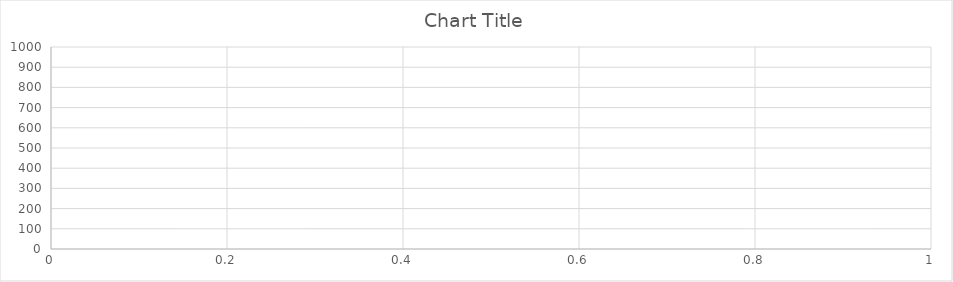
| Category | Series 0 |
|---|---|
| 0 | 0 |
| 1 | 0 |
| 2 | 0 |
| 3 | 0 |
| 4 | 0 |
| 5 | 0 |
| 6 | 0 |
| 7 | 0 |
| 8 | 0 |
| 9 | 0 |
| 10 | 0 |
| 11 | 0 |
| 12 | 0 |
| 13 | 0 |
| 14 | 0 |
| 15 | 0 |
| 16 | 0 |
| 17 | 0 |
| 18 | 0 |
| 19 | 0 |
| 20 | 0 |
| 21 | 0 |
| 22 | 0 |
| 23 | 0 |
| 24 | 0 |
| 25 | 0 |
| 26 | 0 |
| 27 | 0 |
| 28 | 0 |
| 29 | 0 |
| 30 | 0 |
| 31 | 0 |
| 32 | 0 |
| 33 | 0 |
| 34 | 0 |
| 35 | 0 |
| 36 | 0 |
| 37 | 0 |
| 38 | 0 |
| 39 | 0 |
| 40 | 0 |
| 41 | 0 |
| 42 | 0 |
| 43 | 0 |
| 44 | 0 |
| 45 | 0 |
| 46 | 0 |
| 47 | 0 |
| 48 | 0 |
| 49 | 0 |
| 50 | 0 |
| 51 | 0 |
| 52 | 0 |
| 53 | 0 |
| 54 | 0 |
| 55 | 0 |
| 56 | 0 |
| 57 | 0 |
| 58 | 0 |
| 59 | 0 |
| 60 | 0 |
| 61 | 0 |
| 62 | 0 |
| 63 | 0 |
| 64 | 0 |
| 65 | 0 |
| 66 | 0 |
| 67 | 0 |
| 68 | 0 |
| 69 | 0 |
| 70 | 0 |
| 71 | 0 |
| 72 | 0 |
| 73 | 0 |
| 74 | 0 |
| 75 | 0 |
| 76 | 0 |
| 77 | 0 |
| 78 | 0 |
| 79 | 0 |
| 80 | 0 |
| 81 | 0 |
| 82 | 0 |
| 83 | 0 |
| 84 | 0 |
| 85 | 0 |
| 86 | 0 |
| 87 | 0 |
| 88 | 0 |
| 89 | 0 |
| 90 | 0 |
| 91 | 0 |
| 92 | 0 |
| 93 | 0 |
| 94 | 0 |
| 95 | 0 |
| 96 | 0 |
| 97 | 0 |
| 98 | 0 |
| 99 | 0 |
| 100 | 0 |
| 101 | 913 |
| 102 | 913 |
| 103 | 912 |
| 104 | 0 |
| 105 | 0 |
| 106 | 0 |
| 107 | 0 |
| 108 | 0 |
| 109 | 0 |
| 110 | 0 |
| 111 | 0 |
| 112 | 0 |
| 113 | 0 |
| 114 | 0 |
| 115 | 0 |
| 116 | 0 |
| 117 | 0 |
| 118 | 0 |
| 119 | 0 |
| 120 | 0 |
| 121 | 0 |
| 122 | 0 |
| 123 | 0 |
| 124 | 0 |
| 125 | 0 |
| 126 | 0 |
| 127 | 0 |
| 128 | 0 |
| 129 | 0 |
| 130 | 0 |
| 131 | 0 |
| 132 | 0 |
| 133 | 0 |
| 134 | 0 |
| 135 | 0 |
| 136 | 0 |
| 137 | 0 |
| 138 | 0 |
| 139 | 0 |
| 140 | 0 |
| 141 | 0 |
| 142 | 0 |
| 143 | 0 |
| 144 | 0 |
| 145 | 0 |
| 146 | 0 |
| 147 | 0 |
| 148 | 0 |
| 149 | 0 |
| 150 | 0 |
| 151 | 0 |
| 152 | 0 |
| 153 | 0 |
| 154 | 0 |
| 155 | 0 |
| 156 | 0 |
| 157 | 0 |
| 158 | 0 |
| 159 | 0 |
| 160 | 0 |
| 161 | 0 |
| 162 | 0 |
| 163 | 0 |
| 164 | 0 |
| 165 | 0 |
| 166 | 0 |
| 167 | 0 |
| 168 | 0 |
| 169 | 0 |
| 170 | 0 |
| 171 | 0 |
| 172 | 0 |
| 173 | 0 |
| 174 | 0 |
| 175 | 0 |
| 176 | 0 |
| 177 | 0 |
| 178 | 0 |
| 179 | 0 |
| 180 | 0 |
| 181 | 0 |
| 182 | 0 |
| 183 | 0 |
| 184 | 0 |
| 185 | 0 |
| 186 | 0 |
| 187 | 0 |
| 188 | 0 |
| 189 | 0 |
| 190 | 0 |
| 191 | 0 |
| 192 | 0 |
| 193 | 0 |
| 194 | 0 |
| 195 | 0 |
| 196 | 0 |
| 197 | 0 |
| 198 | 0 |
| 199 | 0 |
| 200 | 0 |
| 201 | 0 |
| 202 | 0 |
| 203 | 0 |
| 204 | 0 |
| 205 | 0 |
| 206 | 0 |
| 207 | 0 |
| 208 | 0 |
| 209 | 0 |
| 210 | 0 |
| 211 | 0 |
| 212 | 0 |
| 213 | 0 |
| 214 | 0 |
| 215 | 0 |
| 216 | 0 |
| 217 | 0 |
| 218 | 0 |
| 219 | 0 |
| 220 | 0 |
| 221 | 0 |
| 222 | 0 |
| 223 | 0 |
| 224 | 0 |
| 225 | 0 |
| 226 | 0 |
| 227 | 0 |
| 228 | 0 |
| 229 | 0 |
| 230 | 0 |
| 231 | 0 |
| 232 | 0 |
| 233 | 0 |
| 234 | 0 |
| 235 | 0 |
| 236 | 0 |
| 237 | 0 |
| 238 | 0 |
| 239 | 0 |
| 240 | 0 |
| 241 | 0 |
| 242 | 0 |
| 243 | 0 |
| 244 | 0 |
| 245 | 0 |
| 246 | 0 |
| 247 | 0 |
| 248 | 0 |
| 249 | 0 |
| 250 | 0 |
| 251 | 0 |
| 252 | 0 |
| 253 | 0 |
| 254 | 0 |
| 255 | 0 |
| 256 | 0 |
| 257 | 0 |
| 258 | 0 |
| 259 | 0 |
| 260 | 0 |
| 261 | 0 |
| 262 | 0 |
| 263 | 0 |
| 264 | 0 |
| 265 | 0 |
| 266 | 0 |
| 267 | 0 |
| 268 | 0 |
| 269 | 0 |
| 270 | 0 |
| 271 | 0 |
| 272 | 0 |
| 273 | 0 |
| 274 | 0 |
| 275 | 0 |
| 276 | 0 |
| 277 | 0 |
| 278 | 0 |
| 279 | 0 |
| 280 | 0 |
| 281 | 0 |
| 282 | 0 |
| 283 | 0 |
| 284 | 0 |
| 285 | 0 |
| 286 | 0 |
| 287 | 0 |
| 288 | 0 |
| 289 | 0 |
| 290 | 0 |
| 291 | 0 |
| 292 | 0 |
| 293 | 0 |
| 294 | 0 |
| 295 | 0 |
| 296 | 0 |
| 297 | 0 |
| 298 | 0 |
| 299 | 0 |
| 300 | 0 |
| 301 | 0 |
| 302 | 0 |
| 303 | 0 |
| 304 | 0 |
| 305 | 0 |
| 306 | 0 |
| 307 | 0 |
| 308 | 0 |
| 309 | 0 |
| 310 | 0 |
| 311 | 0 |
| 312 | 0 |
| 313 | 0 |
| 314 | 0 |
| 315 | 0 |
| 316 | 0 |
| 317 | 0 |
| 318 | 0 |
| 319 | 0 |
| 320 | 0 |
| 321 | 0 |
| 322 | 0 |
| 323 | 0 |
| 324 | 0 |
| 325 | 0 |
| 326 | 0 |
| 327 | 0 |
| 328 | 0 |
| 329 | 0 |
| 330 | 0 |
| 331 | 0 |
| 332 | 0 |
| 333 | 0 |
| 334 | 0 |
| 335 | 0 |
| 336 | 0 |
| 337 | 912 |
| 338 | 911 |
| 339 | 911 |
| 340 | 0 |
| 341 | 0 |
| 342 | 0 |
| 343 | 0 |
| 344 | 0 |
| 345 | 0 |
| 346 | 0 |
| 347 | 0 |
| 348 | 0 |
| 349 | 0 |
| 350 | 0 |
| 351 | 0 |
| 352 | 0 |
| 353 | 0 |
| 354 | 0 |
| 355 | 0 |
| 356 | 0 |
| 357 | 0 |
| 358 | 0 |
| 359 | 0 |
| 360 | 0 |
| 361 | 0 |
| 362 | 0 |
| 363 | 0 |
| 364 | 0 |
| 365 | 0 |
| 366 | 0 |
| 367 | 0 |
| 368 | 0 |
| 369 | 0 |
| 370 | 0 |
| 371 | 0 |
| 372 | 0 |
| 373 | 0 |
| 374 | 0 |
| 375 | 0 |
| 376 | 0 |
| 377 | 0 |
| 378 | 0 |
| 379 | 0 |
| 380 | 0 |
| 381 | 0 |
| 382 | 0 |
| 383 | 0 |
| 384 | 0 |
| 385 | 0 |
| 386 | 0 |
| 387 | 0 |
| 388 | 0 |
| 389 | 0 |
| 390 | 0 |
| 391 | 0 |
| 392 | 0 |
| 393 | 0 |
| 394 | 0 |
| 395 | 0 |
| 396 | 0 |
| 397 | 0 |
| 398 | 0 |
| 399 | 0 |
| 400 | 0 |
| 401 | 0 |
| 402 | 0 |
| 403 | 0 |
| 404 | 0 |
| 405 | 0 |
| 406 | 0 |
| 407 | 0 |
| 408 | 0 |
| 409 | 0 |
| 410 | 0 |
| 411 | 0 |
| 412 | 0 |
| 413 | 0 |
| 414 | 0 |
| 415 | 0 |
| 416 | 0 |
| 417 | 0 |
| 418 | 0 |
| 419 | 0 |
| 420 | 0 |
| 421 | 0 |
| 422 | 0 |
| 423 | 0 |
| 424 | 0 |
| 425 | 0 |
| 426 | 0 |
| 427 | 0 |
| 428 | 0 |
| 429 | 0 |
| 430 | 0 |
| 431 | 0 |
| 432 | 0 |
| 433 | 0 |
| 434 | 0 |
| 435 | 0 |
| 436 | 0 |
| 437 | 0 |
| 438 | 0 |
| 439 | 0 |
| 440 | 0 |
| 441 | 0 |
| 442 | 0 |
| 443 | 0 |
| 444 | 0 |
| 445 | 0 |
| 446 | 0 |
| 447 | 0 |
| 448 | 0 |
| 449 | 0 |
| 450 | 0 |
| 451 | 0 |
| 452 | 0 |
| 453 | 0 |
| 454 | 0 |
| 455 | 0 |
| 456 | 0 |
| 457 | 0 |
| 458 | 0 |
| 459 | 0 |
| 460 | 0 |
| 461 | 0 |
| 462 | 0 |
| 463 | 0 |
| 464 | 0 |
| 465 | 0 |
| 466 | 0 |
| 467 | 0 |
| 468 | 0 |
| 469 | 0 |
| 470 | 0 |
| 471 | 0 |
| 472 | 0 |
| 473 | 0 |
| 474 | 0 |
| 475 | 0 |
| 476 | 0 |
| 477 | 0 |
| 478 | 0 |
| 479 | 0 |
| 480 | 0 |
| 481 | 0 |
| 482 | 0 |
| 483 | 0 |
| 484 | 0 |
| 485 | 0 |
| 486 | 0 |
| 487 | 0 |
| 488 | 0 |
| 489 | 0 |
| 490 | 0 |
| 491 | 0 |
| 492 | 0 |
| 493 | 0 |
| 494 | 0 |
| 495 | 0 |
| 496 | 0 |
| 497 | 0 |
| 498 | 0 |
| 499 | 0 |
| 500 | 0 |
| 501 | 0 |
| 502 | 0 |
| 503 | 0 |
| 504 | 0 |
| 505 | 0 |
| 506 | 0 |
| 507 | 0 |
| 508 | 0 |
| 509 | 0 |
| 510 | 0 |
| 511 | 0 |
| 512 | 0 |
| 513 | 0 |
| 514 | 0 |
| 515 | 0 |
| 516 | 0 |
| 517 | 0 |
| 518 | 0 |
| 519 | 0 |
| 520 | 0 |
| 521 | 0 |
| 522 | 0 |
| 523 | 0 |
| 524 | 0 |
| 525 | 0 |
| 526 | 0 |
| 527 | 0 |
| 528 | 0 |
| 529 | 0 |
| 530 | 0 |
| 531 | 0 |
| 532 | 0 |
| 533 | 0 |
| 534 | 0 |
| 535 | 0 |
| 536 | 0 |
| 537 | 0 |
| 538 | 0 |
| 539 | 0 |
| 540 | 0 |
| 541 | 0 |
| 542 | 0 |
| 543 | 0 |
| 544 | 0 |
| 545 | 0 |
| 546 | 0 |
| 547 | 0 |
| 548 | 0 |
| 549 | 0 |
| 550 | 0 |
| 551 | 0 |
| 552 | 0 |
| 553 | 0 |
| 554 | 0 |
| 555 | 0 |
| 556 | 0 |
| 557 | 0 |
| 558 | 0 |
| 559 | 0 |
| 560 | 0 |
| 561 | 0 |
| 562 | 0 |
| 563 | 0 |
| 564 | 0 |
| 565 | 0 |
| 566 | 0 |
| 567 | 0 |
| 568 | 0 |
| 569 | 0 |
| 570 | 0 |
| 571 | 0 |
| 572 | 0 |
| 573 | 912 |
| 574 | 911 |
| 575 | 910 |
| 576 | 0 |
| 577 | 0 |
| 578 | 0 |
| 579 | 0 |
| 580 | 0 |
| 581 | 0 |
| 582 | 0 |
| 583 | 0 |
| 584 | 0 |
| 585 | 0 |
| 586 | 0 |
| 587 | 0 |
| 588 | 0 |
| 589 | 0 |
| 590 | 0 |
| 591 | 0 |
| 592 | 0 |
| 593 | 0 |
| 594 | 0 |
| 595 | 0 |
| 596 | 0 |
| 597 | 0 |
| 598 | 0 |
| 599 | 0 |
| 600 | 0 |
| 601 | 0 |
| 602 | 0 |
| 603 | 0 |
| 604 | 0 |
| 605 | 0 |
| 606 | 0 |
| 607 | 0 |
| 608 | 0 |
| 609 | 0 |
| 610 | 0 |
| 611 | 0 |
| 612 | 0 |
| 613 | 0 |
| 614 | 0 |
| 615 | 0 |
| 616 | 0 |
| 617 | 0 |
| 618 | 0 |
| 619 | 0 |
| 620 | 0 |
| 621 | 0 |
| 622 | 0 |
| 623 | 0 |
| 624 | 0 |
| 625 | 0 |
| 626 | 0 |
| 627 | 0 |
| 628 | 0 |
| 629 | 0 |
| 630 | 0 |
| 631 | 0 |
| 632 | 0 |
| 633 | 0 |
| 634 | 0 |
| 635 | 0 |
| 636 | 0 |
| 637 | 0 |
| 638 | 0 |
| 639 | 0 |
| 640 | 0 |
| 641 | 0 |
| 642 | 0 |
| 643 | 0 |
| 644 | 0 |
| 645 | 0 |
| 646 | 0 |
| 647 | 0 |
| 648 | 0 |
| 649 | 0 |
| 650 | 0 |
| 651 | 0 |
| 652 | 0 |
| 653 | 0 |
| 654 | 0 |
| 655 | 0 |
| 656 | 0 |
| 657 | 0 |
| 658 | 0 |
| 659 | 0 |
| 660 | 0 |
| 661 | 0 |
| 662 | 0 |
| 663 | 0 |
| 664 | 0 |
| 665 | 0 |
| 666 | 0 |
| 667 | 0 |
| 668 | 0 |
| 669 | 0 |
| 670 | 0 |
| 671 | 0 |
| 672 | 0 |
| 673 | 0 |
| 674 | 0 |
| 675 | 0 |
| 676 | 0 |
| 677 | 0 |
| 678 | 0 |
| 679 | 0 |
| 680 | 0 |
| 681 | 0 |
| 682 | 0 |
| 683 | 0 |
| 684 | 0 |
| 685 | 0 |
| 686 | 0 |
| 687 | 0 |
| 688 | 0 |
| 689 | 0 |
| 690 | 0 |
| 691 | 0 |
| 692 | 0 |
| 693 | 0 |
| 694 | 0 |
| 695 | 0 |
| 696 | 0 |
| 697 | 0 |
| 698 | 0 |
| 699 | 0 |
| 700 | 0 |
| 701 | 0 |
| 702 | 0 |
| 703 | 0 |
| 704 | 0 |
| 705 | 0 |
| 706 | 0 |
| 707 | 0 |
| 708 | 0 |
| 709 | 0 |
| 710 | 0 |
| 711 | 0 |
| 712 | 0 |
| 713 | 0 |
| 714 | 0 |
| 715 | 0 |
| 716 | 0 |
| 717 | 0 |
| 718 | 0 |
| 719 | 0 |
| 720 | 0 |
| 721 | 0 |
| 722 | 0 |
| 723 | 0 |
| 724 | 0 |
| 725 | 0 |
| 726 | 0 |
| 727 | 0 |
| 728 | 0 |
| 729 | 0 |
| 730 | 0 |
| 731 | 0 |
| 732 | 0 |
| 733 | 0 |
| 734 | 0 |
| 735 | 0 |
| 736 | 0 |
| 737 | 0 |
| 738 | 0 |
| 739 | 0 |
| 740 | 0 |
| 741 | 0 |
| 742 | 0 |
| 743 | 0 |
| 744 | 0 |
| 745 | 0 |
| 746 | 0 |
| 747 | 0 |
| 748 | 0 |
| 749 | 0 |
| 750 | 0 |
| 751 | 0 |
| 752 | 0 |
| 753 | 0 |
| 754 | 0 |
| 755 | 0 |
| 756 | 0 |
| 757 | 0 |
| 758 | 0 |
| 759 | 0 |
| 760 | 0 |
| 761 | 0 |
| 762 | 0 |
| 763 | 0 |
| 764 | 0 |
| 765 | 0 |
| 766 | 0 |
| 767 | 0 |
| 768 | 0 |
| 769 | 0 |
| 770 | 0 |
| 771 | 0 |
| 772 | 0 |
| 773 | 0 |
| 774 | 0 |
| 775 | 0 |
| 776 | 0 |
| 777 | 0 |
| 778 | 0 |
| 779 | 0 |
| 780 | 0 |
| 781 | 0 |
| 782 | 0 |
| 783 | 0 |
| 784 | 0 |
| 785 | 0 |
| 786 | 0 |
| 787 | 0 |
| 788 | 0 |
| 789 | 0 |
| 790 | 0 |
| 791 | 0 |
| 792 | 0 |
| 793 | 0 |
| 794 | 0 |
| 795 | 0 |
| 796 | 0 |
| 797 | 0 |
| 798 | 0 |
| 799 | 0 |
| 800 | 0 |
| 801 | 0 |
| 802 | 0 |
| 803 | 0 |
| 804 | 0 |
| 805 | 0 |
| 806 | 0 |
| 807 | 0 |
| 808 | 914 |
| 809 | 914 |
| 810 | 912 |
| 811 | 912 |
| 812 | 0 |
| 813 | 0 |
| 814 | 0 |
| 815 | 0 |
| 816 | 0 |
| 817 | 0 |
| 818 | 0 |
| 819 | 0 |
| 820 | 0 |
| 821 | 0 |
| 822 | 0 |
| 823 | 0 |
| 824 | 0 |
| 825 | 0 |
| 826 | 0 |
| 827 | 0 |
| 828 | 0 |
| 829 | 0 |
| 830 | 0 |
| 831 | 0 |
| 832 | 0 |
| 833 | 0 |
| 834 | 0 |
| 835 | 0 |
| 836 | 0 |
| 837 | 0 |
| 838 | 0 |
| 839 | 0 |
| 840 | 0 |
| 841 | 0 |
| 842 | 0 |
| 843 | 0 |
| 844 | 0 |
| 845 | 0 |
| 846 | 0 |
| 847 | 0 |
| 848 | 0 |
| 849 | 0 |
| 850 | 0 |
| 851 | 0 |
| 852 | 0 |
| 853 | 0 |
| 854 | 0 |
| 855 | 0 |
| 856 | 0 |
| 857 | 0 |
| 858 | 0 |
| 859 | 0 |
| 860 | 0 |
| 861 | 0 |
| 862 | 0 |
| 863 | 0 |
| 864 | 0 |
| 865 | 0 |
| 866 | 0 |
| 867 | 0 |
| 868 | 0 |
| 869 | 0 |
| 870 | 0 |
| 871 | 0 |
| 872 | 0 |
| 873 | 0 |
| 874 | 0 |
| 875 | 0 |
| 876 | 0 |
| 877 | 0 |
| 878 | 0 |
| 879 | 0 |
| 880 | 0 |
| 881 | 0 |
| 882 | 0 |
| 883 | 0 |
| 884 | 0 |
| 885 | 0 |
| 886 | 0 |
| 887 | 0 |
| 888 | 0 |
| 889 | 0 |
| 890 | 0 |
| 891 | 0 |
| 892 | 0 |
| 893 | 0 |
| 894 | 0 |
| 895 | 0 |
| 896 | 0 |
| 897 | 0 |
| 898 | 0 |
| 899 | 0 |
| 900 | 0 |
| 901 | 0 |
| 902 | 0 |
| 903 | 0 |
| 904 | 0 |
| 905 | 0 |
| 906 | 0 |
| 907 | 0 |
| 908 | 0 |
| 909 | 0 |
| 910 | 0 |
| 911 | 0 |
| 912 | 0 |
| 913 | 0 |
| 914 | 0 |
| 915 | 0 |
| 916 | 0 |
| 917 | 0 |
| 918 | 0 |
| 919 | 0 |
| 920 | 0 |
| 921 | 0 |
| 922 | 0 |
| 923 | 0 |
| 924 | 0 |
| 925 | 0 |
| 926 | 0 |
| 927 | 0 |
| 928 | 0 |
| 929 | 0 |
| 930 | 0 |
| 931 | 0 |
| 932 | 0 |
| 933 | 0 |
| 934 | 0 |
| 935 | 0 |
| 936 | 0 |
| 937 | 0 |
| 938 | 0 |
| 939 | 0 |
| 940 | 0 |
| 941 | 0 |
| 942 | 0 |
| 943 | 0 |
| 944 | 0 |
| 945 | 0 |
| 946 | 0 |
| 947 | 0 |
| 948 | 0 |
| 949 | 0 |
| 950 | 0 |
| 951 | 0 |
| 952 | 0 |
| 953 | 0 |
| 954 | 0 |
| 955 | 0 |
| 956 | 0 |
| 957 | 0 |
| 958 | 0 |
| 959 | 0 |
| 960 | 0 |
| 961 | 0 |
| 962 | 0 |
| 963 | 0 |
| 964 | 0 |
| 965 | 0 |
| 966 | 0 |
| 967 | 0 |
| 968 | 0 |
| 969 | 0 |
| 970 | 0 |
| 971 | 0 |
| 972 | 0 |
| 973 | 0 |
| 974 | 0 |
| 975 | 0 |
| 976 | 0 |
| 977 | 0 |
| 978 | 0 |
| 979 | 0 |
| 980 | 0 |
| 981 | 0 |
| 982 | 0 |
| 983 | 0 |
| 984 | 0 |
| 985 | 0 |
| 986 | 0 |
| 987 | 0 |
| 988 | 0 |
| 989 | 0 |
| 990 | 0 |
| 991 | 0 |
| 992 | 0 |
| 993 | 0 |
| 994 | 0 |
| 995 | 0 |
| 996 | 0 |
| 997 | 0 |
| 998 | 0 |
| 999 | 0 |
| 1000 | 0 |
| 1001 | 0 |
| 1002 | 0 |
| 1003 | 0 |
| 1004 | 0 |
| 1005 | 0 |
| 1006 | 0 |
| 1007 | 0 |
| 1008 | 0 |
| 1009 | 0 |
| 1010 | 0 |
| 1011 | 0 |
| 1012 | 0 |
| 1013 | 0 |
| 1014 | 0 |
| 1015 | 0 |
| 1016 | 0 |
| 1017 | 0 |
| 1018 | 0 |
| 1019 | 0 |
| 1020 | 0 |
| 1021 | 0 |
| 1022 | 0 |
| 1023 | 0 |
| 1024 | 0 |
| 1025 | 0 |
| 1026 | 0 |
| 1027 | 0 |
| 1028 | 0 |
| 1029 | 0 |
| 1030 | 0 |
| 1031 | 0 |
| 1032 | 0 |
| 1033 | 0 |
| 1034 | 0 |
| 1035 | 0 |
| 1036 | 0 |
| 1037 | 0 |
| 1038 | 0 |
| 1039 | 0 |
| 1040 | 0 |
| 1041 | 0 |
| 1042 | 0 |
| 1043 | 913 |
| 1044 | 914 |
| 1045 | 912 |
| 1046 | 913 |
| 1047 | 0 |
| 1048 | 0 |
| 1049 | 0 |
| 1050 | 0 |
| 1051 | 0 |
| 1052 | 0 |
| 1053 | 0 |
| 1054 | 0 |
| 1055 | 0 |
| 1056 | 0 |
| 1057 | 0 |
| 1058 | 0 |
| 1059 | 0 |
| 1060 | 0 |
| 1061 | 0 |
| 1062 | 0 |
| 1063 | 0 |
| 1064 | 0 |
| 1065 | 0 |
| 1066 | 0 |
| 1067 | 0 |
| 1068 | 0 |
| 1069 | 0 |
| 1070 | 0 |
| 1071 | 0 |
| 1072 | 0 |
| 1073 | 0 |
| 1074 | 0 |
| 1075 | 0 |
| 1076 | 0 |
| 1077 | 0 |
| 1078 | 0 |
| 1079 | 0 |
| 1080 | 0 |
| 1081 | 0 |
| 1082 | 0 |
| 1083 | 0 |
| 1084 | 0 |
| 1085 | 0 |
| 1086 | 0 |
| 1087 | 0 |
| 1088 | 0 |
| 1089 | 0 |
| 1090 | 0 |
| 1091 | 0 |
| 1092 | 0 |
| 1093 | 0 |
| 1094 | 0 |
| 1095 | 0 |
| 1096 | 0 |
| 1097 | 0 |
| 1098 | 0 |
| 1099 | 0 |
| 1100 | 0 |
| 1101 | 0 |
| 1102 | 0 |
| 1103 | 0 |
| 1104 | 0 |
| 1105 | 0 |
| 1106 | 0 |
| 1107 | 0 |
| 1108 | 0 |
| 1109 | 0 |
| 1110 | 0 |
| 1111 | 0 |
| 1112 | 0 |
| 1113 | 0 |
| 1114 | 0 |
| 1115 | 0 |
| 1116 | 0 |
| 1117 | 0 |
| 1118 | 0 |
| 1119 | 0 |
| 1120 | 0 |
| 1121 | 0 |
| 1122 | 0 |
| 1123 | 0 |
| 1124 | 0 |
| 1125 | 0 |
| 1126 | 0 |
| 1127 | 0 |
| 1128 | 0 |
| 1129 | 0 |
| 1130 | 0 |
| 1131 | 0 |
| 1132 | 0 |
| 1133 | 0 |
| 1134 | 0 |
| 1135 | 0 |
| 1136 | 0 |
| 1137 | 0 |
| 1138 | 0 |
| 1139 | 0 |
| 1140 | 0 |
| 1141 | 0 |
| 1142 | 0 |
| 1143 | 0 |
| 1144 | 0 |
| 1145 | 0 |
| 1146 | 0 |
| 1147 | 0 |
| 1148 | 0 |
| 1149 | 0 |
| 1150 | 0 |
| 1151 | 0 |
| 1152 | 0 |
| 1153 | 0 |
| 1154 | 0 |
| 1155 | 0 |
| 1156 | 0 |
| 1157 | 0 |
| 1158 | 0 |
| 1159 | 0 |
| 1160 | 0 |
| 1161 | 0 |
| 1162 | 0 |
| 1163 | 0 |
| 1164 | 0 |
| 1165 | 0 |
| 1166 | 0 |
| 1167 | 0 |
| 1168 | 0 |
| 1169 | 0 |
| 1170 | 0 |
| 1171 | 0 |
| 1172 | 0 |
| 1173 | 0 |
| 1174 | 0 |
| 1175 | 0 |
| 1176 | 0 |
| 1177 | 0 |
| 1178 | 0 |
| 1179 | 0 |
| 1180 | 0 |
| 1181 | 0 |
| 1182 | 0 |
| 1183 | 0 |
| 1184 | 0 |
| 1185 | 0 |
| 1186 | 0 |
| 1187 | 0 |
| 1188 | 0 |
| 1189 | 0 |
| 1190 | 0 |
| 1191 | 0 |
| 1192 | 0 |
| 1193 | 0 |
| 1194 | 0 |
| 1195 | 0 |
| 1196 | 0 |
| 1197 | 0 |
| 1198 | 0 |
| 1199 | 0 |
| 1200 | 0 |
| 1201 | 0 |
| 1202 | 0 |
| 1203 | 0 |
| 1204 | 0 |
| 1205 | 0 |
| 1206 | 0 |
| 1207 | 0 |
| 1208 | 0 |
| 1209 | 0 |
| 1210 | 0 |
| 1211 | 0 |
| 1212 | 0 |
| 1213 | 0 |
| 1214 | 0 |
| 1215 | 0 |
| 1216 | 0 |
| 1217 | 0 |
| 1218 | 0 |
| 1219 | 0 |
| 1220 | 0 |
| 1221 | 0 |
| 1222 | 0 |
| 1223 | 0 |
| 1224 | 0 |
| 1225 | 0 |
| 1226 | 0 |
| 1227 | 0 |
| 1228 | 0 |
| 1229 | 0 |
| 1230 | 0 |
| 1231 | 0 |
| 1232 | 0 |
| 1233 | 0 |
| 1234 | 0 |
| 1235 | 0 |
| 1236 | 0 |
| 1237 | 0 |
| 1238 | 0 |
| 1239 | 0 |
| 1240 | 0 |
| 1241 | 0 |
| 1242 | 0 |
| 1243 | 0 |
| 1244 | 0 |
| 1245 | 0 |
| 1246 | 0 |
| 1247 | 0 |
| 1248 | 0 |
| 1249 | 0 |
| 1250 | 0 |
| 1251 | 0 |
| 1252 | 0 |
| 1253 | 0 |
| 1254 | 0 |
| 1255 | 0 |
| 1256 | 0 |
| 1257 | 0 |
| 1258 | 0 |
| 1259 | 0 |
| 1260 | 0 |
| 1261 | 0 |
| 1262 | 0 |
| 1263 | 0 |
| 1264 | 0 |
| 1265 | 0 |
| 1266 | 0 |
| 1267 | 0 |
| 1268 | 0 |
| 1269 | 0 |
| 1270 | 0 |
| 1271 | 0 |
| 1272 | 0 |
| 1273 | 0 |
| 1274 | 0 |
| 1275 | 0 |
| 1276 | 0 |
| 1277 | 0 |
| 1278 | 0 |
| 1279 | 913 |
| 1280 | 914 |
| 1281 | 912 |
| 1282 | 0 |
| 1283 | 0 |
| 1284 | 0 |
| 1285 | 0 |
| 1286 | 0 |
| 1287 | 0 |
| 1288 | 0 |
| 1289 | 0 |
| 1290 | 0 |
| 1291 | 0 |
| 1292 | 0 |
| 1293 | 0 |
| 1294 | 0 |
| 1295 | 0 |
| 1296 | 0 |
| 1297 | 0 |
| 1298 | 0 |
| 1299 | 0 |
| 1300 | 0 |
| 1301 | 0 |
| 1302 | 0 |
| 1303 | 0 |
| 1304 | 0 |
| 1305 | 0 |
| 1306 | 0 |
| 1307 | 0 |
| 1308 | 0 |
| 1309 | 0 |
| 1310 | 0 |
| 1311 | 0 |
| 1312 | 0 |
| 1313 | 0 |
| 1314 | 0 |
| 1315 | 0 |
| 1316 | 0 |
| 1317 | 0 |
| 1318 | 0 |
| 1319 | 0 |
| 1320 | 0 |
| 1321 | 0 |
| 1322 | 0 |
| 1323 | 0 |
| 1324 | 0 |
| 1325 | 0 |
| 1326 | 0 |
| 1327 | 0 |
| 1328 | 0 |
| 1329 | 0 |
| 1330 | 0 |
| 1331 | 0 |
| 1332 | 0 |
| 1333 | 0 |
| 1334 | 0 |
| 1335 | 0 |
| 1336 | 0 |
| 1337 | 0 |
| 1338 | 0 |
| 1339 | 0 |
| 1340 | 0 |
| 1341 | 0 |
| 1342 | 0 |
| 1343 | 0 |
| 1344 | 0 |
| 1345 | 0 |
| 1346 | 0 |
| 1347 | 0 |
| 1348 | 0 |
| 1349 | 0 |
| 1350 | 0 |
| 1351 | 0 |
| 1352 | 0 |
| 1353 | 0 |
| 1354 | 0 |
| 1355 | 0 |
| 1356 | 0 |
| 1357 | 0 |
| 1358 | 0 |
| 1359 | 0 |
| 1360 | 0 |
| 1361 | 0 |
| 1362 | 0 |
| 1363 | 0 |
| 1364 | 0 |
| 1365 | 0 |
| 1366 | 0 |
| 1367 | 0 |
| 1368 | 0 |
| 1369 | 0 |
| 1370 | 0 |
| 1371 | 0 |
| 1372 | 0 |
| 1373 | 0 |
| 1374 | 0 |
| 1375 | 0 |
| 1376 | 0 |
| 1377 | 0 |
| 1378 | 0 |
| 1379 | 0 |
| 1380 | 0 |
| 1381 | 0 |
| 1382 | 0 |
| 1383 | 0 |
| 1384 | 0 |
| 1385 | 0 |
| 1386 | 0 |
| 1387 | 0 |
| 1388 | 0 |
| 1389 | 0 |
| 1390 | 0 |
| 1391 | 0 |
| 1392 | 0 |
| 1393 | 0 |
| 1394 | 0 |
| 1395 | 0 |
| 1396 | 0 |
| 1397 | 0 |
| 1398 | 0 |
| 1399 | 0 |
| 1400 | 0 |
| 1401 | 0 |
| 1402 | 0 |
| 1403 | 0 |
| 1404 | 0 |
| 1405 | 0 |
| 1406 | 0 |
| 1407 | 0 |
| 1408 | 0 |
| 1409 | 0 |
| 1410 | 0 |
| 1411 | 0 |
| 1412 | 0 |
| 1413 | 0 |
| 1414 | 0 |
| 1415 | 0 |
| 1416 | 0 |
| 1417 | 0 |
| 1418 | 0 |
| 1419 | 0 |
| 1420 | 0 |
| 1421 | 0 |
| 1422 | 0 |
| 1423 | 0 |
| 1424 | 0 |
| 1425 | 0 |
| 1426 | 0 |
| 1427 | 0 |
| 1428 | 0 |
| 1429 | 0 |
| 1430 | 0 |
| 1431 | 0 |
| 1432 | 0 |
| 1433 | 0 |
| 1434 | 0 |
| 1435 | 0 |
| 1436 | 0 |
| 1437 | 0 |
| 1438 | 0 |
| 1439 | 0 |
| 1440 | 0 |
| 1441 | 0 |
| 1442 | 0 |
| 1443 | 0 |
| 1444 | 0 |
| 1445 | 0 |
| 1446 | 0 |
| 1447 | 0 |
| 1448 | 0 |
| 1449 | 0 |
| 1450 | 0 |
| 1451 | 0 |
| 1452 | 0 |
| 1453 | 0 |
| 1454 | 0 |
| 1455 | 0 |
| 1456 | 0 |
| 1457 | 0 |
| 1458 | 0 |
| 1459 | 0 |
| 1460 | 0 |
| 1461 | 0 |
| 1462 | 0 |
| 1463 | 0 |
| 1464 | 0 |
| 1465 | 0 |
| 1466 | 0 |
| 1467 | 0 |
| 1468 | 0 |
| 1469 | 0 |
| 1470 | 0 |
| 1471 | 0 |
| 1472 | 0 |
| 1473 | 0 |
| 1474 | 0 |
| 1475 | 0 |
| 1476 | 0 |
| 1477 | 0 |
| 1478 | 0 |
| 1479 | 0 |
| 1480 | 0 |
| 1481 | 0 |
| 1482 | 0 |
| 1483 | 0 |
| 1484 | 0 |
| 1485 | 0 |
| 1486 | 0 |
| 1487 | 0 |
| 1488 | 0 |
| 1489 | 0 |
| 1490 | 0 |
| 1491 | 0 |
| 1492 | 0 |
| 1493 | 0 |
| 1494 | 0 |
| 1495 | 0 |
| 1496 | 0 |
| 1497 | 0 |
| 1498 | 0 |
| 1499 | 0 |
| 1500 | 0 |
| 1501 | 0 |
| 1502 | 0 |
| 1503 | 0 |
| 1504 | 0 |
| 1505 | 0 |
| 1506 | 0 |
| 1507 | 0 |
| 1508 | 0 |
| 1509 | 0 |
| 1510 | 0 |
| 1511 | 0 |
| 1512 | 0 |
| 1513 | 0 |
| 1514 | 913 |
| 1515 | 912 |
| 1516 | 911 |
| 1517 | 909 |
| 1518 | 0 |
| 1519 | 0 |
| 1520 | 0 |
| 1521 | 0 |
| 1522 | 0 |
| 1523 | 0 |
| 1524 | 0 |
| 1525 | 0 |
| 1526 | 0 |
| 1527 | 0 |
| 1528 | 0 |
| 1529 | 0 |
| 1530 | 0 |
| 1531 | 0 |
| 1532 | 0 |
| 1533 | 0 |
| 1534 | 0 |
| 1535 | 0 |
| 1536 | 0 |
| 1537 | 0 |
| 1538 | 0 |
| 1539 | 0 |
| 1540 | 0 |
| 1541 | 0 |
| 1542 | 0 |
| 1543 | 0 |
| 1544 | 0 |
| 1545 | 0 |
| 1546 | 0 |
| 1547 | 0 |
| 1548 | 0 |
| 1549 | 0 |
| 1550 | 0 |
| 1551 | 0 |
| 1552 | 0 |
| 1553 | 0 |
| 1554 | 0 |
| 1555 | 0 |
| 1556 | 0 |
| 1557 | 0 |
| 1558 | 0 |
| 1559 | 0 |
| 1560 | 0 |
| 1561 | 0 |
| 1562 | 0 |
| 1563 | 0 |
| 1564 | 0 |
| 1565 | 0 |
| 1566 | 0 |
| 1567 | 0 |
| 1568 | 0 |
| 1569 | 0 |
| 1570 | 0 |
| 1571 | 0 |
| 1572 | 0 |
| 1573 | 0 |
| 1574 | 0 |
| 1575 | 0 |
| 1576 | 0 |
| 1577 | 0 |
| 1578 | 0 |
| 1579 | 0 |
| 1580 | 0 |
| 1581 | 0 |
| 1582 | 0 |
| 1583 | 0 |
| 1584 | 0 |
| 1585 | 0 |
| 1586 | 0 |
| 1587 | 0 |
| 1588 | 0 |
| 1589 | 0 |
| 1590 | 0 |
| 1591 | 0 |
| 1592 | 0 |
| 1593 | 0 |
| 1594 | 0 |
| 1595 | 0 |
| 1596 | 0 |
| 1597 | 0 |
| 1598 | 0 |
| 1599 | 0 |
| 1600 | 0 |
| 1601 | 0 |
| 1602 | 0 |
| 1603 | 0 |
| 1604 | 0 |
| 1605 | 0 |
| 1606 | 0 |
| 1607 | 0 |
| 1608 | 0 |
| 1609 | 0 |
| 1610 | 0 |
| 1611 | 0 |
| 1612 | 0 |
| 1613 | 0 |
| 1614 | 0 |
| 1615 | 0 |
| 1616 | 0 |
| 1617 | 0 |
| 1618 | 0 |
| 1619 | 0 |
| 1620 | 0 |
| 1621 | 0 |
| 1622 | 0 |
| 1623 | 0 |
| 1624 | 0 |
| 1625 | 0 |
| 1626 | 0 |
| 1627 | 0 |
| 1628 | 0 |
| 1629 | 0 |
| 1630 | 0 |
| 1631 | 0 |
| 1632 | 0 |
| 1633 | 0 |
| 1634 | 0 |
| 1635 | 0 |
| 1636 | 0 |
| 1637 | 0 |
| 1638 | 0 |
| 1639 | 0 |
| 1640 | 0 |
| 1641 | 0 |
| 1642 | 0 |
| 1643 | 0 |
| 1644 | 0 |
| 1645 | 0 |
| 1646 | 0 |
| 1647 | 0 |
| 1648 | 0 |
| 1649 | 0 |
| 1650 | 0 |
| 1651 | 0 |
| 1652 | 0 |
| 1653 | 0 |
| 1654 | 0 |
| 1655 | 0 |
| 1656 | 0 |
| 1657 | 0 |
| 1658 | 0 |
| 1659 | 0 |
| 1660 | 0 |
| 1661 | 0 |
| 1662 | 0 |
| 1663 | 0 |
| 1664 | 0 |
| 1665 | 0 |
| 1666 | 0 |
| 1667 | 0 |
| 1668 | 0 |
| 1669 | 0 |
| 1670 | 0 |
| 1671 | 0 |
| 1672 | 0 |
| 1673 | 0 |
| 1674 | 0 |
| 1675 | 0 |
| 1676 | 0 |
| 1677 | 0 |
| 1678 | 0 |
| 1679 | 0 |
| 1680 | 0 |
| 1681 | 0 |
| 1682 | 0 |
| 1683 | 0 |
| 1684 | 0 |
| 1685 | 0 |
| 1686 | 0 |
| 1687 | 0 |
| 1688 | 0 |
| 1689 | 0 |
| 1690 | 0 |
| 1691 | 0 |
| 1692 | 0 |
| 1693 | 0 |
| 1694 | 0 |
| 1695 | 0 |
| 1696 | 0 |
| 1697 | 0 |
| 1698 | 0 |
| 1699 | 0 |
| 1700 | 0 |
| 1701 | 0 |
| 1702 | 0 |
| 1703 | 0 |
| 1704 | 0 |
| 1705 | 0 |
| 1706 | 0 |
| 1707 | 0 |
| 1708 | 0 |
| 1709 | 0 |
| 1710 | 0 |
| 1711 | 0 |
| 1712 | 0 |
| 1713 | 0 |
| 1714 | 0 |
| 1715 | 0 |
| 1716 | 0 |
| 1717 | 0 |
| 1718 | 0 |
| 1719 | 0 |
| 1720 | 0 |
| 1721 | 0 |
| 1722 | 0 |
| 1723 | 0 |
| 1724 | 0 |
| 1725 | 0 |
| 1726 | 0 |
| 1727 | 0 |
| 1728 | 0 |
| 1729 | 0 |
| 1730 | 0 |
| 1731 | 0 |
| 1732 | 0 |
| 1733 | 0 |
| 1734 | 0 |
| 1735 | 0 |
| 1736 | 0 |
| 1737 | 0 |
| 1738 | 0 |
| 1739 | 0 |
| 1740 | 0 |
| 1741 | 0 |
| 1742 | 0 |
| 1743 | 0 |
| 1744 | 0 |
| 1745 | 0 |
| 1746 | 0 |
| 1747 | 0 |
| 1748 | 0 |
| 1749 | 0 |
| 1750 | 913 |
| 1751 | 911 |
| 1752 | 912 |
| 1753 | 0 |
| 1754 | 0 |
| 1755 | 0 |
| 1756 | 0 |
| 1757 | 0 |
| 1758 | 0 |
| 1759 | 0 |
| 1760 | 0 |
| 1761 | 0 |
| 1762 | 0 |
| 1763 | 0 |
| 1764 | 0 |
| 1765 | 0 |
| 1766 | 0 |
| 1767 | 0 |
| 1768 | 0 |
| 1769 | 0 |
| 1770 | 0 |
| 1771 | 0 |
| 1772 | 0 |
| 1773 | 0 |
| 1774 | 0 |
| 1775 | 0 |
| 1776 | 0 |
| 1777 | 0 |
| 1778 | 0 |
| 1779 | 0 |
| 1780 | 0 |
| 1781 | 0 |
| 1782 | 0 |
| 1783 | 0 |
| 1784 | 0 |
| 1785 | 0 |
| 1786 | 0 |
| 1787 | 0 |
| 1788 | 0 |
| 1789 | 0 |
| 1790 | 0 |
| 1791 | 0 |
| 1792 | 0 |
| 1793 | 0 |
| 1794 | 0 |
| 1795 | 0 |
| 1796 | 0 |
| 1797 | 0 |
| 1798 | 0 |
| 1799 | 0 |
| 1800 | 0 |
| 1801 | 0 |
| 1802 | 0 |
| 1803 | 0 |
| 1804 | 0 |
| 1805 | 0 |
| 1806 | 0 |
| 1807 | 0 |
| 1808 | 0 |
| 1809 | 0 |
| 1810 | 0 |
| 1811 | 0 |
| 1812 | 0 |
| 1813 | 0 |
| 1814 | 0 |
| 1815 | 0 |
| 1816 | 0 |
| 1817 | 0 |
| 1818 | 0 |
| 1819 | 0 |
| 1820 | 0 |
| 1821 | 0 |
| 1822 | 0 |
| 1823 | 0 |
| 1824 | 0 |
| 1825 | 0 |
| 1826 | 0 |
| 1827 | 0 |
| 1828 | 0 |
| 1829 | 0 |
| 1830 | 0 |
| 1831 | 0 |
| 1832 | 0 |
| 1833 | 0 |
| 1834 | 0 |
| 1835 | 0 |
| 1836 | 0 |
| 1837 | 0 |
| 1838 | 0 |
| 1839 | 0 |
| 1840 | 0 |
| 1841 | 0 |
| 1842 | 0 |
| 1843 | 0 |
| 1844 | 0 |
| 1845 | 0 |
| 1846 | 0 |
| 1847 | 0 |
| 1848 | 0 |
| 1849 | 0 |
| 1850 | 0 |
| 1851 | 0 |
| 1852 | 0 |
| 1853 | 0 |
| 1854 | 0 |
| 1855 | 0 |
| 1856 | 0 |
| 1857 | 0 |
| 1858 | 0 |
| 1859 | 0 |
| 1860 | 0 |
| 1861 | 0 |
| 1862 | 0 |
| 1863 | 0 |
| 1864 | 0 |
| 1865 | 0 |
| 1866 | 0 |
| 1867 | 0 |
| 1868 | 0 |
| 1869 | 0 |
| 1870 | 0 |
| 1871 | 0 |
| 1872 | 0 |
| 1873 | 0 |
| 1874 | 0 |
| 1875 | 0 |
| 1876 | 0 |
| 1877 | 0 |
| 1878 | 0 |
| 1879 | 0 |
| 1880 | 0 |
| 1881 | 0 |
| 1882 | 0 |
| 1883 | 0 |
| 1884 | 0 |
| 1885 | 0 |
| 1886 | 0 |
| 1887 | 0 |
| 1888 | 0 |
| 1889 | 0 |
| 1890 | 0 |
| 1891 | 0 |
| 1892 | 0 |
| 1893 | 0 |
| 1894 | 0 |
| 1895 | 0 |
| 1896 | 0 |
| 1897 | 0 |
| 1898 | 0 |
| 1899 | 0 |
| 1900 | 0 |
| 1901 | 0 |
| 1902 | 0 |
| 1903 | 0 |
| 1904 | 0 |
| 1905 | 0 |
| 1906 | 0 |
| 1907 | 0 |
| 1908 | 0 |
| 1909 | 0 |
| 1910 | 0 |
| 1911 | 0 |
| 1912 | 0 |
| 1913 | 0 |
| 1914 | 0 |
| 1915 | 0 |
| 1916 | 0 |
| 1917 | 0 |
| 1918 | 0 |
| 1919 | 0 |
| 1920 | 0 |
| 1921 | 0 |
| 1922 | 0 |
| 1923 | 0 |
| 1924 | 0 |
| 1925 | 0 |
| 1926 | 0 |
| 1927 | 0 |
| 1928 | 0 |
| 1929 | 0 |
| 1930 | 0 |
| 1931 | 0 |
| 1932 | 0 |
| 1933 | 0 |
| 1934 | 0 |
| 1935 | 0 |
| 1936 | 0 |
| 1937 | 0 |
| 1938 | 0 |
| 1939 | 0 |
| 1940 | 0 |
| 1941 | 0 |
| 1942 | 0 |
| 1943 | 0 |
| 1944 | 0 |
| 1945 | 0 |
| 1946 | 0 |
| 1947 | 0 |
| 1948 | 0 |
| 1949 | 0 |
| 1950 | 0 |
| 1951 | 0 |
| 1952 | 0 |
| 1953 | 0 |
| 1954 | 0 |
| 1955 | 0 |
| 1956 | 0 |
| 1957 | 0 |
| 1958 | 0 |
| 1959 | 0 |
| 1960 | 0 |
| 1961 | 0 |
| 1962 | 0 |
| 1963 | 0 |
| 1964 | 0 |
| 1965 | 0 |
| 1966 | 0 |
| 1967 | 0 |
| 1968 | 912 |
| 1969 | 911 |
| 1970 | 910 |
| 1971 | 0 |
| 1972 | 0 |
| 1973 | 0 |
| 1974 | 0 |
| 1975 | 0 |
| 1976 | 0 |
| 1977 | 0 |
| 1978 | 0 |
| 1979 | 0 |
| 1980 | 0 |
| 1981 | 0 |
| 1982 | 0 |
| 1983 | 0 |
| 1984 | 0 |
| 1985 | 0 |
| 1986 | 0 |
| 1987 | 0 |
| 1988 | 0 |
| 1989 | 0 |
| 1990 | 0 |
| 1991 | 0 |
| 1992 | 0 |
| 1993 | 0 |
| 1994 | 0 |
| 1995 | 0 |
| 1996 | 0 |
| 1997 | 0 |
| 1998 | 0 |
| 1999 | 0 |
| 2000 | 0 |
| 2001 | 0 |
| 2002 | 0 |
| 2003 | 0 |
| 2004 | 0 |
| 2005 | 0 |
| 2006 | 0 |
| 2007 | 0 |
| 2008 | 0 |
| 2009 | 0 |
| 2010 | 0 |
| 2011 | 0 |
| 2012 | 0 |
| 2013 | 0 |
| 2014 | 0 |
| 2015 | 0 |
| 2016 | 0 |
| 2017 | 0 |
| 2018 | 0 |
| 2019 | 0 |
| 2020 | 0 |
| 2021 | 0 |
| 2022 | 0 |
| 2023 | 0 |
| 2024 | 0 |
| 2025 | 0 |
| 2026 | 0 |
| 2027 | 0 |
| 2028 | 0 |
| 2029 | 0 |
| 2030 | 0 |
| 2031 | 0 |
| 2032 | 0 |
| 2033 | 0 |
| 2034 | 0 |
| 2035 | 0 |
| 2036 | 0 |
| 2037 | 0 |
| 2038 | 0 |
| 2039 | 0 |
| 2040 | 0 |
| 2041 | 0 |
| 2042 | 0 |
| 2043 | 0 |
| 2044 | 0 |
| 2045 | 0 |
| 2046 | 0 |
| 2047 | 0 |
| 2048 | 0 |
| 2049 | 0 |
| 2050 | 0 |
| 2051 | 0 |
| 2052 | 0 |
| 2053 | 0 |
| 2054 | 0 |
| 2055 | 0 |
| 2056 | 0 |
| 2057 | 0 |
| 2058 | 0 |
| 2059 | 0 |
| 2060 | 0 |
| 2061 | 0 |
| 2062 | 0 |
| 2063 | 0 |
| 2064 | 0 |
| 2065 | 0 |
| 2066 | 0 |
| 2067 | 0 |
| 2068 | 0 |
| 2069 | 0 |
| 2070 | 0 |
| 2071 | 0 |
| 2072 | 0 |
| 2073 | 0 |
| 2074 | 0 |
| 2075 | 0 |
| 2076 | 0 |
| 2077 | 0 |
| 2078 | 0 |
| 2079 | 0 |
| 2080 | 0 |
| 2081 | 0 |
| 2082 | 0 |
| 2083 | 0 |
| 2084 | 0 |
| 2085 | 0 |
| 2086 | 0 |
| 2087 | 0 |
| 2088 | 0 |
| 2089 | 0 |
| 2090 | 0 |
| 2091 | 0 |
| 2092 | 0 |
| 2093 | 0 |
| 2094 | 0 |
| 2095 | 0 |
| 2096 | 0 |
| 2097 | 0 |
| 2098 | 0 |
| 2099 | 0 |
| 2100 | 0 |
| 2101 | 0 |
| 2102 | 0 |
| 2103 | 0 |
| 2104 | 0 |
| 2105 | 0 |
| 2106 | 0 |
| 2107 | 0 |
| 2108 | 0 |
| 2109 | 0 |
| 2110 | 0 |
| 2111 | 0 |
| 2112 | 0 |
| 2113 | 0 |
| 2114 | 0 |
| 2115 | 0 |
| 2116 | 0 |
| 2117 | 0 |
| 2118 | 0 |
| 2119 | 0 |
| 2120 | 0 |
| 2121 | 0 |
| 2122 | 0 |
| 2123 | 0 |
| 2124 | 0 |
| 2125 | 0 |
| 2126 | 0 |
| 2127 | 0 |
| 2128 | 0 |
| 2129 | 0 |
| 2130 | 0 |
| 2131 | 0 |
| 2132 | 0 |
| 2133 | 0 |
| 2134 | 0 |
| 2135 | 0 |
| 2136 | 0 |
| 2137 | 0 |
| 2138 | 0 |
| 2139 | 0 |
| 2140 | 0 |
| 2141 | 0 |
| 2142 | 0 |
| 2143 | 0 |
| 2144 | 0 |
| 2145 | 0 |
| 2146 | 0 |
| 2147 | 0 |
| 2148 | 0 |
| 2149 | 0 |
| 2150 | 0 |
| 2151 | 0 |
| 2152 | 0 |
| 2153 | 0 |
| 2154 | 0 |
| 2155 | 0 |
| 2156 | 0 |
| 2157 | 0 |
| 2158 | 0 |
| 2159 | 0 |
| 2160 | 0 |
| 2161 | 914 |
| 2162 | 913 |
| 2163 | 911 |
| 2164 | 910 |
| 2165 | 0 |
| 2166 | 0 |
| 2167 | 0 |
| 2168 | 0 |
| 2169 | 0 |
| 2170 | 0 |
| 2171 | 0 |
| 2172 | 0 |
| 2173 | 0 |
| 2174 | 0 |
| 2175 | 0 |
| 2176 | 0 |
| 2177 | 0 |
| 2178 | 0 |
| 2179 | 0 |
| 2180 | 0 |
| 2181 | 0 |
| 2182 | 0 |
| 2183 | 0 |
| 2184 | 0 |
| 2185 | 0 |
| 2186 | 0 |
| 2187 | 0 |
| 2188 | 0 |
| 2189 | 0 |
| 2190 | 0 |
| 2191 | 0 |
| 2192 | 0 |
| 2193 | 0 |
| 2194 | 0 |
| 2195 | 0 |
| 2196 | 0 |
| 2197 | 0 |
| 2198 | 0 |
| 2199 | 0 |
| 2200 | 0 |
| 2201 | 0 |
| 2202 | 0 |
| 2203 | 0 |
| 2204 | 0 |
| 2205 | 0 |
| 2206 | 0 |
| 2207 | 0 |
| 2208 | 0 |
| 2209 | 0 |
| 2210 | 0 |
| 2211 | 0 |
| 2212 | 0 |
| 2213 | 0 |
| 2214 | 0 |
| 2215 | 0 |
| 2216 | 0 |
| 2217 | 0 |
| 2218 | 0 |
| 2219 | 0 |
| 2220 | 0 |
| 2221 | 0 |
| 2222 | 0 |
| 2223 | 0 |
| 2224 | 0 |
| 2225 | 0 |
| 2226 | 0 |
| 2227 | 0 |
| 2228 | 0 |
| 2229 | 0 |
| 2230 | 0 |
| 2231 | 0 |
| 2232 | 0 |
| 2233 | 0 |
| 2234 | 0 |
| 2235 | 0 |
| 2236 | 0 |
| 2237 | 0 |
| 2238 | 0 |
| 2239 | 0 |
| 2240 | 0 |
| 2241 | 0 |
| 2242 | 0 |
| 2243 | 0 |
| 2244 | 0 |
| 2245 | 0 |
| 2246 | 0 |
| 2247 | 0 |
| 2248 | 0 |
| 2249 | 0 |
| 2250 | 0 |
| 2251 | 0 |
| 2252 | 0 |
| 2253 | 0 |
| 2254 | 0 |
| 2255 | 0 |
| 2256 | 0 |
| 2257 | 0 |
| 2258 | 0 |
| 2259 | 0 |
| 2260 | 0 |
| 2261 | 0 |
| 2262 | 0 |
| 2263 | 0 |
| 2264 | 0 |
| 2265 | 0 |
| 2266 | 0 |
| 2267 | 0 |
| 2268 | 0 |
| 2269 | 0 |
| 2270 | 0 |
| 2271 | 0 |
| 2272 | 0 |
| 2273 | 0 |
| 2274 | 0 |
| 2275 | 0 |
| 2276 | 0 |
| 2277 | 0 |
| 2278 | 0 |
| 2279 | 0 |
| 2280 | 0 |
| 2281 | 0 |
| 2282 | 0 |
| 2283 | 0 |
| 2284 | 0 |
| 2285 | 0 |
| 2286 | 0 |
| 2287 | 0 |
| 2288 | 0 |
| 2289 | 0 |
| 2290 | 0 |
| 2291 | 0 |
| 2292 | 0 |
| 2293 | 0 |
| 2294 | 0 |
| 2295 | 0 |
| 2296 | 0 |
| 2297 | 0 |
| 2298 | 0 |
| 2299 | 0 |
| 2300 | 0 |
| 2301 | 0 |
| 2302 | 0 |
| 2303 | 0 |
| 2304 | 0 |
| 2305 | 0 |
| 2306 | 0 |
| 2307 | 0 |
| 2308 | 0 |
| 2309 | 0 |
| 2310 | 0 |
| 2311 | 0 |
| 2312 | 0 |
| 2313 | 0 |
| 2314 | 0 |
| 2315 | 0 |
| 2316 | 0 |
| 2317 | 0 |
| 2318 | 0 |
| 2319 | 0 |
| 2320 | 0 |
| 2321 | 0 |
| 2322 | 0 |
| 2323 | 0 |
| 2324 | 0 |
| 2325 | 0 |
| 2326 | 0 |
| 2327 | 0 |
| 2328 | 0 |
| 2329 | 0 |
| 2330 | 0 |
| 2331 | 0 |
| 2332 | 0 |
| 2333 | 0 |
| 2334 | 0 |
| 2335 | 0 |
| 2336 | 912 |
| 2337 | 912 |
| 2338 | 911 |
| 2339 | 912 |
| 2340 | 0 |
| 2341 | 0 |
| 2342 | 0 |
| 2343 | 0 |
| 2344 | 0 |
| 2345 | 0 |
| 2346 | 0 |
| 2347 | 0 |
| 2348 | 0 |
| 2349 | 0 |
| 2350 | 0 |
| 2351 | 0 |
| 2352 | 0 |
| 2353 | 0 |
| 2354 | 0 |
| 2355 | 0 |
| 2356 | 0 |
| 2357 | 0 |
| 2358 | 0 |
| 2359 | 0 |
| 2360 | 0 |
| 2361 | 0 |
| 2362 | 0 |
| 2363 | 0 |
| 2364 | 0 |
| 2365 | 0 |
| 2366 | 0 |
| 2367 | 0 |
| 2368 | 0 |
| 2369 | 0 |
| 2370 | 0 |
| 2371 | 0 |
| 2372 | 0 |
| 2373 | 0 |
| 2374 | 0 |
| 2375 | 0 |
| 2376 | 0 |
| 2377 | 0 |
| 2378 | 0 |
| 2379 | 0 |
| 2380 | 0 |
| 2381 | 0 |
| 2382 | 0 |
| 2383 | 0 |
| 2384 | 0 |
| 2385 | 0 |
| 2386 | 0 |
| 2387 | 0 |
| 2388 | 0 |
| 2389 | 0 |
| 2390 | 0 |
| 2391 | 0 |
| 2392 | 0 |
| 2393 | 0 |
| 2394 | 0 |
| 2395 | 0 |
| 2396 | 0 |
| 2397 | 0 |
| 2398 | 0 |
| 2399 | 0 |
| 2400 | 0 |
| 2401 | 0 |
| 2402 | 0 |
| 2403 | 0 |
| 2404 | 0 |
| 2405 | 0 |
| 2406 | 0 |
| 2407 | 0 |
| 2408 | 0 |
| 2409 | 0 |
| 2410 | 0 |
| 2411 | 0 |
| 2412 | 0 |
| 2413 | 0 |
| 2414 | 0 |
| 2415 | 0 |
| 2416 | 0 |
| 2417 | 0 |
| 2418 | 0 |
| 2419 | 0 |
| 2420 | 0 |
| 2421 | 0 |
| 2422 | 0 |
| 2423 | 0 |
| 2424 | 0 |
| 2425 | 0 |
| 2426 | 0 |
| 2427 | 0 |
| 2428 | 0 |
| 2429 | 0 |
| 2430 | 0 |
| 2431 | 0 |
| 2432 | 0 |
| 2433 | 0 |
| 2434 | 0 |
| 2435 | 0 |
| 2436 | 0 |
| 2437 | 0 |
| 2438 | 0 |
| 2439 | 0 |
| 2440 | 0 |
| 2441 | 0 |
| 2442 | 0 |
| 2443 | 0 |
| 2444 | 0 |
| 2445 | 0 |
| 2446 | 0 |
| 2447 | 0 |
| 2448 | 0 |
| 2449 | 0 |
| 2450 | 0 |
| 2451 | 0 |
| 2452 | 0 |
| 2453 | 0 |
| 2454 | 0 |
| 2455 | 0 |
| 2456 | 0 |
| 2457 | 0 |
| 2458 | 0 |
| 2459 | 0 |
| 2460 | 0 |
| 2461 | 0 |
| 2462 | 0 |
| 2463 | 0 |
| 2464 | 0 |
| 2465 | 0 |
| 2466 | 0 |
| 2467 | 0 |
| 2468 | 0 |
| 2469 | 0 |
| 2470 | 0 |
| 2471 | 0 |
| 2472 | 0 |
| 2473 | 0 |
| 2474 | 0 |
| 2475 | 0 |
| 2476 | 0 |
| 2477 | 0 |
| 2478 | 0 |
| 2479 | 0 |
| 2480 | 0 |
| 2481 | 0 |
| 2482 | 0 |
| 2483 | 0 |
| 2484 | 0 |
| 2485 | 0 |
| 2486 | 0 |
| 2487 | 0 |
| 2488 | 0 |
| 2489 | 0 |
| 2490 | 0 |
| 2491 | 0 |
| 2492 | 0 |
| 2493 | 0 |
| 2494 | 0 |
| 2495 | 913 |
| 2496 | 913 |
| 2497 | 913 |
| 2498 | 910 |
| 2499 | 0 |
| 2500 | 0 |
| 2501 | 0 |
| 2502 | 0 |
| 2503 | 0 |
| 2504 | 0 |
| 2505 | 0 |
| 2506 | 0 |
| 2507 | 0 |
| 2508 | 0 |
| 2509 | 0 |
| 2510 | 0 |
| 2511 | 0 |
| 2512 | 0 |
| 2513 | 0 |
| 2514 | 0 |
| 2515 | 0 |
| 2516 | 0 |
| 2517 | 0 |
| 2518 | 0 |
| 2519 | 0 |
| 2520 | 0 |
| 2521 | 0 |
| 2522 | 0 |
| 2523 | 0 |
| 2524 | 0 |
| 2525 | 0 |
| 2526 | 0 |
| 2527 | 0 |
| 2528 | 0 |
| 2529 | 0 |
| 2530 | 0 |
| 2531 | 0 |
| 2532 | 0 |
| 2533 | 0 |
| 2534 | 0 |
| 2535 | 0 |
| 2536 | 0 |
| 2537 | 0 |
| 2538 | 0 |
| 2539 | 0 |
| 2540 | 0 |
| 2541 | 0 |
| 2542 | 0 |
| 2543 | 0 |
| 2544 | 0 |
| 2545 | 0 |
| 2546 | 0 |
| 2547 | 0 |
| 2548 | 0 |
| 2549 | 0 |
| 2550 | 0 |
| 2551 | 0 |
| 2552 | 0 |
| 2553 | 0 |
| 2554 | 0 |
| 2555 | 0 |
| 2556 | 0 |
| 2557 | 0 |
| 2558 | 0 |
| 2559 | 0 |
| 2560 | 0 |
| 2561 | 0 |
| 2562 | 0 |
| 2563 | 0 |
| 2564 | 0 |
| 2565 | 0 |
| 2566 | 0 |
| 2567 | 0 |
| 2568 | 0 |
| 2569 | 0 |
| 2570 | 0 |
| 2571 | 0 |
| 2572 | 0 |
| 2573 | 0 |
| 2574 | 0 |
| 2575 | 0 |
| 2576 | 0 |
| 2577 | 0 |
| 2578 | 0 |
| 2579 | 0 |
| 2580 | 0 |
| 2581 | 0 |
| 2582 | 0 |
| 2583 | 0 |
| 2584 | 0 |
| 2585 | 0 |
| 2586 | 0 |
| 2587 | 0 |
| 2588 | 0 |
| 2589 | 0 |
| 2590 | 0 |
| 2591 | 0 |
| 2592 | 0 |
| 2593 | 0 |
| 2594 | 0 |
| 2595 | 0 |
| 2596 | 0 |
| 2597 | 0 |
| 2598 | 0 |
| 2599 | 0 |
| 2600 | 0 |
| 2601 | 0 |
| 2602 | 0 |
| 2603 | 0 |
| 2604 | 0 |
| 2605 | 0 |
| 2606 | 0 |
| 2607 | 0 |
| 2608 | 0 |
| 2609 | 0 |
| 2610 | 0 |
| 2611 | 0 |
| 2612 | 0 |
| 2613 | 0 |
| 2614 | 0 |
| 2615 | 0 |
| 2616 | 0 |
| 2617 | 0 |
| 2618 | 0 |
| 2619 | 0 |
| 2620 | 0 |
| 2621 | 0 |
| 2622 | 0 |
| 2623 | 0 |
| 2624 | 0 |
| 2625 | 0 |
| 2626 | 0 |
| 2627 | 0 |
| 2628 | 0 |
| 2629 | 0 |
| 2630 | 0 |
| 2631 | 0 |
| 2632 | 0 |
| 2633 | 0 |
| 2634 | 0 |
| 2635 | 0 |
| 2636 | 0 |
| 2637 | 0 |
| 2638 | 0 |
| 2639 | 0 |
| 2640 | 0 |
| 2641 | 914 |
| 2642 | 912 |
| 2643 | 912 |
| 2644 | 0 |
| 2645 | 0 |
| 2646 | 0 |
| 2647 | 0 |
| 2648 | 0 |
| 2649 | 0 |
| 2650 | 0 |
| 2651 | 0 |
| 2652 | 0 |
| 2653 | 0 |
| 2654 | 0 |
| 2655 | 0 |
| 2656 | 0 |
| 2657 | 0 |
| 2658 | 0 |
| 2659 | 0 |
| 2660 | 0 |
| 2661 | 0 |
| 2662 | 0 |
| 2663 | 0 |
| 2664 | 0 |
| 2665 | 0 |
| 2666 | 0 |
| 2667 | 0 |
| 2668 | 0 |
| 2669 | 0 |
| 2670 | 0 |
| 2671 | 0 |
| 2672 | 0 |
| 2673 | 0 |
| 2674 | 0 |
| 2675 | 0 |
| 2676 | 0 |
| 2677 | 0 |
| 2678 | 0 |
| 2679 | 0 |
| 2680 | 0 |
| 2681 | 0 |
| 2682 | 0 |
| 2683 | 0 |
| 2684 | 0 |
| 2685 | 0 |
| 2686 | 0 |
| 2687 | 0 |
| 2688 | 0 |
| 2689 | 0 |
| 2690 | 0 |
| 2691 | 0 |
| 2692 | 0 |
| 2693 | 0 |
| 2694 | 0 |
| 2695 | 0 |
| 2696 | 0 |
| 2697 | 0 |
| 2698 | 0 |
| 2699 | 0 |
| 2700 | 0 |
| 2701 | 0 |
| 2702 | 0 |
| 2703 | 0 |
| 2704 | 0 |
| 2705 | 0 |
| 2706 | 0 |
| 2707 | 0 |
| 2708 | 0 |
| 2709 | 0 |
| 2710 | 0 |
| 2711 | 0 |
| 2712 | 0 |
| 2713 | 0 |
| 2714 | 0 |
| 2715 | 0 |
| 2716 | 0 |
| 2717 | 0 |
| 2718 | 0 |
| 2719 | 0 |
| 2720 | 0 |
| 2721 | 0 |
| 2722 | 0 |
| 2723 | 0 |
| 2724 | 0 |
| 2725 | 0 |
| 2726 | 0 |
| 2727 | 0 |
| 2728 | 0 |
| 2729 | 0 |
| 2730 | 0 |
| 2731 | 0 |
| 2732 | 0 |
| 2733 | 0 |
| 2734 | 0 |
| 2735 | 0 |
| 2736 | 0 |
| 2737 | 0 |
| 2738 | 0 |
| 2739 | 0 |
| 2740 | 0 |
| 2741 | 0 |
| 2742 | 0 |
| 2743 | 0 |
| 2744 | 0 |
| 2745 | 0 |
| 2746 | 0 |
| 2747 | 0 |
| 2748 | 0 |
| 2749 | 0 |
| 2750 | 0 |
| 2751 | 0 |
| 2752 | 0 |
| 2753 | 0 |
| 2754 | 0 |
| 2755 | 0 |
| 2756 | 0 |
| 2757 | 0 |
| 2758 | 0 |
| 2759 | 0 |
| 2760 | 0 |
| 2761 | 0 |
| 2762 | 0 |
| 2763 | 0 |
| 2764 | 0 |
| 2765 | 0 |
| 2766 | 0 |
| 2767 | 0 |
| 2768 | 0 |
| 2769 | 0 |
| 2770 | 0 |
| 2771 | 0 |
| 2772 | 0 |
| 2773 | 0 |
| 2774 | 0 |
| 2775 | 0 |
| 2776 | 914 |
| 2777 | 913 |
| 2778 | 911 |
| 2779 | 0 |
| 2780 | 0 |
| 2781 | 0 |
| 2782 | 0 |
| 2783 | 0 |
| 2784 | 0 |
| 2785 | 0 |
| 2786 | 0 |
| 2787 | 0 |
| 2788 | 0 |
| 2789 | 0 |
| 2790 | 0 |
| 2791 | 0 |
| 2792 | 0 |
| 2793 | 0 |
| 2794 | 0 |
| 2795 | 0 |
| 2796 | 0 |
| 2797 | 0 |
| 2798 | 0 |
| 2799 | 0 |
| 2800 | 0 |
| 2801 | 0 |
| 2802 | 0 |
| 2803 | 0 |
| 2804 | 0 |
| 2805 | 0 |
| 2806 | 0 |
| 2807 | 0 |
| 2808 | 0 |
| 2809 | 0 |
| 2810 | 0 |
| 2811 | 0 |
| 2812 | 0 |
| 2813 | 0 |
| 2814 | 0 |
| 2815 | 0 |
| 2816 | 0 |
| 2817 | 0 |
| 2818 | 0 |
| 2819 | 0 |
| 2820 | 0 |
| 2821 | 0 |
| 2822 | 0 |
| 2823 | 0 |
| 2824 | 0 |
| 2825 | 0 |
| 2826 | 0 |
| 2827 | 0 |
| 2828 | 0 |
| 2829 | 0 |
| 2830 | 0 |
| 2831 | 0 |
| 2832 | 0 |
| 2833 | 0 |
| 2834 | 0 |
| 2835 | 0 |
| 2836 | 0 |
| 2837 | 0 |
| 2838 | 0 |
| 2839 | 0 |
| 2840 | 0 |
| 2841 | 0 |
| 2842 | 0 |
| 2843 | 0 |
| 2844 | 0 |
| 2845 | 0 |
| 2846 | 0 |
| 2847 | 0 |
| 2848 | 0 |
| 2849 | 0 |
| 2850 | 0 |
| 2851 | 0 |
| 2852 | 0 |
| 2853 | 0 |
| 2854 | 0 |
| 2855 | 0 |
| 2856 | 0 |
| 2857 | 0 |
| 2858 | 0 |
| 2859 | 0 |
| 2860 | 0 |
| 2861 | 0 |
| 2862 | 0 |
| 2863 | 0 |
| 2864 | 0 |
| 2865 | 0 |
| 2866 | 0 |
| 2867 | 0 |
| 2868 | 0 |
| 2869 | 0 |
| 2870 | 0 |
| 2871 | 0 |
| 2872 | 0 |
| 2873 | 0 |
| 2874 | 0 |
| 2875 | 0 |
| 2876 | 0 |
| 2877 | 0 |
| 2878 | 0 |
| 2879 | 0 |
| 2880 | 0 |
| 2881 | 0 |
| 2882 | 0 |
| 2883 | 0 |
| 2884 | 0 |
| 2885 | 0 |
| 2886 | 0 |
| 2887 | 0 |
| 2888 | 0 |
| 2889 | 0 |
| 2890 | 0 |
| 2891 | 0 |
| 2892 | 0 |
| 2893 | 0 |
| 2894 | 0 |
| 2895 | 0 |
| 2896 | 0 |
| 2897 | 0 |
| 2898 | 0 |
| 2899 | 0 |
| 2900 | 0 |
| 2901 | 0 |
| 2902 | 0 |
| 2903 | 0 |
| 2904 | 0 |
| 2905 | 912 |
| 2906 | 911 |
| 2907 | 910 |
| 2908 | 0 |
| 2909 | 0 |
| 2910 | 0 |
| 2911 | 0 |
| 2912 | 0 |
| 2913 | 0 |
| 2914 | 0 |
| 2915 | 0 |
| 2916 | 0 |
| 2917 | 0 |
| 2918 | 0 |
| 2919 | 0 |
| 2920 | 0 |
| 2921 | 0 |
| 2922 | 0 |
| 2923 | 0 |
| 2924 | 0 |
| 2925 | 0 |
| 2926 | 0 |
| 2927 | 0 |
| 2928 | 0 |
| 2929 | 0 |
| 2930 | 0 |
| 2931 | 0 |
| 2932 | 0 |
| 2933 | 0 |
| 2934 | 0 |
| 2935 | 0 |
| 2936 | 0 |
| 2937 | 0 |
| 2938 | 0 |
| 2939 | 0 |
| 2940 | 0 |
| 2941 | 0 |
| 2942 | 0 |
| 2943 | 0 |
| 2944 | 0 |
| 2945 | 0 |
| 2946 | 0 |
| 2947 | 0 |
| 2948 | 0 |
| 2949 | 0 |
| 2950 | 0 |
| 2951 | 0 |
| 2952 | 0 |
| 2953 | 0 |
| 2954 | 0 |
| 2955 | 0 |
| 2956 | 0 |
| 2957 | 0 |
| 2958 | 0 |
| 2959 | 0 |
| 2960 | 0 |
| 2961 | 0 |
| 2962 | 0 |
| 2963 | 0 |
| 2964 | 0 |
| 2965 | 0 |
| 2966 | 0 |
| 2967 | 0 |
| 2968 | 0 |
| 2969 | 0 |
| 2970 | 0 |
| 2971 | 0 |
| 2972 | 0 |
| 2973 | 0 |
| 2974 | 0 |
| 2975 | 0 |
| 2976 | 0 |
| 2977 | 0 |
| 2978 | 0 |
| 2979 | 0 |
| 2980 | 0 |
| 2981 | 0 |
| 2982 | 0 |
| 2983 | 0 |
| 2984 | 0 |
| 2985 | 0 |
| 2986 | 0 |
| 2987 | 0 |
| 2988 | 0 |
| 2989 | 0 |
| 2990 | 0 |
| 2991 | 0 |
| 2992 | 0 |
| 2993 | 0 |
| 2994 | 0 |
| 2995 | 0 |
| 2996 | 0 |
| 2997 | 0 |
| 2998 | 0 |
| 2999 | 0 |
| 3000 | 0 |
| 3001 | 0 |
| 3002 | 0 |
| 3003 | 0 |
| 3004 | 0 |
| 3005 | 0 |
| 3006 | 0 |
| 3007 | 0 |
| 3008 | 0 |
| 3009 | 0 |
| 3010 | 0 |
| 3011 | 0 |
| 3012 | 0 |
| 3013 | 0 |
| 3014 | 0 |
| 3015 | 0 |
| 3016 | 0 |
| 3017 | 0 |
| 3018 | 0 |
| 3019 | 0 |
| 3020 | 0 |
| 3021 | 0 |
| 3022 | 0 |
| 3023 | 0 |
| 3024 | 0 |
| 3025 | 0 |
| 3026 | 0 |
| 3027 | 0 |
| 3028 | 0 |
| 3029 | 911 |
| 3030 | 912 |
| 3031 | 910 |
| 3032 | 911 |
| 3033 | 0 |
| 3034 | 0 |
| 3035 | 0 |
| 3036 | 0 |
| 3037 | 0 |
| 3038 | 0 |
| 3039 | 0 |
| 3040 | 0 |
| 3041 | 0 |
| 3042 | 0 |
| 3043 | 0 |
| 3044 | 0 |
| 3045 | 0 |
| 3046 | 0 |
| 3047 | 0 |
| 3048 | 0 |
| 3049 | 0 |
| 3050 | 0 |
| 3051 | 0 |
| 3052 | 0 |
| 3053 | 0 |
| 3054 | 0 |
| 3055 | 0 |
| 3056 | 0 |
| 3057 | 0 |
| 3058 | 0 |
| 3059 | 0 |
| 3060 | 0 |
| 3061 | 0 |
| 3062 | 0 |
| 3063 | 0 |
| 3064 | 0 |
| 3065 | 0 |
| 3066 | 0 |
| 3067 | 0 |
| 3068 | 0 |
| 3069 | 0 |
| 3070 | 0 |
| 3071 | 0 |
| 3072 | 0 |
| 3073 | 0 |
| 3074 | 0 |
| 3075 | 0 |
| 3076 | 0 |
| 3077 | 0 |
| 3078 | 0 |
| 3079 | 0 |
| 3080 | 0 |
| 3081 | 0 |
| 3082 | 0 |
| 3083 | 0 |
| 3084 | 0 |
| 3085 | 0 |
| 3086 | 0 |
| 3087 | 0 |
| 3088 | 0 |
| 3089 | 0 |
| 3090 | 0 |
| 3091 | 0 |
| 3092 | 0 |
| 3093 | 0 |
| 3094 | 0 |
| 3095 | 0 |
| 3096 | 0 |
| 3097 | 0 |
| 3098 | 0 |
| 3099 | 0 |
| 3100 | 0 |
| 3101 | 0 |
| 3102 | 0 |
| 3103 | 0 |
| 3104 | 0 |
| 3105 | 0 |
| 3106 | 0 |
| 3107 | 0 |
| 3108 | 0 |
| 3109 | 0 |
| 3110 | 0 |
| 3111 | 0 |
| 3112 | 0 |
| 3113 | 0 |
| 3114 | 0 |
| 3115 | 0 |
| 3116 | 0 |
| 3117 | 0 |
| 3118 | 0 |
| 3119 | 0 |
| 3120 | 0 |
| 3121 | 0 |
| 3122 | 0 |
| 3123 | 0 |
| 3124 | 0 |
| 3125 | 0 |
| 3126 | 0 |
| 3127 | 0 |
| 3128 | 0 |
| 3129 | 0 |
| 3130 | 0 |
| 3131 | 0 |
| 3132 | 0 |
| 3133 | 0 |
| 3134 | 0 |
| 3135 | 0 |
| 3136 | 0 |
| 3137 | 0 |
| 3138 | 0 |
| 3139 | 0 |
| 3140 | 0 |
| 3141 | 0 |
| 3142 | 0 |
| 3143 | 0 |
| 3144 | 0 |
| 3145 | 0 |
| 3146 | 0 |
| 3147 | 0 |
| 3148 | 480 |
| 3149 | 912 |
| 3150 | 910 |
| 3151 | 911 |
| 3152 | 0 |
| 3153 | 0 |
| 3154 | 0 |
| 3155 | 0 |
| 3156 | 0 |
| 3157 | 0 |
| 3158 | 0 |
| 3159 | 0 |
| 3160 | 0 |
| 3161 | 0 |
| 3162 | 0 |
| 3163 | 0 |
| 3164 | 0 |
| 3165 | 0 |
| 3166 | 0 |
| 3167 | 0 |
| 3168 | 0 |
| 3169 | 0 |
| 3170 | 0 |
| 3171 | 0 |
| 3172 | 0 |
| 3173 | 0 |
| 3174 | 0 |
| 3175 | 0 |
| 3176 | 0 |
| 3177 | 0 |
| 3178 | 0 |
| 3179 | 0 |
| 3180 | 0 |
| 3181 | 0 |
| 3182 | 0 |
| 3183 | 0 |
| 3184 | 0 |
| 3185 | 0 |
| 3186 | 0 |
| 3187 | 0 |
| 3188 | 0 |
| 3189 | 0 |
| 3190 | 0 |
| 3191 | 0 |
| 3192 | 0 |
| 3193 | 0 |
| 3194 | 0 |
| 3195 | 0 |
| 3196 | 0 |
| 3197 | 0 |
| 3198 | 0 |
| 3199 | 0 |
| 3200 | 0 |
| 3201 | 0 |
| 3202 | 0 |
| 3203 | 0 |
| 3204 | 0 |
| 3205 | 0 |
| 3206 | 0 |
| 3207 | 0 |
| 3208 | 0 |
| 3209 | 0 |
| 3210 | 0 |
| 3211 | 0 |
| 3212 | 0 |
| 3213 | 0 |
| 3214 | 0 |
| 3215 | 0 |
| 3216 | 0 |
| 3217 | 0 |
| 3218 | 0 |
| 3219 | 0 |
| 3220 | 0 |
| 3221 | 0 |
| 3222 | 0 |
| 3223 | 0 |
| 3224 | 0 |
| 3225 | 0 |
| 3226 | 0 |
| 3227 | 0 |
| 3228 | 0 |
| 3229 | 0 |
| 3230 | 0 |
| 3231 | 0 |
| 3232 | 0 |
| 3233 | 0 |
| 3234 | 0 |
| 3235 | 0 |
| 3236 | 0 |
| 3237 | 0 |
| 3238 | 0 |
| 3239 | 0 |
| 3240 | 0 |
| 3241 | 0 |
| 3242 | 0 |
| 3243 | 0 |
| 3244 | 0 |
| 3245 | 0 |
| 3246 | 0 |
| 3247 | 0 |
| 3248 | 0 |
| 3249 | 0 |
| 3250 | 0 |
| 3251 | 0 |
| 3252 | 0 |
| 3253 | 0 |
| 3254 | 0 |
| 3255 | 0 |
| 3256 | 0 |
| 3257 | 0 |
| 3258 | 0 |
| 3259 | 0 |
| 3260 | 0 |
| 3261 | 0 |
| 3262 | 0 |
| 3263 | 0 |
| 3264 | 914 |
| 3265 | 913 |
| 3266 | 912 |
| 3267 | 0 |
| 3268 | 0 |
| 3269 | 0 |
| 3270 | 0 |
| 3271 | 0 |
| 3272 | 0 |
| 3273 | 0 |
| 3274 | 0 |
| 3275 | 0 |
| 3276 | 0 |
| 3277 | 0 |
| 3278 | 0 |
| 3279 | 0 |
| 3280 | 0 |
| 3281 | 0 |
| 3282 | 0 |
| 3283 | 0 |
| 3284 | 0 |
| 3285 | 0 |
| 3286 | 0 |
| 3287 | 0 |
| 3288 | 0 |
| 3289 | 0 |
| 3290 | 0 |
| 3291 | 0 |
| 3292 | 0 |
| 3293 | 0 |
| 3294 | 0 |
| 3295 | 0 |
| 3296 | 0 |
| 3297 | 0 |
| 3298 | 0 |
| 3299 | 0 |
| 3300 | 0 |
| 3301 | 0 |
| 3302 | 0 |
| 3303 | 0 |
| 3304 | 0 |
| 3305 | 0 |
| 3306 | 0 |
| 3307 | 0 |
| 3308 | 0 |
| 3309 | 0 |
| 3310 | 0 |
| 3311 | 0 |
| 3312 | 0 |
| 3313 | 0 |
| 3314 | 0 |
| 3315 | 0 |
| 3316 | 0 |
| 3317 | 0 |
| 3318 | 0 |
| 3319 | 0 |
| 3320 | 0 |
| 3321 | 0 |
| 3322 | 0 |
| 3323 | 0 |
| 3324 | 0 |
| 3325 | 0 |
| 3326 | 0 |
| 3327 | 0 |
| 3328 | 0 |
| 3329 | 0 |
| 3330 | 0 |
| 3331 | 0 |
| 3332 | 0 |
| 3333 | 0 |
| 3334 | 0 |
| 3335 | 0 |
| 3336 | 0 |
| 3337 | 0 |
| 3338 | 0 |
| 3339 | 0 |
| 3340 | 0 |
| 3341 | 0 |
| 3342 | 0 |
| 3343 | 0 |
| 3344 | 0 |
| 3345 | 0 |
| 3346 | 0 |
| 3347 | 0 |
| 3348 | 0 |
| 3349 | 0 |
| 3350 | 0 |
| 3351 | 0 |
| 3352 | 0 |
| 3353 | 0 |
| 3354 | 0 |
| 3355 | 0 |
| 3356 | 0 |
| 3357 | 0 |
| 3358 | 0 |
| 3359 | 0 |
| 3360 | 0 |
| 3361 | 0 |
| 3362 | 0 |
| 3363 | 0 |
| 3364 | 0 |
| 3365 | 0 |
| 3366 | 0 |
| 3367 | 0 |
| 3368 | 0 |
| 3369 | 0 |
| 3370 | 0 |
| 3371 | 0 |
| 3372 | 0 |
| 3373 | 0 |
| 3374 | 912 |
| 3375 | 913 |
| 3376 | 913 |
| 3377 | 913 |
| 3378 | 0 |
| 3379 | 0 |
| 3380 | 0 |
| 3381 | 0 |
| 3382 | 0 |
| 3383 | 0 |
| 3384 | 0 |
| 3385 | 0 |
| 3386 | 0 |
| 3387 | 0 |
| 3388 | 0 |
| 3389 | 0 |
| 3390 | 0 |
| 3391 | 0 |
| 3392 | 0 |
| 3393 | 0 |
| 3394 | 0 |
| 3395 | 0 |
| 3396 | 0 |
| 3397 | 0 |
| 3398 | 0 |
| 3399 | 0 |
| 3400 | 0 |
| 3401 | 0 |
| 3402 | 0 |
| 3403 | 0 |
| 3404 | 0 |
| 3405 | 0 |
| 3406 | 0 |
| 3407 | 0 |
| 3408 | 0 |
| 3409 | 0 |
| 3410 | 0 |
| 3411 | 0 |
| 3412 | 0 |
| 3413 | 0 |
| 3414 | 0 |
| 3415 | 0 |
| 3416 | 0 |
| 3417 | 0 |
| 3418 | 0 |
| 3419 | 0 |
| 3420 | 0 |
| 3421 | 0 |
| 3422 | 0 |
| 3423 | 0 |
| 3424 | 0 |
| 3425 | 0 |
| 3426 | 0 |
| 3427 | 0 |
| 3428 | 0 |
| 3429 | 0 |
| 3430 | 0 |
| 3431 | 0 |
| 3432 | 0 |
| 3433 | 0 |
| 3434 | 0 |
| 3435 | 0 |
| 3436 | 0 |
| 3437 | 0 |
| 3438 | 0 |
| 3439 | 0 |
| 3440 | 0 |
| 3441 | 0 |
| 3442 | 0 |
| 3443 | 0 |
| 3444 | 0 |
| 3445 | 0 |
| 3446 | 0 |
| 3447 | 0 |
| 3448 | 0 |
| 3449 | 0 |
| 3450 | 0 |
| 3451 | 0 |
| 3452 | 0 |
| 3453 | 0 |
| 3454 | 0 |
| 3455 | 0 |
| 3456 | 0 |
| 3457 | 0 |
| 3458 | 0 |
| 3459 | 0 |
| 3460 | 0 |
| 3461 | 0 |
| 3462 | 0 |
| 3463 | 0 |
| 3464 | 0 |
| 3465 | 0 |
| 3466 | 0 |
| 3467 | 0 |
| 3468 | 0 |
| 3469 | 0 |
| 3470 | 0 |
| 3471 | 0 |
| 3472 | 0 |
| 3473 | 0 |
| 3474 | 0 |
| 3475 | 0 |
| 3476 | 913 |
| 3477 | 913 |
| 3478 | 913 |
| 3479 | 912 |
| 3480 | 0 |
| 3481 | 0 |
| 3482 | 0 |
| 3483 | 0 |
| 3484 | 0 |
| 3485 | 0 |
| 3486 | 0 |
| 3487 | 0 |
| 3488 | 0 |
| 3489 | 0 |
| 3490 | 0 |
| 3491 | 0 |
| 3492 | 0 |
| 3493 | 0 |
| 3494 | 0 |
| 3495 | 0 |
| 3496 | 0 |
| 3497 | 0 |
| 3498 | 0 |
| 3499 | 0 |
| 3500 | 0 |
| 3501 | 0 |
| 3502 | 0 |
| 3503 | 0 |
| 3504 | 0 |
| 3505 | 0 |
| 3506 | 0 |
| 3507 | 0 |
| 3508 | 0 |
| 3509 | 0 |
| 3510 | 0 |
| 3511 | 0 |
| 3512 | 0 |
| 3513 | 0 |
| 3514 | 0 |
| 3515 | 0 |
| 3516 | 0 |
| 3517 | 0 |
| 3518 | 0 |
| 3519 | 0 |
| 3520 | 0 |
| 3521 | 0 |
| 3522 | 0 |
| 3523 | 0 |
| 3524 | 0 |
| 3525 | 0 |
| 3526 | 0 |
| 3527 | 0 |
| 3528 | 0 |
| 3529 | 0 |
| 3530 | 0 |
| 3531 | 0 |
| 3532 | 0 |
| 3533 | 0 |
| 3534 | 0 |
| 3535 | 0 |
| 3536 | 0 |
| 3537 | 0 |
| 3538 | 0 |
| 3539 | 0 |
| 3540 | 0 |
| 3541 | 0 |
| 3542 | 0 |
| 3543 | 0 |
| 3544 | 0 |
| 3545 | 0 |
| 3546 | 0 |
| 3547 | 0 |
| 3548 | 0 |
| 3549 | 0 |
| 3550 | 0 |
| 3551 | 0 |
| 3552 | 0 |
| 3553 | 0 |
| 3554 | 0 |
| 3555 | 0 |
| 3556 | 0 |
| 3557 | 0 |
| 3558 | 0 |
| 3559 | 0 |
| 3560 | 0 |
| 3561 | 0 |
| 3562 | 0 |
| 3563 | 0 |
| 3564 | 0 |
| 3565 | 0 |
| 3566 | 0 |
| 3567 | 0 |
| 3568 | 0 |
| 3569 | 0 |
| 3570 | 0 |
| 3571 | 632 |
| 3572 | 910 |
| 3573 | 909 |
| 3574 | 909 |
| 3575 | 0 |
| 3576 | 0 |
| 3577 | 0 |
| 3578 | 0 |
| 3579 | 0 |
| 3580 | 0 |
| 3581 | 0 |
| 3582 | 0 |
| 3583 | 0 |
| 3584 | 0 |
| 3585 | 0 |
| 3586 | 0 |
| 3587 | 0 |
| 3588 | 0 |
| 3589 | 0 |
| 3590 | 0 |
| 3591 | 0 |
| 3592 | 0 |
| 3593 | 0 |
| 3594 | 0 |
| 3595 | 0 |
| 3596 | 0 |
| 3597 | 0 |
| 3598 | 0 |
| 3599 | 0 |
| 3600 | 0 |
| 3601 | 0 |
| 3602 | 0 |
| 3603 | 0 |
| 3604 | 0 |
| 3605 | 0 |
| 3606 | 0 |
| 3607 | 0 |
| 3608 | 0 |
| 3609 | 0 |
| 3610 | 0 |
| 3611 | 0 |
| 3612 | 0 |
| 3613 | 0 |
| 3614 | 0 |
| 3615 | 0 |
| 3616 | 0 |
| 3617 | 0 |
| 3618 | 0 |
| 3619 | 0 |
| 3620 | 0 |
| 3621 | 0 |
| 3622 | 0 |
| 3623 | 0 |
| 3624 | 0 |
| 3625 | 0 |
| 3626 | 0 |
| 3627 | 0 |
| 3628 | 0 |
| 3629 | 0 |
| 3630 | 0 |
| 3631 | 0 |
| 3632 | 0 |
| 3633 | 0 |
| 3634 | 0 |
| 3635 | 0 |
| 3636 | 0 |
| 3637 | 0 |
| 3638 | 0 |
| 3639 | 0 |
| 3640 | 0 |
| 3641 | 0 |
| 3642 | 0 |
| 3643 | 0 |
| 3644 | 0 |
| 3645 | 0 |
| 3646 | 0 |
| 3647 | 0 |
| 3648 | 0 |
| 3649 | 0 |
| 3650 | 0 |
| 3651 | 0 |
| 3652 | 0 |
| 3653 | 0 |
| 3654 | 0 |
| 3655 | 0 |
| 3656 | 0 |
| 3657 | 0 |
| 3658 | 0 |
| 3659 | 0 |
| 3660 | 0 |
| 3661 | 911 |
| 3662 | 911 |
| 3663 | 909 |
| 3664 | 0 |
| 3665 | 0 |
| 3666 | 0 |
| 3667 | 0 |
| 3668 | 0 |
| 3669 | 0 |
| 3670 | 0 |
| 3671 | 0 |
| 3672 | 0 |
| 3673 | 0 |
| 3674 | 0 |
| 3675 | 0 |
| 3676 | 0 |
| 3677 | 0 |
| 3678 | 0 |
| 3679 | 0 |
| 3680 | 0 |
| 3681 | 0 |
| 3682 | 0 |
| 3683 | 0 |
| 3684 | 0 |
| 3685 | 0 |
| 3686 | 0 |
| 3687 | 0 |
| 3688 | 0 |
| 3689 | 0 |
| 3690 | 0 |
| 3691 | 0 |
| 3692 | 0 |
| 3693 | 0 |
| 3694 | 0 |
| 3695 | 0 |
| 3696 | 0 |
| 3697 | 0 |
| 3698 | 0 |
| 3699 | 0 |
| 3700 | 0 |
| 3701 | 0 |
| 3702 | 0 |
| 3703 | 0 |
| 3704 | 0 |
| 3705 | 0 |
| 3706 | 0 |
| 3707 | 0 |
| 3708 | 0 |
| 3709 | 0 |
| 3710 | 0 |
| 3711 | 0 |
| 3712 | 0 |
| 3713 | 0 |
| 3714 | 0 |
| 3715 | 0 |
| 3716 | 0 |
| 3717 | 0 |
| 3718 | 0 |
| 3719 | 0 |
| 3720 | 0 |
| 3721 | 0 |
| 3722 | 0 |
| 3723 | 0 |
| 3724 | 0 |
| 3725 | 0 |
| 3726 | 0 |
| 3727 | 0 |
| 3728 | 0 |
| 3729 | 0 |
| 3730 | 0 |
| 3731 | 0 |
| 3732 | 0 |
| 3733 | 0 |
| 3734 | 0 |
| 3735 | 0 |
| 3736 | 0 |
| 3737 | 0 |
| 3738 | 0 |
| 3739 | 0 |
| 3740 | 0 |
| 3741 | 0 |
| 3742 | 0 |
| 3743 | 0 |
| 3744 | 0 |
| 3745 | 0 |
| 3746 | 913 |
| 3747 | 914 |
| 3748 | 912 |
| 3749 | 0 |
| 3750 | 0 |
| 3751 | 0 |
| 3752 | 0 |
| 3753 | 0 |
| 3754 | 0 |
| 3755 | 0 |
| 3756 | 0 |
| 3757 | 0 |
| 3758 | 0 |
| 3759 | 0 |
| 3760 | 0 |
| 3761 | 0 |
| 3762 | 0 |
| 3763 | 0 |
| 3764 | 0 |
| 3765 | 0 |
| 3766 | 0 |
| 3767 | 0 |
| 3768 | 0 |
| 3769 | 0 |
| 3770 | 0 |
| 3771 | 0 |
| 3772 | 0 |
| 3773 | 0 |
| 3774 | 0 |
| 3775 | 0 |
| 3776 | 0 |
| 3777 | 0 |
| 3778 | 0 |
| 3779 | 0 |
| 3780 | 0 |
| 3781 | 0 |
| 3782 | 0 |
| 3783 | 0 |
| 3784 | 0 |
| 3785 | 0 |
| 3786 | 0 |
| 3787 | 0 |
| 3788 | 0 |
| 3789 | 0 |
| 3790 | 0 |
| 3791 | 0 |
| 3792 | 0 |
| 3793 | 0 |
| 3794 | 0 |
| 3795 | 0 |
| 3796 | 0 |
| 3797 | 0 |
| 3798 | 0 |
| 3799 | 0 |
| 3800 | 0 |
| 3801 | 0 |
| 3802 | 0 |
| 3803 | 0 |
| 3804 | 0 |
| 3805 | 0 |
| 3806 | 0 |
| 3807 | 0 |
| 3808 | 0 |
| 3809 | 0 |
| 3810 | 0 |
| 3811 | 0 |
| 3812 | 0 |
| 3813 | 0 |
| 3814 | 0 |
| 3815 | 0 |
| 3816 | 0 |
| 3817 | 0 |
| 3818 | 0 |
| 3819 | 0 |
| 3820 | 0 |
| 3821 | 0 |
| 3822 | 0 |
| 3823 | 0 |
| 3824 | 0 |
| 3825 | 913 |
| 3826 | 912 |
| 3827 | 914 |
| 3828 | 911 |
| 3829 | 0 |
| 3830 | 0 |
| 3831 | 0 |
| 3832 | 0 |
| 3833 | 0 |
| 3834 | 0 |
| 3835 | 0 |
| 3836 | 0 |
| 3837 | 0 |
| 3838 | 0 |
| 3839 | 0 |
| 3840 | 0 |
| 3841 | 0 |
| 3842 | 0 |
| 3843 | 0 |
| 3844 | 0 |
| 3845 | 0 |
| 3846 | 0 |
| 3847 | 0 |
| 3848 | 0 |
| 3849 | 0 |
| 3850 | 0 |
| 3851 | 0 |
| 3852 | 0 |
| 3853 | 0 |
| 3854 | 0 |
| 3855 | 0 |
| 3856 | 0 |
| 3857 | 0 |
| 3858 | 0 |
| 3859 | 0 |
| 3860 | 0 |
| 3861 | 0 |
| 3862 | 0 |
| 3863 | 0 |
| 3864 | 0 |
| 3865 | 0 |
| 3866 | 0 |
| 3867 | 0 |
| 3868 | 0 |
| 3869 | 0 |
| 3870 | 0 |
| 3871 | 0 |
| 3872 | 0 |
| 3873 | 0 |
| 3874 | 0 |
| 3875 | 0 |
| 3876 | 0 |
| 3877 | 0 |
| 3878 | 0 |
| 3879 | 0 |
| 3880 | 0 |
| 3881 | 0 |
| 3882 | 0 |
| 3883 | 0 |
| 3884 | 0 |
| 3885 | 0 |
| 3886 | 0 |
| 3887 | 0 |
| 3888 | 0 |
| 3889 | 0 |
| 3890 | 0 |
| 3891 | 0 |
| 3892 | 0 |
| 3893 | 0 |
| 3894 | 0 |
| 3895 | 0 |
| 3896 | 0 |
| 3897 | 0 |
| 3898 | 0 |
| 3899 | 0 |
| 3900 | 0 |
| 3901 | 910 |
| 3902 | 911 |
| 3903 | 911 |
| 3904 | 0 |
| 3905 | 0 |
| 3906 | 0 |
| 3907 | 0 |
| 3908 | 0 |
| 3909 | 0 |
| 3910 | 0 |
| 3911 | 0 |
| 3912 | 0 |
| 3913 | 0 |
| 3914 | 0 |
| 3915 | 0 |
| 3916 | 0 |
| 3917 | 0 |
| 3918 | 0 |
| 3919 | 0 |
| 3920 | 0 |
| 3921 | 0 |
| 3922 | 0 |
| 3923 | 0 |
| 3924 | 0 |
| 3925 | 0 |
| 3926 | 0 |
| 3927 | 0 |
| 3928 | 0 |
| 3929 | 0 |
| 3930 | 0 |
| 3931 | 0 |
| 3932 | 0 |
| 3933 | 0 |
| 3934 | 0 |
| 3935 | 0 |
| 3936 | 0 |
| 3937 | 0 |
| 3938 | 0 |
| 3939 | 0 |
| 3940 | 0 |
| 3941 | 0 |
| 3942 | 0 |
| 3943 | 0 |
| 3944 | 0 |
| 3945 | 0 |
| 3946 | 0 |
| 3947 | 0 |
| 3948 | 0 |
| 3949 | 0 |
| 3950 | 0 |
| 3951 | 0 |
| 3952 | 0 |
| 3953 | 0 |
| 3954 | 0 |
| 3955 | 0 |
| 3956 | 0 |
| 3957 | 0 |
| 3958 | 0 |
| 3959 | 0 |
| 3960 | 0 |
| 3961 | 0 |
| 3962 | 0 |
| 3963 | 0 |
| 3964 | 0 |
| 3965 | 0 |
| 3966 | 0 |
| 3967 | 0 |
| 3968 | 0 |
| 3969 | 0 |
| 3970 | 0 |
| 3971 | 0 |
| 3972 | 0 |
| 3973 | 0 |
| 3974 | 910 |
| 3975 | 910 |
| 3976 | 909 |
| 3977 | 0 |
| 3978 | 0 |
| 3979 | 0 |
| 3980 | 0 |
| 3981 | 0 |
| 3982 | 0 |
| 3983 | 0 |
| 3984 | 0 |
| 3985 | 0 |
| 3986 | 0 |
| 3987 | 0 |
| 3988 | 0 |
| 3989 | 0 |
| 3990 | 0 |
| 3991 | 0 |
| 3992 | 0 |
| 3993 | 0 |
| 3994 | 0 |
| 3995 | 0 |
| 3996 | 0 |
| 3997 | 0 |
| 3998 | 0 |
| 3999 | 0 |
| 4000 | 0 |
| 4001 | 0 |
| 4002 | 0 |
| 4003 | 0 |
| 4004 | 0 |
| 4005 | 0 |
| 4006 | 0 |
| 4007 | 0 |
| 4008 | 0 |
| 4009 | 0 |
| 4010 | 0 |
| 4011 | 0 |
| 4012 | 0 |
| 4013 | 0 |
| 4014 | 0 |
| 4015 | 0 |
| 4016 | 0 |
| 4017 | 0 |
| 4018 | 0 |
| 4019 | 0 |
| 4020 | 0 |
| 4021 | 0 |
| 4022 | 0 |
| 4023 | 0 |
| 4024 | 0 |
| 4025 | 0 |
| 4026 | 0 |
| 4027 | 0 |
| 4028 | 0 |
| 4029 | 0 |
| 4030 | 0 |
| 4031 | 0 |
| 4032 | 0 |
| 4033 | 0 |
| 4034 | 0 |
| 4035 | 0 |
| 4036 | 0 |
| 4037 | 0 |
| 4038 | 0 |
| 4039 | 0 |
| 4040 | 0 |
| 4041 | 0 |
| 4042 | 0 |
| 4043 | 0 |
| 4044 | 0 |
| 4045 | 909 |
| 4046 | 910 |
| 4047 | 911 |
| 4048 | 908 |
| 4049 | 0 |
| 4050 | 0 |
| 4051 | 0 |
| 4052 | 0 |
| 4053 | 0 |
| 4054 | 0 |
| 4055 | 0 |
| 4056 | 0 |
| 4057 | 0 |
| 4058 | 0 |
| 4059 | 0 |
| 4060 | 0 |
| 4061 | 0 |
| 4062 | 0 |
| 4063 | 0 |
| 4064 | 0 |
| 4065 | 0 |
| 4066 | 0 |
| 4067 | 0 |
| 4068 | 0 |
| 4069 | 0 |
| 4070 | 0 |
| 4071 | 0 |
| 4072 | 0 |
| 4073 | 0 |
| 4074 | 0 |
| 4075 | 0 |
| 4076 | 0 |
| 4077 | 0 |
| 4078 | 0 |
| 4079 | 0 |
| 4080 | 0 |
| 4081 | 0 |
| 4082 | 0 |
| 4083 | 0 |
| 4084 | 0 |
| 4085 | 0 |
| 4086 | 0 |
| 4087 | 0 |
| 4088 | 0 |
| 4089 | 0 |
| 4090 | 0 |
| 4091 | 0 |
| 4092 | 0 |
| 4093 | 0 |
| 4094 | 0 |
| 4095 | 0 |
| 4096 | 0 |
| 4097 | 0 |
| 4098 | 0 |
| 4099 | 0 |
| 4100 | 0 |
| 4101 | 0 |
| 4102 | 0 |
| 4103 | 0 |
| 4104 | 0 |
| 4105 | 0 |
| 4106 | 0 |
| 4107 | 0 |
| 4108 | 0 |
| 4109 | 0 |
| 4110 | 0 |
| 4111 | 0 |
| 4112 | 0 |
| 4113 | 0 |
| 4114 | 0 |
| 4115 | 911 |
| 4116 | 911 |
| 4117 | 911 |
| 4118 | 911 |
| 4119 | 0 |
| 4120 | 0 |
| 4121 | 0 |
| 4122 | 0 |
| 4123 | 0 |
| 4124 | 0 |
| 4125 | 0 |
| 4126 | 0 |
| 4127 | 0 |
| 4128 | 0 |
| 4129 | 0 |
| 4130 | 0 |
| 4131 | 0 |
| 4132 | 0 |
| 4133 | 0 |
| 4134 | 0 |
| 4135 | 0 |
| 4136 | 0 |
| 4137 | 0 |
| 4138 | 0 |
| 4139 | 0 |
| 4140 | 0 |
| 4141 | 0 |
| 4142 | 0 |
| 4143 | 0 |
| 4144 | 0 |
| 4145 | 0 |
| 4146 | 0 |
| 4147 | 0 |
| 4148 | 0 |
| 4149 | 0 |
| 4150 | 0 |
| 4151 | 0 |
| 4152 | 0 |
| 4153 | 0 |
| 4154 | 0 |
| 4155 | 0 |
| 4156 | 0 |
| 4157 | 0 |
| 4158 | 0 |
| 4159 | 0 |
| 4160 | 0 |
| 4161 | 0 |
| 4162 | 0 |
| 4163 | 0 |
| 4164 | 0 |
| 4165 | 0 |
| 4166 | 0 |
| 4167 | 0 |
| 4168 | 0 |
| 4169 | 0 |
| 4170 | 0 |
| 4171 | 0 |
| 4172 | 0 |
| 4173 | 0 |
| 4174 | 0 |
| 4175 | 0 |
| 4176 | 0 |
| 4177 | 0 |
| 4178 | 0 |
| 4179 | 0 |
| 4180 | 0 |
| 4181 | 0 |
| 4182 | 0 |
| 4183 | 0 |
| 4184 | 915 |
| 4185 | 913 |
| 4186 | 911 |
| 4187 | 910 |
| 4188 | 0 |
| 4189 | 0 |
| 4190 | 0 |
| 4191 | 0 |
| 4192 | 0 |
| 4193 | 0 |
| 4194 | 0 |
| 4195 | 0 |
| 4196 | 0 |
| 4197 | 0 |
| 4198 | 0 |
| 4199 | 0 |
| 4200 | 0 |
| 4201 | 0 |
| 4202 | 0 |
| 4203 | 0 |
| 4204 | 0 |
| 4205 | 0 |
| 4206 | 0 |
| 4207 | 0 |
| 4208 | 0 |
| 4209 | 0 |
| 4210 | 0 |
| 4211 | 0 |
| 4212 | 0 |
| 4213 | 0 |
| 4214 | 0 |
| 4215 | 0 |
| 4216 | 0 |
| 4217 | 0 |
| 4218 | 0 |
| 4219 | 0 |
| 4220 | 0 |
| 4221 | 0 |
| 4222 | 0 |
| 4223 | 0 |
| 4224 | 0 |
| 4225 | 0 |
| 4226 | 0 |
| 4227 | 0 |
| 4228 | 0 |
| 4229 | 0 |
| 4230 | 0 |
| 4231 | 0 |
| 4232 | 0 |
| 4233 | 0 |
| 4234 | 0 |
| 4235 | 0 |
| 4236 | 0 |
| 4237 | 0 |
| 4238 | 0 |
| 4239 | 0 |
| 4240 | 0 |
| 4241 | 0 |
| 4242 | 0 |
| 4243 | 0 |
| 4244 | 0 |
| 4245 | 0 |
| 4246 | 0 |
| 4247 | 0 |
| 4248 | 0 |
| 4249 | 0 |
| 4250 | 0 |
| 4251 | 912 |
| 4252 | 912 |
| 4253 | 912 |
| 4254 | 912 |
| 4255 | 0 |
| 4256 | 0 |
| 4257 | 0 |
| 4258 | 0 |
| 4259 | 0 |
| 4260 | 0 |
| 4261 | 0 |
| 4262 | 0 |
| 4263 | 0 |
| 4264 | 0 |
| 4265 | 0 |
| 4266 | 0 |
| 4267 | 0 |
| 4268 | 0 |
| 4269 | 0 |
| 4270 | 0 |
| 4271 | 0 |
| 4272 | 0 |
| 4273 | 0 |
| 4274 | 0 |
| 4275 | 0 |
| 4276 | 0 |
| 4277 | 0 |
| 4278 | 0 |
| 4279 | 0 |
| 4280 | 0 |
| 4281 | 0 |
| 4282 | 0 |
| 4283 | 0 |
| 4284 | 0 |
| 4285 | 0 |
| 4286 | 0 |
| 4287 | 0 |
| 4288 | 0 |
| 4289 | 0 |
| 4290 | 0 |
| 4291 | 0 |
| 4292 | 0 |
| 4293 | 0 |
| 4294 | 0 |
| 4295 | 0 |
| 4296 | 0 |
| 4297 | 0 |
| 4298 | 0 |
| 4299 | 0 |
| 4300 | 0 |
| 4301 | 0 |
| 4302 | 0 |
| 4303 | 0 |
| 4304 | 0 |
| 4305 | 0 |
| 4306 | 0 |
| 4307 | 0 |
| 4308 | 0 |
| 4309 | 0 |
| 4310 | 0 |
| 4311 | 0 |
| 4312 | 0 |
| 4313 | 0 |
| 4314 | 0 |
| 4315 | 0 |
| 4316 | 0 |
| 4317 | 914 |
| 4318 | 914 |
| 4319 | 912 |
| 4320 | 912 |
| 4321 | 0 |
| 4322 | 0 |
| 4323 | 0 |
| 4324 | 0 |
| 4325 | 0 |
| 4326 | 0 |
| 4327 | 0 |
| 4328 | 0 |
| 4329 | 0 |
| 4330 | 0 |
| 4331 | 0 |
| 4332 | 0 |
| 4333 | 0 |
| 4334 | 0 |
| 4335 | 0 |
| 4336 | 0 |
| 4337 | 0 |
| 4338 | 0 |
| 4339 | 0 |
| 4340 | 0 |
| 4341 | 0 |
| 4342 | 0 |
| 4343 | 0 |
| 4344 | 0 |
| 4345 | 0 |
| 4346 | 0 |
| 4347 | 0 |
| 4348 | 0 |
| 4349 | 0 |
| 4350 | 0 |
| 4351 | 0 |
| 4352 | 0 |
| 4353 | 0 |
| 4354 | 0 |
| 4355 | 0 |
| 4356 | 0 |
| 4357 | 0 |
| 4358 | 0 |
| 4359 | 0 |
| 4360 | 0 |
| 4361 | 0 |
| 4362 | 0 |
| 4363 | 0 |
| 4364 | 0 |
| 4365 | 0 |
| 4366 | 0 |
| 4367 | 0 |
| 4368 | 0 |
| 4369 | 0 |
| 4370 | 0 |
| 4371 | 0 |
| 4372 | 0 |
| 4373 | 0 |
| 4374 | 0 |
| 4375 | 0 |
| 4376 | 0 |
| 4377 | 0 |
| 4378 | 0 |
| 4379 | 0 |
| 4380 | 0 |
| 4381 | 0 |
| 4382 | 911 |
| 4383 | 911 |
| 4384 | 911 |
| 4385 | 913 |
| 4386 | 0 |
| 4387 | 0 |
| 4388 | 0 |
| 4389 | 0 |
| 4390 | 0 |
| 4391 | 0 |
| 4392 | 0 |
| 4393 | 0 |
| 4394 | 0 |
| 4395 | 0 |
| 4396 | 0 |
| 4397 | 0 |
| 4398 | 0 |
| 4399 | 0 |
| 4400 | 0 |
| 4401 | 0 |
| 4402 | 0 |
| 4403 | 0 |
| 4404 | 0 |
| 4405 | 0 |
| 4406 | 0 |
| 4407 | 0 |
| 4408 | 0 |
| 4409 | 0 |
| 4410 | 0 |
| 4411 | 0 |
| 4412 | 0 |
| 4413 | 0 |
| 4414 | 0 |
| 4415 | 0 |
| 4416 | 0 |
| 4417 | 0 |
| 4418 | 0 |
| 4419 | 0 |
| 4420 | 0 |
| 4421 | 0 |
| 4422 | 0 |
| 4423 | 0 |
| 4424 | 0 |
| 4425 | 0 |
| 4426 | 0 |
| 4427 | 0 |
| 4428 | 0 |
| 4429 | 0 |
| 4430 | 0 |
| 4431 | 0 |
| 4432 | 0 |
| 4433 | 0 |
| 4434 | 0 |
| 4435 | 0 |
| 4436 | 0 |
| 4437 | 0 |
| 4438 | 0 |
| 4439 | 0 |
| 4440 | 0 |
| 4441 | 0 |
| 4442 | 0 |
| 4443 | 0 |
| 4444 | 0 |
| 4445 | 0 |
| 4446 | 912 |
| 4447 | 914 |
| 4448 | 913 |
| 4449 | 0 |
| 4450 | 0 |
| 4451 | 0 |
| 4452 | 0 |
| 4453 | 0 |
| 4454 | 0 |
| 4455 | 0 |
| 4456 | 0 |
| 4457 | 0 |
| 4458 | 0 |
| 4459 | 0 |
| 4460 | 0 |
| 4461 | 0 |
| 4462 | 0 |
| 4463 | 0 |
| 4464 | 0 |
| 4465 | 0 |
| 4466 | 0 |
| 4467 | 0 |
| 4468 | 0 |
| 4469 | 0 |
| 4470 | 0 |
| 4471 | 0 |
| 4472 | 0 |
| 4473 | 0 |
| 4474 | 0 |
| 4475 | 0 |
| 4476 | 0 |
| 4477 | 0 |
| 4478 | 0 |
| 4479 | 0 |
| 4480 | 0 |
| 4481 | 0 |
| 4482 | 0 |
| 4483 | 0 |
| 4484 | 0 |
| 4485 | 0 |
| 4486 | 0 |
| 4487 | 0 |
| 4488 | 0 |
| 4489 | 0 |
| 4490 | 0 |
| 4491 | 0 |
| 4492 | 0 |
| 4493 | 0 |
| 4494 | 0 |
| 4495 | 0 |
| 4496 | 0 |
| 4497 | 0 |
| 4498 | 0 |
| 4499 | 0 |
| 4500 | 0 |
| 4501 | 0 |
| 4502 | 0 |
| 4503 | 0 |
| 4504 | 0 |
| 4505 | 0 |
| 4506 | 0 |
| 4507 | 0 |
| 4508 | 913 |
| 4509 | 912 |
| 4510 | 911 |
| 4511 | 910 |
| 4512 | 0 |
| 4513 | 0 |
| 4514 | 0 |
| 4515 | 0 |
| 4516 | 0 |
| 4517 | 0 |
| 4518 | 0 |
| 4519 | 0 |
| 4520 | 0 |
| 4521 | 0 |
| 4522 | 0 |
| 4523 | 0 |
| 4524 | 0 |
| 4525 | 0 |
| 4526 | 0 |
| 4527 | 0 |
| 4528 | 0 |
| 4529 | 0 |
| 4530 | 0 |
| 4531 | 0 |
| 4532 | 0 |
| 4533 | 0 |
| 4534 | 0 |
| 4535 | 0 |
| 4536 | 0 |
| 4537 | 0 |
| 4538 | 0 |
| 4539 | 0 |
| 4540 | 0 |
| 4541 | 0 |
| 4542 | 0 |
| 4543 | 0 |
| 4544 | 0 |
| 4545 | 0 |
| 4546 | 0 |
| 4547 | 0 |
| 4548 | 0 |
| 4549 | 0 |
| 4550 | 0 |
| 4551 | 0 |
| 4552 | 0 |
| 4553 | 0 |
| 4554 | 0 |
| 4555 | 0 |
| 4556 | 0 |
| 4557 | 0 |
| 4558 | 0 |
| 4559 | 0 |
| 4560 | 0 |
| 4561 | 0 |
| 4562 | 0 |
| 4563 | 0 |
| 4564 | 0 |
| 4565 | 0 |
| 4566 | 0 |
| 4567 | 0 |
| 4568 | 0 |
| 4569 | 0 |
| 4570 | 911 |
| 4571 | 911 |
| 4572 | 911 |
| 4573 | 0 |
| 4574 | 0 |
| 4575 | 0 |
| 4576 | 0 |
| 4577 | 0 |
| 4578 | 0 |
| 4579 | 0 |
| 4580 | 0 |
| 4581 | 0 |
| 4582 | 0 |
| 4583 | 0 |
| 4584 | 0 |
| 4585 | 0 |
| 4586 | 0 |
| 4587 | 0 |
| 4588 | 0 |
| 4589 | 0 |
| 4590 | 0 |
| 4591 | 0 |
| 4592 | 0 |
| 4593 | 0 |
| 4594 | 0 |
| 4595 | 0 |
| 4596 | 0 |
| 4597 | 0 |
| 4598 | 0 |
| 4599 | 0 |
| 4600 | 0 |
| 4601 | 0 |
| 4602 | 0 |
| 4603 | 0 |
| 4604 | 0 |
| 4605 | 0 |
| 4606 | 0 |
| 4607 | 0 |
| 4608 | 0 |
| 4609 | 0 |
| 4610 | 0 |
| 4611 | 0 |
| 4612 | 0 |
| 4613 | 0 |
| 4614 | 0 |
| 4615 | 0 |
| 4616 | 0 |
| 4617 | 0 |
| 4618 | 0 |
| 4619 | 0 |
| 4620 | 0 |
| 4621 | 0 |
| 4622 | 0 |
| 4623 | 0 |
| 4624 | 0 |
| 4625 | 0 |
| 4626 | 0 |
| 4627 | 0 |
| 4628 | 0 |
| 4629 | 914 |
| 4630 | 912 |
| 4631 | 911 |
| 4632 | 0 |
| 4633 | 0 |
| 4634 | 0 |
| 4635 | 0 |
| 4636 | 0 |
| 4637 | 0 |
| 4638 | 0 |
| 4639 | 0 |
| 4640 | 0 |
| 4641 | 0 |
| 4642 | 0 |
| 4643 | 0 |
| 4644 | 0 |
| 4645 | 0 |
| 4646 | 0 |
| 4647 | 0 |
| 4648 | 0 |
| 4649 | 0 |
| 4650 | 0 |
| 4651 | 0 |
| 4652 | 0 |
| 4653 | 0 |
| 4654 | 0 |
| 4655 | 0 |
| 4656 | 0 |
| 4657 | 0 |
| 4658 | 0 |
| 4659 | 0 |
| 4660 | 0 |
| 4661 | 0 |
| 4662 | 0 |
| 4663 | 0 |
| 4664 | 0 |
| 4665 | 0 |
| 4666 | 0 |
| 4667 | 0 |
| 4668 | 0 |
| 4669 | 0 |
| 4670 | 0 |
| 4671 | 0 |
| 4672 | 0 |
| 4673 | 0 |
| 4674 | 0 |
| 4675 | 0 |
| 4676 | 0 |
| 4677 | 0 |
| 4678 | 0 |
| 4679 | 0 |
| 4680 | 0 |
| 4681 | 0 |
| 4682 | 0 |
| 4683 | 0 |
| 4684 | 0 |
| 4685 | 0 |
| 4686 | 0 |
| 4687 | 912 |
| 4688 | 912 |
| 4689 | 911 |
| 4690 | 912 |
| 4691 | 0 |
| 4692 | 0 |
| 4693 | 0 |
| 4694 | 0 |
| 4695 | 0 |
| 4696 | 0 |
| 4697 | 0 |
| 4698 | 0 |
| 4699 | 0 |
| 4700 | 0 |
| 4701 | 0 |
| 4702 | 0 |
| 4703 | 0 |
| 4704 | 0 |
| 4705 | 0 |
| 4706 | 0 |
| 4707 | 0 |
| 4708 | 0 |
| 4709 | 0 |
| 4710 | 0 |
| 4711 | 0 |
| 4712 | 0 |
| 4713 | 0 |
| 4714 | 0 |
| 4715 | 0 |
| 4716 | 0 |
| 4717 | 0 |
| 4718 | 0 |
| 4719 | 0 |
| 4720 | 0 |
| 4721 | 0 |
| 4722 | 0 |
| 4723 | 0 |
| 4724 | 0 |
| 4725 | 0 |
| 4726 | 0 |
| 4727 | 0 |
| 4728 | 0 |
| 4729 | 0 |
| 4730 | 0 |
| 4731 | 0 |
| 4732 | 0 |
| 4733 | 0 |
| 4734 | 0 |
| 4735 | 0 |
| 4736 | 0 |
| 4737 | 0 |
| 4738 | 0 |
| 4739 | 0 |
| 4740 | 0 |
| 4741 | 0 |
| 4742 | 0 |
| 4743 | 0 |
| 4744 | 0 |
| 4745 | 913 |
| 4746 | 913 |
| 4747 | 911 |
| 4748 | 0 |
| 4749 | 0 |
| 4750 | 0 |
| 4751 | 0 |
| 4752 | 0 |
| 4753 | 0 |
| 4754 | 0 |
| 4755 | 0 |
| 4756 | 0 |
| 4757 | 0 |
| 4758 | 0 |
| 4759 | 0 |
| 4760 | 0 |
| 4761 | 0 |
| 4762 | 0 |
| 4763 | 0 |
| 4764 | 0 |
| 4765 | 0 |
| 4766 | 0 |
| 4767 | 0 |
| 4768 | 0 |
| 4769 | 0 |
| 4770 | 0 |
| 4771 | 0 |
| 4772 | 0 |
| 4773 | 0 |
| 4774 | 0 |
| 4775 | 0 |
| 4776 | 0 |
| 4777 | 0 |
| 4778 | 0 |
| 4779 | 0 |
| 4780 | 0 |
| 4781 | 0 |
| 4782 | 0 |
| 4783 | 0 |
| 4784 | 0 |
| 4785 | 0 |
| 4786 | 0 |
| 4787 | 0 |
| 4788 | 0 |
| 4789 | 0 |
| 4790 | 0 |
| 4791 | 0 |
| 4792 | 0 |
| 4793 | 0 |
| 4794 | 0 |
| 4795 | 0 |
| 4796 | 0 |
| 4797 | 0 |
| 4798 | 0 |
| 4799 | 0 |
| 4800 | 0 |
| 4801 | 910 |
| 4802 | 910 |
| 4803 | 910 |
| 4804 | 911 |
| 4805 | 0 |
| 4806 | 0 |
| 4807 | 0 |
| 4808 | 0 |
| 4809 | 0 |
| 4810 | 0 |
| 4811 | 0 |
| 4812 | 0 |
| 4813 | 0 |
| 4814 | 0 |
| 4815 | 0 |
| 4816 | 0 |
| 4817 | 0 |
| 4818 | 0 |
| 4819 | 0 |
| 4820 | 0 |
| 4821 | 0 |
| 4822 | 0 |
| 4823 | 0 |
| 4824 | 0 |
| 4825 | 0 |
| 4826 | 0 |
| 4827 | 0 |
| 4828 | 0 |
| 4829 | 0 |
| 4830 | 0 |
| 4831 | 0 |
| 4832 | 0 |
| 4833 | 0 |
| 4834 | 0 |
| 4835 | 0 |
| 4836 | 0 |
| 4837 | 0 |
| 4838 | 0 |
| 4839 | 0 |
| 4840 | 0 |
| 4841 | 0 |
| 4842 | 0 |
| 4843 | 0 |
| 4844 | 0 |
| 4845 | 0 |
| 4846 | 0 |
| 4847 | 0 |
| 4848 | 0 |
| 4849 | 0 |
| 4850 | 0 |
| 4851 | 0 |
| 4852 | 0 |
| 4853 | 0 |
| 4854 | 0 |
| 4855 | 911 |
| 4856 | 912 |
| 4857 | 913 |
| 4858 | 913 |
| 4859 | 0 |
| 4860 | 0 |
| 4861 | 0 |
| 4862 | 0 |
| 4863 | 0 |
| 4864 | 0 |
| 4865 | 0 |
| 4866 | 0 |
| 4867 | 0 |
| 4868 | 0 |
| 4869 | 0 |
| 4870 | 0 |
| 4871 | 0 |
| 4872 | 0 |
| 4873 | 0 |
| 4874 | 0 |
| 4875 | 0 |
| 4876 | 0 |
| 4877 | 0 |
| 4878 | 0 |
| 4879 | 0 |
| 4880 | 0 |
| 4881 | 0 |
| 4882 | 0 |
| 4883 | 0 |
| 4884 | 0 |
| 4885 | 0 |
| 4886 | 0 |
| 4887 | 0 |
| 4888 | 0 |
| 4889 | 0 |
| 4890 | 0 |
| 4891 | 0 |
| 4892 | 0 |
| 4893 | 0 |
| 4894 | 0 |
| 4895 | 0 |
| 4896 | 0 |
| 4897 | 0 |
| 4898 | 0 |
| 4899 | 0 |
| 4900 | 0 |
| 4901 | 0 |
| 4902 | 0 |
| 4903 | 0 |
| 4904 | 0 |
| 4905 | 0 |
| 4906 | 0 |
| 4907 | 0 |
| 4908 | 912 |
| 4909 | 911 |
| 4910 | 909 |
| 4911 | 0 |
| 4912 | 0 |
| 4913 | 0 |
| 4914 | 0 |
| 4915 | 0 |
| 4916 | 0 |
| 4917 | 0 |
| 4918 | 0 |
| 4919 | 0 |
| 4920 | 0 |
| 4921 | 0 |
| 4922 | 0 |
| 4923 | 0 |
| 4924 | 0 |
| 4925 | 0 |
| 4926 | 0 |
| 4927 | 0 |
| 4928 | 0 |
| 4929 | 0 |
| 4930 | 0 |
| 4931 | 0 |
| 4932 | 0 |
| 4933 | 0 |
| 4934 | 0 |
| 4935 | 0 |
| 4936 | 0 |
| 4937 | 0 |
| 4938 | 0 |
| 4939 | 0 |
| 4940 | 0 |
| 4941 | 0 |
| 4942 | 0 |
| 4943 | 0 |
| 4944 | 0 |
| 4945 | 0 |
| 4946 | 0 |
| 4947 | 0 |
| 4948 | 0 |
| 4949 | 0 |
| 4950 | 0 |
| 4951 | 0 |
| 4952 | 0 |
| 4953 | 0 |
| 4954 | 0 |
| 4955 | 0 |
| 4956 | 0 |
| 4957 | 0 |
| 4958 | 0 |
| 4959 | 0 |
| 4960 | 912 |
| 4961 | 911 |
| 4962 | 911 |
| 4963 | 911 |
| 4964 | 0 |
| 4965 | 0 |
| 4966 | 0 |
| 4967 | 0 |
| 4968 | 0 |
| 4969 | 0 |
| 4970 | 0 |
| 4971 | 0 |
| 4972 | 0 |
| 4973 | 0 |
| 4974 | 0 |
| 4975 | 0 |
| 4976 | 0 |
| 4977 | 0 |
| 4978 | 0 |
| 4979 | 0 |
| 4980 | 0 |
| 4981 | 0 |
| 4982 | 0 |
| 4983 | 0 |
| 4984 | 0 |
| 4985 | 0 |
| 4986 | 0 |
| 4987 | 0 |
| 4988 | 0 |
| 4989 | 0 |
| 4990 | 0 |
| 4991 | 0 |
| 4992 | 0 |
| 4993 | 0 |
| 4994 | 0 |
| 4995 | 0 |
| 4996 | 0 |
| 4997 | 0 |
| 4998 | 0 |
| 4999 | 0 |
| 5000 | 0 |
| 5001 | 0 |
| 5002 | 0 |
| 5003 | 0 |
| 5004 | 0 |
| 5005 | 0 |
| 5006 | 0 |
| 5007 | 0 |
| 5008 | 0 |
| 5009 | 0 |
| 5010 | 0 |
| 5011 | 0 |
| 5012 | 909 |
| 5013 | 910 |
| 5014 | 910 |
| 5015 | 0 |
| 5016 | 0 |
| 5017 | 0 |
| 5018 | 0 |
| 5019 | 0 |
| 5020 | 0 |
| 5021 | 0 |
| 5022 | 0 |
| 5023 | 0 |
| 5024 | 0 |
| 5025 | 0 |
| 5026 | 0 |
| 5027 | 0 |
| 5028 | 0 |
| 5029 | 0 |
| 5030 | 0 |
| 5031 | 0 |
| 5032 | 0 |
| 5033 | 0 |
| 5034 | 0 |
| 5035 | 0 |
| 5036 | 0 |
| 5037 | 0 |
| 5038 | 0 |
| 5039 | 0 |
| 5040 | 0 |
| 5041 | 0 |
| 5042 | 0 |
| 5043 | 0 |
| 5044 | 0 |
| 5045 | 0 |
| 5046 | 0 |
| 5047 | 0 |
| 5048 | 0 |
| 5049 | 0 |
| 5050 | 0 |
| 5051 | 0 |
| 5052 | 0 |
| 5053 | 0 |
| 5054 | 0 |
| 5055 | 0 |
| 5056 | 0 |
| 5057 | 0 |
| 5058 | 0 |
| 5059 | 0 |
| 5060 | 0 |
| 5061 | 0 |
| 5062 | 0 |
| 5063 | 914 |
| 5064 | 913 |
| 5065 | 911 |
| 5066 | 910 |
| 5067 | 0 |
| 5068 | 0 |
| 5069 | 0 |
| 5070 | 0 |
| 5071 | 0 |
| 5072 | 0 |
| 5073 | 0 |
| 5074 | 0 |
| 5075 | 0 |
| 5076 | 0 |
| 5077 | 0 |
| 5078 | 0 |
| 5079 | 0 |
| 5080 | 0 |
| 5081 | 0 |
| 5082 | 0 |
| 5083 | 0 |
| 5084 | 0 |
| 5085 | 0 |
| 5086 | 0 |
| 5087 | 0 |
| 5088 | 0 |
| 5089 | 0 |
| 5090 | 0 |
| 5091 | 0 |
| 5092 | 0 |
| 5093 | 0 |
| 5094 | 0 |
| 5095 | 0 |
| 5096 | 0 |
| 5097 | 0 |
| 5098 | 0 |
| 5099 | 0 |
| 5100 | 0 |
| 5101 | 0 |
| 5102 | 0 |
| 5103 | 0 |
| 5104 | 0 |
| 5105 | 0 |
| 5106 | 0 |
| 5107 | 0 |
| 5108 | 0 |
| 5109 | 0 |
| 5110 | 0 |
| 5111 | 0 |
| 5112 | 0 |
| 5113 | 0 |
| 5114 | 912 |
| 5115 | 912 |
| 5116 | 912 |
| 5117 | 912 |
| 5118 | 0 |
| 5119 | 0 |
| 5120 | 0 |
| 5121 | 0 |
| 5122 | 0 |
| 5123 | 0 |
| 5124 | 0 |
| 5125 | 0 |
| 5126 | 0 |
| 5127 | 0 |
| 5128 | 0 |
| 5129 | 0 |
| 5130 | 0 |
| 5131 | 0 |
| 5132 | 0 |
| 5133 | 0 |
| 5134 | 0 |
| 5135 | 0 |
| 5136 | 0 |
| 5137 | 0 |
| 5138 | 0 |
| 5139 | 0 |
| 5140 | 0 |
| 5141 | 0 |
| 5142 | 0 |
| 5143 | 0 |
| 5144 | 0 |
| 5145 | 0 |
| 5146 | 0 |
| 5147 | 0 |
| 5148 | 0 |
| 5149 | 0 |
| 5150 | 0 |
| 5151 | 0 |
| 5152 | 0 |
| 5153 | 0 |
| 5154 | 0 |
| 5155 | 0 |
| 5156 | 0 |
| 5157 | 0 |
| 5158 | 0 |
| 5159 | 0 |
| 5160 | 0 |
| 5161 | 0 |
| 5162 | 0 |
| 5163 | 0 |
| 5164 | 0 |
| 5165 | 912 |
| 5166 | 911 |
| 5167 | 910 |
| 5168 | 910 |
| 5169 | 0 |
| 5170 | 0 |
| 5171 | 0 |
| 5172 | 0 |
| 5173 | 0 |
| 5174 | 0 |
| 5175 | 0 |
| 5176 | 0 |
| 5177 | 0 |
| 5178 | 0 |
| 5179 | 0 |
| 5180 | 0 |
| 5181 | 0 |
| 5182 | 0 |
| 5183 | 0 |
| 5184 | 0 |
| 5185 | 0 |
| 5186 | 0 |
| 5187 | 0 |
| 5188 | 0 |
| 5189 | 0 |
| 5190 | 0 |
| 5191 | 0 |
| 5192 | 0 |
| 5193 | 0 |
| 5194 | 0 |
| 5195 | 0 |
| 5196 | 0 |
| 5197 | 0 |
| 5198 | 0 |
| 5199 | 0 |
| 5200 | 0 |
| 5201 | 0 |
| 5202 | 0 |
| 5203 | 0 |
| 5204 | 0 |
| 5205 | 0 |
| 5206 | 0 |
| 5207 | 0 |
| 5208 | 0 |
| 5209 | 0 |
| 5210 | 0 |
| 5211 | 0 |
| 5212 | 0 |
| 5213 | 0 |
| 5214 | 0 |
| 5215 | 0 |
| 5216 | 912 |
| 5217 | 911 |
| 5218 | 911 |
| 5219 | 912 |
| 5220 | 0 |
| 5221 | 0 |
| 5222 | 0 |
| 5223 | 0 |
| 5224 | 0 |
| 5225 | 0 |
| 5226 | 0 |
| 5227 | 0 |
| 5228 | 0 |
| 5229 | 0 |
| 5230 | 0 |
| 5231 | 0 |
| 5232 | 0 |
| 5233 | 0 |
| 5234 | 0 |
| 5235 | 0 |
| 5236 | 0 |
| 5237 | 0 |
| 5238 | 0 |
| 5239 | 0 |
| 5240 | 0 |
| 5241 | 0 |
| 5242 | 0 |
| 5243 | 0 |
| 5244 | 0 |
| 5245 | 0 |
| 5246 | 0 |
| 5247 | 0 |
| 5248 | 0 |
| 5249 | 0 |
| 5250 | 0 |
| 5251 | 0 |
| 5252 | 0 |
| 5253 | 0 |
| 5254 | 0 |
| 5255 | 0 |
| 5256 | 0 |
| 5257 | 0 |
| 5258 | 0 |
| 5259 | 0 |
| 5260 | 0 |
| 5261 | 0 |
| 5262 | 0 |
| 5263 | 0 |
| 5264 | 0 |
| 5265 | 0 |
| 5266 | 0 |
| 5267 | 913 |
| 5268 | 914 |
| 5269 | 913 |
| 5270 | 0 |
| 5271 | 0 |
| 5272 | 0 |
| 5273 | 0 |
| 5274 | 0 |
| 5275 | 0 |
| 5276 | 0 |
| 5277 | 0 |
| 5278 | 0 |
| 5279 | 0 |
| 5280 | 0 |
| 5281 | 0 |
| 5282 | 0 |
| 5283 | 0 |
| 5284 | 0 |
| 5285 | 0 |
| 5286 | 0 |
| 5287 | 0 |
| 5288 | 0 |
| 5289 | 0 |
| 5290 | 0 |
| 5291 | 0 |
| 5292 | 0 |
| 5293 | 0 |
| 5294 | 0 |
| 5295 | 0 |
| 5296 | 0 |
| 5297 | 0 |
| 5298 | 0 |
| 5299 | 0 |
| 5300 | 0 |
| 5301 | 0 |
| 5302 | 0 |
| 5303 | 0 |
| 5304 | 0 |
| 5305 | 0 |
| 5306 | 0 |
| 5307 | 0 |
| 5308 | 0 |
| 5309 | 0 |
| 5310 | 0 |
| 5311 | 0 |
| 5312 | 0 |
| 5313 | 0 |
| 5314 | 0 |
| 5315 | 0 |
| 5316 | 0 |
| 5317 | 0 |
| 5318 | 911 |
| 5319 | 911 |
| 5320 | 910 |
| 5321 | 910 |
| 5322 | 0 |
| 5323 | 0 |
| 5324 | 0 |
| 5325 | 0 |
| 5326 | 0 |
| 5327 | 0 |
| 5328 | 0 |
| 5329 | 0 |
| 5330 | 0 |
| 5331 | 0 |
| 5332 | 0 |
| 5333 | 0 |
| 5334 | 0 |
| 5335 | 0 |
| 5336 | 0 |
| 5337 | 0 |
| 5338 | 0 |
| 5339 | 0 |
| 5340 | 0 |
| 5341 | 0 |
| 5342 | 0 |
| 5343 | 0 |
| 5344 | 0 |
| 5345 | 0 |
| 5346 | 0 |
| 5347 | 0 |
| 5348 | 0 |
| 5349 | 0 |
| 5350 | 0 |
| 5351 | 0 |
| 5352 | 0 |
| 5353 | 0 |
| 5354 | 0 |
| 5355 | 0 |
| 5356 | 0 |
| 5357 | 0 |
| 5358 | 0 |
| 5359 | 0 |
| 5360 | 0 |
| 5361 | 0 |
| 5362 | 0 |
| 5363 | 0 |
| 5364 | 0 |
| 5365 | 0 |
| 5366 | 0 |
| 5367 | 0 |
| 5368 | 0 |
| 5369 | 912 |
| 5370 | 912 |
| 5371 | 911 |
| 5372 | 912 |
| 5373 | 0 |
| 5374 | 0 |
| 5375 | 0 |
| 5376 | 0 |
| 5377 | 0 |
| 5378 | 0 |
| 5379 | 0 |
| 5380 | 0 |
| 5381 | 0 |
| 5382 | 0 |
| 5383 | 0 |
| 5384 | 0 |
| 5385 | 0 |
| 5386 | 0 |
| 5387 | 0 |
| 5388 | 0 |
| 5389 | 0 |
| 5390 | 0 |
| 5391 | 0 |
| 5392 | 0 |
| 5393 | 0 |
| 5394 | 0 |
| 5395 | 0 |
| 5396 | 0 |
| 5397 | 0 |
| 5398 | 0 |
| 5399 | 0 |
| 5400 | 0 |
| 5401 | 0 |
| 5402 | 0 |
| 5403 | 0 |
| 5404 | 0 |
| 5405 | 0 |
| 5406 | 0 |
| 5407 | 0 |
| 5408 | 0 |
| 5409 | 0 |
| 5410 | 0 |
| 5411 | 0 |
| 5412 | 0 |
| 5413 | 0 |
| 5414 | 0 |
| 5415 | 0 |
| 5416 | 0 |
| 5417 | 0 |
| 5418 | 0 |
| 5419 | 910 |
| 5420 | 911 |
| 5421 | 910 |
| 5422 | 911 |
| 5423 | 0 |
| 5424 | 0 |
| 5425 | 0 |
| 5426 | 0 |
| 5427 | 0 |
| 5428 | 0 |
| 5429 | 0 |
| 5430 | 0 |
| 5431 | 0 |
| 5432 | 0 |
| 5433 | 0 |
| 5434 | 0 |
| 5435 | 0 |
| 5436 | 0 |
| 5437 | 0 |
| 5438 | 0 |
| 5439 | 0 |
| 5440 | 0 |
| 5441 | 0 |
| 5442 | 0 |
| 5443 | 0 |
| 5444 | 0 |
| 5445 | 0 |
| 5446 | 0 |
| 5447 | 0 |
| 5448 | 0 |
| 5449 | 0 |
| 5450 | 0 |
| 5451 | 0 |
| 5452 | 0 |
| 5453 | 0 |
| 5454 | 0 |
| 5455 | 0 |
| 5456 | 0 |
| 5457 | 0 |
| 5458 | 0 |
| 5459 | 0 |
| 5460 | 0 |
| 5461 | 0 |
| 5462 | 0 |
| 5463 | 0 |
| 5464 | 0 |
| 5465 | 0 |
| 5466 | 0 |
| 5467 | 0 |
| 5468 | 0 |
| 5469 | 0 |
| 5470 | 912 |
| 5471 | 912 |
| 5472 | 912 |
| 5473 | 0 |
| 5474 | 0 |
| 5475 | 0 |
| 5476 | 0 |
| 5477 | 0 |
| 5478 | 0 |
| 5479 | 0 |
| 5480 | 0 |
| 5481 | 0 |
| 5482 | 0 |
| 5483 | 0 |
| 5484 | 0 |
| 5485 | 0 |
| 5486 | 0 |
| 5487 | 0 |
| 5488 | 0 |
| 5489 | 0 |
| 5490 | 0 |
| 5491 | 0 |
| 5492 | 0 |
| 5493 | 0 |
| 5494 | 0 |
| 5495 | 0 |
| 5496 | 0 |
| 5497 | 0 |
| 5498 | 0 |
| 5499 | 0 |
| 5500 | 0 |
| 5501 | 0 |
| 5502 | 0 |
| 5503 | 0 |
| 5504 | 0 |
| 5505 | 0 |
| 5506 | 0 |
| 5507 | 0 |
| 5508 | 0 |
| 5509 | 0 |
| 5510 | 0 |
| 5511 | 0 |
| 5512 | 0 |
| 5513 | 0 |
| 5514 | 0 |
| 5515 | 0 |
| 5516 | 0 |
| 5517 | 0 |
| 5518 | 908 |
| 5519 | 910 |
| 5520 | 909 |
| 5521 | 911 |
| 5522 | 0 |
| 5523 | 0 |
| 5524 | 0 |
| 5525 | 0 |
| 5526 | 0 |
| 5527 | 0 |
| 5528 | 0 |
| 5529 | 0 |
| 5530 | 0 |
| 5531 | 0 |
| 5532 | 0 |
| 5533 | 0 |
| 5534 | 0 |
| 5535 | 0 |
| 5536 | 0 |
| 5537 | 0 |
| 5538 | 0 |
| 5539 | 0 |
| 5540 | 0 |
| 5541 | 0 |
| 5542 | 0 |
| 5543 | 0 |
| 5544 | 0 |
| 5545 | 0 |
| 5546 | 0 |
| 5547 | 0 |
| 5548 | 0 |
| 5549 | 0 |
| 5550 | 0 |
| 5551 | 0 |
| 5552 | 0 |
| 5553 | 0 |
| 5554 | 0 |
| 5555 | 0 |
| 5556 | 0 |
| 5557 | 0 |
| 5558 | 0 |
| 5559 | 0 |
| 5560 | 0 |
| 5561 | 0 |
| 5562 | 0 |
| 5563 | 0 |
| 5564 | 0 |
| 5565 | 0 |
| 5566 | 912 |
| 5567 | 912 |
| 5568 | 911 |
| 5569 | 0 |
| 5570 | 0 |
| 5571 | 0 |
| 5572 | 0 |
| 5573 | 0 |
| 5574 | 0 |
| 5575 | 0 |
| 5576 | 0 |
| 5577 | 0 |
| 5578 | 0 |
| 5579 | 0 |
| 5580 | 0 |
| 5581 | 0 |
| 5582 | 0 |
| 5583 | 0 |
| 5584 | 0 |
| 5585 | 0 |
| 5586 | 0 |
| 5587 | 0 |
| 5588 | 0 |
| 5589 | 0 |
| 5590 | 0 |
| 5591 | 0 |
| 5592 | 0 |
| 5593 | 0 |
| 5594 | 0 |
| 5595 | 0 |
| 5596 | 0 |
| 5597 | 0 |
| 5598 | 0 |
| 5599 | 0 |
| 5600 | 0 |
| 5601 | 0 |
| 5602 | 0 |
| 5603 | 0 |
| 5604 | 0 |
| 5605 | 0 |
| 5606 | 0 |
| 5607 | 0 |
| 5608 | 0 |
| 5609 | 0 |
| 5610 | 0 |
| 5611 | 0 |
| 5612 | 0 |
| 5613 | 0 |
| 5614 | 910 |
| 5615 | 911 |
| 5616 | 910 |
| 5617 | 910 |
| 5618 | 0 |
| 5619 | 0 |
| 5620 | 0 |
| 5621 | 0 |
| 5622 | 0 |
| 5623 | 0 |
| 5624 | 0 |
| 5625 | 0 |
| 5626 | 0 |
| 5627 | 0 |
| 5628 | 0 |
| 5629 | 0 |
| 5630 | 0 |
| 5631 | 0 |
| 5632 | 0 |
| 5633 | 0 |
| 5634 | 0 |
| 5635 | 0 |
| 5636 | 0 |
| 5637 | 0 |
| 5638 | 0 |
| 5639 | 0 |
| 5640 | 0 |
| 5641 | 0 |
| 5642 | 0 |
| 5643 | 0 |
| 5644 | 0 |
| 5645 | 0 |
| 5646 | 0 |
| 5647 | 0 |
| 5648 | 0 |
| 5649 | 0 |
| 5650 | 0 |
| 5651 | 0 |
| 5652 | 0 |
| 5653 | 0 |
| 5654 | 0 |
| 5655 | 0 |
| 5656 | 0 |
| 5657 | 0 |
| 5658 | 0 |
| 5659 | 0 |
| 5660 | 0 |
| 5661 | 0 |
| 5662 | 911 |
| 5663 | 913 |
| 5664 | 913 |
| 5665 | 913 |
| 5666 | 0 |
| 5667 | 0 |
| 5668 | 0 |
| 5669 | 0 |
| 5670 | 0 |
| 5671 | 0 |
| 5672 | 0 |
| 5673 | 0 |
| 5674 | 0 |
| 5675 | 0 |
| 5676 | 0 |
| 5677 | 0 |
| 5678 | 0 |
| 5679 | 0 |
| 5680 | 0 |
| 5681 | 0 |
| 5682 | 0 |
| 5683 | 0 |
| 5684 | 0 |
| 5685 | 0 |
| 5686 | 0 |
| 5687 | 0 |
| 5688 | 0 |
| 5689 | 0 |
| 5690 | 0 |
| 5691 | 0 |
| 5692 | 0 |
| 5693 | 0 |
| 5694 | 0 |
| 5695 | 0 |
| 5696 | 0 |
| 5697 | 0 |
| 5698 | 0 |
| 5699 | 0 |
| 5700 | 0 |
| 5701 | 0 |
| 5702 | 0 |
| 5703 | 0 |
| 5704 | 0 |
| 5705 | 0 |
| 5706 | 0 |
| 5707 | 0 |
| 5708 | 0 |
| 5709 | 0 |
| 5710 | 881 |
| 5711 | 910 |
| 5712 | 911 |
| 5713 | 911 |
| 5714 | 0 |
| 5715 | 0 |
| 5716 | 0 |
| 5717 | 0 |
| 5718 | 0 |
| 5719 | 0 |
| 5720 | 0 |
| 5721 | 0 |
| 5722 | 0 |
| 5723 | 0 |
| 5724 | 0 |
| 5725 | 0 |
| 5726 | 0 |
| 5727 | 0 |
| 5728 | 0 |
| 5729 | 0 |
| 5730 | 0 |
| 5731 | 0 |
| 5732 | 0 |
| 5733 | 0 |
| 5734 | 0 |
| 5735 | 0 |
| 5736 | 0 |
| 5737 | 0 |
| 5738 | 0 |
| 5739 | 0 |
| 5740 | 0 |
| 5741 | 0 |
| 5742 | 0 |
| 5743 | 0 |
| 5744 | 0 |
| 5745 | 0 |
| 5746 | 0 |
| 5747 | 0 |
| 5748 | 0 |
| 5749 | 0 |
| 5750 | 0 |
| 5751 | 0 |
| 5752 | 0 |
| 5753 | 0 |
| 5754 | 0 |
| 5755 | 0 |
| 5756 | 0 |
| 5757 | 0 |
| 5758 | 0 |
| 5759 | 912 |
| 5760 | 913 |
| 5761 | 911 |
| 5762 | 0 |
| 5763 | 0 |
| 5764 | 0 |
| 5765 | 0 |
| 5766 | 0 |
| 5767 | 0 |
| 5768 | 0 |
| 5769 | 0 |
| 5770 | 0 |
| 5771 | 0 |
| 5772 | 0 |
| 5773 | 0 |
| 5774 | 0 |
| 5775 | 0 |
| 5776 | 0 |
| 5777 | 0 |
| 5778 | 0 |
| 5779 | 0 |
| 5780 | 0 |
| 5781 | 0 |
| 5782 | 0 |
| 5783 | 0 |
| 5784 | 0 |
| 5785 | 0 |
| 5786 | 0 |
| 5787 | 0 |
| 5788 | 0 |
| 5789 | 0 |
| 5790 | 0 |
| 5791 | 0 |
| 5792 | 0 |
| 5793 | 0 |
| 5794 | 0 |
| 5795 | 0 |
| 5796 | 0 |
| 5797 | 0 |
| 5798 | 0 |
| 5799 | 0 |
| 5800 | 0 |
| 5801 | 0 |
| 5802 | 0 |
| 5803 | 0 |
| 5804 | 0 |
| 5805 | 0 |
| 5806 | 0 |
| 5807 | 915 |
| 5808 | 913 |
| 5809 | 912 |
| 5810 | 0 |
| 5811 | 0 |
| 5812 | 0 |
| 5813 | 0 |
| 5814 | 0 |
| 5815 | 0 |
| 5816 | 0 |
| 5817 | 0 |
| 5818 | 0 |
| 5819 | 0 |
| 5820 | 0 |
| 5821 | 0 |
| 5822 | 0 |
| 5823 | 0 |
| 5824 | 0 |
| 5825 | 0 |
| 5826 | 0 |
| 5827 | 0 |
| 5828 | 0 |
| 5829 | 0 |
| 5830 | 0 |
| 5831 | 0 |
| 5832 | 0 |
| 5833 | 0 |
| 5834 | 0 |
| 5835 | 0 |
| 5836 | 0 |
| 5837 | 0 |
| 5838 | 0 |
| 5839 | 0 |
| 5840 | 0 |
| 5841 | 0 |
| 5842 | 0 |
| 5843 | 0 |
| 5844 | 0 |
| 5845 | 0 |
| 5846 | 0 |
| 5847 | 0 |
| 5848 | 0 |
| 5849 | 0 |
| 5850 | 0 |
| 5851 | 0 |
| 5852 | 0 |
| 5853 | 0 |
| 5854 | 0 |
| 5855 | 912 |
| 5856 | 911 |
| 5857 | 910 |
| 5858 | 911 |
| 5859 | 0 |
| 5860 | 0 |
| 5861 | 0 |
| 5862 | 0 |
| 5863 | 0 |
| 5864 | 0 |
| 5865 | 0 |
| 5866 | 0 |
| 5867 | 0 |
| 5868 | 0 |
| 5869 | 0 |
| 5870 | 0 |
| 5871 | 0 |
| 5872 | 0 |
| 5873 | 0 |
| 5874 | 0 |
| 5875 | 0 |
| 5876 | 0 |
| 5877 | 0 |
| 5878 | 0 |
| 5879 | 0 |
| 5880 | 0 |
| 5881 | 0 |
| 5882 | 0 |
| 5883 | 0 |
| 5884 | 0 |
| 5885 | 0 |
| 5886 | 0 |
| 5887 | 0 |
| 5888 | 0 |
| 5889 | 0 |
| 5890 | 0 |
| 5891 | 0 |
| 5892 | 0 |
| 5893 | 0 |
| 5894 | 0 |
| 5895 | 0 |
| 5896 | 0 |
| 5897 | 0 |
| 5898 | 0 |
| 5899 | 0 |
| 5900 | 0 |
| 5901 | 0 |
| 5902 | 0 |
| 5903 | 910 |
| 5904 | 910 |
| 5905 | 909 |
| 5906 | 909 |
| 5907 | 0 |
| 5908 | 0 |
| 5909 | 0 |
| 5910 | 0 |
| 5911 | 0 |
| 5912 | 0 |
| 5913 | 0 |
| 5914 | 0 |
| 5915 | 0 |
| 5916 | 0 |
| 5917 | 0 |
| 5918 | 0 |
| 5919 | 0 |
| 5920 | 0 |
| 5921 | 0 |
| 5922 | 0 |
| 5923 | 0 |
| 5924 | 0 |
| 5925 | 0 |
| 5926 | 0 |
| 5927 | 0 |
| 5928 | 0 |
| 5929 | 0 |
| 5930 | 0 |
| 5931 | 0 |
| 5932 | 0 |
| 5933 | 0 |
| 5934 | 0 |
| 5935 | 0 |
| 5936 | 0 |
| 5937 | 0 |
| 5938 | 0 |
| 5939 | 0 |
| 5940 | 0 |
| 5941 | 0 |
| 5942 | 0 |
| 5943 | 0 |
| 5944 | 0 |
| 5945 | 0 |
| 5946 | 0 |
| 5947 | 0 |
| 5948 | 0 |
| 5949 | 0 |
| 5950 | 0 |
| 5951 | 0 |
| 5952 | 911 |
| 5953 | 911 |
| 5954 | 912 |
| 5955 | 0 |
| 5956 | 0 |
| 5957 | 0 |
| 5958 | 0 |
| 5959 | 0 |
| 5960 | 0 |
| 5961 | 0 |
| 5962 | 0 |
| 5963 | 0 |
| 5964 | 0 |
| 5965 | 0 |
| 5966 | 0 |
| 5967 | 0 |
| 5968 | 0 |
| 5969 | 0 |
| 5970 | 0 |
| 5971 | 0 |
| 5972 | 0 |
| 5973 | 0 |
| 5974 | 0 |
| 5975 | 0 |
| 5976 | 0 |
| 5977 | 0 |
| 5978 | 0 |
| 5979 | 0 |
| 5980 | 0 |
| 5981 | 0 |
| 5982 | 0 |
| 5983 | 0 |
| 5984 | 0 |
| 5985 | 0 |
| 5986 | 0 |
| 5987 | 0 |
| 5988 | 0 |
| 5989 | 0 |
| 5990 | 0 |
| 5991 | 0 |
| 5992 | 0 |
| 5993 | 0 |
| 5994 | 0 |
| 5995 | 0 |
| 5996 | 0 |
| 5997 | 0 |
| 5998 | 0 |
| 5999 | 0 |
| 6000 | 913 |
| 6001 | 913 |
| 6002 | 911 |
| 6003 | 0 |
| 6004 | 0 |
| 6005 | 0 |
| 6006 | 0 |
| 6007 | 0 |
| 6008 | 0 |
| 6009 | 0 |
| 6010 | 0 |
| 6011 | 0 |
| 6012 | 0 |
| 6013 | 0 |
| 6014 | 0 |
| 6015 | 0 |
| 6016 | 0 |
| 6017 | 0 |
| 6018 | 0 |
| 6019 | 0 |
| 6020 | 0 |
| 6021 | 0 |
| 6022 | 0 |
| 6023 | 0 |
| 6024 | 0 |
| 6025 | 0 |
| 6026 | 0 |
| 6027 | 0 |
| 6028 | 0 |
| 6029 | 0 |
| 6030 | 0 |
| 6031 | 0 |
| 6032 | 0 |
| 6033 | 0 |
| 6034 | 0 |
| 6035 | 0 |
| 6036 | 0 |
| 6037 | 0 |
| 6038 | 0 |
| 6039 | 0 |
| 6040 | 0 |
| 6041 | 0 |
| 6042 | 0 |
| 6043 | 0 |
| 6044 | 0 |
| 6045 | 0 |
| 6046 | 0 |
| 6047 | 0 |
| 6048 | 911 |
| 6049 | 911 |
| 6050 | 912 |
| 6051 | 0 |
| 6052 | 0 |
| 6053 | 0 |
| 6054 | 0 |
| 6055 | 0 |
| 6056 | 0 |
| 6057 | 0 |
| 6058 | 0 |
| 6059 | 0 |
| 6060 | 0 |
| 6061 | 0 |
| 6062 | 0 |
| 6063 | 0 |
| 6064 | 0 |
| 6065 | 0 |
| 6066 | 0 |
| 6067 | 0 |
| 6068 | 0 |
| 6069 | 0 |
| 6070 | 0 |
| 6071 | 0 |
| 6072 | 0 |
| 6073 | 0 |
| 6074 | 0 |
| 6075 | 0 |
| 6076 | 0 |
| 6077 | 0 |
| 6078 | 0 |
| 6079 | 0 |
| 6080 | 0 |
| 6081 | 0 |
| 6082 | 0 |
| 6083 | 0 |
| 6084 | 0 |
| 6085 | 0 |
| 6086 | 0 |
| 6087 | 0 |
| 6088 | 0 |
| 6089 | 0 |
| 6090 | 0 |
| 6091 | 0 |
| 6092 | 0 |
| 6093 | 0 |
| 6094 | 0 |
| 6095 | 0 |
| 6096 | 912 |
| 6097 | 913 |
| 6098 | 913 |
| 6099 | 914 |
| 6100 | 0 |
| 6101 | 0 |
| 6102 | 0 |
| 6103 | 0 |
| 6104 | 0 |
| 6105 | 0 |
| 6106 | 0 |
| 6107 | 0 |
| 6108 | 0 |
| 6109 | 0 |
| 6110 | 0 |
| 6111 | 0 |
| 6112 | 0 |
| 6113 | 0 |
| 6114 | 0 |
| 6115 | 0 |
| 6116 | 0 |
| 6117 | 0 |
| 6118 | 0 |
| 6119 | 0 |
| 6120 | 0 |
| 6121 | 0 |
| 6122 | 0 |
| 6123 | 0 |
| 6124 | 0 |
| 6125 | 0 |
| 6126 | 0 |
| 6127 | 0 |
| 6128 | 0 |
| 6129 | 0 |
| 6130 | 0 |
| 6131 | 0 |
| 6132 | 0 |
| 6133 | 0 |
| 6134 | 0 |
| 6135 | 0 |
| 6136 | 0 |
| 6137 | 0 |
| 6138 | 0 |
| 6139 | 0 |
| 6140 | 0 |
| 6141 | 0 |
| 6142 | 0 |
| 6143 | 0 |
| 6144 | 909 |
| 6145 | 910 |
| 6146 | 910 |
| 6147 | 910 |
| 6148 | 0 |
| 6149 | 0 |
| 6150 | 0 |
| 6151 | 0 |
| 6152 | 0 |
| 6153 | 0 |
| 6154 | 0 |
| 6155 | 0 |
| 6156 | 0 |
| 6157 | 0 |
| 6158 | 0 |
| 6159 | 0 |
| 6160 | 0 |
| 6161 | 0 |
| 6162 | 0 |
| 6163 | 0 |
| 6164 | 0 |
| 6165 | 0 |
| 6166 | 0 |
| 6167 | 0 |
| 6168 | 0 |
| 6169 | 0 |
| 6170 | 0 |
| 6171 | 0 |
| 6172 | 0 |
| 6173 | 0 |
| 6174 | 0 |
| 6175 | 0 |
| 6176 | 0 |
| 6177 | 0 |
| 6178 | 0 |
| 6179 | 0 |
| 6180 | 0 |
| 6181 | 0 |
| 6182 | 0 |
| 6183 | 0 |
| 6184 | 0 |
| 6185 | 0 |
| 6186 | 0 |
| 6187 | 0 |
| 6188 | 0 |
| 6189 | 0 |
| 6190 | 0 |
| 6191 | 0 |
| 6192 | 910 |
| 6193 | 914 |
| 6194 | 911 |
| 6195 | 910 |
| 6196 | 0 |
| 6197 | 0 |
| 6198 | 0 |
| 6199 | 0 |
| 6200 | 0 |
| 6201 | 0 |
| 6202 | 0 |
| 6203 | 0 |
| 6204 | 0 |
| 6205 | 0 |
| 6206 | 0 |
| 6207 | 0 |
| 6208 | 0 |
| 6209 | 0 |
| 6210 | 0 |
| 6211 | 0 |
| 6212 | 0 |
| 6213 | 0 |
| 6214 | 0 |
| 6215 | 0 |
| 6216 | 0 |
| 6217 | 0 |
| 6218 | 0 |
| 6219 | 0 |
| 6220 | 0 |
| 6221 | 0 |
| 6222 | 0 |
| 6223 | 0 |
| 6224 | 0 |
| 6225 | 0 |
| 6226 | 0 |
| 6227 | 0 |
| 6228 | 0 |
| 6229 | 0 |
| 6230 | 0 |
| 6231 | 0 |
| 6232 | 0 |
| 6233 | 0 |
| 6234 | 0 |
| 6235 | 0 |
| 6236 | 0 |
| 6237 | 0 |
| 6238 | 0 |
| 6239 | 0 |
| 6240 | 0 |
| 6241 | 910 |
| 6242 | 910 |
| 6243 | 909 |
| 6244 | 0 |
| 6245 | 0 |
| 6246 | 0 |
| 6247 | 0 |
| 6248 | 0 |
| 6249 | 0 |
| 6250 | 0 |
| 6251 | 0 |
| 6252 | 0 |
| 6253 | 0 |
| 6254 | 0 |
| 6255 | 0 |
| 6256 | 0 |
| 6257 | 0 |
| 6258 | 0 |
| 6259 | 0 |
| 6260 | 0 |
| 6261 | 0 |
| 6262 | 0 |
| 6263 | 0 |
| 6264 | 0 |
| 6265 | 0 |
| 6266 | 0 |
| 6267 | 0 |
| 6268 | 0 |
| 6269 | 0 |
| 6270 | 0 |
| 6271 | 0 |
| 6272 | 0 |
| 6273 | 0 |
| 6274 | 0 |
| 6275 | 0 |
| 6276 | 0 |
| 6277 | 0 |
| 6278 | 0 |
| 6279 | 0 |
| 6280 | 0 |
| 6281 | 0 |
| 6282 | 0 |
| 6283 | 0 |
| 6284 | 0 |
| 6285 | 0 |
| 6286 | 0 |
| 6287 | 0 |
| 6288 | 0 |
| 6289 | 911 |
| 6290 | 912 |
| 6291 | 910 |
| 6292 | 0 |
| 6293 | 0 |
| 6294 | 0 |
| 6295 | 0 |
| 6296 | 0 |
| 6297 | 0 |
| 6298 | 0 |
| 6299 | 0 |
| 6300 | 0 |
| 6301 | 0 |
| 6302 | 0 |
| 6303 | 0 |
| 6304 | 0 |
| 6305 | 0 |
| 6306 | 0 |
| 6307 | 0 |
| 6308 | 0 |
| 6309 | 0 |
| 6310 | 0 |
| 6311 | 0 |
| 6312 | 0 |
| 6313 | 0 |
| 6314 | 0 |
| 6315 | 0 |
| 6316 | 0 |
| 6317 | 0 |
| 6318 | 0 |
| 6319 | 0 |
| 6320 | 0 |
| 6321 | 0 |
| 6322 | 0 |
| 6323 | 0 |
| 6324 | 0 |
| 6325 | 0 |
| 6326 | 0 |
| 6327 | 0 |
| 6328 | 0 |
| 6329 | 0 |
| 6330 | 0 |
| 6331 | 0 |
| 6332 | 0 |
| 6333 | 0 |
| 6334 | 0 |
| 6335 | 0 |
| 6336 | 0 |
| 6337 | 913 |
| 6338 | 914 |
| 6339 | 912 |
| 6340 | 911 |
| 6341 | 0 |
| 6342 | 0 |
| 6343 | 0 |
| 6344 | 0 |
| 6345 | 0 |
| 6346 | 0 |
| 6347 | 0 |
| 6348 | 0 |
| 6349 | 0 |
| 6350 | 0 |
| 6351 | 0 |
| 6352 | 0 |
| 6353 | 0 |
| 6354 | 0 |
| 6355 | 0 |
| 6356 | 0 |
| 6357 | 0 |
| 6358 | 0 |
| 6359 | 0 |
| 6360 | 0 |
| 6361 | 0 |
| 6362 | 0 |
| 6363 | 0 |
| 6364 | 0 |
| 6365 | 0 |
| 6366 | 0 |
| 6367 | 0 |
| 6368 | 0 |
| 6369 | 0 |
| 6370 | 0 |
| 6371 | 0 |
| 6372 | 0 |
| 6373 | 0 |
| 6374 | 0 |
| 6375 | 0 |
| 6376 | 0 |
| 6377 | 0 |
| 6378 | 0 |
| 6379 | 0 |
| 6380 | 0 |
| 6381 | 0 |
| 6382 | 0 |
| 6383 | 0 |
| 6384 | 0 |
| 6385 | 910 |
| 6386 | 910 |
| 6387 | 909 |
| 6388 | 910 |
| 6389 | 0 |
| 6390 | 0 |
| 6391 | 0 |
| 6392 | 0 |
| 6393 | 0 |
| 6394 | 0 |
| 6395 | 0 |
| 6396 | 0 |
| 6397 | 0 |
| 6398 | 0 |
| 6399 | 0 |
| 6400 | 0 |
| 6401 | 0 |
| 6402 | 0 |
| 6403 | 0 |
| 6404 | 0 |
| 6405 | 0 |
| 6406 | 0 |
| 6407 | 0 |
| 6408 | 0 |
| 6409 | 0 |
| 6410 | 0 |
| 6411 | 0 |
| 6412 | 0 |
| 6413 | 0 |
| 6414 | 0 |
| 6415 | 0 |
| 6416 | 0 |
| 6417 | 0 |
| 6418 | 0 |
| 6419 | 0 |
| 6420 | 0 |
| 6421 | 0 |
| 6422 | 0 |
| 6423 | 0 |
| 6424 | 0 |
| 6425 | 0 |
| 6426 | 0 |
| 6427 | 0 |
| 6428 | 0 |
| 6429 | 0 |
| 6430 | 0 |
| 6431 | 0 |
| 6432 | 0 |
| 6433 | 914 |
| 6434 | 912 |
| 6435 | 910 |
| 6436 | 910 |
| 6437 | 0 |
| 6438 | 0 |
| 6439 | 0 |
| 6440 | 0 |
| 6441 | 0 |
| 6442 | 0 |
| 6443 | 0 |
| 6444 | 0 |
| 6445 | 0 |
| 6446 | 0 |
| 6447 | 0 |
| 6448 | 0 |
| 6449 | 0 |
| 6450 | 0 |
| 6451 | 0 |
| 6452 | 0 |
| 6453 | 0 |
| 6454 | 0 |
| 6455 | 0 |
| 6456 | 0 |
| 6457 | 0 |
| 6458 | 0 |
| 6459 | 0 |
| 6460 | 0 |
| 6461 | 0 |
| 6462 | 0 |
| 6463 | 0 |
| 6464 | 0 |
| 6465 | 0 |
| 6466 | 0 |
| 6467 | 0 |
| 6468 | 0 |
| 6469 | 0 |
| 6470 | 0 |
| 6471 | 0 |
| 6472 | 0 |
| 6473 | 0 |
| 6474 | 0 |
| 6475 | 0 |
| 6476 | 0 |
| 6477 | 0 |
| 6478 | 0 |
| 6479 | 0 |
| 6480 | 0 |
| 6481 | 912 |
| 6482 | 913 |
| 6483 | 912 |
| 6484 | 912 |
| 6485 | 0 |
| 6486 | 0 |
| 6487 | 0 |
| 6488 | 0 |
| 6489 | 0 |
| 6490 | 0 |
| 6491 | 0 |
| 6492 | 0 |
| 6493 | 0 |
| 6494 | 0 |
| 6495 | 0 |
| 6496 | 0 |
| 6497 | 0 |
| 6498 | 0 |
| 6499 | 0 |
| 6500 | 0 |
| 6501 | 0 |
| 6502 | 0 |
| 6503 | 0 |
| 6504 | 0 |
| 6505 | 0 |
| 6506 | 0 |
| 6507 | 0 |
| 6508 | 0 |
| 6509 | 0 |
| 6510 | 0 |
| 6511 | 0 |
| 6512 | 0 |
| 6513 | 0 |
| 6514 | 0 |
| 6515 | 0 |
| 6516 | 0 |
| 6517 | 0 |
| 6518 | 0 |
| 6519 | 0 |
| 6520 | 0 |
| 6521 | 0 |
| 6522 | 0 |
| 6523 | 0 |
| 6524 | 0 |
| 6525 | 0 |
| 6526 | 0 |
| 6527 | 0 |
| 6528 | 0 |
| 6529 | 912 |
| 6530 | 910 |
| 6531 | 910 |
| 6532 | 910 |
| 6533 | 0 |
| 6534 | 0 |
| 6535 | 0 |
| 6536 | 0 |
| 6537 | 0 |
| 6538 | 0 |
| 6539 | 0 |
| 6540 | 0 |
| 6541 | 0 |
| 6542 | 0 |
| 6543 | 0 |
| 6544 | 0 |
| 6545 | 0 |
| 6546 | 0 |
| 6547 | 0 |
| 6548 | 0 |
| 6549 | 0 |
| 6550 | 0 |
| 6551 | 0 |
| 6552 | 0 |
| 6553 | 0 |
| 6554 | 0 |
| 6555 | 0 |
| 6556 | 0 |
| 6557 | 0 |
| 6558 | 0 |
| 6559 | 0 |
| 6560 | 0 |
| 6561 | 0 |
| 6562 | 0 |
| 6563 | 0 |
| 6564 | 0 |
| 6565 | 0 |
| 6566 | 0 |
| 6567 | 0 |
| 6568 | 0 |
| 6569 | 0 |
| 6570 | 0 |
| 6571 | 0 |
| 6572 | 0 |
| 6573 | 0 |
| 6574 | 0 |
| 6575 | 0 |
| 6576 | 0 |
| 6577 | 0 |
| 6578 | 911 |
| 6579 | 911 |
| 6580 | 912 |
| 6581 | 0 |
| 6582 | 0 |
| 6583 | 0 |
| 6584 | 0 |
| 6585 | 0 |
| 6586 | 0 |
| 6587 | 0 |
| 6588 | 0 |
| 6589 | 0 |
| 6590 | 0 |
| 6591 | 0 |
| 6592 | 0 |
| 6593 | 0 |
| 6594 | 0 |
| 6595 | 0 |
| 6596 | 0 |
| 6597 | 0 |
| 6598 | 0 |
| 6599 | 0 |
| 6600 | 0 |
| 6601 | 0 |
| 6602 | 0 |
| 6603 | 0 |
| 6604 | 0 |
| 6605 | 0 |
| 6606 | 0 |
| 6607 | 0 |
| 6608 | 0 |
| 6609 | 0 |
| 6610 | 0 |
| 6611 | 0 |
| 6612 | 0 |
| 6613 | 0 |
| 6614 | 0 |
| 6615 | 0 |
| 6616 | 0 |
| 6617 | 0 |
| 6618 | 0 |
| 6619 | 0 |
| 6620 | 0 |
| 6621 | 0 |
| 6622 | 0 |
| 6623 | 0 |
| 6624 | 0 |
| 6625 | 0 |
| 6626 | 911 |
| 6627 | 912 |
| 6628 | 911 |
| 6629 | 0 |
| 6630 | 0 |
| 6631 | 0 |
| 6632 | 0 |
| 6633 | 0 |
| 6634 | 0 |
| 6635 | 0 |
| 6636 | 0 |
| 6637 | 0 |
| 6638 | 0 |
| 6639 | 0 |
| 6640 | 0 |
| 6641 | 0 |
| 6642 | 0 |
| 6643 | 0 |
| 6644 | 0 |
| 6645 | 0 |
| 6646 | 0 |
| 6647 | 0 |
| 6648 | 0 |
| 6649 | 0 |
| 6650 | 0 |
| 6651 | 0 |
| 6652 | 0 |
| 6653 | 0 |
| 6654 | 0 |
| 6655 | 0 |
| 6656 | 0 |
| 6657 | 0 |
| 6658 | 0 |
| 6659 | 0 |
| 6660 | 0 |
| 6661 | 0 |
| 6662 | 0 |
| 6663 | 0 |
| 6664 | 0 |
| 6665 | 0 |
| 6666 | 0 |
| 6667 | 0 |
| 6668 | 0 |
| 6669 | 0 |
| 6670 | 0 |
| 6671 | 0 |
| 6672 | 0 |
| 6673 | 0 |
| 6674 | 915 |
| 6675 | 913 |
| 6676 | 912 |
| 6677 | 913 |
| 6678 | 0 |
| 6679 | 0 |
| 6680 | 0 |
| 6681 | 0 |
| 6682 | 0 |
| 6683 | 0 |
| 6684 | 0 |
| 6685 | 0 |
| 6686 | 0 |
| 6687 | 0 |
| 6688 | 0 |
| 6689 | 0 |
| 6690 | 0 |
| 6691 | 0 |
| 6692 | 0 |
| 6693 | 0 |
| 6694 | 0 |
| 6695 | 0 |
| 6696 | 0 |
| 6697 | 0 |
| 6698 | 0 |
| 6699 | 0 |
| 6700 | 0 |
| 6701 | 0 |
| 6702 | 0 |
| 6703 | 0 |
| 6704 | 0 |
| 6705 | 0 |
| 6706 | 0 |
| 6707 | 0 |
| 6708 | 0 |
| 6709 | 0 |
| 6710 | 0 |
| 6711 | 0 |
| 6712 | 0 |
| 6713 | 0 |
| 6714 | 0 |
| 6715 | 0 |
| 6716 | 0 |
| 6717 | 0 |
| 6718 | 0 |
| 6719 | 0 |
| 6720 | 0 |
| 6721 | 0 |
| 6722 | 910 |
| 6723 | 910 |
| 6724 | 909 |
| 6725 | 909 |
| 6726 | 0 |
| 6727 | 0 |
| 6728 | 0 |
| 6729 | 0 |
| 6730 | 0 |
| 6731 | 0 |
| 6732 | 0 |
| 6733 | 0 |
| 6734 | 0 |
| 6735 | 0 |
| 6736 | 0 |
| 6737 | 0 |
| 6738 | 0 |
| 6739 | 0 |
| 6740 | 0 |
| 6741 | 0 |
| 6742 | 0 |
| 6743 | 0 |
| 6744 | 0 |
| 6745 | 0 |
| 6746 | 0 |
| 6747 | 0 |
| 6748 | 0 |
| 6749 | 0 |
| 6750 | 0 |
| 6751 | 0 |
| 6752 | 0 |
| 6753 | 0 |
| 6754 | 0 |
| 6755 | 0 |
| 6756 | 0 |
| 6757 | 0 |
| 6758 | 0 |
| 6759 | 0 |
| 6760 | 0 |
| 6761 | 0 |
| 6762 | 0 |
| 6763 | 0 |
| 6764 | 0 |
| 6765 | 0 |
| 6766 | 0 |
| 6767 | 0 |
| 6768 | 0 |
| 6769 | 0 |
| 6770 | 910 |
| 6771 | 913 |
| 6772 | 912 |
| 6773 | 913 |
| 6774 | 0 |
| 6775 | 0 |
| 6776 | 0 |
| 6777 | 0 |
| 6778 | 0 |
| 6779 | 0 |
| 6780 | 0 |
| 6781 | 0 |
| 6782 | 0 |
| 6783 | 0 |
| 6784 | 0 |
| 6785 | 0 |
| 6786 | 0 |
| 6787 | 0 |
| 6788 | 0 |
| 6789 | 0 |
| 6790 | 0 |
| 6791 | 0 |
| 6792 | 0 |
| 6793 | 0 |
| 6794 | 0 |
| 6795 | 0 |
| 6796 | 0 |
| 6797 | 0 |
| 6798 | 0 |
| 6799 | 0 |
| 6800 | 0 |
| 6801 | 0 |
| 6802 | 0 |
| 6803 | 0 |
| 6804 | 0 |
| 6805 | 0 |
| 6806 | 0 |
| 6807 | 0 |
| 6808 | 0 |
| 6809 | 0 |
| 6810 | 0 |
| 6811 | 0 |
| 6812 | 0 |
| 6813 | 0 |
| 6814 | 0 |
| 6815 | 0 |
| 6816 | 0 |
| 6817 | 0 |
| 6818 | 0 |
| 6819 | 914 |
| 6820 | 913 |
| 6821 | 913 |
| 6822 | 0 |
| 6823 | 0 |
| 6824 | 0 |
| 6825 | 0 |
| 6826 | 0 |
| 6827 | 0 |
| 6828 | 0 |
| 6829 | 0 |
| 6830 | 0 |
| 6831 | 0 |
| 6832 | 0 |
| 6833 | 0 |
| 6834 | 0 |
| 6835 | 0 |
| 6836 | 0 |
| 6837 | 0 |
| 6838 | 0 |
| 6839 | 0 |
| 6840 | 0 |
| 6841 | 0 |
| 6842 | 0 |
| 6843 | 0 |
| 6844 | 0 |
| 6845 | 0 |
| 6846 | 0 |
| 6847 | 0 |
| 6848 | 0 |
| 6849 | 0 |
| 6850 | 0 |
| 6851 | 0 |
| 6852 | 0 |
| 6853 | 0 |
| 6854 | 0 |
| 6855 | 0 |
| 6856 | 0 |
| 6857 | 0 |
| 6858 | 0 |
| 6859 | 0 |
| 6860 | 0 |
| 6861 | 0 |
| 6862 | 0 |
| 6863 | 0 |
| 6864 | 0 |
| 6865 | 0 |
| 6866 | 0 |
| 6867 | 913 |
| 6868 | 913 |
| 6869 | 912 |
| 6870 | 0 |
| 6871 | 0 |
| 6872 | 0 |
| 6873 | 0 |
| 6874 | 0 |
| 6875 | 0 |
| 6876 | 0 |
| 6877 | 0 |
| 6878 | 0 |
| 6879 | 0 |
| 6880 | 0 |
| 6881 | 0 |
| 6882 | 0 |
| 6883 | 0 |
| 6884 | 0 |
| 6885 | 0 |
| 6886 | 0 |
| 6887 | 0 |
| 6888 | 0 |
| 6889 | 0 |
| 6890 | 0 |
| 6891 | 0 |
| 6892 | 0 |
| 6893 | 0 |
| 6894 | 0 |
| 6895 | 0 |
| 6896 | 0 |
| 6897 | 0 |
| 6898 | 0 |
| 6899 | 0 |
| 6900 | 0 |
| 6901 | 0 |
| 6902 | 0 |
| 6903 | 0 |
| 6904 | 0 |
| 6905 | 0 |
| 6906 | 0 |
| 6907 | 0 |
| 6908 | 0 |
| 6909 | 0 |
| 6910 | 0 |
| 6911 | 0 |
| 6912 | 0 |
| 6913 | 0 |
| 6914 | 0 |
| 6915 | 912 |
| 6916 | 913 |
| 6917 | 912 |
| 6918 | 912 |
| 6919 | 0 |
| 6920 | 0 |
| 6921 | 0 |
| 6922 | 0 |
| 6923 | 0 |
| 6924 | 0 |
| 6925 | 0 |
| 6926 | 0 |
| 6927 | 0 |
| 6928 | 0 |
| 6929 | 0 |
| 6930 | 0 |
| 6931 | 0 |
| 6932 | 0 |
| 6933 | 0 |
| 6934 | 0 |
| 6935 | 0 |
| 6936 | 0 |
| 6937 | 0 |
| 6938 | 0 |
| 6939 | 0 |
| 6940 | 0 |
| 6941 | 0 |
| 6942 | 0 |
| 6943 | 0 |
| 6944 | 0 |
| 6945 | 0 |
| 6946 | 0 |
| 6947 | 0 |
| 6948 | 0 |
| 6949 | 0 |
| 6950 | 0 |
| 6951 | 0 |
| 6952 | 0 |
| 6953 | 0 |
| 6954 | 0 |
| 6955 | 0 |
| 6956 | 0 |
| 6957 | 0 |
| 6958 | 0 |
| 6959 | 0 |
| 6960 | 0 |
| 6961 | 0 |
| 6962 | 0 |
| 6963 | 911 |
| 6964 | 911 |
| 6965 | 910 |
| 6966 | 910 |
| 6967 | 0 |
| 6968 | 0 |
| 6969 | 0 |
| 6970 | 0 |
| 6971 | 0 |
| 6972 | 0 |
| 6973 | 0 |
| 6974 | 0 |
| 6975 | 0 |
| 6976 | 0 |
| 6977 | 0 |
| 6978 | 0 |
| 6979 | 0 |
| 6980 | 0 |
| 6981 | 0 |
| 6982 | 0 |
| 6983 | 0 |
| 6984 | 0 |
| 6985 | 0 |
| 6986 | 0 |
| 6987 | 0 |
| 6988 | 0 |
| 6989 | 0 |
| 6990 | 0 |
| 6991 | 0 |
| 6992 | 0 |
| 6993 | 0 |
| 6994 | 0 |
| 6995 | 0 |
| 6996 | 0 |
| 6997 | 0 |
| 6998 | 0 |
| 6999 | 0 |
| 7000 | 0 |
| 7001 | 0 |
| 7002 | 0 |
| 7003 | 0 |
| 7004 | 0 |
| 7005 | 0 |
| 7006 | 0 |
| 7007 | 0 |
| 7008 | 0 |
| 7009 | 0 |
| 7010 | 0 |
| 7011 | 684 |
| 7012 | 913 |
| 7013 | 912 |
| 7014 | 911 |
| 7015 | 0 |
| 7016 | 0 |
| 7017 | 0 |
| 7018 | 0 |
| 7019 | 0 |
| 7020 | 0 |
| 7021 | 0 |
| 7022 | 0 |
| 7023 | 0 |
| 7024 | 0 |
| 7025 | 0 |
| 7026 | 0 |
| 7027 | 0 |
| 7028 | 0 |
| 7029 | 0 |
| 7030 | 0 |
| 7031 | 0 |
| 7032 | 0 |
| 7033 | 0 |
| 7034 | 0 |
| 7035 | 0 |
| 7036 | 0 |
| 7037 | 0 |
| 7038 | 0 |
| 7039 | 0 |
| 7040 | 0 |
| 7041 | 0 |
| 7042 | 0 |
| 7043 | 0 |
| 7044 | 0 |
| 7045 | 0 |
| 7046 | 0 |
| 7047 | 0 |
| 7048 | 0 |
| 7049 | 0 |
| 7050 | 0 |
| 7051 | 0 |
| 7052 | 0 |
| 7053 | 0 |
| 7054 | 0 |
| 7055 | 0 |
| 7056 | 0 |
| 7057 | 0 |
| 7058 | 0 |
| 7059 | 846 |
| 7060 | 911 |
| 7061 | 910 |
| 7062 | 911 |
| 7063 | 0 |
| 7064 | 0 |
| 7065 | 0 |
| 7066 | 0 |
| 7067 | 0 |
| 7068 | 0 |
| 7069 | 0 |
| 7070 | 0 |
| 7071 | 0 |
| 7072 | 0 |
| 7073 | 0 |
| 7074 | 0 |
| 7075 | 0 |
| 7076 | 0 |
| 7077 | 0 |
| 7078 | 0 |
| 7079 | 0 |
| 7080 | 0 |
| 7081 | 0 |
| 7082 | 0 |
| 7083 | 0 |
| 7084 | 0 |
| 7085 | 0 |
| 7086 | 0 |
| 7087 | 0 |
| 7088 | 0 |
| 7089 | 0 |
| 7090 | 0 |
| 7091 | 0 |
| 7092 | 0 |
| 7093 | 0 |
| 7094 | 0 |
| 7095 | 0 |
| 7096 | 0 |
| 7097 | 0 |
| 7098 | 0 |
| 7099 | 0 |
| 7100 | 0 |
| 7101 | 0 |
| 7102 | 0 |
| 7103 | 0 |
| 7104 | 0 |
| 7105 | 0 |
| 7106 | 0 |
| 7107 | 0 |
| 7108 | 911 |
| 7109 | 912 |
| 7110 | 912 |
| 7111 | 0 |
| 7112 | 0 |
| 7113 | 0 |
| 7114 | 0 |
| 7115 | 0 |
| 7116 | 0 |
| 7117 | 0 |
| 7118 | 0 |
| 7119 | 0 |
| 7120 | 0 |
| 7121 | 0 |
| 7122 | 0 |
| 7123 | 0 |
| 7124 | 0 |
| 7125 | 0 |
| 7126 | 0 |
| 7127 | 0 |
| 7128 | 0 |
| 7129 | 0 |
| 7130 | 0 |
| 7131 | 0 |
| 7132 | 0 |
| 7133 | 0 |
| 7134 | 0 |
| 7135 | 0 |
| 7136 | 0 |
| 7137 | 0 |
| 7138 | 0 |
| 7139 | 0 |
| 7140 | 0 |
| 7141 | 0 |
| 7142 | 0 |
| 7143 | 0 |
| 7144 | 0 |
| 7145 | 0 |
| 7146 | 0 |
| 7147 | 0 |
| 7148 | 0 |
| 7149 | 0 |
| 7150 | 0 |
| 7151 | 0 |
| 7152 | 0 |
| 7153 | 0 |
| 7154 | 0 |
| 7155 | 0 |
| 7156 | 911 |
| 7157 | 912 |
| 7158 | 912 |
| 7159 | 0 |
| 7160 | 0 |
| 7161 | 0 |
| 7162 | 0 |
| 7163 | 0 |
| 7164 | 0 |
| 7165 | 0 |
| 7166 | 0 |
| 7167 | 0 |
| 7168 | 0 |
| 7169 | 0 |
| 7170 | 0 |
| 7171 | 0 |
| 7172 | 0 |
| 7173 | 0 |
| 7174 | 0 |
| 7175 | 0 |
| 7176 | 0 |
| 7177 | 0 |
| 7178 | 0 |
| 7179 | 0 |
| 7180 | 0 |
| 7181 | 0 |
| 7182 | 0 |
| 7183 | 0 |
| 7184 | 0 |
| 7185 | 0 |
| 7186 | 0 |
| 7187 | 0 |
| 7188 | 0 |
| 7189 | 0 |
| 7190 | 0 |
| 7191 | 0 |
| 7192 | 0 |
| 7193 | 0 |
| 7194 | 0 |
| 7195 | 0 |
| 7196 | 0 |
| 7197 | 0 |
| 7198 | 0 |
| 7199 | 0 |
| 7200 | 0 |
| 7201 | 0 |
| 7202 | 0 |
| 7203 | 0 |
| 7204 | 912 |
| 7205 | 913 |
| 7206 | 911 |
| 7207 | 912 |
| 7208 | 0 |
| 7209 | 0 |
| 7210 | 0 |
| 7211 | 0 |
| 7212 | 0 |
| 7213 | 0 |
| 7214 | 0 |
| 7215 | 0 |
| 7216 | 0 |
| 7217 | 0 |
| 7218 | 0 |
| 7219 | 0 |
| 7220 | 0 |
| 7221 | 0 |
| 7222 | 0 |
| 7223 | 0 |
| 7224 | 0 |
| 7225 | 0 |
| 7226 | 0 |
| 7227 | 0 |
| 7228 | 0 |
| 7229 | 0 |
| 7230 | 0 |
| 7231 | 0 |
| 7232 | 0 |
| 7233 | 0 |
| 7234 | 0 |
| 7235 | 0 |
| 7236 | 0 |
| 7237 | 0 |
| 7238 | 0 |
| 7239 | 0 |
| 7240 | 0 |
| 7241 | 0 |
| 7242 | 0 |
| 7243 | 0 |
| 7244 | 0 |
| 7245 | 0 |
| 7246 | 0 |
| 7247 | 0 |
| 7248 | 0 |
| 7249 | 0 |
| 7250 | 0 |
| 7251 | 0 |
| 7252 | 0 |
| 7253 | 913 |
| 7254 | 913 |
| 7255 | 913 |
| 7256 | 0 |
| 7257 | 0 |
| 7258 | 0 |
| 7259 | 0 |
| 7260 | 0 |
| 7261 | 0 |
| 7262 | 0 |
| 7263 | 0 |
| 7264 | 0 |
| 7265 | 0 |
| 7266 | 0 |
| 7267 | 0 |
| 7268 | 0 |
| 7269 | 0 |
| 7270 | 0 |
| 7271 | 0 |
| 7272 | 0 |
| 7273 | 0 |
| 7274 | 0 |
| 7275 | 0 |
| 7276 | 0 |
| 7277 | 0 |
| 7278 | 0 |
| 7279 | 0 |
| 7280 | 0 |
| 7281 | 0 |
| 7282 | 0 |
| 7283 | 0 |
| 7284 | 0 |
| 7285 | 0 |
| 7286 | 0 |
| 7287 | 0 |
| 7288 | 0 |
| 7289 | 0 |
| 7290 | 0 |
| 7291 | 0 |
| 7292 | 0 |
| 7293 | 0 |
| 7294 | 0 |
| 7295 | 0 |
| 7296 | 0 |
| 7297 | 0 |
| 7298 | 0 |
| 7299 | 0 |
| 7300 | 0 |
| 7301 | 912 |
| 7302 | 911 |
| 7303 | 911 |
| 7304 | 0 |
| 7305 | 0 |
| 7306 | 0 |
| 7307 | 0 |
| 7308 | 0 |
| 7309 | 0 |
| 7310 | 0 |
| 7311 | 0 |
| 7312 | 0 |
| 7313 | 0 |
| 7314 | 0 |
| 7315 | 0 |
| 7316 | 0 |
| 7317 | 0 |
| 7318 | 0 |
| 7319 | 0 |
| 7320 | 0 |
| 7321 | 0 |
| 7322 | 0 |
| 7323 | 0 |
| 7324 | 0 |
| 7325 | 0 |
| 7326 | 0 |
| 7327 | 0 |
| 7328 | 0 |
| 7329 | 0 |
| 7330 | 0 |
| 7331 | 0 |
| 7332 | 0 |
| 7333 | 0 |
| 7334 | 0 |
| 7335 | 0 |
| 7336 | 0 |
| 7337 | 0 |
| 7338 | 0 |
| 7339 | 0 |
| 7340 | 0 |
| 7341 | 0 |
| 7342 | 0 |
| 7343 | 0 |
| 7344 | 0 |
| 7345 | 0 |
| 7346 | 0 |
| 7347 | 0 |
| 7348 | 0 |
| 7349 | 910 |
| 7350 | 909 |
| 7351 | 908 |
| 7352 | 0 |
| 7353 | 0 |
| 7354 | 0 |
| 7355 | 0 |
| 7356 | 0 |
| 7357 | 0 |
| 7358 | 0 |
| 7359 | 0 |
| 7360 | 0 |
| 7361 | 0 |
| 7362 | 0 |
| 7363 | 0 |
| 7364 | 0 |
| 7365 | 0 |
| 7366 | 0 |
| 7367 | 0 |
| 7368 | 0 |
| 7369 | 0 |
| 7370 | 0 |
| 7371 | 0 |
| 7372 | 0 |
| 7373 | 0 |
| 7374 | 0 |
| 7375 | 0 |
| 7376 | 0 |
| 7377 | 0 |
| 7378 | 0 |
| 7379 | 0 |
| 7380 | 0 |
| 7381 | 0 |
| 7382 | 0 |
| 7383 | 0 |
| 7384 | 0 |
| 7385 | 0 |
| 7386 | 0 |
| 7387 | 0 |
| 7388 | 0 |
| 7389 | 0 |
| 7390 | 0 |
| 7391 | 0 |
| 7392 | 0 |
| 7393 | 0 |
| 7394 | 0 |
| 7395 | 0 |
| 7396 | 0 |
| 7397 | 910 |
| 7398 | 910 |
| 7399 | 909 |
| 7400 | 909 |
| 7401 | 0 |
| 7402 | 0 |
| 7403 | 0 |
| 7404 | 0 |
| 7405 | 0 |
| 7406 | 0 |
| 7407 | 0 |
| 7408 | 0 |
| 7409 | 0 |
| 7410 | 0 |
| 7411 | 0 |
| 7412 | 0 |
| 7413 | 0 |
| 7414 | 0 |
| 7415 | 0 |
| 7416 | 0 |
| 7417 | 0 |
| 7418 | 0 |
| 7419 | 0 |
| 7420 | 0 |
| 7421 | 0 |
| 7422 | 0 |
| 7423 | 0 |
| 7424 | 0 |
| 7425 | 0 |
| 7426 | 0 |
| 7427 | 0 |
| 7428 | 0 |
| 7429 | 0 |
| 7430 | 0 |
| 7431 | 0 |
| 7432 | 0 |
| 7433 | 0 |
| 7434 | 0 |
| 7435 | 0 |
| 7436 | 0 |
| 7437 | 0 |
| 7438 | 0 |
| 7439 | 0 |
| 7440 | 0 |
| 7441 | 0 |
| 7442 | 0 |
| 7443 | 0 |
| 7444 | 0 |
| 7445 | 913 |
| 7446 | 913 |
| 7447 | 910 |
| 7448 | 909 |
| 7449 | 0 |
| 7450 | 0 |
| 7451 | 0 |
| 7452 | 0 |
| 7453 | 0 |
| 7454 | 0 |
| 7455 | 0 |
| 7456 | 0 |
| 7457 | 0 |
| 7458 | 0 |
| 7459 | 0 |
| 7460 | 0 |
| 7461 | 0 |
| 7462 | 0 |
| 7463 | 0 |
| 7464 | 0 |
| 7465 | 0 |
| 7466 | 0 |
| 7467 | 0 |
| 7468 | 0 |
| 7469 | 0 |
| 7470 | 0 |
| 7471 | 0 |
| 7472 | 0 |
| 7473 | 0 |
| 7474 | 0 |
| 7475 | 0 |
| 7476 | 0 |
| 7477 | 0 |
| 7478 | 0 |
| 7479 | 0 |
| 7480 | 0 |
| 7481 | 0 |
| 7482 | 0 |
| 7483 | 0 |
| 7484 | 0 |
| 7485 | 0 |
| 7486 | 0 |
| 7487 | 0 |
| 7488 | 0 |
| 7489 | 0 |
| 7490 | 0 |
| 7491 | 0 |
| 7492 | 0 |
| 7493 | 912 |
| 7494 | 913 |
| 7495 | 912 |
| 7496 | 912 |
| 7497 | 0 |
| 7498 | 0 |
| 7499 | 0 |
| 7500 | 0 |
| 7501 | 0 |
| 7502 | 0 |
| 7503 | 0 |
| 7504 | 0 |
| 7505 | 0 |
| 7506 | 0 |
| 7507 | 0 |
| 7508 | 0 |
| 7509 | 0 |
| 7510 | 0 |
| 7511 | 0 |
| 7512 | 0 |
| 7513 | 0 |
| 7514 | 0 |
| 7515 | 0 |
| 7516 | 0 |
| 7517 | 0 |
| 7518 | 0 |
| 7519 | 0 |
| 7520 | 0 |
| 7521 | 0 |
| 7522 | 0 |
| 7523 | 0 |
| 7524 | 0 |
| 7525 | 0 |
| 7526 | 0 |
| 7527 | 0 |
| 7528 | 0 |
| 7529 | 0 |
| 7530 | 0 |
| 7531 | 0 |
| 7532 | 0 |
| 7533 | 0 |
| 7534 | 0 |
| 7535 | 0 |
| 7536 | 0 |
| 7537 | 0 |
| 7538 | 0 |
| 7539 | 0 |
| 7540 | 0 |
| 7541 | 0 |
| 7542 | 912 |
| 7543 | 913 |
| 7544 | 913 |
| 7545 | 0 |
| 7546 | 0 |
| 7547 | 0 |
| 7548 | 0 |
| 7549 | 0 |
| 7550 | 0 |
| 7551 | 0 |
| 7552 | 0 |
| 7553 | 0 |
| 7554 | 0 |
| 7555 | 0 |
| 7556 | 0 |
| 7557 | 0 |
| 7558 | 0 |
| 7559 | 0 |
| 7560 | 0 |
| 7561 | 0 |
| 7562 | 0 |
| 7563 | 0 |
| 7564 | 0 |
| 7565 | 0 |
| 7566 | 0 |
| 7567 | 0 |
| 7568 | 0 |
| 7569 | 0 |
| 7570 | 0 |
| 7571 | 0 |
| 7572 | 0 |
| 7573 | 0 |
| 7574 | 0 |
| 7575 | 0 |
| 7576 | 0 |
| 7577 | 0 |
| 7578 | 0 |
| 7579 | 0 |
| 7580 | 0 |
| 7581 | 0 |
| 7582 | 0 |
| 7583 | 0 |
| 7584 | 0 |
| 7585 | 0 |
| 7586 | 0 |
| 7587 | 0 |
| 7588 | 0 |
| 7589 | 0 |
| 7590 | 913 |
| 7591 | 914 |
| 7592 | 913 |
| 7593 | 0 |
| 7594 | 0 |
| 7595 | 0 |
| 7596 | 0 |
| 7597 | 0 |
| 7598 | 0 |
| 7599 | 0 |
| 7600 | 0 |
| 7601 | 0 |
| 7602 | 0 |
| 7603 | 0 |
| 7604 | 0 |
| 7605 | 0 |
| 7606 | 0 |
| 7607 | 0 |
| 7608 | 0 |
| 7609 | 0 |
| 7610 | 0 |
| 7611 | 0 |
| 7612 | 0 |
| 7613 | 0 |
| 7614 | 0 |
| 7615 | 0 |
| 7616 | 0 |
| 7617 | 0 |
| 7618 | 0 |
| 7619 | 0 |
| 7620 | 0 |
| 7621 | 0 |
| 7622 | 0 |
| 7623 | 0 |
| 7624 | 0 |
| 7625 | 0 |
| 7626 | 0 |
| 7627 | 0 |
| 7628 | 0 |
| 7629 | 0 |
| 7630 | 0 |
| 7631 | 0 |
| 7632 | 0 |
| 7633 | 0 |
| 7634 | 0 |
| 7635 | 0 |
| 7636 | 0 |
| 7637 | 0 |
| 7638 | 914 |
| 7639 | 913 |
| 7640 | 911 |
| 7641 | 910 |
| 7642 | 0 |
| 7643 | 0 |
| 7644 | 0 |
| 7645 | 0 |
| 7646 | 0 |
| 7647 | 0 |
| 7648 | 0 |
| 7649 | 0 |
| 7650 | 0 |
| 7651 | 0 |
| 7652 | 0 |
| 7653 | 0 |
| 7654 | 0 |
| 7655 | 0 |
| 7656 | 0 |
| 7657 | 0 |
| 7658 | 0 |
| 7659 | 0 |
| 7660 | 0 |
| 7661 | 0 |
| 7662 | 0 |
| 7663 | 0 |
| 7664 | 0 |
| 7665 | 0 |
| 7666 | 0 |
| 7667 | 0 |
| 7668 | 0 |
| 7669 | 0 |
| 7670 | 0 |
| 7671 | 0 |
| 7672 | 0 |
| 7673 | 0 |
| 7674 | 0 |
| 7675 | 0 |
| 7676 | 0 |
| 7677 | 0 |
| 7678 | 0 |
| 7679 | 0 |
| 7680 | 0 |
| 7681 | 0 |
| 7682 | 0 |
| 7683 | 0 |
| 7684 | 0 |
| 7685 | 0 |
| 7686 | 913 |
| 7687 | 914 |
| 7688 | 912 |
| 7689 | 912 |
| 7690 | 0 |
| 7691 | 0 |
| 7692 | 0 |
| 7693 | 0 |
| 7694 | 0 |
| 7695 | 0 |
| 7696 | 0 |
| 7697 | 0 |
| 7698 | 0 |
| 7699 | 0 |
| 7700 | 0 |
| 7701 | 0 |
| 7702 | 0 |
| 7703 | 0 |
| 7704 | 0 |
| 7705 | 0 |
| 7706 | 0 |
| 7707 | 0 |
| 7708 | 0 |
| 7709 | 0 |
| 7710 | 0 |
| 7711 | 0 |
| 7712 | 0 |
| 7713 | 0 |
| 7714 | 0 |
| 7715 | 0 |
| 7716 | 0 |
| 7717 | 0 |
| 7718 | 0 |
| 7719 | 0 |
| 7720 | 0 |
| 7721 | 0 |
| 7722 | 0 |
| 7723 | 0 |
| 7724 | 0 |
| 7725 | 0 |
| 7726 | 0 |
| 7727 | 0 |
| 7728 | 0 |
| 7729 | 0 |
| 7730 | 0 |
| 7731 | 0 |
| 7732 | 0 |
| 7733 | 0 |
| 7734 | 0 |
| 7735 | 911 |
| 7736 | 911 |
| 7737 | 910 |
| 7738 | 0 |
| 7739 | 0 |
| 7740 | 0 |
| 7741 | 0 |
| 7742 | 0 |
| 7743 | 0 |
| 7744 | 0 |
| 7745 | 0 |
| 7746 | 0 |
| 7747 | 0 |
| 7748 | 0 |
| 7749 | 0 |
| 7750 | 0 |
| 7751 | 0 |
| 7752 | 0 |
| 7753 | 0 |
| 7754 | 0 |
| 7755 | 0 |
| 7756 | 0 |
| 7757 | 0 |
| 7758 | 0 |
| 7759 | 0 |
| 7760 | 0 |
| 7761 | 0 |
| 7762 | 0 |
| 7763 | 0 |
| 7764 | 0 |
| 7765 | 0 |
| 7766 | 0 |
| 7767 | 0 |
| 7768 | 0 |
| 7769 | 0 |
| 7770 | 0 |
| 7771 | 0 |
| 7772 | 0 |
| 7773 | 0 |
| 7774 | 0 |
| 7775 | 0 |
| 7776 | 0 |
| 7777 | 0 |
| 7778 | 0 |
| 7779 | 0 |
| 7780 | 0 |
| 7781 | 0 |
| 7782 | 0 |
| 7783 | 912 |
| 7784 | 912 |
| 7785 | 913 |
| 7786 | 0 |
| 7787 | 0 |
| 7788 | 0 |
| 7789 | 0 |
| 7790 | 0 |
| 7791 | 0 |
| 7792 | 0 |
| 7793 | 0 |
| 7794 | 0 |
| 7795 | 0 |
| 7796 | 0 |
| 7797 | 0 |
| 7798 | 0 |
| 7799 | 0 |
| 7800 | 0 |
| 7801 | 0 |
| 7802 | 0 |
| 7803 | 0 |
| 7804 | 0 |
| 7805 | 0 |
| 7806 | 0 |
| 7807 | 0 |
| 7808 | 0 |
| 7809 | 0 |
| 7810 | 0 |
| 7811 | 0 |
| 7812 | 0 |
| 7813 | 0 |
| 7814 | 0 |
| 7815 | 0 |
| 7816 | 0 |
| 7817 | 0 |
| 7818 | 0 |
| 7819 | 0 |
| 7820 | 0 |
| 7821 | 0 |
| 7822 | 0 |
| 7823 | 0 |
| 7824 | 0 |
| 7825 | 0 |
| 7826 | 0 |
| 7827 | 0 |
| 7828 | 0 |
| 7829 | 0 |
| 7830 | 0 |
| 7831 | 911 |
| 7832 | 912 |
| 7833 | 910 |
| 7834 | 0 |
| 7835 | 0 |
| 7836 | 0 |
| 7837 | 0 |
| 7838 | 0 |
| 7839 | 0 |
| 7840 | 0 |
| 7841 | 0 |
| 7842 | 0 |
| 7843 | 0 |
| 7844 | 0 |
| 7845 | 0 |
| 7846 | 0 |
| 7847 | 0 |
| 7848 | 0 |
| 7849 | 0 |
| 7850 | 0 |
| 7851 | 0 |
| 7852 | 0 |
| 7853 | 0 |
| 7854 | 0 |
| 7855 | 0 |
| 7856 | 0 |
| 7857 | 0 |
| 7858 | 0 |
| 7859 | 0 |
| 7860 | 0 |
| 7861 | 0 |
| 7862 | 0 |
| 7863 | 0 |
| 7864 | 0 |
| 7865 | 0 |
| 7866 | 0 |
| 7867 | 0 |
| 7868 | 0 |
| 7869 | 0 |
| 7870 | 0 |
| 7871 | 0 |
| 7872 | 0 |
| 7873 | 0 |
| 7874 | 0 |
| 7875 | 0 |
| 7876 | 0 |
| 7877 | 0 |
| 7878 | 0 |
| 7879 | 911 |
| 7880 | 910 |
| 7881 | 909 |
| 7882 | 910 |
| 7883 | 0 |
| 7884 | 0 |
| 7885 | 0 |
| 7886 | 0 |
| 7887 | 0 |
| 7888 | 0 |
| 7889 | 0 |
| 7890 | 0 |
| 7891 | 0 |
| 7892 | 0 |
| 7893 | 0 |
| 7894 | 0 |
| 7895 | 0 |
| 7896 | 0 |
| 7897 | 0 |
| 7898 | 0 |
| 7899 | 0 |
| 7900 | 0 |
| 7901 | 0 |
| 7902 | 0 |
| 7903 | 0 |
| 7904 | 0 |
| 7905 | 0 |
| 7906 | 0 |
| 7907 | 0 |
| 7908 | 0 |
| 7909 | 0 |
| 7910 | 0 |
| 7911 | 0 |
| 7912 | 0 |
| 7913 | 0 |
| 7914 | 0 |
| 7915 | 0 |
| 7916 | 0 |
| 7917 | 0 |
| 7918 | 0 |
| 7919 | 0 |
| 7920 | 0 |
| 7921 | 0 |
| 7922 | 0 |
| 7923 | 0 |
| 7924 | 0 |
| 7925 | 0 |
| 7926 | 0 |
| 7927 | 911 |
| 7928 | 910 |
| 7929 | 910 |
| 7930 | 906 |
| 7931 | 0 |
| 7932 | 0 |
| 7933 | 0 |
| 7934 | 0 |
| 7935 | 0 |
| 7936 | 0 |
| 7937 | 0 |
| 7938 | 0 |
| 7939 | 0 |
| 7940 | 0 |
| 7941 | 0 |
| 7942 | 0 |
| 7943 | 0 |
| 7944 | 0 |
| 7945 | 0 |
| 7946 | 0 |
| 7947 | 0 |
| 7948 | 0 |
| 7949 | 0 |
| 7950 | 0 |
| 7951 | 0 |
| 7952 | 0 |
| 7953 | 0 |
| 7954 | 0 |
| 7955 | 0 |
| 7956 | 0 |
| 7957 | 0 |
| 7958 | 0 |
| 7959 | 0 |
| 7960 | 0 |
| 7961 | 0 |
| 7962 | 0 |
| 7963 | 0 |
| 7964 | 0 |
| 7965 | 0 |
| 7966 | 0 |
| 7967 | 0 |
| 7968 | 0 |
| 7969 | 0 |
| 7970 | 0 |
| 7971 | 0 |
| 7972 | 0 |
| 7973 | 0 |
| 7974 | 0 |
| 7975 | 911 |
| 7976 | 913 |
| 7977 | 912 |
| 7978 | 912 |
| 7979 | 0 |
| 7980 | 0 |
| 7981 | 0 |
| 7982 | 0 |
| 7983 | 0 |
| 7984 | 0 |
| 7985 | 0 |
| 7986 | 0 |
| 7987 | 0 |
| 7988 | 0 |
| 7989 | 0 |
| 7990 | 0 |
| 7991 | 0 |
| 7992 | 0 |
| 7993 | 0 |
| 7994 | 0 |
| 7995 | 0 |
| 7996 | 0 |
| 7997 | 0 |
| 7998 | 0 |
| 7999 | 0 |
| 8000 | 0 |
| 8001 | 0 |
| 8002 | 0 |
| 8003 | 0 |
| 8004 | 0 |
| 8005 | 0 |
| 8006 | 0 |
| 8007 | 0 |
| 8008 | 0 |
| 8009 | 0 |
| 8010 | 0 |
| 8011 | 0 |
| 8012 | 0 |
| 8013 | 0 |
| 8014 | 0 |
| 8015 | 0 |
| 8016 | 0 |
| 8017 | 0 |
| 8018 | 0 |
| 8019 | 0 |
| 8020 | 0 |
| 8021 | 0 |
| 8022 | 0 |
| 8023 | 913 |
| 8024 | 911 |
| 8025 | 909 |
| 8026 | 909 |
| 8027 | 0 |
| 8028 | 0 |
| 8029 | 0 |
| 8030 | 0 |
| 8031 | 0 |
| 8032 | 0 |
| 8033 | 0 |
| 8034 | 0 |
| 8035 | 0 |
| 8036 | 0 |
| 8037 | 0 |
| 8038 | 0 |
| 8039 | 0 |
| 8040 | 0 |
| 8041 | 0 |
| 8042 | 0 |
| 8043 | 0 |
| 8044 | 0 |
| 8045 | 0 |
| 8046 | 0 |
| 8047 | 0 |
| 8048 | 0 |
| 8049 | 0 |
| 8050 | 0 |
| 8051 | 0 |
| 8052 | 0 |
| 8053 | 0 |
| 8054 | 0 |
| 8055 | 0 |
| 8056 | 0 |
| 8057 | 0 |
| 8058 | 0 |
| 8059 | 0 |
| 8060 | 0 |
| 8061 | 0 |
| 8062 | 0 |
| 8063 | 0 |
| 8064 | 0 |
| 8065 | 0 |
| 8066 | 0 |
| 8067 | 0 |
| 8068 | 0 |
| 8069 | 0 |
| 8070 | 0 |
| 8071 | 795 |
| 8072 | 913 |
| 8073 | 912 |
| 8074 | 912 |
| 8075 | 0 |
| 8076 | 0 |
| 8077 | 0 |
| 8078 | 0 |
| 8079 | 0 |
| 8080 | 0 |
| 8081 | 0 |
| 8082 | 0 |
| 8083 | 0 |
| 8084 | 0 |
| 8085 | 0 |
| 8086 | 0 |
| 8087 | 0 |
| 8088 | 0 |
| 8089 | 0 |
| 8090 | 0 |
| 8091 | 0 |
| 8092 | 0 |
| 8093 | 0 |
| 8094 | 0 |
| 8095 | 0 |
| 8096 | 0 |
| 8097 | 0 |
| 8098 | 0 |
| 8099 | 0 |
| 8100 | 0 |
| 8101 | 0 |
| 8102 | 0 |
| 8103 | 0 |
| 8104 | 0 |
| 8105 | 0 |
| 8106 | 0 |
| 8107 | 0 |
| 8108 | 0 |
| 8109 | 0 |
| 8110 | 0 |
| 8111 | 0 |
| 8112 | 0 |
| 8113 | 0 |
| 8114 | 0 |
| 8115 | 0 |
| 8116 | 0 |
| 8117 | 0 |
| 8118 | 0 |
| 8119 | 0 |
| 8120 | 911 |
| 8121 | 912 |
| 8122 | 912 |
| 8123 | 0 |
| 8124 | 0 |
| 8125 | 0 |
| 8126 | 0 |
| 8127 | 0 |
| 8128 | 0 |
| 8129 | 0 |
| 8130 | 0 |
| 8131 | 0 |
| 8132 | 0 |
| 8133 | 0 |
| 8134 | 0 |
| 8135 | 0 |
| 8136 | 0 |
| 8137 | 0 |
| 8138 | 0 |
| 8139 | 0 |
| 8140 | 0 |
| 8141 | 0 |
| 8142 | 0 |
| 8143 | 0 |
| 8144 | 0 |
| 8145 | 0 |
| 8146 | 0 |
| 8147 | 0 |
| 8148 | 0 |
| 8149 | 0 |
| 8150 | 0 |
| 8151 | 0 |
| 8152 | 0 |
| 8153 | 0 |
| 8154 | 0 |
| 8155 | 0 |
| 8156 | 0 |
| 8157 | 0 |
| 8158 | 0 |
| 8159 | 0 |
| 8160 | 0 |
| 8161 | 0 |
| 8162 | 0 |
| 8163 | 0 |
| 8164 | 0 |
| 8165 | 0 |
| 8166 | 0 |
| 8167 | 0 |
| 8168 | 913 |
| 8169 | 913 |
| 8170 | 913 |
| 8171 | 0 |
| 8172 | 0 |
| 8173 | 0 |
| 8174 | 0 |
| 8175 | 0 |
| 8176 | 0 |
| 8177 | 0 |
| 8178 | 0 |
| 8179 | 0 |
| 8180 | 0 |
| 8181 | 0 |
| 8182 | 0 |
| 8183 | 0 |
| 8184 | 0 |
| 8185 | 0 |
| 8186 | 0 |
| 8187 | 0 |
| 8188 | 0 |
| 8189 | 0 |
| 8190 | 0 |
| 8191 | 0 |
| 8192 | 0 |
| 8193 | 0 |
| 8194 | 0 |
| 8195 | 0 |
| 8196 | 0 |
| 8197 | 0 |
| 8198 | 0 |
| 8199 | 0 |
| 8200 | 0 |
| 8201 | 0 |
| 8202 | 0 |
| 8203 | 0 |
| 8204 | 0 |
| 8205 | 0 |
| 8206 | 0 |
| 8207 | 0 |
| 8208 | 0 |
| 8209 | 0 |
| 8210 | 0 |
| 8211 | 0 |
| 8212 | 0 |
| 8213 | 0 |
| 8214 | 0 |
| 8215 | 0 |
| 8216 | 913 |
| 8217 | 913 |
| 8218 | 912 |
| 8219 | 911 |
| 8220 | 0 |
| 8221 | 0 |
| 8222 | 0 |
| 8223 | 0 |
| 8224 | 0 |
| 8225 | 0 |
| 8226 | 0 |
| 8227 | 0 |
| 8228 | 0 |
| 8229 | 0 |
| 8230 | 0 |
| 8231 | 0 |
| 8232 | 0 |
| 8233 | 0 |
| 8234 | 0 |
| 8235 | 0 |
| 8236 | 0 |
| 8237 | 0 |
| 8238 | 0 |
| 8239 | 0 |
| 8240 | 0 |
| 8241 | 0 |
| 8242 | 0 |
| 8243 | 0 |
| 8244 | 0 |
| 8245 | 0 |
| 8246 | 0 |
| 8247 | 0 |
| 8248 | 0 |
| 8249 | 0 |
| 8250 | 0 |
| 8251 | 0 |
| 8252 | 0 |
| 8253 | 0 |
| 8254 | 0 |
| 8255 | 0 |
| 8256 | 0 |
| 8257 | 0 |
| 8258 | 0 |
| 8259 | 0 |
| 8260 | 0 |
| 8261 | 0 |
| 8262 | 0 |
| 8263 | 0 |
| 8264 | 913 |
| 8265 | 913 |
| 8266 | 912 |
| 8267 | 912 |
| 8268 | 0 |
| 8269 | 0 |
| 8270 | 0 |
| 8271 | 0 |
| 8272 | 0 |
| 8273 | 0 |
| 8274 | 0 |
| 8275 | 0 |
| 8276 | 0 |
| 8277 | 0 |
| 8278 | 0 |
| 8279 | 0 |
| 8280 | 0 |
| 8281 | 0 |
| 8282 | 0 |
| 8283 | 0 |
| 8284 | 0 |
| 8285 | 0 |
| 8286 | 0 |
| 8287 | 0 |
| 8288 | 0 |
| 8289 | 0 |
| 8290 | 0 |
| 8291 | 0 |
| 8292 | 0 |
| 8293 | 0 |
| 8294 | 0 |
| 8295 | 0 |
| 8296 | 0 |
| 8297 | 0 |
| 8298 | 0 |
| 8299 | 0 |
| 8300 | 0 |
| 8301 | 0 |
| 8302 | 0 |
| 8303 | 0 |
| 8304 | 0 |
| 8305 | 0 |
| 8306 | 0 |
| 8307 | 0 |
| 8308 | 0 |
| 8309 | 0 |
| 8310 | 0 |
| 8311 | 0 |
| 8312 | 911 |
| 8313 | 912 |
| 8314 | 911 |
| 8315 | 912 |
| 8316 | 0 |
| 8317 | 0 |
| 8318 | 0 |
| 8319 | 0 |
| 8320 | 0 |
| 8321 | 0 |
| 8322 | 0 |
| 8323 | 0 |
| 8324 | 0 |
| 8325 | 0 |
| 8326 | 0 |
| 8327 | 0 |
| 8328 | 0 |
| 8329 | 0 |
| 8330 | 0 |
| 8331 | 0 |
| 8332 | 0 |
| 8333 | 0 |
| 8334 | 0 |
| 8335 | 0 |
| 8336 | 0 |
| 8337 | 0 |
| 8338 | 0 |
| 8339 | 0 |
| 8340 | 0 |
| 8341 | 0 |
| 8342 | 0 |
| 8343 | 0 |
| 8344 | 0 |
| 8345 | 0 |
| 8346 | 0 |
| 8347 | 0 |
| 8348 | 0 |
| 8349 | 0 |
| 8350 | 0 |
| 8351 | 0 |
| 8352 | 0 |
| 8353 | 0 |
| 8354 | 0 |
| 8355 | 0 |
| 8356 | 0 |
| 8357 | 0 |
| 8358 | 0 |
| 8359 | 0 |
| 8360 | 913 |
| 8361 | 913 |
| 8362 | 912 |
| 8363 | 912 |
| 8364 | 0 |
| 8365 | 0 |
| 8366 | 0 |
| 8367 | 0 |
| 8368 | 0 |
| 8369 | 0 |
| 8370 | 0 |
| 8371 | 0 |
| 8372 | 0 |
| 8373 | 0 |
| 8374 | 0 |
| 8375 | 0 |
| 8376 | 0 |
| 8377 | 0 |
| 8378 | 0 |
| 8379 | 0 |
| 8380 | 0 |
| 8381 | 0 |
| 8382 | 0 |
| 8383 | 0 |
| 8384 | 0 |
| 8385 | 0 |
| 8386 | 0 |
| 8387 | 0 |
| 8388 | 0 |
| 8389 | 0 |
| 8390 | 0 |
| 8391 | 0 |
| 8392 | 0 |
| 8393 | 0 |
| 8394 | 0 |
| 8395 | 0 |
| 8396 | 0 |
| 8397 | 0 |
| 8398 | 0 |
| 8399 | 0 |
| 8400 | 0 |
| 8401 | 0 |
| 8402 | 0 |
| 8403 | 0 |
| 8404 | 0 |
| 8405 | 0 |
| 8406 | 0 |
| 8407 | 0 |
| 8408 | 912 |
| 8409 | 913 |
| 8410 | 912 |
| 8411 | 912 |
| 8412 | 0 |
| 8413 | 0 |
| 8414 | 0 |
| 8415 | 0 |
| 8416 | 0 |
| 8417 | 0 |
| 8418 | 0 |
| 8419 | 0 |
| 8420 | 0 |
| 8421 | 0 |
| 8422 | 0 |
| 8423 | 0 |
| 8424 | 0 |
| 8425 | 0 |
| 8426 | 0 |
| 8427 | 0 |
| 8428 | 0 |
| 8429 | 0 |
| 8430 | 0 |
| 8431 | 0 |
| 8432 | 0 |
| 8433 | 0 |
| 8434 | 0 |
| 8435 | 0 |
| 8436 | 0 |
| 8437 | 0 |
| 8438 | 0 |
| 8439 | 0 |
| 8440 | 0 |
| 8441 | 0 |
| 8442 | 0 |
| 8443 | 0 |
| 8444 | 0 |
| 8445 | 0 |
| 8446 | 0 |
| 8447 | 0 |
| 8448 | 0 |
| 8449 | 0 |
| 8450 | 0 |
| 8451 | 0 |
| 8452 | 0 |
| 8453 | 0 |
| 8454 | 0 |
| 8455 | 0 |
| 8456 | 911 |
| 8457 | 913 |
| 8458 | 912 |
| 8459 | 912 |
| 8460 | 0 |
| 8461 | 0 |
| 8462 | 0 |
| 8463 | 0 |
| 8464 | 0 |
| 8465 | 0 |
| 8466 | 0 |
| 8467 | 0 |
| 8468 | 0 |
| 8469 | 0 |
| 8470 | 0 |
| 8471 | 0 |
| 8472 | 0 |
| 8473 | 0 |
| 8474 | 0 |
| 8475 | 0 |
| 8476 | 0 |
| 8477 | 0 |
| 8478 | 0 |
| 8479 | 0 |
| 8480 | 0 |
| 8481 | 0 |
| 8482 | 0 |
| 8483 | 0 |
| 8484 | 0 |
| 8485 | 0 |
| 8486 | 0 |
| 8487 | 0 |
| 8488 | 0 |
| 8489 | 0 |
| 8490 | 0 |
| 8491 | 0 |
| 8492 | 0 |
| 8493 | 0 |
| 8494 | 0 |
| 8495 | 0 |
| 8496 | 0 |
| 8497 | 0 |
| 8498 | 0 |
| 8499 | 0 |
| 8500 | 0 |
| 8501 | 0 |
| 8502 | 0 |
| 8503 | 0 |
| 8504 | 810 |
| 8505 | 912 |
| 8506 | 911 |
| 8507 | 912 |
| 8508 | 0 |
| 8509 | 0 |
| 8510 | 0 |
| 8511 | 0 |
| 8512 | 0 |
| 8513 | 0 |
| 8514 | 0 |
| 8515 | 0 |
| 8516 | 0 |
| 8517 | 0 |
| 8518 | 0 |
| 8519 | 0 |
| 8520 | 0 |
| 8521 | 0 |
| 8522 | 0 |
| 8523 | 0 |
| 8524 | 0 |
| 8525 | 0 |
| 8526 | 0 |
| 8527 | 0 |
| 8528 | 0 |
| 8529 | 0 |
| 8530 | 0 |
| 8531 | 0 |
| 8532 | 0 |
| 8533 | 0 |
| 8534 | 0 |
| 8535 | 0 |
| 8536 | 0 |
| 8537 | 0 |
| 8538 | 0 |
| 8539 | 0 |
| 8540 | 0 |
| 8541 | 0 |
| 8542 | 0 |
| 8543 | 0 |
| 8544 | 0 |
| 8545 | 0 |
| 8546 | 0 |
| 8547 | 0 |
| 8548 | 0 |
| 8549 | 0 |
| 8550 | 0 |
| 8551 | 0 |
| 8552 | 0 |
| 8553 | 912 |
| 8554 | 912 |
| 8555 | 911 |
| 8556 | 0 |
| 8557 | 0 |
| 8558 | 0 |
| 8559 | 0 |
| 8560 | 0 |
| 8561 | 0 |
| 8562 | 0 |
| 8563 | 0 |
| 8564 | 0 |
| 8565 | 0 |
| 8566 | 0 |
| 8567 | 0 |
| 8568 | 0 |
| 8569 | 0 |
| 8570 | 0 |
| 8571 | 0 |
| 8572 | 0 |
| 8573 | 0 |
| 8574 | 0 |
| 8575 | 0 |
| 8576 | 0 |
| 8577 | 0 |
| 8578 | 0 |
| 8579 | 0 |
| 8580 | 0 |
| 8581 | 0 |
| 8582 | 0 |
| 8583 | 0 |
| 8584 | 0 |
| 8585 | 0 |
| 8586 | 0 |
| 8587 | 0 |
| 8588 | 0 |
| 8589 | 0 |
| 8590 | 0 |
| 8591 | 0 |
| 8592 | 0 |
| 8593 | 0 |
| 8594 | 0 |
| 8595 | 0 |
| 8596 | 0 |
| 8597 | 0 |
| 8598 | 0 |
| 8599 | 0 |
| 8600 | 0 |
| 8601 | 912 |
| 8602 | 913 |
| 8603 | 913 |
| 8604 | 0 |
| 8605 | 0 |
| 8606 | 0 |
| 8607 | 0 |
| 8608 | 0 |
| 8609 | 0 |
| 8610 | 0 |
| 8611 | 0 |
| 8612 | 0 |
| 8613 | 0 |
| 8614 | 0 |
| 8615 | 0 |
| 8616 | 0 |
| 8617 | 0 |
| 8618 | 0 |
| 8619 | 0 |
| 8620 | 0 |
| 8621 | 0 |
| 8622 | 0 |
| 8623 | 0 |
| 8624 | 0 |
| 8625 | 0 |
| 8626 | 0 |
| 8627 | 0 |
| 8628 | 0 |
| 8629 | 0 |
| 8630 | 0 |
| 8631 | 0 |
| 8632 | 0 |
| 8633 | 0 |
| 8634 | 0 |
| 8635 | 0 |
| 8636 | 0 |
| 8637 | 0 |
| 8638 | 0 |
| 8639 | 0 |
| 8640 | 0 |
| 8641 | 0 |
| 8642 | 0 |
| 8643 | 0 |
| 8644 | 0 |
| 8645 | 0 |
| 8646 | 0 |
| 8647 | 0 |
| 8648 | 0 |
| 8649 | 910 |
| 8650 | 910 |
| 8651 | 908 |
| 8652 | 909 |
| 8653 | 0 |
| 8654 | 0 |
| 8655 | 0 |
| 8656 | 0 |
| 8657 | 0 |
| 8658 | 0 |
| 8659 | 0 |
| 8660 | 0 |
| 8661 | 0 |
| 8662 | 0 |
| 8663 | 0 |
| 8664 | 0 |
| 8665 | 0 |
| 8666 | 0 |
| 8667 | 0 |
| 8668 | 0 |
| 8669 | 0 |
| 8670 | 0 |
| 8671 | 0 |
| 8672 | 0 |
| 8673 | 0 |
| 8674 | 0 |
| 8675 | 0 |
| 8676 | 0 |
| 8677 | 0 |
| 8678 | 0 |
| 8679 | 0 |
| 8680 | 0 |
| 8681 | 0 |
| 8682 | 0 |
| 8683 | 0 |
| 8684 | 0 |
| 8685 | 0 |
| 8686 | 0 |
| 8687 | 0 |
| 8688 | 0 |
| 8689 | 0 |
| 8690 | 0 |
| 8691 | 0 |
| 8692 | 0 |
| 8693 | 0 |
| 8694 | 0 |
| 8695 | 0 |
| 8696 | 0 |
| 8697 | 911 |
| 8698 | 912 |
| 8699 | 909 |
| 8700 | 908 |
| 8701 | 0 |
| 8702 | 0 |
| 8703 | 0 |
| 8704 | 0 |
| 8705 | 0 |
| 8706 | 0 |
| 8707 | 0 |
| 8708 | 0 |
| 8709 | 0 |
| 8710 | 0 |
| 8711 | 0 |
| 8712 | 0 |
| 8713 | 0 |
| 8714 | 0 |
| 8715 | 0 |
| 8716 | 0 |
| 8717 | 0 |
| 8718 | 0 |
| 8719 | 0 |
| 8720 | 0 |
| 8721 | 0 |
| 8722 | 0 |
| 8723 | 0 |
| 8724 | 0 |
| 8725 | 0 |
| 8726 | 0 |
| 8727 | 0 |
| 8728 | 0 |
| 8729 | 0 |
| 8730 | 0 |
| 8731 | 0 |
| 8732 | 0 |
| 8733 | 0 |
| 8734 | 0 |
| 8735 | 0 |
| 8736 | 0 |
| 8737 | 0 |
| 8738 | 0 |
| 8739 | 0 |
| 8740 | 0 |
| 8741 | 0 |
| 8742 | 0 |
| 8743 | 0 |
| 8744 | 0 |
| 8745 | 0 |
| 8746 | 910 |
| 8747 | 910 |
| 8748 | 910 |
| 8749 | 0 |
| 8750 | 0 |
| 8751 | 0 |
| 8752 | 0 |
| 8753 | 0 |
| 8754 | 0 |
| 8755 | 0 |
| 8756 | 0 |
| 8757 | 0 |
| 8758 | 0 |
| 8759 | 0 |
| 8760 | 0 |
| 8761 | 0 |
| 8762 | 0 |
| 8763 | 0 |
| 8764 | 0 |
| 8765 | 0 |
| 8766 | 0 |
| 8767 | 0 |
| 8768 | 0 |
| 8769 | 0 |
| 8770 | 0 |
| 8771 | 0 |
| 8772 | 0 |
| 8773 | 0 |
| 8774 | 0 |
| 8775 | 0 |
| 8776 | 0 |
| 8777 | 0 |
| 8778 | 0 |
| 8779 | 0 |
| 8780 | 0 |
| 8781 | 0 |
| 8782 | 0 |
| 8783 | 0 |
| 8784 | 0 |
| 8785 | 0 |
| 8786 | 0 |
| 8787 | 0 |
| 8788 | 0 |
| 8789 | 0 |
| 8790 | 0 |
| 8791 | 0 |
| 8792 | 0 |
| 8793 | 0 |
| 8794 | 909 |
| 8795 | 910 |
| 8796 | 910 |
| 8797 | 0 |
| 8798 | 0 |
| 8799 | 0 |
| 8800 | 0 |
| 8801 | 0 |
| 8802 | 0 |
| 8803 | 0 |
| 8804 | 0 |
| 8805 | 0 |
| 8806 | 0 |
| 8807 | 0 |
| 8808 | 0 |
| 8809 | 0 |
| 8810 | 0 |
| 8811 | 0 |
| 8812 | 0 |
| 8813 | 0 |
| 8814 | 0 |
| 8815 | 0 |
| 8816 | 0 |
| 8817 | 0 |
| 8818 | 0 |
| 8819 | 0 |
| 8820 | 0 |
| 8821 | 0 |
| 8822 | 0 |
| 8823 | 0 |
| 8824 | 0 |
| 8825 | 0 |
| 8826 | 0 |
| 8827 | 0 |
| 8828 | 0 |
| 8829 | 0 |
| 8830 | 0 |
| 8831 | 0 |
| 8832 | 0 |
| 8833 | 0 |
| 8834 | 0 |
| 8835 | 0 |
| 8836 | 0 |
| 8837 | 0 |
| 8838 | 0 |
| 8839 | 0 |
| 8840 | 0 |
| 8841 | 0 |
| 8842 | 911 |
| 8843 | 910 |
| 8844 | 912 |
| 8845 | 909 |
| 8846 | 0 |
| 8847 | 0 |
| 8848 | 0 |
| 8849 | 0 |
| 8850 | 0 |
| 8851 | 0 |
| 8852 | 0 |
| 8853 | 0 |
| 8854 | 0 |
| 8855 | 0 |
| 8856 | 0 |
| 8857 | 0 |
| 8858 | 0 |
| 8859 | 0 |
| 8860 | 0 |
| 8861 | 0 |
| 8862 | 0 |
| 8863 | 0 |
| 8864 | 0 |
| 8865 | 0 |
| 8866 | 0 |
| 8867 | 0 |
| 8868 | 0 |
| 8869 | 0 |
| 8870 | 0 |
| 8871 | 0 |
| 8872 | 0 |
| 8873 | 0 |
| 8874 | 0 |
| 8875 | 0 |
| 8876 | 0 |
| 8877 | 0 |
| 8878 | 0 |
| 8879 | 0 |
| 8880 | 0 |
| 8881 | 0 |
| 8882 | 0 |
| 8883 | 0 |
| 8884 | 0 |
| 8885 | 0 |
| 8886 | 0 |
| 8887 | 0 |
| 8888 | 0 |
| 8889 | 0 |
| 8890 | 913 |
| 8891 | 913 |
| 8892 | 914 |
| 8893 | 912 |
| 8894 | 0 |
| 8895 | 0 |
| 8896 | 0 |
| 8897 | 0 |
| 8898 | 0 |
| 8899 | 0 |
| 8900 | 0 |
| 8901 | 0 |
| 8902 | 0 |
| 8903 | 0 |
| 8904 | 0 |
| 8905 | 0 |
| 8906 | 0 |
| 8907 | 0 |
| 8908 | 0 |
| 8909 | 0 |
| 8910 | 0 |
| 8911 | 0 |
| 8912 | 0 |
| 8913 | 0 |
| 8914 | 0 |
| 8915 | 0 |
| 8916 | 0 |
| 8917 | 0 |
| 8918 | 0 |
| 8919 | 0 |
| 8920 | 0 |
| 8921 | 0 |
| 8922 | 0 |
| 8923 | 0 |
| 8924 | 0 |
| 8925 | 0 |
| 8926 | 0 |
| 8927 | 0 |
| 8928 | 0 |
| 8929 | 0 |
| 8930 | 0 |
| 8931 | 0 |
| 8932 | 0 |
| 8933 | 0 |
| 8934 | 0 |
| 8935 | 0 |
| 8936 | 0 |
| 8937 | 0 |
| 8938 | 912 |
| 8939 | 912 |
| 8940 | 912 |
| 8941 | 911 |
| 8942 | 0 |
| 8943 | 0 |
| 8944 | 0 |
| 8945 | 0 |
| 8946 | 0 |
| 8947 | 0 |
| 8948 | 0 |
| 8949 | 0 |
| 8950 | 0 |
| 8951 | 0 |
| 8952 | 0 |
| 8953 | 0 |
| 8954 | 0 |
| 8955 | 0 |
| 8956 | 0 |
| 8957 | 0 |
| 8958 | 0 |
| 8959 | 0 |
| 8960 | 0 |
| 8961 | 0 |
| 8962 | 0 |
| 8963 | 0 |
| 8964 | 0 |
| 8965 | 0 |
| 8966 | 0 |
| 8967 | 0 |
| 8968 | 0 |
| 8969 | 0 |
| 8970 | 0 |
| 8971 | 0 |
| 8972 | 0 |
| 8973 | 0 |
| 8974 | 0 |
| 8975 | 0 |
| 8976 | 0 |
| 8977 | 0 |
| 8978 | 0 |
| 8979 | 0 |
| 8980 | 0 |
| 8981 | 0 |
| 8982 | 0 |
| 8983 | 0 |
| 8984 | 0 |
| 8985 | 0 |
| 8986 | 910 |
| 8987 | 912 |
| 8988 | 912 |
| 8989 | 910 |
| 8990 | 0 |
| 8991 | 0 |
| 8992 | 0 |
| 8993 | 0 |
| 8994 | 0 |
| 8995 | 0 |
| 8996 | 0 |
| 8997 | 0 |
| 8998 | 0 |
| 8999 | 0 |
| 9000 | 0 |
| 9001 | 0 |
| 9002 | 0 |
| 9003 | 0 |
| 9004 | 0 |
| 9005 | 0 |
| 9006 | 0 |
| 9007 | 0 |
| 9008 | 0 |
| 9009 | 0 |
| 9010 | 0 |
| 9011 | 0 |
| 9012 | 0 |
| 9013 | 0 |
| 9014 | 0 |
| 9015 | 0 |
| 9016 | 0 |
| 9017 | 0 |
| 9018 | 0 |
| 9019 | 0 |
| 9020 | 0 |
| 9021 | 0 |
| 9022 | 0 |
| 9023 | 0 |
| 9024 | 0 |
| 9025 | 0 |
| 9026 | 0 |
| 9027 | 0 |
| 9028 | 0 |
| 9029 | 0 |
| 9030 | 0 |
| 9031 | 0 |
| 9032 | 0 |
| 9033 | 0 |
| 9034 | 0 |
| 9035 | 912 |
| 9036 | 910 |
| 9037 | 909 |
| 9038 | 0 |
| 9039 | 0 |
| 9040 | 0 |
| 9041 | 0 |
| 9042 | 0 |
| 9043 | 0 |
| 9044 | 0 |
| 9045 | 0 |
| 9046 | 0 |
| 9047 | 0 |
| 9048 | 0 |
| 9049 | 0 |
| 9050 | 0 |
| 9051 | 0 |
| 9052 | 0 |
| 9053 | 0 |
| 9054 | 0 |
| 9055 | 0 |
| 9056 | 0 |
| 9057 | 0 |
| 9058 | 0 |
| 9059 | 0 |
| 9060 | 0 |
| 9061 | 0 |
| 9062 | 0 |
| 9063 | 0 |
| 9064 | 0 |
| 9065 | 0 |
| 9066 | 0 |
| 9067 | 0 |
| 9068 | 0 |
| 9069 | 0 |
| 9070 | 0 |
| 9071 | 0 |
| 9072 | 0 |
| 9073 | 0 |
| 9074 | 0 |
| 9075 | 0 |
| 9076 | 0 |
| 9077 | 0 |
| 9078 | 0 |
| 9079 | 0 |
| 9080 | 0 |
| 9081 | 0 |
| 9082 | 0 |
| 9083 | 915 |
| 9084 | 914 |
| 9085 | 911 |
| 9086 | 0 |
| 9087 | 0 |
| 9088 | 0 |
| 9089 | 0 |
| 9090 | 0 |
| 9091 | 0 |
| 9092 | 0 |
| 9093 | 0 |
| 9094 | 0 |
| 9095 | 0 |
| 9096 | 0 |
| 9097 | 0 |
| 9098 | 0 |
| 9099 | 0 |
| 9100 | 0 |
| 9101 | 0 |
| 9102 | 0 |
| 9103 | 0 |
| 9104 | 0 |
| 9105 | 0 |
| 9106 | 0 |
| 9107 | 0 |
| 9108 | 0 |
| 9109 | 0 |
| 9110 | 0 |
| 9111 | 0 |
| 9112 | 0 |
| 9113 | 0 |
| 9114 | 0 |
| 9115 | 0 |
| 9116 | 0 |
| 9117 | 0 |
| 9118 | 0 |
| 9119 | 0 |
| 9120 | 0 |
| 9121 | 0 |
| 9122 | 0 |
| 9123 | 0 |
| 9124 | 0 |
| 9125 | 0 |
| 9126 | 0 |
| 9127 | 0 |
| 9128 | 0 |
| 9129 | 0 |
| 9130 | 0 |
| 9131 | 909 |
| 9132 | 911 |
| 9133 | 911 |
| 9134 | 912 |
| 9135 | 0 |
| 9136 | 0 |
| 9137 | 0 |
| 9138 | 0 |
| 9139 | 0 |
| 9140 | 0 |
| 9141 | 0 |
| 9142 | 0 |
| 9143 | 0 |
| 9144 | 0 |
| 9145 | 0 |
| 9146 | 0 |
| 9147 | 0 |
| 9148 | 0 |
| 9149 | 0 |
| 9150 | 0 |
| 9151 | 0 |
| 9152 | 0 |
| 9153 | 0 |
| 9154 | 0 |
| 9155 | 0 |
| 9156 | 0 |
| 9157 | 0 |
| 9158 | 0 |
| 9159 | 0 |
| 9160 | 0 |
| 9161 | 0 |
| 9162 | 0 |
| 9163 | 0 |
| 9164 | 0 |
| 9165 | 0 |
| 9166 | 0 |
| 9167 | 0 |
| 9168 | 0 |
| 9169 | 0 |
| 9170 | 0 |
| 9171 | 0 |
| 9172 | 0 |
| 9173 | 0 |
| 9174 | 0 |
| 9175 | 0 |
| 9176 | 0 |
| 9177 | 0 |
| 9178 | 0 |
| 9179 | 0 |
| 9180 | 914 |
| 9181 | 913 |
| 9182 | 911 |
| 9183 | 0 |
| 9184 | 0 |
| 9185 | 0 |
| 9186 | 0 |
| 9187 | 0 |
| 9188 | 0 |
| 9189 | 0 |
| 9190 | 0 |
| 9191 | 0 |
| 9192 | 0 |
| 9193 | 0 |
| 9194 | 0 |
| 9195 | 0 |
| 9196 | 0 |
| 9197 | 0 |
| 9198 | 0 |
| 9199 | 0 |
| 9200 | 0 |
| 9201 | 0 |
| 9202 | 0 |
| 9203 | 0 |
| 9204 | 0 |
| 9205 | 0 |
| 9206 | 0 |
| 9207 | 0 |
| 9208 | 0 |
| 9209 | 0 |
| 9210 | 0 |
| 9211 | 0 |
| 9212 | 0 |
| 9213 | 0 |
| 9214 | 0 |
| 9215 | 0 |
| 9216 | 0 |
| 9217 | 0 |
| 9218 | 0 |
| 9219 | 0 |
| 9220 | 0 |
| 9221 | 0 |
| 9222 | 0 |
| 9223 | 0 |
| 9224 | 0 |
| 9225 | 0 |
| 9226 | 0 |
| 9227 | 0 |
| 9228 | 913 |
| 9229 | 914 |
| 9230 | 915 |
| 9231 | 0 |
| 9232 | 0 |
| 9233 | 0 |
| 9234 | 0 |
| 9235 | 0 |
| 9236 | 0 |
| 9237 | 0 |
| 9238 | 0 |
| 9239 | 0 |
| 9240 | 0 |
| 9241 | 0 |
| 9242 | 0 |
| 9243 | 0 |
| 9244 | 0 |
| 9245 | 0 |
| 9246 | 0 |
| 9247 | 0 |
| 9248 | 0 |
| 9249 | 0 |
| 9250 | 0 |
| 9251 | 0 |
| 9252 | 0 |
| 9253 | 0 |
| 9254 | 0 |
| 9255 | 0 |
| 9256 | 0 |
| 9257 | 0 |
| 9258 | 0 |
| 9259 | 0 |
| 9260 | 0 |
| 9261 | 0 |
| 9262 | 0 |
| 9263 | 0 |
| 9264 | 0 |
| 9265 | 0 |
| 9266 | 0 |
| 9267 | 0 |
| 9268 | 0 |
| 9269 | 0 |
| 9270 | 0 |
| 9271 | 0 |
| 9272 | 0 |
| 9273 | 0 |
| 9274 | 0 |
| 9275 | 0 |
| 9276 | 913 |
| 9277 | 912 |
| 9278 | 911 |
| 9279 | 909 |
| 9280 | 0 |
| 9281 | 0 |
| 9282 | 0 |
| 9283 | 0 |
| 9284 | 0 |
| 9285 | 0 |
| 9286 | 0 |
| 9287 | 0 |
| 9288 | 0 |
| 9289 | 0 |
| 9290 | 0 |
| 9291 | 0 |
| 9292 | 0 |
| 9293 | 0 |
| 9294 | 0 |
| 9295 | 0 |
| 9296 | 0 |
| 9297 | 0 |
| 9298 | 0 |
| 9299 | 0 |
| 9300 | 0 |
| 9301 | 0 |
| 9302 | 0 |
| 9303 | 0 |
| 9304 | 0 |
| 9305 | 0 |
| 9306 | 0 |
| 9307 | 0 |
| 9308 | 0 |
| 9309 | 0 |
| 9310 | 0 |
| 9311 | 0 |
| 9312 | 0 |
| 9313 | 0 |
| 9314 | 0 |
| 9315 | 0 |
| 9316 | 0 |
| 9317 | 0 |
| 9318 | 0 |
| 9319 | 0 |
| 9320 | 0 |
| 9321 | 0 |
| 9322 | 0 |
| 9323 | 0 |
| 9324 | 912 |
| 9325 | 912 |
| 9326 | 910 |
| 9327 | 909 |
| 9328 | 0 |
| 9329 | 0 |
| 9330 | 0 |
| 9331 | 0 |
| 9332 | 0 |
| 9333 | 0 |
| 9334 | 0 |
| 9335 | 0 |
| 9336 | 0 |
| 9337 | 0 |
| 9338 | 0 |
| 9339 | 0 |
| 9340 | 0 |
| 9341 | 0 |
| 9342 | 0 |
| 9343 | 0 |
| 9344 | 0 |
| 9345 | 0 |
| 9346 | 0 |
| 9347 | 0 |
| 9348 | 0 |
| 9349 | 0 |
| 9350 | 0 |
| 9351 | 0 |
| 9352 | 0 |
| 9353 | 0 |
| 9354 | 0 |
| 9355 | 0 |
| 9356 | 0 |
| 9357 | 0 |
| 9358 | 0 |
| 9359 | 0 |
| 9360 | 0 |
| 9361 | 0 |
| 9362 | 0 |
| 9363 | 0 |
| 9364 | 0 |
| 9365 | 0 |
| 9366 | 0 |
| 9367 | 0 |
| 9368 | 0 |
| 9369 | 0 |
| 9370 | 0 |
| 9371 | 0 |
| 9372 | 0 |
| 9373 | 913 |
| 9374 | 914 |
| 9375 | 912 |
| 9376 | 0 |
| 9377 | 0 |
| 9378 | 0 |
| 9379 | 0 |
| 9380 | 0 |
| 9381 | 0 |
| 9382 | 0 |
| 9383 | 0 |
| 9384 | 0 |
| 9385 | 0 |
| 9386 | 0 |
| 9387 | 0 |
| 9388 | 0 |
| 9389 | 0 |
| 9390 | 0 |
| 9391 | 0 |
| 9392 | 0 |
| 9393 | 0 |
| 9394 | 0 |
| 9395 | 0 |
| 9396 | 0 |
| 9397 | 0 |
| 9398 | 0 |
| 9399 | 0 |
| 9400 | 0 |
| 9401 | 0 |
| 9402 | 0 |
| 9403 | 0 |
| 9404 | 0 |
| 9405 | 0 |
| 9406 | 0 |
| 9407 | 0 |
| 9408 | 0 |
| 9409 | 0 |
| 9410 | 0 |
| 9411 | 0 |
| 9412 | 0 |
| 9413 | 0 |
| 9414 | 0 |
| 9415 | 0 |
| 9416 | 0 |
| 9417 | 0 |
| 9418 | 0 |
| 9419 | 0 |
| 9420 | 0 |
| 9421 | 909 |
| 9422 | 911 |
| 9423 | 911 |
| 9424 | 0 |
| 9425 | 0 |
| 9426 | 0 |
| 9427 | 0 |
| 9428 | 0 |
| 9429 | 0 |
| 9430 | 0 |
| 9431 | 0 |
| 9432 | 0 |
| 9433 | 0 |
| 9434 | 0 |
| 9435 | 0 |
| 9436 | 0 |
| 9437 | 0 |
| 9438 | 0 |
| 9439 | 0 |
| 9440 | 0 |
| 9441 | 0 |
| 9442 | 0 |
| 9443 | 0 |
| 9444 | 0 |
| 9445 | 0 |
| 9446 | 0 |
| 9447 | 0 |
| 9448 | 0 |
| 9449 | 0 |
| 9450 | 0 |
| 9451 | 0 |
| 9452 | 0 |
| 9453 | 0 |
| 9454 | 0 |
| 9455 | 0 |
| 9456 | 0 |
| 9457 | 0 |
| 9458 | 0 |
| 9459 | 0 |
| 9460 | 0 |
| 9461 | 0 |
| 9462 | 0 |
| 9463 | 0 |
| 9464 | 0 |
| 9465 | 0 |
| 9466 | 0 |
| 9467 | 0 |
| 9468 | 0 |
| 9469 | 913 |
| 9470 | 911 |
| 9471 | 910 |
| 9472 | 909 |
| 9473 | 0 |
| 9474 | 0 |
| 9475 | 0 |
| 9476 | 0 |
| 9477 | 0 |
| 9478 | 0 |
| 9479 | 0 |
| 9480 | 0 |
| 9481 | 0 |
| 9482 | 0 |
| 9483 | 0 |
| 9484 | 0 |
| 9485 | 0 |
| 9486 | 0 |
| 9487 | 0 |
| 9488 | 0 |
| 9489 | 0 |
| 9490 | 0 |
| 9491 | 0 |
| 9492 | 0 |
| 9493 | 0 |
| 9494 | 0 |
| 9495 | 0 |
| 9496 | 0 |
| 9497 | 0 |
| 9498 | 0 |
| 9499 | 0 |
| 9500 | 0 |
| 9501 | 0 |
| 9502 | 0 |
| 9503 | 0 |
| 9504 | 0 |
| 9505 | 0 |
| 9506 | 0 |
| 9507 | 0 |
| 9508 | 0 |
| 9509 | 0 |
| 9510 | 0 |
| 9511 | 0 |
| 9512 | 0 |
| 9513 | 0 |
| 9514 | 0 |
| 9515 | 0 |
| 9516 | 0 |
| 9517 | 910 |
| 9518 | 910 |
| 9519 | 910 |
| 9520 | 911 |
| 9521 | 0 |
| 9522 | 0 |
| 9523 | 0 |
| 9524 | 0 |
| 9525 | 0 |
| 9526 | 0 |
| 9527 | 0 |
| 9528 | 0 |
| 9529 | 0 |
| 9530 | 0 |
| 9531 | 0 |
| 9532 | 0 |
| 9533 | 0 |
| 9534 | 0 |
| 9535 | 0 |
| 9536 | 0 |
| 9537 | 0 |
| 9538 | 0 |
| 9539 | 0 |
| 9540 | 0 |
| 9541 | 0 |
| 9542 | 0 |
| 9543 | 0 |
| 9544 | 0 |
| 9545 | 0 |
| 9546 | 0 |
| 9547 | 0 |
| 9548 | 0 |
| 9549 | 0 |
| 9550 | 0 |
| 9551 | 0 |
| 9552 | 0 |
| 9553 | 0 |
| 9554 | 0 |
| 9555 | 0 |
| 9556 | 0 |
| 9557 | 0 |
| 9558 | 0 |
| 9559 | 0 |
| 9560 | 0 |
| 9561 | 0 |
| 9562 | 0 |
| 9563 | 0 |
| 9564 | 0 |
| 9565 | 0 |
| 9566 | 913 |
| 9567 | 913 |
| 9568 | 913 |
| 9569 | 0 |
| 9570 | 0 |
| 9571 | 0 |
| 9572 | 0 |
| 9573 | 0 |
| 9574 | 0 |
| 9575 | 0 |
| 9576 | 0 |
| 9577 | 0 |
| 9578 | 0 |
| 9579 | 0 |
| 9580 | 0 |
| 9581 | 0 |
| 9582 | 0 |
| 9583 | 0 |
| 9584 | 0 |
| 9585 | 0 |
| 9586 | 0 |
| 9587 | 0 |
| 9588 | 0 |
| 9589 | 0 |
| 9590 | 0 |
| 9591 | 0 |
| 9592 | 0 |
| 9593 | 0 |
| 9594 | 0 |
| 9595 | 0 |
| 9596 | 0 |
| 9597 | 0 |
| 9598 | 0 |
| 9599 | 0 |
| 9600 | 0 |
| 9601 | 0 |
| 9602 | 0 |
| 9603 | 0 |
| 9604 | 0 |
| 9605 | 0 |
| 9606 | 0 |
| 9607 | 0 |
| 9608 | 0 |
| 9609 | 0 |
| 9610 | 0 |
| 9611 | 0 |
| 9612 | 0 |
| 9613 | 0 |
| 9614 | 913 |
| 9615 | 911 |
| 9616 | 912 |
| 9617 | 0 |
| 9618 | 0 |
| 9619 | 0 |
| 9620 | 0 |
| 9621 | 0 |
| 9622 | 0 |
| 9623 | 0 |
| 9624 | 0 |
| 9625 | 0 |
| 9626 | 0 |
| 9627 | 0 |
| 9628 | 0 |
| 9629 | 0 |
| 9630 | 0 |
| 9631 | 0 |
| 9632 | 0 |
| 9633 | 0 |
| 9634 | 0 |
| 9635 | 0 |
| 9636 | 0 |
| 9637 | 0 |
| 9638 | 0 |
| 9639 | 0 |
| 9640 | 0 |
| 9641 | 0 |
| 9642 | 0 |
| 9643 | 0 |
| 9644 | 0 |
| 9645 | 0 |
| 9646 | 0 |
| 9647 | 0 |
| 9648 | 0 |
| 9649 | 0 |
| 9650 | 0 |
| 9651 | 0 |
| 9652 | 0 |
| 9653 | 0 |
| 9654 | 0 |
| 9655 | 0 |
| 9656 | 0 |
| 9657 | 0 |
| 9658 | 0 |
| 9659 | 0 |
| 9660 | 0 |
| 9661 | 0 |
| 9662 | 913 |
| 9663 | 912 |
| 9664 | 909 |
| 9665 | 909 |
| 9666 | 0 |
| 9667 | 0 |
| 9668 | 0 |
| 9669 | 0 |
| 9670 | 0 |
| 9671 | 0 |
| 9672 | 0 |
| 9673 | 0 |
| 9674 | 0 |
| 9675 | 0 |
| 9676 | 0 |
| 9677 | 0 |
| 9678 | 0 |
| 9679 | 0 |
| 9680 | 0 |
| 9681 | 0 |
| 9682 | 0 |
| 9683 | 0 |
| 9684 | 0 |
| 9685 | 0 |
| 9686 | 0 |
| 9687 | 0 |
| 9688 | 0 |
| 9689 | 0 |
| 9690 | 0 |
| 9691 | 0 |
| 9692 | 0 |
| 9693 | 0 |
| 9694 | 0 |
| 9695 | 0 |
| 9696 | 0 |
| 9697 | 0 |
| 9698 | 0 |
| 9699 | 0 |
| 9700 | 0 |
| 9701 | 0 |
| 9702 | 0 |
| 9703 | 0 |
| 9704 | 0 |
| 9705 | 0 |
| 9706 | 0 |
| 9707 | 0 |
| 9708 | 0 |
| 9709 | 0 |
| 9710 | 913 |
| 9711 | 913 |
| 9712 | 911 |
| 9713 | 910 |
| 9714 | 0 |
| 9715 | 0 |
| 9716 | 0 |
| 9717 | 0 |
| 9718 | 0 |
| 9719 | 0 |
| 9720 | 0 |
| 9721 | 0 |
| 9722 | 0 |
| 9723 | 0 |
| 9724 | 0 |
| 9725 | 0 |
| 9726 | 0 |
| 9727 | 0 |
| 9728 | 0 |
| 9729 | 0 |
| 9730 | 0 |
| 9731 | 0 |
| 9732 | 0 |
| 9733 | 0 |
| 9734 | 0 |
| 9735 | 0 |
| 9736 | 0 |
| 9737 | 0 |
| 9738 | 0 |
| 9739 | 0 |
| 9740 | 0 |
| 9741 | 0 |
| 9742 | 0 |
| 9743 | 0 |
| 9744 | 0 |
| 9745 | 0 |
| 9746 | 0 |
| 9747 | 0 |
| 9748 | 0 |
| 9749 | 0 |
| 9750 | 0 |
| 9751 | 0 |
| 9752 | 0 |
| 9753 | 0 |
| 9754 | 0 |
| 9755 | 0 |
| 9756 | 0 |
| 9757 | 0 |
| 9758 | 876 |
| 9759 | 913 |
| 9760 | 913 |
| 9761 | 912 |
| 9762 | 0 |
| 9763 | 0 |
| 9764 | 0 |
| 9765 | 0 |
| 9766 | 0 |
| 9767 | 0 |
| 9768 | 0 |
| 9769 | 0 |
| 9770 | 0 |
| 9771 | 0 |
| 9772 | 0 |
| 9773 | 0 |
| 9774 | 0 |
| 9775 | 0 |
| 9776 | 0 |
| 9777 | 0 |
| 9778 | 0 |
| 9779 | 0 |
| 9780 | 0 |
| 9781 | 0 |
| 9782 | 0 |
| 9783 | 0 |
| 9784 | 0 |
| 9785 | 0 |
| 9786 | 0 |
| 9787 | 0 |
| 9788 | 0 |
| 9789 | 0 |
| 9790 | 0 |
| 9791 | 0 |
| 9792 | 0 |
| 9793 | 0 |
| 9794 | 0 |
| 9795 | 0 |
| 9796 | 0 |
| 9797 | 0 |
| 9798 | 0 |
| 9799 | 0 |
| 9800 | 0 |
| 9801 | 0 |
| 9802 | 0 |
| 9803 | 0 |
| 9804 | 0 |
| 9805 | 0 |
| 9806 | 0 |
| 9807 | 914 |
| 9808 | 913 |
| 9809 | 912 |
| 9810 | 0 |
| 9811 | 0 |
| 9812 | 0 |
| 9813 | 0 |
| 9814 | 0 |
| 9815 | 0 |
| 9816 | 0 |
| 9817 | 0 |
| 9818 | 0 |
| 9819 | 0 |
| 9820 | 0 |
| 9821 | 0 |
| 9822 | 0 |
| 9823 | 0 |
| 9824 | 0 |
| 9825 | 0 |
| 9826 | 0 |
| 9827 | 0 |
| 9828 | 0 |
| 9829 | 0 |
| 9830 | 0 |
| 9831 | 0 |
| 9832 | 0 |
| 9833 | 0 |
| 9834 | 0 |
| 9835 | 0 |
| 9836 | 0 |
| 9837 | 0 |
| 9838 | 0 |
| 9839 | 0 |
| 9840 | 0 |
| 9841 | 0 |
| 9842 | 0 |
| 9843 | 0 |
| 9844 | 0 |
| 9845 | 0 |
| 9846 | 0 |
| 9847 | 0 |
| 9848 | 0 |
| 9849 | 0 |
| 9850 | 0 |
| 9851 | 0 |
| 9852 | 0 |
| 9853 | 0 |
| 9854 | 0 |
| 9855 | 911 |
| 9856 | 910 |
| 9857 | 908 |
| 9858 | 0 |
| 9859 | 0 |
| 9860 | 0 |
| 9861 | 0 |
| 9862 | 0 |
| 9863 | 0 |
| 9864 | 0 |
| 9865 | 0 |
| 9866 | 0 |
| 9867 | 0 |
| 9868 | 0 |
| 9869 | 0 |
| 9870 | 0 |
| 9871 | 0 |
| 9872 | 0 |
| 9873 | 0 |
| 9874 | 0 |
| 9875 | 0 |
| 9876 | 0 |
| 9877 | 0 |
| 9878 | 0 |
| 9879 | 0 |
| 9880 | 0 |
| 9881 | 0 |
| 9882 | 0 |
| 9883 | 0 |
| 9884 | 0 |
| 9885 | 0 |
| 9886 | 0 |
| 9887 | 0 |
| 9888 | 0 |
| 9889 | 0 |
| 9890 | 0 |
| 9891 | 0 |
| 9892 | 0 |
| 9893 | 0 |
| 9894 | 0 |
| 9895 | 0 |
| 9896 | 0 |
| 9897 | 0 |
| 9898 | 0 |
| 9899 | 0 |
| 9900 | 0 |
| 9901 | 0 |
| 9902 | 0 |
| 9903 | 913 |
| 9904 | 913 |
| 9905 | 912 |
| 9906 | 913 |
| 9907 | 0 |
| 9908 | 0 |
| 9909 | 0 |
| 9910 | 0 |
| 9911 | 0 |
| 9912 | 0 |
| 9913 | 0 |
| 9914 | 0 |
| 9915 | 0 |
| 9916 | 0 |
| 9917 | 0 |
| 9918 | 0 |
| 9919 | 0 |
| 9920 | 0 |
| 9921 | 0 |
| 9922 | 0 |
| 9923 | 0 |
| 9924 | 0 |
| 9925 | 0 |
| 9926 | 0 |
| 9927 | 0 |
| 9928 | 0 |
| 9929 | 0 |
| 9930 | 0 |
| 9931 | 0 |
| 9932 | 0 |
| 9933 | 0 |
| 9934 | 0 |
| 9935 | 0 |
| 9936 | 0 |
| 9937 | 0 |
| 9938 | 0 |
| 9939 | 0 |
| 9940 | 0 |
| 9941 | 0 |
| 9942 | 0 |
| 9943 | 0 |
| 9944 | 0 |
| 9945 | 0 |
| 9946 | 0 |
| 9947 | 0 |
| 9948 | 0 |
| 9949 | 0 |
| 9950 | 0 |
| 9951 | 912 |
| 9952 | 912 |
| 9953 | 911 |
| 9954 | 912 |
| 9955 | 0 |
| 9956 | 0 |
| 9957 | 0 |
| 9958 | 0 |
| 9959 | 0 |
| 9960 | 0 |
| 9961 | 0 |
| 9962 | 0 |
| 9963 | 0 |
| 9964 | 0 |
| 9965 | 0 |
| 9966 | 0 |
| 9967 | 0 |
| 9968 | 0 |
| 9969 | 0 |
| 9970 | 0 |
| 9971 | 0 |
| 9972 | 0 |
| 9973 | 0 |
| 9974 | 0 |
| 9975 | 0 |
| 9976 | 0 |
| 9977 | 0 |
| 9978 | 0 |
| 9979 | 0 |
| 9980 | 0 |
| 9981 | 0 |
| 9982 | 0 |
| 9983 | 0 |
| 9984 | 0 |
| 9985 | 0 |
| 9986 | 0 |
| 9987 | 0 |
| 9988 | 0 |
| 9989 | 0 |
| 9990 | 0 |
| 9991 | 0 |
| 9992 | 0 |
| 9993 | 0 |
| 9994 | 0 |
| 9995 | 0 |
| 9996 | 0 |
| 9997 | 0 |
| 9998 | 0 |
| 9999 | 912 |
| 10000 | 910 |
| 10001 | 909 |
| 10002 | 0 |
| 10003 | 0 |
| 10004 | 0 |
| 10005 | 0 |
| 10006 | 0 |
| 10007 | 0 |
| 10008 | 0 |
| 10009 | 0 |
| 10010 | 0 |
| 10011 | 0 |
| 10012 | 0 |
| 10013 | 0 |
| 10014 | 0 |
| 10015 | 0 |
| 10016 | 0 |
| 10017 | 0 |
| 10018 | 0 |
| 10019 | 0 |
| 10020 | 0 |
| 10021 | 0 |
| 10022 | 0 |
| 10023 | 0 |
| 10024 | 0 |
| 10025 | 0 |
| 10026 | 0 |
| 10027 | 0 |
| 10028 | 0 |
| 10029 | 0 |
| 10030 | 0 |
| 10031 | 0 |
| 10032 | 0 |
| 10033 | 0 |
| 10034 | 0 |
| 10035 | 0 |
| 10036 | 0 |
| 10037 | 0 |
| 10038 | 0 |
| 10039 | 0 |
| 10040 | 0 |
| 10041 | 0 |
| 10042 | 0 |
| 10043 | 0 |
| 10044 | 0 |
| 10045 | 0 |
| 10046 | 0 |
| 10047 | 910 |
| 10048 | 912 |
| 10049 | 912 |
| 10050 | 913 |
| 10051 | 0 |
| 10052 | 0 |
| 10053 | 0 |
| 10054 | 0 |
| 10055 | 0 |
| 10056 | 0 |
| 10057 | 0 |
| 10058 | 0 |
| 10059 | 0 |
| 10060 | 0 |
| 10061 | 0 |
| 10062 | 0 |
| 10063 | 0 |
| 10064 | 0 |
| 10065 | 0 |
| 10066 | 0 |
| 10067 | 0 |
| 10068 | 0 |
| 10069 | 0 |
| 10070 | 0 |
| 10071 | 0 |
| 10072 | 0 |
| 10073 | 0 |
| 10074 | 0 |
| 10075 | 0 |
| 10076 | 0 |
| 10077 | 0 |
| 10078 | 0 |
| 10079 | 0 |
| 10080 | 0 |
| 10081 | 0 |
| 10082 | 0 |
| 10083 | 0 |
| 10084 | 0 |
| 10085 | 0 |
| 10086 | 0 |
| 10087 | 0 |
| 10088 | 0 |
| 10089 | 0 |
| 10090 | 0 |
| 10091 | 0 |
| 10092 | 0 |
| 10093 | 0 |
| 10094 | 0 |
| 10095 | 847 |
| 10096 | 911 |
| 10097 | 911 |
| 10098 | 911 |
| 10099 | 0 |
| 10100 | 0 |
| 10101 | 0 |
| 10102 | 0 |
| 10103 | 0 |
| 10104 | 0 |
| 10105 | 0 |
| 10106 | 0 |
| 10107 | 0 |
| 10108 | 0 |
| 10109 | 0 |
| 10110 | 0 |
| 10111 | 0 |
| 10112 | 0 |
| 10113 | 0 |
| 10114 | 0 |
| 10115 | 0 |
| 10116 | 0 |
| 10117 | 0 |
| 10118 | 0 |
| 10119 | 0 |
| 10120 | 0 |
| 10121 | 0 |
| 10122 | 0 |
| 10123 | 0 |
| 10124 | 0 |
| 10125 | 0 |
| 10126 | 0 |
| 10127 | 0 |
| 10128 | 0 |
| 10129 | 0 |
| 10130 | 0 |
| 10131 | 0 |
| 10132 | 0 |
| 10133 | 0 |
| 10134 | 0 |
| 10135 | 0 |
| 10136 | 0 |
| 10137 | 0 |
| 10138 | 0 |
| 10139 | 0 |
| 10140 | 0 |
| 10141 | 0 |
| 10142 | 0 |
| 10143 | 0 |
| 10144 | 914 |
| 10145 | 912 |
| 10146 | 914 |
| 10147 | 0 |
| 10148 | 0 |
| 10149 | 0 |
| 10150 | 0 |
| 10151 | 0 |
| 10152 | 0 |
| 10153 | 0 |
| 10154 | 0 |
| 10155 | 0 |
| 10156 | 0 |
| 10157 | 0 |
| 10158 | 0 |
| 10159 | 0 |
| 10160 | 0 |
| 10161 | 0 |
| 10162 | 0 |
| 10163 | 0 |
| 10164 | 0 |
| 10165 | 0 |
| 10166 | 0 |
| 10167 | 0 |
| 10168 | 0 |
| 10169 | 0 |
| 10170 | 0 |
| 10171 | 0 |
| 10172 | 0 |
| 10173 | 0 |
| 10174 | 0 |
| 10175 | 0 |
| 10176 | 0 |
| 10177 | 0 |
| 10178 | 0 |
| 10179 | 0 |
| 10180 | 0 |
| 10181 | 0 |
| 10182 | 0 |
| 10183 | 0 |
| 10184 | 0 |
| 10185 | 0 |
| 10186 | 0 |
| 10187 | 0 |
| 10188 | 0 |
| 10189 | 0 |
| 10190 | 0 |
| 10191 | 0 |
| 10192 | 912 |
| 10193 | 911 |
| 10194 | 910 |
| 10195 | 0 |
| 10196 | 0 |
| 10197 | 0 |
| 10198 | 0 |
| 10199 | 0 |
| 10200 | 0 |
| 10201 | 0 |
| 10202 | 0 |
| 10203 | 0 |
| 10204 | 0 |
| 10205 | 0 |
| 10206 | 0 |
| 10207 | 0 |
| 10208 | 0 |
| 10209 | 0 |
| 10210 | 0 |
| 10211 | 0 |
| 10212 | 0 |
| 10213 | 0 |
| 10214 | 0 |
| 10215 | 0 |
| 10216 | 0 |
| 10217 | 0 |
| 10218 | 0 |
| 10219 | 0 |
| 10220 | 0 |
| 10221 | 0 |
| 10222 | 0 |
| 10223 | 0 |
| 10224 | 0 |
| 10225 | 0 |
| 10226 | 0 |
| 10227 | 0 |
| 10228 | 0 |
| 10229 | 0 |
| 10230 | 0 |
| 10231 | 0 |
| 10232 | 0 |
| 10233 | 0 |
| 10234 | 0 |
| 10235 | 0 |
| 10236 | 0 |
| 10237 | 0 |
| 10238 | 0 |
| 10239 | 0 |
| 10240 | 912 |
| 10241 | 916 |
| 10242 | 912 |
| 10243 | 912 |
| 10244 | 0 |
| 10245 | 0 |
| 10246 | 0 |
| 10247 | 0 |
| 10248 | 0 |
| 10249 | 0 |
| 10250 | 0 |
| 10251 | 0 |
| 10252 | 0 |
| 10253 | 0 |
| 10254 | 0 |
| 10255 | 0 |
| 10256 | 0 |
| 10257 | 0 |
| 10258 | 0 |
| 10259 | 0 |
| 10260 | 0 |
| 10261 | 0 |
| 10262 | 0 |
| 10263 | 0 |
| 10264 | 0 |
| 10265 | 0 |
| 10266 | 0 |
| 10267 | 0 |
| 10268 | 0 |
| 10269 | 0 |
| 10270 | 0 |
| 10271 | 0 |
| 10272 | 0 |
| 10273 | 0 |
| 10274 | 0 |
| 10275 | 0 |
| 10276 | 0 |
| 10277 | 0 |
| 10278 | 0 |
| 10279 | 0 |
| 10280 | 0 |
| 10281 | 0 |
| 10282 | 0 |
| 10283 | 0 |
| 10284 | 0 |
| 10285 | 0 |
| 10286 | 0 |
| 10287 | 0 |
| 10288 | 0 |
| 10289 | 912 |
| 10290 | 912 |
| 10291 | 912 |
| 10292 | 0 |
| 10293 | 0 |
| 10294 | 0 |
| 10295 | 0 |
| 10296 | 0 |
| 10297 | 0 |
| 10298 | 0 |
| 10299 | 0 |
| 10300 | 0 |
| 10301 | 0 |
| 10302 | 0 |
| 10303 | 0 |
| 10304 | 0 |
| 10305 | 0 |
| 10306 | 0 |
| 10307 | 0 |
| 10308 | 0 |
| 10309 | 0 |
| 10310 | 0 |
| 10311 | 0 |
| 10312 | 0 |
| 10313 | 0 |
| 10314 | 0 |
| 10315 | 0 |
| 10316 | 0 |
| 10317 | 0 |
| 10318 | 0 |
| 10319 | 0 |
| 10320 | 0 |
| 10321 | 0 |
| 10322 | 0 |
| 10323 | 0 |
| 10324 | 0 |
| 10325 | 0 |
| 10326 | 0 |
| 10327 | 0 |
| 10328 | 0 |
| 10329 | 0 |
| 10330 | 0 |
| 10331 | 0 |
| 10332 | 0 |
| 10333 | 0 |
| 10334 | 0 |
| 10335 | 0 |
| 10336 | 0 |
| 10337 | 914 |
| 10338 | 914 |
| 10339 | 912 |
| 10340 | 0 |
| 10341 | 0 |
| 10342 | 0 |
| 10343 | 0 |
| 10344 | 0 |
| 10345 | 0 |
| 10346 | 0 |
| 10347 | 0 |
| 10348 | 0 |
| 10349 | 0 |
| 10350 | 0 |
| 10351 | 0 |
| 10352 | 0 |
| 10353 | 0 |
| 10354 | 0 |
| 10355 | 0 |
| 10356 | 0 |
| 10357 | 0 |
| 10358 | 0 |
| 10359 | 0 |
| 10360 | 0 |
| 10361 | 0 |
| 10362 | 0 |
| 10363 | 0 |
| 10364 | 0 |
| 10365 | 0 |
| 10366 | 0 |
| 10367 | 0 |
| 10368 | 0 |
| 10369 | 0 |
| 10370 | 0 |
| 10371 | 0 |
| 10372 | 0 |
| 10373 | 0 |
| 10374 | 0 |
| 10375 | 0 |
| 10376 | 0 |
| 10377 | 0 |
| 10378 | 0 |
| 10379 | 0 |
| 10380 | 0 |
| 10381 | 0 |
| 10382 | 0 |
| 10383 | 0 |
| 10384 | 0 |
| 10385 | 915 |
| 10386 | 912 |
| 10387 | 910 |
| 10388 | 0 |
| 10389 | 0 |
| 10390 | 0 |
| 10391 | 0 |
| 10392 | 0 |
| 10393 | 0 |
| 10394 | 0 |
| 10395 | 0 |
| 10396 | 0 |
| 10397 | 0 |
| 10398 | 0 |
| 10399 | 0 |
| 10400 | 0 |
| 10401 | 0 |
| 10402 | 0 |
| 10403 | 0 |
| 10404 | 0 |
| 10405 | 0 |
| 10406 | 0 |
| 10407 | 0 |
| 10408 | 0 |
| 10409 | 0 |
| 10410 | 0 |
| 10411 | 0 |
| 10412 | 0 |
| 10413 | 0 |
| 10414 | 0 |
| 10415 | 0 |
| 10416 | 0 |
| 10417 | 0 |
| 10418 | 0 |
| 10419 | 0 |
| 10420 | 0 |
| 10421 | 0 |
| 10422 | 0 |
| 10423 | 0 |
| 10424 | 0 |
| 10425 | 0 |
| 10426 | 0 |
| 10427 | 0 |
| 10428 | 0 |
| 10429 | 0 |
| 10430 | 0 |
| 10431 | 0 |
| 10432 | 0 |
| 10433 | 910 |
| 10434 | 912 |
| 10435 | 911 |
| 10436 | 912 |
| 10437 | 0 |
| 10438 | 0 |
| 10439 | 0 |
| 10440 | 0 |
| 10441 | 0 |
| 10442 | 0 |
| 10443 | 0 |
| 10444 | 0 |
| 10445 | 0 |
| 10446 | 0 |
| 10447 | 0 |
| 10448 | 0 |
| 10449 | 0 |
| 10450 | 0 |
| 10451 | 0 |
| 10452 | 0 |
| 10453 | 0 |
| 10454 | 0 |
| 10455 | 0 |
| 10456 | 0 |
| 10457 | 0 |
| 10458 | 0 |
| 10459 | 0 |
| 10460 | 0 |
| 10461 | 0 |
| 10462 | 0 |
| 10463 | 0 |
| 10464 | 0 |
| 10465 | 0 |
| 10466 | 0 |
| 10467 | 0 |
| 10468 | 0 |
| 10469 | 0 |
| 10470 | 0 |
| 10471 | 0 |
| 10472 | 0 |
| 10473 | 0 |
| 10474 | 0 |
| 10475 | 0 |
| 10476 | 0 |
| 10477 | 0 |
| 10478 | 0 |
| 10479 | 0 |
| 10480 | 0 |
| 10481 | 912 |
| 10482 | 913 |
| 10483 | 912 |
| 10484 | 913 |
| 10485 | 0 |
| 10486 | 0 |
| 10487 | 0 |
| 10488 | 0 |
| 10489 | 0 |
| 10490 | 0 |
| 10491 | 0 |
| 10492 | 0 |
| 10493 | 0 |
| 10494 | 0 |
| 10495 | 0 |
| 10496 | 0 |
| 10497 | 0 |
| 10498 | 0 |
| 10499 | 0 |
| 10500 | 0 |
| 10501 | 0 |
| 10502 | 0 |
| 10503 | 0 |
| 10504 | 0 |
| 10505 | 0 |
| 10506 | 0 |
| 10507 | 0 |
| 10508 | 0 |
| 10509 | 0 |
| 10510 | 0 |
| 10511 | 0 |
| 10512 | 0 |
| 10513 | 0 |
| 10514 | 0 |
| 10515 | 0 |
| 10516 | 0 |
| 10517 | 0 |
| 10518 | 0 |
| 10519 | 0 |
| 10520 | 0 |
| 10521 | 0 |
| 10522 | 0 |
| 10523 | 0 |
| 10524 | 0 |
| 10525 | 0 |
| 10526 | 0 |
| 10527 | 0 |
| 10528 | 0 |
| 10529 | 913 |
| 10530 | 913 |
| 10531 | 912 |
| 10532 | 912 |
| 10533 | 0 |
| 10534 | 0 |
| 10535 | 0 |
| 10536 | 0 |
| 10537 | 0 |
| 10538 | 0 |
| 10539 | 0 |
| 10540 | 0 |
| 10541 | 0 |
| 10542 | 0 |
| 10543 | 0 |
| 10544 | 0 |
| 10545 | 0 |
| 10546 | 0 |
| 10547 | 0 |
| 10548 | 0 |
| 10549 | 0 |
| 10550 | 0 |
| 10551 | 0 |
| 10552 | 0 |
| 10553 | 0 |
| 10554 | 0 |
| 10555 | 0 |
| 10556 | 0 |
| 10557 | 0 |
| 10558 | 0 |
| 10559 | 0 |
| 10560 | 0 |
| 10561 | 0 |
| 10562 | 0 |
| 10563 | 0 |
| 10564 | 0 |
| 10565 | 0 |
| 10566 | 0 |
| 10567 | 0 |
| 10568 | 0 |
| 10569 | 0 |
| 10570 | 0 |
| 10571 | 0 |
| 10572 | 0 |
| 10573 | 0 |
| 10574 | 0 |
| 10575 | 0 |
| 10576 | 0 |
| 10577 | 913 |
| 10578 | 913 |
| 10579 | 912 |
| 10580 | 912 |
| 10581 | 0 |
| 10582 | 0 |
| 10583 | 0 |
| 10584 | 0 |
| 10585 | 0 |
| 10586 | 0 |
| 10587 | 0 |
| 10588 | 0 |
| 10589 | 0 |
| 10590 | 0 |
| 10591 | 0 |
| 10592 | 0 |
| 10593 | 0 |
| 10594 | 0 |
| 10595 | 0 |
| 10596 | 0 |
| 10597 | 0 |
| 10598 | 0 |
| 10599 | 0 |
| 10600 | 0 |
| 10601 | 0 |
| 10602 | 0 |
| 10603 | 0 |
| 10604 | 0 |
| 10605 | 0 |
| 10606 | 0 |
| 10607 | 0 |
| 10608 | 0 |
| 10609 | 0 |
| 10610 | 0 |
| 10611 | 0 |
| 10612 | 0 |
| 10613 | 0 |
| 10614 | 0 |
| 10615 | 0 |
| 10616 | 0 |
| 10617 | 0 |
| 10618 | 0 |
| 10619 | 0 |
| 10620 | 0 |
| 10621 | 0 |
| 10622 | 0 |
| 10623 | 0 |
| 10624 | 0 |
| 10625 | 0 |
| 10626 | 911 |
| 10627 | 909 |
| 10628 | 911 |
| 10629 | 0 |
| 10630 | 0 |
| 10631 | 0 |
| 10632 | 0 |
| 10633 | 0 |
| 10634 | 0 |
| 10635 | 0 |
| 10636 | 0 |
| 10637 | 0 |
| 10638 | 0 |
| 10639 | 0 |
| 10640 | 0 |
| 10641 | 0 |
| 10642 | 0 |
| 10643 | 0 |
| 10644 | 0 |
| 10645 | 0 |
| 10646 | 0 |
| 10647 | 0 |
| 10648 | 0 |
| 10649 | 0 |
| 10650 | 0 |
| 10651 | 0 |
| 10652 | 0 |
| 10653 | 0 |
| 10654 | 0 |
| 10655 | 0 |
| 10656 | 0 |
| 10657 | 0 |
| 10658 | 0 |
| 10659 | 0 |
| 10660 | 0 |
| 10661 | 0 |
| 10662 | 0 |
| 10663 | 0 |
| 10664 | 0 |
| 10665 | 0 |
| 10666 | 0 |
| 10667 | 0 |
| 10668 | 0 |
| 10669 | 0 |
| 10670 | 0 |
| 10671 | 0 |
| 10672 | 0 |
| 10673 | 0 |
| 10674 | 911 |
| 10675 | 911 |
| 10676 | 911 |
| 10677 | 911 |
| 10678 | 0 |
| 10679 | 0 |
| 10680 | 0 |
| 10681 | 0 |
| 10682 | 0 |
| 10683 | 0 |
| 10684 | 0 |
| 10685 | 0 |
| 10686 | 0 |
| 10687 | 0 |
| 10688 | 0 |
| 10689 | 0 |
| 10690 | 0 |
| 10691 | 0 |
| 10692 | 0 |
| 10693 | 0 |
| 10694 | 0 |
| 10695 | 0 |
| 10696 | 0 |
| 10697 | 0 |
| 10698 | 0 |
| 10699 | 0 |
| 10700 | 0 |
| 10701 | 0 |
| 10702 | 0 |
| 10703 | 0 |
| 10704 | 0 |
| 10705 | 0 |
| 10706 | 0 |
| 10707 | 0 |
| 10708 | 0 |
| 10709 | 0 |
| 10710 | 0 |
| 10711 | 0 |
| 10712 | 0 |
| 10713 | 0 |
| 10714 | 0 |
| 10715 | 0 |
| 10716 | 0 |
| 10717 | 0 |
| 10718 | 0 |
| 10719 | 0 |
| 10720 | 0 |
| 10721 | 0 |
| 10722 | 912 |
| 10723 | 913 |
| 10724 | 912 |
| 10725 | 912 |
| 10726 | 0 |
| 10727 | 0 |
| 10728 | 0 |
| 10729 | 0 |
| 10730 | 0 |
| 10731 | 0 |
| 10732 | 0 |
| 10733 | 0 |
| 10734 | 0 |
| 10735 | 0 |
| 10736 | 0 |
| 10737 | 0 |
| 10738 | 0 |
| 10739 | 0 |
| 10740 | 0 |
| 10741 | 0 |
| 10742 | 0 |
| 10743 | 0 |
| 10744 | 0 |
| 10745 | 0 |
| 10746 | 0 |
| 10747 | 0 |
| 10748 | 0 |
| 10749 | 0 |
| 10750 | 0 |
| 10751 | 0 |
| 10752 | 0 |
| 10753 | 0 |
| 10754 | 0 |
| 10755 | 0 |
| 10756 | 0 |
| 10757 | 0 |
| 10758 | 0 |
| 10759 | 0 |
| 10760 | 0 |
| 10761 | 0 |
| 10762 | 0 |
| 10763 | 0 |
| 10764 | 0 |
| 10765 | 0 |
| 10766 | 0 |
| 10767 | 0 |
| 10768 | 0 |
| 10769 | 0 |
| 10770 | 911 |
| 10771 | 914 |
| 10772 | 912 |
| 10773 | 912 |
| 10774 | 0 |
| 10775 | 0 |
| 10776 | 0 |
| 10777 | 0 |
| 10778 | 0 |
| 10779 | 0 |
| 10780 | 0 |
| 10781 | 0 |
| 10782 | 0 |
| 10783 | 0 |
| 10784 | 0 |
| 10785 | 0 |
| 10786 | 0 |
| 10787 | 0 |
| 10788 | 0 |
| 10789 | 0 |
| 10790 | 0 |
| 10791 | 0 |
| 10792 | 0 |
| 10793 | 0 |
| 10794 | 0 |
| 10795 | 0 |
| 10796 | 0 |
| 10797 | 0 |
| 10798 | 0 |
| 10799 | 0 |
| 10800 | 0 |
| 10801 | 0 |
| 10802 | 0 |
| 10803 | 0 |
| 10804 | 0 |
| 10805 | 0 |
| 10806 | 0 |
| 10807 | 0 |
| 10808 | 0 |
| 10809 | 0 |
| 10810 | 0 |
| 10811 | 0 |
| 10812 | 0 |
| 10813 | 0 |
| 10814 | 0 |
| 10815 | 0 |
| 10816 | 0 |
| 10817 | 0 |
| 10818 | 909 |
| 10819 | 910 |
| 10820 | 910 |
| 10821 | 910 |
| 10822 | 0 |
| 10823 | 0 |
| 10824 | 0 |
| 10825 | 0 |
| 10826 | 0 |
| 10827 | 0 |
| 10828 | 0 |
| 10829 | 0 |
| 10830 | 0 |
| 10831 | 0 |
| 10832 | 0 |
| 10833 | 0 |
| 10834 | 0 |
| 10835 | 0 |
| 10836 | 0 |
| 10837 | 0 |
| 10838 | 0 |
| 10839 | 0 |
| 10840 | 0 |
| 10841 | 0 |
| 10842 | 0 |
| 10843 | 0 |
| 10844 | 0 |
| 10845 | 0 |
| 10846 | 0 |
| 10847 | 0 |
| 10848 | 0 |
| 10849 | 0 |
| 10850 | 0 |
| 10851 | 0 |
| 10852 | 0 |
| 10853 | 0 |
| 10854 | 0 |
| 10855 | 0 |
| 10856 | 0 |
| 10857 | 0 |
| 10858 | 0 |
| 10859 | 0 |
| 10860 | 0 |
| 10861 | 0 |
| 10862 | 0 |
| 10863 | 0 |
| 10864 | 0 |
| 10865 | 0 |
| 10866 | 0 |
| 10867 | 912 |
| 10868 | 912 |
| 10869 | 912 |
| 10870 | 0 |
| 10871 | 0 |
| 10872 | 0 |
| 10873 | 0 |
| 10874 | 0 |
| 10875 | 0 |
| 10876 | 0 |
| 10877 | 0 |
| 10878 | 0 |
| 10879 | 0 |
| 10880 | 0 |
| 10881 | 0 |
| 10882 | 0 |
| 10883 | 0 |
| 10884 | 0 |
| 10885 | 0 |
| 10886 | 0 |
| 10887 | 0 |
| 10888 | 0 |
| 10889 | 0 |
| 10890 | 0 |
| 10891 | 0 |
| 10892 | 0 |
| 10893 | 0 |
| 10894 | 0 |
| 10895 | 0 |
| 10896 | 0 |
| 10897 | 0 |
| 10898 | 0 |
| 10899 | 0 |
| 10900 | 0 |
| 10901 | 0 |
| 10902 | 0 |
| 10903 | 0 |
| 10904 | 0 |
| 10905 | 0 |
| 10906 | 0 |
| 10907 | 0 |
| 10908 | 0 |
| 10909 | 0 |
| 10910 | 0 |
| 10911 | 0 |
| 10912 | 0 |
| 10913 | 0 |
| 10914 | 0 |
| 10915 | 913 |
| 10916 | 913 |
| 10917 | 913 |
| 10918 | 0 |
| 10919 | 0 |
| 10920 | 0 |
| 10921 | 0 |
| 10922 | 0 |
| 10923 | 0 |
| 10924 | 0 |
| 10925 | 0 |
| 10926 | 0 |
| 10927 | 0 |
| 10928 | 0 |
| 10929 | 0 |
| 10930 | 0 |
| 10931 | 0 |
| 10932 | 0 |
| 10933 | 0 |
| 10934 | 0 |
| 10935 | 0 |
| 10936 | 0 |
| 10937 | 0 |
| 10938 | 0 |
| 10939 | 0 |
| 10940 | 0 |
| 10941 | 0 |
| 10942 | 0 |
| 10943 | 0 |
| 10944 | 0 |
| 10945 | 0 |
| 10946 | 0 |
| 10947 | 0 |
| 10948 | 0 |
| 10949 | 0 |
| 10950 | 0 |
| 10951 | 0 |
| 10952 | 0 |
| 10953 | 0 |
| 10954 | 0 |
| 10955 | 0 |
| 10956 | 0 |
| 10957 | 0 |
| 10958 | 0 |
| 10959 | 0 |
| 10960 | 0 |
| 10961 | 0 |
| 10962 | 0 |
| 10963 | 910 |
| 10964 | 910 |
| 10965 | 908 |
| 10966 | 909 |
| 10967 | 0 |
| 10968 | 0 |
| 10969 | 0 |
| 10970 | 0 |
| 10971 | 0 |
| 10972 | 0 |
| 10973 | 0 |
| 10974 | 0 |
| 10975 | 0 |
| 10976 | 0 |
| 10977 | 0 |
| 10978 | 0 |
| 10979 | 0 |
| 10980 | 0 |
| 10981 | 0 |
| 10982 | 0 |
| 10983 | 0 |
| 10984 | 0 |
| 10985 | 0 |
| 10986 | 0 |
| 10987 | 0 |
| 10988 | 0 |
| 10989 | 0 |
| 10990 | 0 |
| 10991 | 0 |
| 10992 | 0 |
| 10993 | 0 |
| 10994 | 0 |
| 10995 | 0 |
| 10996 | 0 |
| 10997 | 0 |
| 10998 | 0 |
| 10999 | 0 |
| 11000 | 0 |
| 11001 | 0 |
| 11002 | 0 |
| 11003 | 0 |
| 11004 | 0 |
| 11005 | 0 |
| 11006 | 0 |
| 11007 | 0 |
| 11008 | 0 |
| 11009 | 0 |
| 11010 | 0 |
| 11011 | 0 |
| 11012 | 915 |
| 11013 | 914 |
| 11014 | 912 |
| 11015 | 0 |
| 11016 | 0 |
| 11017 | 0 |
| 11018 | 0 |
| 11019 | 0 |
| 11020 | 0 |
| 11021 | 0 |
| 11022 | 0 |
| 11023 | 0 |
| 11024 | 0 |
| 11025 | 0 |
| 11026 | 0 |
| 11027 | 0 |
| 11028 | 0 |
| 11029 | 0 |
| 11030 | 0 |
| 11031 | 0 |
| 11032 | 0 |
| 11033 | 0 |
| 11034 | 0 |
| 11035 | 0 |
| 11036 | 0 |
| 11037 | 0 |
| 11038 | 0 |
| 11039 | 0 |
| 11040 | 0 |
| 11041 | 0 |
| 11042 | 0 |
| 11043 | 0 |
| 11044 | 0 |
| 11045 | 0 |
| 11046 | 0 |
| 11047 | 0 |
| 11048 | 0 |
| 11049 | 0 |
| 11050 | 0 |
| 11051 | 0 |
| 11052 | 0 |
| 11053 | 0 |
| 11054 | 0 |
| 11055 | 0 |
| 11056 | 0 |
| 11057 | 0 |
| 11058 | 0 |
| 11059 | 0 |
| 11060 | 910 |
| 11061 | 911 |
| 11062 | 911 |
| 11063 | 0 |
| 11064 | 0 |
| 11065 | 0 |
| 11066 | 0 |
| 11067 | 0 |
| 11068 | 0 |
| 11069 | 0 |
| 11070 | 0 |
| 11071 | 0 |
| 11072 | 0 |
| 11073 | 0 |
| 11074 | 0 |
| 11075 | 0 |
| 11076 | 0 |
| 11077 | 0 |
| 11078 | 0 |
| 11079 | 0 |
| 11080 | 0 |
| 11081 | 0 |
| 11082 | 0 |
| 11083 | 0 |
| 11084 | 0 |
| 11085 | 0 |
| 11086 | 0 |
| 11087 | 0 |
| 11088 | 0 |
| 11089 | 0 |
| 11090 | 0 |
| 11091 | 0 |
| 11092 | 0 |
| 11093 | 0 |
| 11094 | 0 |
| 11095 | 0 |
| 11096 | 0 |
| 11097 | 0 |
| 11098 | 0 |
| 11099 | 0 |
| 11100 | 0 |
| 11101 | 0 |
| 11102 | 0 |
| 11103 | 0 |
| 11104 | 0 |
| 11105 | 0 |
| 11106 | 0 |
| 11107 | 0 |
| 11108 | 912 |
| 11109 | 912 |
| 11110 | 912 |
| 11111 | 908 |
| 11112 | 0 |
| 11113 | 0 |
| 11114 | 0 |
| 11115 | 0 |
| 11116 | 0 |
| 11117 | 0 |
| 11118 | 0 |
| 11119 | 0 |
| 11120 | 0 |
| 11121 | 0 |
| 11122 | 0 |
| 11123 | 0 |
| 11124 | 0 |
| 11125 | 0 |
| 11126 | 0 |
| 11127 | 0 |
| 11128 | 0 |
| 11129 | 0 |
| 11130 | 0 |
| 11131 | 0 |
| 11132 | 0 |
| 11133 | 0 |
| 11134 | 0 |
| 11135 | 0 |
| 11136 | 0 |
| 11137 | 0 |
| 11138 | 0 |
| 11139 | 0 |
| 11140 | 0 |
| 11141 | 0 |
| 11142 | 0 |
| 11143 | 0 |
| 11144 | 0 |
| 11145 | 0 |
| 11146 | 0 |
| 11147 | 0 |
| 11148 | 0 |
| 11149 | 0 |
| 11150 | 0 |
| 11151 | 0 |
| 11152 | 0 |
| 11153 | 0 |
| 11154 | 0 |
| 11155 | 0 |
| 11156 | 914 |
| 11157 | 913 |
| 11158 | 914 |
| 11159 | 911 |
| 11160 | 0 |
| 11161 | 0 |
| 11162 | 0 |
| 11163 | 0 |
| 11164 | 0 |
| 11165 | 0 |
| 11166 | 0 |
| 11167 | 0 |
| 11168 | 0 |
| 11169 | 0 |
| 11170 | 0 |
| 11171 | 0 |
| 11172 | 0 |
| 11173 | 0 |
| 11174 | 0 |
| 11175 | 0 |
| 11176 | 0 |
| 11177 | 0 |
| 11178 | 0 |
| 11179 | 0 |
| 11180 | 0 |
| 11181 | 0 |
| 11182 | 0 |
| 11183 | 0 |
| 11184 | 0 |
| 11185 | 0 |
| 11186 | 0 |
| 11187 | 0 |
| 11188 | 0 |
| 11189 | 0 |
| 11190 | 0 |
| 11191 | 0 |
| 11192 | 0 |
| 11193 | 0 |
| 11194 | 0 |
| 11195 | 0 |
| 11196 | 0 |
| 11197 | 0 |
| 11198 | 0 |
| 11199 | 0 |
| 11200 | 0 |
| 11201 | 0 |
| 11202 | 0 |
| 11203 | 0 |
| 11204 | 912 |
| 11205 | 913 |
| 11206 | 912 |
| 11207 | 911 |
| 11208 | 0 |
| 11209 | 0 |
| 11210 | 0 |
| 11211 | 0 |
| 11212 | 0 |
| 11213 | 0 |
| 11214 | 0 |
| 11215 | 0 |
| 11216 | 0 |
| 11217 | 0 |
| 11218 | 0 |
| 11219 | 0 |
| 11220 | 0 |
| 11221 | 0 |
| 11222 | 0 |
| 11223 | 0 |
| 11224 | 0 |
| 11225 | 0 |
| 11226 | 0 |
| 11227 | 0 |
| 11228 | 0 |
| 11229 | 0 |
| 11230 | 0 |
| 11231 | 0 |
| 11232 | 0 |
| 11233 | 0 |
| 11234 | 0 |
| 11235 | 0 |
| 11236 | 0 |
| 11237 | 0 |
| 11238 | 0 |
| 11239 | 0 |
| 11240 | 0 |
| 11241 | 0 |
| 11242 | 0 |
| 11243 | 0 |
| 11244 | 0 |
| 11245 | 0 |
| 11246 | 0 |
| 11247 | 0 |
| 11248 | 0 |
| 11249 | 0 |
| 11250 | 0 |
| 11251 | 0 |
| 11252 | 913 |
| 11253 | 913 |
| 11254 | 913 |
| 11255 | 911 |
| 11256 | 0 |
| 11257 | 0 |
| 11258 | 0 |
| 11259 | 0 |
| 11260 | 0 |
| 11261 | 0 |
| 11262 | 0 |
| 11263 | 0 |
| 11264 | 0 |
| 11265 | 0 |
| 11266 | 0 |
| 11267 | 0 |
| 11268 | 0 |
| 11269 | 0 |
| 11270 | 0 |
| 11271 | 0 |
| 11272 | 0 |
| 11273 | 0 |
| 11274 | 0 |
| 11275 | 0 |
| 11276 | 0 |
| 11277 | 0 |
| 11278 | 0 |
| 11279 | 0 |
| 11280 | 0 |
| 11281 | 0 |
| 11282 | 0 |
| 11283 | 0 |
| 11284 | 0 |
| 11285 | 0 |
| 11286 | 0 |
| 11287 | 0 |
| 11288 | 0 |
| 11289 | 0 |
| 11290 | 0 |
| 11291 | 0 |
| 11292 | 0 |
| 11293 | 0 |
| 11294 | 0 |
| 11295 | 0 |
| 11296 | 0 |
| 11297 | 0 |
| 11298 | 0 |
| 11299 | 0 |
| 11300 | 913 |
| 11301 | 913 |
| 11302 | 913 |
| 11303 | 911 |
| 11304 | 0 |
| 11305 | 0 |
| 11306 | 0 |
| 11307 | 0 |
| 11308 | 0 |
| 11309 | 0 |
| 11310 | 0 |
| 11311 | 0 |
| 11312 | 0 |
| 11313 | 0 |
| 11314 | 0 |
| 11315 | 0 |
| 11316 | 0 |
| 11317 | 0 |
| 11318 | 0 |
| 11319 | 0 |
| 11320 | 0 |
| 11321 | 0 |
| 11322 | 0 |
| 11323 | 0 |
| 11324 | 0 |
| 11325 | 0 |
| 11326 | 0 |
| 11327 | 0 |
| 11328 | 0 |
| 11329 | 0 |
| 11330 | 0 |
| 11331 | 0 |
| 11332 | 0 |
| 11333 | 0 |
| 11334 | 0 |
| 11335 | 0 |
| 11336 | 0 |
| 11337 | 0 |
| 11338 | 0 |
| 11339 | 0 |
| 11340 | 0 |
| 11341 | 0 |
| 11342 | 0 |
| 11343 | 0 |
| 11344 | 0 |
| 11345 | 0 |
| 11346 | 0 |
| 11347 | 0 |
| 11348 | 913 |
| 11349 | 913 |
| 11350 | 912 |
| 11351 | 911 |
| 11352 | 0 |
| 11353 | 0 |
| 11354 | 0 |
| 11355 | 0 |
| 11356 | 0 |
| 11357 | 0 |
| 11358 | 0 |
| 11359 | 0 |
| 11360 | 0 |
| 11361 | 0 |
| 11362 | 0 |
| 11363 | 0 |
| 11364 | 0 |
| 11365 | 0 |
| 11366 | 0 |
| 11367 | 0 |
| 11368 | 0 |
| 11369 | 0 |
| 11370 | 0 |
| 11371 | 0 |
| 11372 | 0 |
| 11373 | 0 |
| 11374 | 0 |
| 11375 | 0 |
| 11376 | 0 |
| 11377 | 0 |
| 11378 | 0 |
| 11379 | 0 |
| 11380 | 0 |
| 11381 | 0 |
| 11382 | 0 |
| 11383 | 0 |
| 11384 | 0 |
| 11385 | 0 |
| 11386 | 0 |
| 11387 | 0 |
| 11388 | 0 |
| 11389 | 0 |
| 11390 | 0 |
| 11391 | 0 |
| 11392 | 0 |
| 11393 | 0 |
| 11394 | 0 |
| 11395 | 0 |
| 11396 | 0 |
| 11397 | 912 |
| 11398 | 910 |
| 11399 | 910 |
| 11400 | 0 |
| 11401 | 0 |
| 11402 | 0 |
| 11403 | 0 |
| 11404 | 0 |
| 11405 | 0 |
| 11406 | 0 |
| 11407 | 0 |
| 11408 | 0 |
| 11409 | 0 |
| 11410 | 0 |
| 11411 | 0 |
| 11412 | 0 |
| 11413 | 0 |
| 11414 | 0 |
| 11415 | 0 |
| 11416 | 0 |
| 11417 | 0 |
| 11418 | 0 |
| 11419 | 0 |
| 11420 | 0 |
| 11421 | 0 |
| 11422 | 0 |
| 11423 | 0 |
| 11424 | 0 |
| 11425 | 0 |
| 11426 | 0 |
| 11427 | 0 |
| 11428 | 0 |
| 11429 | 0 |
| 11430 | 0 |
| 11431 | 0 |
| 11432 | 0 |
| 11433 | 0 |
| 11434 | 0 |
| 11435 | 0 |
| 11436 | 0 |
| 11437 | 0 |
| 11438 | 0 |
| 11439 | 0 |
| 11440 | 0 |
| 11441 | 0 |
| 11442 | 0 |
| 11443 | 0 |
| 11444 | 0 |
| 11445 | 910 |
| 11446 | 911 |
| 11447 | 911 |
| 11448 | 0 |
| 11449 | 0 |
| 11450 | 0 |
| 11451 | 0 |
| 11452 | 0 |
| 11453 | 0 |
| 11454 | 0 |
| 11455 | 0 |
| 11456 | 0 |
| 11457 | 0 |
| 11458 | 0 |
| 11459 | 0 |
| 11460 | 0 |
| 11461 | 0 |
| 11462 | 0 |
| 11463 | 0 |
| 11464 | 0 |
| 11465 | 0 |
| 11466 | 0 |
| 11467 | 0 |
| 11468 | 0 |
| 11469 | 0 |
| 11470 | 0 |
| 11471 | 0 |
| 11472 | 0 |
| 11473 | 0 |
| 11474 | 0 |
| 11475 | 0 |
| 11476 | 0 |
| 11477 | 0 |
| 11478 | 0 |
| 11479 | 0 |
| 11480 | 0 |
| 11481 | 0 |
| 11482 | 0 |
| 11483 | 0 |
| 11484 | 0 |
| 11485 | 0 |
| 11486 | 0 |
| 11487 | 0 |
| 11488 | 0 |
| 11489 | 0 |
| 11490 | 0 |
| 11491 | 0 |
| 11492 | 0 |
| 11493 | 911 |
| 11494 | 912 |
| 11495 | 912 |
| 11496 | 912 |
| 11497 | 0 |
| 11498 | 0 |
| 11499 | 0 |
| 11500 | 0 |
| 11501 | 0 |
| 11502 | 0 |
| 11503 | 0 |
| 11504 | 0 |
| 11505 | 0 |
| 11506 | 0 |
| 11507 | 0 |
| 11508 | 0 |
| 11509 | 0 |
| 11510 | 0 |
| 11511 | 0 |
| 11512 | 0 |
| 11513 | 0 |
| 11514 | 0 |
| 11515 | 0 |
| 11516 | 0 |
| 11517 | 0 |
| 11518 | 0 |
| 11519 | 0 |
| 11520 | 0 |
| 11521 | 0 |
| 11522 | 0 |
| 11523 | 0 |
| 11524 | 0 |
| 11525 | 0 |
| 11526 | 0 |
| 11527 | 0 |
| 11528 | 0 |
| 11529 | 0 |
| 11530 | 0 |
| 11531 | 0 |
| 11532 | 0 |
| 11533 | 0 |
| 11534 | 0 |
| 11535 | 0 |
| 11536 | 0 |
| 11537 | 0 |
| 11538 | 0 |
| 11539 | 0 |
| 11540 | 0 |
| 11541 | 913 |
| 11542 | 912 |
| 11543 | 911 |
| 11544 | 912 |
| 11545 | 0 |
| 11546 | 0 |
| 11547 | 0 |
| 11548 | 0 |
| 11549 | 0 |
| 11550 | 0 |
| 11551 | 0 |
| 11552 | 0 |
| 11553 | 0 |
| 11554 | 0 |
| 11555 | 0 |
| 11556 | 0 |
| 11557 | 0 |
| 11558 | 0 |
| 11559 | 0 |
| 11560 | 0 |
| 11561 | 0 |
| 11562 | 0 |
| 11563 | 0 |
| 11564 | 0 |
| 11565 | 0 |
| 11566 | 0 |
| 11567 | 0 |
| 11568 | 0 |
| 11569 | 0 |
| 11570 | 0 |
| 11571 | 0 |
| 11572 | 0 |
| 11573 | 0 |
| 11574 | 0 |
| 11575 | 0 |
| 11576 | 0 |
| 11577 | 0 |
| 11578 | 0 |
| 11579 | 0 |
| 11580 | 0 |
| 11581 | 0 |
| 11582 | 0 |
| 11583 | 0 |
| 11584 | 0 |
| 11585 | 0 |
| 11586 | 0 |
| 11587 | 0 |
| 11588 | 0 |
| 11589 | 910 |
| 11590 | 911 |
| 11591 | 911 |
| 11592 | 911 |
| 11593 | 0 |
| 11594 | 0 |
| 11595 | 0 |
| 11596 | 0 |
| 11597 | 0 |
| 11598 | 0 |
| 11599 | 0 |
| 11600 | 0 |
| 11601 | 0 |
| 11602 | 0 |
| 11603 | 0 |
| 11604 | 0 |
| 11605 | 0 |
| 11606 | 0 |
| 11607 | 0 |
| 11608 | 0 |
| 11609 | 0 |
| 11610 | 0 |
| 11611 | 0 |
| 11612 | 0 |
| 11613 | 0 |
| 11614 | 0 |
| 11615 | 0 |
| 11616 | 0 |
| 11617 | 0 |
| 11618 | 0 |
| 11619 | 0 |
| 11620 | 0 |
| 11621 | 0 |
| 11622 | 0 |
| 11623 | 0 |
| 11624 | 0 |
| 11625 | 0 |
| 11626 | 0 |
| 11627 | 0 |
| 11628 | 0 |
| 11629 | 0 |
| 11630 | 0 |
| 11631 | 0 |
| 11632 | 0 |
| 11633 | 0 |
| 11634 | 0 |
| 11635 | 0 |
| 11636 | 0 |
| 11637 | 0 |
| 11638 | 910 |
| 11639 | 910 |
| 11640 | 909 |
| 11641 | 0 |
| 11642 | 0 |
| 11643 | 0 |
| 11644 | 0 |
| 11645 | 0 |
| 11646 | 0 |
| 11647 | 0 |
| 11648 | 0 |
| 11649 | 0 |
| 11650 | 0 |
| 11651 | 0 |
| 11652 | 0 |
| 11653 | 0 |
| 11654 | 0 |
| 11655 | 0 |
| 11656 | 0 |
| 11657 | 0 |
| 11658 | 0 |
| 11659 | 0 |
| 11660 | 0 |
| 11661 | 0 |
| 11662 | 0 |
| 11663 | 0 |
| 11664 | 0 |
| 11665 | 0 |
| 11666 | 0 |
| 11667 | 0 |
| 11668 | 0 |
| 11669 | 0 |
| 11670 | 0 |
| 11671 | 0 |
| 11672 | 0 |
| 11673 | 0 |
| 11674 | 0 |
| 11675 | 0 |
| 11676 | 0 |
| 11677 | 0 |
| 11678 | 0 |
| 11679 | 0 |
| 11680 | 0 |
| 11681 | 0 |
| 11682 | 0 |
| 11683 | 0 |
| 11684 | 0 |
| 11685 | 0 |
| 11686 | 908 |
| 11687 | 910 |
| 11688 | 910 |
| 11689 | 911 |
| 11690 | 0 |
| 11691 | 0 |
| 11692 | 0 |
| 11693 | 0 |
| 11694 | 0 |
| 11695 | 0 |
| 11696 | 0 |
| 11697 | 0 |
| 11698 | 0 |
| 11699 | 0 |
| 11700 | 0 |
| 11701 | 0 |
| 11702 | 0 |
| 11703 | 0 |
| 11704 | 0 |
| 11705 | 0 |
| 11706 | 0 |
| 11707 | 0 |
| 11708 | 0 |
| 11709 | 0 |
| 11710 | 0 |
| 11711 | 0 |
| 11712 | 0 |
| 11713 | 0 |
| 11714 | 0 |
| 11715 | 0 |
| 11716 | 0 |
| 11717 | 0 |
| 11718 | 0 |
| 11719 | 0 |
| 11720 | 0 |
| 11721 | 0 |
| 11722 | 0 |
| 11723 | 0 |
| 11724 | 0 |
| 11725 | 0 |
| 11726 | 0 |
| 11727 | 0 |
| 11728 | 0 |
| 11729 | 0 |
| 11730 | 0 |
| 11731 | 0 |
| 11732 | 0 |
| 11733 | 0 |
| 11734 | 913 |
| 11735 | 913 |
| 11736 | 912 |
| 11737 | 912 |
| 11738 | 0 |
| 11739 | 0 |
| 11740 | 0 |
| 11741 | 0 |
| 11742 | 0 |
| 11743 | 0 |
| 11744 | 0 |
| 11745 | 0 |
| 11746 | 0 |
| 11747 | 0 |
| 11748 | 0 |
| 11749 | 0 |
| 11750 | 0 |
| 11751 | 0 |
| 11752 | 0 |
| 11753 | 0 |
| 11754 | 0 |
| 11755 | 0 |
| 11756 | 0 |
| 11757 | 0 |
| 11758 | 0 |
| 11759 | 0 |
| 11760 | 0 |
| 11761 | 0 |
| 11762 | 0 |
| 11763 | 0 |
| 11764 | 0 |
| 11765 | 0 |
| 11766 | 0 |
| 11767 | 0 |
| 11768 | 0 |
| 11769 | 0 |
| 11770 | 0 |
| 11771 | 0 |
| 11772 | 0 |
| 11773 | 0 |
| 11774 | 0 |
| 11775 | 0 |
| 11776 | 0 |
| 11777 | 0 |
| 11778 | 0 |
| 11779 | 0 |
| 11780 | 0 |
| 11781 | 0 |
| 11782 | 910 |
| 11783 | 911 |
| 11784 | 911 |
| 11785 | 911 |
| 11786 | 0 |
| 11787 | 0 |
| 11788 | 0 |
| 11789 | 0 |
| 11790 | 0 |
| 11791 | 0 |
| 11792 | 0 |
| 11793 | 0 |
| 11794 | 0 |
| 11795 | 0 |
| 11796 | 0 |
| 11797 | 0 |
| 11798 | 0 |
| 11799 | 0 |
| 11800 | 0 |
| 11801 | 0 |
| 11802 | 0 |
| 11803 | 0 |
| 11804 | 0 |
| 11805 | 0 |
| 11806 | 0 |
| 11807 | 0 |
| 11808 | 0 |
| 11809 | 0 |
| 11810 | 0 |
| 11811 | 0 |
| 11812 | 0 |
| 11813 | 0 |
| 11814 | 0 |
| 11815 | 0 |
| 11816 | 0 |
| 11817 | 0 |
| 11818 | 0 |
| 11819 | 0 |
| 11820 | 0 |
| 11821 | 0 |
| 11822 | 0 |
| 11823 | 0 |
| 11824 | 0 |
| 11825 | 0 |
| 11826 | 0 |
| 11827 | 0 |
| 11828 | 0 |
| 11829 | 0 |
| 11830 | 913 |
| 11831 | 913 |
| 11832 | 912 |
| 11833 | 912 |
| 11834 | 0 |
| 11835 | 0 |
| 11836 | 0 |
| 11837 | 0 |
| 11838 | 0 |
| 11839 | 0 |
| 11840 | 0 |
| 11841 | 0 |
| 11842 | 0 |
| 11843 | 0 |
| 11844 | 0 |
| 11845 | 0 |
| 11846 | 0 |
| 11847 | 0 |
| 11848 | 0 |
| 11849 | 0 |
| 11850 | 0 |
| 11851 | 0 |
| 11852 | 0 |
| 11853 | 0 |
| 11854 | 0 |
| 11855 | 0 |
| 11856 | 0 |
| 11857 | 0 |
| 11858 | 0 |
| 11859 | 0 |
| 11860 | 0 |
| 11861 | 0 |
| 11862 | 0 |
| 11863 | 0 |
| 11864 | 0 |
| 11865 | 0 |
| 11866 | 0 |
| 11867 | 0 |
| 11868 | 0 |
| 11869 | 0 |
| 11870 | 0 |
| 11871 | 0 |
| 11872 | 0 |
| 11873 | 0 |
| 11874 | 0 |
| 11875 | 0 |
| 11876 | 0 |
| 11877 | 0 |
| 11878 | 0 |
| 11879 | 913 |
| 11880 | 913 |
| 11881 | 911 |
| 11882 | 0 |
| 11883 | 0 |
| 11884 | 0 |
| 11885 | 0 |
| 11886 | 0 |
| 11887 | 0 |
| 11888 | 0 |
| 11889 | 0 |
| 11890 | 0 |
| 11891 | 0 |
| 11892 | 0 |
| 11893 | 0 |
| 11894 | 0 |
| 11895 | 0 |
| 11896 | 0 |
| 11897 | 0 |
| 11898 | 0 |
| 11899 | 0 |
| 11900 | 0 |
| 11901 | 0 |
| 11902 | 0 |
| 11903 | 0 |
| 11904 | 0 |
| 11905 | 0 |
| 11906 | 0 |
| 11907 | 0 |
| 11908 | 0 |
| 11909 | 0 |
| 11910 | 0 |
| 11911 | 0 |
| 11912 | 0 |
| 11913 | 0 |
| 11914 | 0 |
| 11915 | 0 |
| 11916 | 0 |
| 11917 | 0 |
| 11918 | 0 |
| 11919 | 0 |
| 11920 | 0 |
| 11921 | 0 |
| 11922 | 0 |
| 11923 | 0 |
| 11924 | 0 |
| 11925 | 0 |
| 11926 | 0 |
| 11927 | 912 |
| 11928 | 913 |
| 11929 | 912 |
| 11930 | 0 |
| 11931 | 0 |
| 11932 | 0 |
| 11933 | 0 |
| 11934 | 0 |
| 11935 | 0 |
| 11936 | 0 |
| 11937 | 0 |
| 11938 | 0 |
| 11939 | 0 |
| 11940 | 0 |
| 11941 | 0 |
| 11942 | 0 |
| 11943 | 0 |
| 11944 | 0 |
| 11945 | 0 |
| 11946 | 0 |
| 11947 | 0 |
| 11948 | 0 |
| 11949 | 0 |
| 11950 | 0 |
| 11951 | 0 |
| 11952 | 0 |
| 11953 | 0 |
| 11954 | 0 |
| 11955 | 0 |
| 11956 | 0 |
| 11957 | 0 |
| 11958 | 0 |
| 11959 | 0 |
| 11960 | 0 |
| 11961 | 0 |
| 11962 | 0 |
| 11963 | 0 |
| 11964 | 0 |
| 11965 | 0 |
| 11966 | 0 |
| 11967 | 0 |
| 11968 | 0 |
| 11969 | 0 |
| 11970 | 0 |
| 11971 | 0 |
| 11972 | 0 |
| 11973 | 0 |
| 11974 | 0 |
| 11975 | 911 |
| 11976 | 911 |
| 11977 | 911 |
| 11978 | 912 |
| 11979 | 0 |
| 11980 | 0 |
| 11981 | 0 |
| 11982 | 0 |
| 11983 | 0 |
| 11984 | 0 |
| 11985 | 0 |
| 11986 | 0 |
| 11987 | 0 |
| 11988 | 0 |
| 11989 | 0 |
| 11990 | 0 |
| 11991 | 0 |
| 11992 | 0 |
| 11993 | 0 |
| 11994 | 0 |
| 11995 | 0 |
| 11996 | 0 |
| 11997 | 0 |
| 11998 | 0 |
| 11999 | 0 |
| 12000 | 0 |
| 12001 | 0 |
| 12002 | 0 |
| 12003 | 0 |
| 12004 | 0 |
| 12005 | 0 |
| 12006 | 0 |
| 12007 | 0 |
| 12008 | 0 |
| 12009 | 0 |
| 12010 | 0 |
| 12011 | 0 |
| 12012 | 0 |
| 12013 | 0 |
| 12014 | 0 |
| 12015 | 0 |
| 12016 | 0 |
| 12017 | 0 |
| 12018 | 0 |
| 12019 | 0 |
| 12020 | 0 |
| 12021 | 0 |
| 12022 | 0 |
| 12023 | 911 |
| 12024 | 913 |
| 12025 | 913 |
| 12026 | 912 |
| 12027 | 0 |
| 12028 | 0 |
| 12029 | 0 |
| 12030 | 0 |
| 12031 | 0 |
| 12032 | 0 |
| 12033 | 0 |
| 12034 | 0 |
| 12035 | 0 |
| 12036 | 0 |
| 12037 | 0 |
| 12038 | 0 |
| 12039 | 0 |
| 12040 | 0 |
| 12041 | 0 |
| 12042 | 0 |
| 12043 | 0 |
| 12044 | 0 |
| 12045 | 0 |
| 12046 | 0 |
| 12047 | 0 |
| 12048 | 0 |
| 12049 | 0 |
| 12050 | 0 |
| 12051 | 0 |
| 12052 | 0 |
| 12053 | 0 |
| 12054 | 0 |
| 12055 | 0 |
| 12056 | 0 |
| 12057 | 0 |
| 12058 | 0 |
| 12059 | 0 |
| 12060 | 0 |
| 12061 | 0 |
| 12062 | 0 |
| 12063 | 0 |
| 12064 | 0 |
| 12065 | 0 |
| 12066 | 0 |
| 12067 | 0 |
| 12068 | 0 |
| 12069 | 0 |
| 12070 | 0 |
| 12071 | 909 |
| 12072 | 911 |
| 12073 | 909 |
| 12074 | 909 |
| 12075 | 0 |
| 12076 | 0 |
| 12077 | 0 |
| 12078 | 0 |
| 12079 | 0 |
| 12080 | 0 |
| 12081 | 0 |
| 12082 | 0 |
| 12083 | 0 |
| 12084 | 0 |
| 12085 | 0 |
| 12086 | 0 |
| 12087 | 0 |
| 12088 | 0 |
| 12089 | 0 |
| 12090 | 0 |
| 12091 | 0 |
| 12092 | 0 |
| 12093 | 0 |
| 12094 | 0 |
| 12095 | 0 |
| 12096 | 0 |
| 12097 | 0 |
| 12098 | 0 |
| 12099 | 0 |
| 12100 | 0 |
| 12101 | 0 |
| 12102 | 0 |
| 12103 | 0 |
| 12104 | 0 |
| 12105 | 0 |
| 12106 | 0 |
| 12107 | 0 |
| 12108 | 0 |
| 12109 | 0 |
| 12110 | 0 |
| 12111 | 0 |
| 12112 | 0 |
| 12113 | 0 |
| 12114 | 0 |
| 12115 | 0 |
| 12116 | 0 |
| 12117 | 0 |
| 12118 | 0 |
| 12119 | 913 |
| 12120 | 912 |
| 12121 | 912 |
| 12122 | 913 |
| 12123 | 0 |
| 12124 | 0 |
| 12125 | 0 |
| 12126 | 0 |
| 12127 | 0 |
| 12128 | 0 |
| 12129 | 0 |
| 12130 | 0 |
| 12131 | 0 |
| 12132 | 0 |
| 12133 | 0 |
| 12134 | 0 |
| 12135 | 0 |
| 12136 | 0 |
| 12137 | 0 |
| 12138 | 0 |
| 12139 | 0 |
| 12140 | 0 |
| 12141 | 0 |
| 12142 | 0 |
| 12143 | 0 |
| 12144 | 0 |
| 12145 | 0 |
| 12146 | 0 |
| 12147 | 0 |
| 12148 | 0 |
| 12149 | 0 |
| 12150 | 0 |
| 12151 | 0 |
| 12152 | 0 |
| 12153 | 0 |
| 12154 | 0 |
| 12155 | 0 |
| 12156 | 0 |
| 12157 | 0 |
| 12158 | 0 |
| 12159 | 0 |
| 12160 | 0 |
| 12161 | 0 |
| 12162 | 0 |
| 12163 | 0 |
| 12164 | 0 |
| 12165 | 0 |
| 12166 | 0 |
| 12167 | 452 |
| 12168 | 911 |
| 12169 | 909 |
| 12170 | 909 |
| 12171 | 0 |
| 12172 | 0 |
| 12173 | 0 |
| 12174 | 0 |
| 12175 | 0 |
| 12176 | 0 |
| 12177 | 0 |
| 12178 | 0 |
| 12179 | 0 |
| 12180 | 0 |
| 12181 | 0 |
| 12182 | 0 |
| 12183 | 0 |
| 12184 | 0 |
| 12185 | 0 |
| 12186 | 0 |
| 12187 | 0 |
| 12188 | 0 |
| 12189 | 0 |
| 12190 | 0 |
| 12191 | 0 |
| 12192 | 0 |
| 12193 | 0 |
| 12194 | 0 |
| 12195 | 0 |
| 12196 | 0 |
| 12197 | 0 |
| 12198 | 0 |
| 12199 | 0 |
| 12200 | 0 |
| 12201 | 0 |
| 12202 | 0 |
| 12203 | 0 |
| 12204 | 0 |
| 12205 | 0 |
| 12206 | 0 |
| 12207 | 0 |
| 12208 | 0 |
| 12209 | 0 |
| 12210 | 0 |
| 12211 | 0 |
| 12212 | 0 |
| 12213 | 0 |
| 12214 | 0 |
| 12215 | 0 |
| 12216 | 912 |
| 12217 | 910 |
| 12218 | 909 |
| 12219 | 0 |
| 12220 | 0 |
| 12221 | 0 |
| 12222 | 0 |
| 12223 | 0 |
| 12224 | 0 |
| 12225 | 0 |
| 12226 | 0 |
| 12227 | 0 |
| 12228 | 0 |
| 12229 | 0 |
| 12230 | 0 |
| 12231 | 0 |
| 12232 | 0 |
| 12233 | 0 |
| 12234 | 0 |
| 12235 | 0 |
| 12236 | 0 |
| 12237 | 0 |
| 12238 | 0 |
| 12239 | 0 |
| 12240 | 0 |
| 12241 | 0 |
| 12242 | 0 |
| 12243 | 0 |
| 12244 | 0 |
| 12245 | 0 |
| 12246 | 0 |
| 12247 | 0 |
| 12248 | 0 |
| 12249 | 0 |
| 12250 | 0 |
| 12251 | 0 |
| 12252 | 0 |
| 12253 | 0 |
| 12254 | 0 |
| 12255 | 0 |
| 12256 | 0 |
| 12257 | 0 |
| 12258 | 0 |
| 12259 | 0 |
| 12260 | 0 |
| 12261 | 0 |
| 12262 | 0 |
| 12263 | 0 |
| 12264 | 910 |
| 12265 | 910 |
| 12266 | 911 |
| 12267 | 0 |
| 12268 | 0 |
| 12269 | 0 |
| 12270 | 0 |
| 12271 | 0 |
| 12272 | 0 |
| 12273 | 0 |
| 12274 | 0 |
| 12275 | 0 |
| 12276 | 0 |
| 12277 | 0 |
| 12278 | 0 |
| 12279 | 0 |
| 12280 | 0 |
| 12281 | 0 |
| 12282 | 0 |
| 12283 | 0 |
| 12284 | 0 |
| 12285 | 0 |
| 12286 | 0 |
| 12287 | 0 |
| 12288 | 0 |
| 12289 | 0 |
| 12290 | 0 |
| 12291 | 0 |
| 12292 | 0 |
| 12293 | 0 |
| 12294 | 0 |
| 12295 | 0 |
| 12296 | 0 |
| 12297 | 0 |
| 12298 | 0 |
| 12299 | 0 |
| 12300 | 0 |
| 12301 | 0 |
| 12302 | 0 |
| 12303 | 0 |
| 12304 | 0 |
| 12305 | 0 |
| 12306 | 0 |
| 12307 | 0 |
| 12308 | 0 |
| 12309 | 0 |
| 12310 | 0 |
| 12311 | 0 |
| 12312 | 912 |
| 12313 | 911 |
| 12314 | 909 |
| 12315 | 909 |
| 12316 | 0 |
| 12317 | 0 |
| 12318 | 0 |
| 12319 | 0 |
| 12320 | 0 |
| 12321 | 0 |
| 12322 | 0 |
| 12323 | 0 |
| 12324 | 0 |
| 12325 | 0 |
| 12326 | 0 |
| 12327 | 0 |
| 12328 | 0 |
| 12329 | 0 |
| 12330 | 0 |
| 12331 | 0 |
| 12332 | 0 |
| 12333 | 0 |
| 12334 | 0 |
| 12335 | 0 |
| 12336 | 0 |
| 12337 | 0 |
| 12338 | 0 |
| 12339 | 0 |
| 12340 | 0 |
| 12341 | 0 |
| 12342 | 0 |
| 12343 | 0 |
| 12344 | 0 |
| 12345 | 0 |
| 12346 | 0 |
| 12347 | 0 |
| 12348 | 0 |
| 12349 | 0 |
| 12350 | 0 |
| 12351 | 0 |
| 12352 | 0 |
| 12353 | 0 |
| 12354 | 0 |
| 12355 | 0 |
| 12356 | 0 |
| 12357 | 0 |
| 12358 | 0 |
| 12359 | 0 |
| 12360 | 911 |
| 12361 | 912 |
| 12362 | 913 |
| 12363 | 912 |
| 12364 | 0 |
| 12365 | 0 |
| 12366 | 0 |
| 12367 | 0 |
| 12368 | 0 |
| 12369 | 0 |
| 12370 | 0 |
| 12371 | 0 |
| 12372 | 0 |
| 12373 | 0 |
| 12374 | 0 |
| 12375 | 0 |
| 12376 | 0 |
| 12377 | 0 |
| 12378 | 0 |
| 12379 | 0 |
| 12380 | 0 |
| 12381 | 0 |
| 12382 | 0 |
| 12383 | 0 |
| 12384 | 0 |
| 12385 | 0 |
| 12386 | 0 |
| 12387 | 0 |
| 12388 | 0 |
| 12389 | 0 |
| 12390 | 0 |
| 12391 | 0 |
| 12392 | 0 |
| 12393 | 0 |
| 12394 | 0 |
| 12395 | 0 |
| 12396 | 0 |
| 12397 | 0 |
| 12398 | 0 |
| 12399 | 0 |
| 12400 | 0 |
| 12401 | 0 |
| 12402 | 0 |
| 12403 | 0 |
| 12404 | 0 |
| 12405 | 0 |
| 12406 | 0 |
| 12407 | 0 |
| 12408 | 909 |
| 12409 | 910 |
| 12410 | 908 |
| 12411 | 909 |
| 12412 | 0 |
| 12413 | 0 |
| 12414 | 0 |
| 12415 | 0 |
| 12416 | 0 |
| 12417 | 0 |
| 12418 | 0 |
| 12419 | 0 |
| 12420 | 0 |
| 12421 | 0 |
| 12422 | 0 |
| 12423 | 0 |
| 12424 | 0 |
| 12425 | 0 |
| 12426 | 0 |
| 12427 | 0 |
| 12428 | 0 |
| 12429 | 0 |
| 12430 | 0 |
| 12431 | 0 |
| 12432 | 0 |
| 12433 | 0 |
| 12434 | 0 |
| 12435 | 0 |
| 12436 | 0 |
| 12437 | 0 |
| 12438 | 0 |
| 12439 | 0 |
| 12440 | 0 |
| 12441 | 0 |
| 12442 | 0 |
| 12443 | 0 |
| 12444 | 0 |
| 12445 | 0 |
| 12446 | 0 |
| 12447 | 0 |
| 12448 | 0 |
| 12449 | 0 |
| 12450 | 0 |
| 12451 | 0 |
| 12452 | 0 |
| 12453 | 0 |
| 12454 | 0 |
| 12455 | 0 |
| 12456 | 0 |
| 12457 | 911 |
| 12458 | 911 |
| 12459 | 911 |
| 12460 | 0 |
| 12461 | 0 |
| 12462 | 0 |
| 12463 | 0 |
| 12464 | 0 |
| 12465 | 0 |
| 12466 | 0 |
| 12467 | 0 |
| 12468 | 0 |
| 12469 | 0 |
| 12470 | 0 |
| 12471 | 0 |
| 12472 | 0 |
| 12473 | 0 |
| 12474 | 0 |
| 12475 | 0 |
| 12476 | 0 |
| 12477 | 0 |
| 12478 | 0 |
| 12479 | 0 |
| 12480 | 0 |
| 12481 | 0 |
| 12482 | 0 |
| 12483 | 0 |
| 12484 | 0 |
| 12485 | 0 |
| 12486 | 0 |
| 12487 | 0 |
| 12488 | 0 |
| 12489 | 0 |
| 12490 | 0 |
| 12491 | 0 |
| 12492 | 0 |
| 12493 | 0 |
| 12494 | 0 |
| 12495 | 0 |
| 12496 | 0 |
| 12497 | 0 |
| 12498 | 0 |
| 12499 | 0 |
| 12500 | 0 |
| 12501 | 0 |
| 12502 | 0 |
| 12503 | 0 |
| 12504 | 0 |
| 12505 | 913 |
| 12506 | 913 |
| 12507 | 912 |
| 12508 | 0 |
| 12509 | 0 |
| 12510 | 0 |
| 12511 | 0 |
| 12512 | 0 |
| 12513 | 0 |
| 12514 | 0 |
| 12515 | 0 |
| 12516 | 0 |
| 12517 | 0 |
| 12518 | 0 |
| 12519 | 0 |
| 12520 | 0 |
| 12521 | 0 |
| 12522 | 0 |
| 12523 | 0 |
| 12524 | 0 |
| 12525 | 0 |
| 12526 | 0 |
| 12527 | 0 |
| 12528 | 0 |
| 12529 | 0 |
| 12530 | 0 |
| 12531 | 0 |
| 12532 | 0 |
| 12533 | 0 |
| 12534 | 0 |
| 12535 | 0 |
| 12536 | 0 |
| 12537 | 0 |
| 12538 | 0 |
| 12539 | 0 |
| 12540 | 0 |
| 12541 | 0 |
| 12542 | 0 |
| 12543 | 0 |
| 12544 | 0 |
| 12545 | 0 |
| 12546 | 0 |
| 12547 | 0 |
| 12548 | 0 |
| 12549 | 0 |
| 12550 | 0 |
| 12551 | 0 |
| 12552 | 0 |
| 12553 | 914 |
| 12554 | 914 |
| 12555 | 912 |
| 12556 | 0 |
| 12557 | 0 |
| 12558 | 0 |
| 12559 | 0 |
| 12560 | 0 |
| 12561 | 0 |
| 12562 | 0 |
| 12563 | 0 |
| 12564 | 0 |
| 12565 | 0 |
| 12566 | 0 |
| 12567 | 0 |
| 12568 | 0 |
| 12569 | 0 |
| 12570 | 0 |
| 12571 | 0 |
| 12572 | 0 |
| 12573 | 0 |
| 12574 | 0 |
| 12575 | 0 |
| 12576 | 0 |
| 12577 | 0 |
| 12578 | 0 |
| 12579 | 0 |
| 12580 | 0 |
| 12581 | 0 |
| 12582 | 0 |
| 12583 | 0 |
| 12584 | 0 |
| 12585 | 0 |
| 12586 | 0 |
| 12587 | 0 |
| 12588 | 0 |
| 12589 | 0 |
| 12590 | 0 |
| 12591 | 0 |
| 12592 | 0 |
| 12593 | 0 |
| 12594 | 0 |
| 12595 | 0 |
| 12596 | 0 |
| 12597 | 0 |
| 12598 | 0 |
| 12599 | 0 |
| 12600 | 0 |
| 12601 | 914 |
| 12602 | 912 |
| 12603 | 911 |
| 12604 | 912 |
| 12605 | 0 |
| 12606 | 0 |
| 12607 | 0 |
| 12608 | 0 |
| 12609 | 0 |
| 12610 | 0 |
| 12611 | 0 |
| 12612 | 0 |
| 12613 | 0 |
| 12614 | 0 |
| 12615 | 0 |
| 12616 | 0 |
| 12617 | 0 |
| 12618 | 0 |
| 12619 | 0 |
| 12620 | 0 |
| 12621 | 0 |
| 12622 | 0 |
| 12623 | 0 |
| 12624 | 0 |
| 12625 | 0 |
| 12626 | 0 |
| 12627 | 0 |
| 12628 | 0 |
| 12629 | 0 |
| 12630 | 0 |
| 12631 | 0 |
| 12632 | 0 |
| 12633 | 0 |
| 12634 | 0 |
| 12635 | 0 |
| 12636 | 0 |
| 12637 | 0 |
| 12638 | 0 |
| 12639 | 0 |
| 12640 | 0 |
| 12641 | 0 |
| 12642 | 0 |
| 12643 | 0 |
| 12644 | 0 |
| 12645 | 0 |
| 12646 | 0 |
| 12647 | 0 |
| 12648 | 0 |
| 12649 | 912 |
| 12650 | 913 |
| 12651 | 912 |
| 12652 | 913 |
| 12653 | 0 |
| 12654 | 0 |
| 12655 | 0 |
| 12656 | 0 |
| 12657 | 0 |
| 12658 | 0 |
| 12659 | 0 |
| 12660 | 0 |
| 12661 | 0 |
| 12662 | 0 |
| 12663 | 0 |
| 12664 | 0 |
| 12665 | 0 |
| 12666 | 0 |
| 12667 | 0 |
| 12668 | 0 |
| 12669 | 0 |
| 12670 | 0 |
| 12671 | 0 |
| 12672 | 0 |
| 12673 | 0 |
| 12674 | 0 |
| 12675 | 0 |
| 12676 | 0 |
| 12677 | 0 |
| 12678 | 0 |
| 12679 | 0 |
| 12680 | 0 |
| 12681 | 0 |
| 12682 | 0 |
| 12683 | 0 |
| 12684 | 0 |
| 12685 | 0 |
| 12686 | 0 |
| 12687 | 0 |
| 12688 | 0 |
| 12689 | 0 |
| 12690 | 0 |
| 12691 | 0 |
| 12692 | 0 |
| 12693 | 0 |
| 12694 | 0 |
| 12695 | 0 |
| 12696 | 0 |
| 12697 | 915 |
| 12698 | 913 |
| 12699 | 912 |
| 12700 | 913 |
| 12701 | 0 |
| 12702 | 0 |
| 12703 | 0 |
| 12704 | 0 |
| 12705 | 0 |
| 12706 | 0 |
| 12707 | 0 |
| 12708 | 0 |
| 12709 | 0 |
| 12710 | 0 |
| 12711 | 0 |
| 12712 | 0 |
| 12713 | 0 |
| 12714 | 0 |
| 12715 | 0 |
| 12716 | 0 |
| 12717 | 0 |
| 12718 | 0 |
| 12719 | 0 |
| 12720 | 0 |
| 12721 | 0 |
| 12722 | 0 |
| 12723 | 0 |
| 12724 | 0 |
| 12725 | 0 |
| 12726 | 0 |
| 12727 | 0 |
| 12728 | 0 |
| 12729 | 0 |
| 12730 | 0 |
| 12731 | 0 |
| 12732 | 0 |
| 12733 | 0 |
| 12734 | 0 |
| 12735 | 0 |
| 12736 | 0 |
| 12737 | 0 |
| 12738 | 0 |
| 12739 | 0 |
| 12740 | 0 |
| 12741 | 0 |
| 12742 | 0 |
| 12743 | 0 |
| 12744 | 0 |
| 12745 | 910 |
| 12746 | 910 |
| 12747 | 909 |
| 12748 | 909 |
| 12749 | 0 |
| 12750 | 0 |
| 12751 | 0 |
| 12752 | 0 |
| 12753 | 0 |
| 12754 | 0 |
| 12755 | 0 |
| 12756 | 0 |
| 12757 | 0 |
| 12758 | 0 |
| 12759 | 0 |
| 12760 | 0 |
| 12761 | 0 |
| 12762 | 0 |
| 12763 | 0 |
| 12764 | 0 |
| 12765 | 0 |
| 12766 | 0 |
| 12767 | 0 |
| 12768 | 0 |
| 12769 | 0 |
| 12770 | 0 |
| 12771 | 0 |
| 12772 | 0 |
| 12773 | 0 |
| 12774 | 0 |
| 12775 | 0 |
| 12776 | 0 |
| 12777 | 0 |
| 12778 | 0 |
| 12779 | 0 |
| 12780 | 0 |
| 12781 | 0 |
| 12782 | 0 |
| 12783 | 0 |
| 12784 | 0 |
| 12785 | 0 |
| 12786 | 0 |
| 12787 | 0 |
| 12788 | 0 |
| 12789 | 0 |
| 12790 | 0 |
| 12791 | 0 |
| 12792 | 0 |
| 12793 | 878 |
| 12794 | 913 |
| 12795 | 912 |
| 12796 | 912 |
| 12797 | 0 |
| 12798 | 0 |
| 12799 | 0 |
| 12800 | 0 |
| 12801 | 0 |
| 12802 | 0 |
| 12803 | 0 |
| 12804 | 0 |
| 12805 | 0 |
| 12806 | 0 |
| 12807 | 0 |
| 12808 | 0 |
| 12809 | 0 |
| 12810 | 0 |
| 12811 | 0 |
| 12812 | 0 |
| 12813 | 0 |
| 12814 | 0 |
| 12815 | 0 |
| 12816 | 0 |
| 12817 | 0 |
| 12818 | 0 |
| 12819 | 0 |
| 12820 | 0 |
| 12821 | 0 |
| 12822 | 0 |
| 12823 | 0 |
| 12824 | 0 |
| 12825 | 0 |
| 12826 | 0 |
| 12827 | 0 |
| 12828 | 0 |
| 12829 | 0 |
| 12830 | 0 |
| 12831 | 0 |
| 12832 | 0 |
| 12833 | 0 |
| 12834 | 0 |
| 12835 | 0 |
| 12836 | 0 |
| 12837 | 0 |
| 12838 | 0 |
| 12839 | 0 |
| 12840 | 0 |
| 12841 | 0 |
| 12842 | 913 |
| 12843 | 911 |
| 12844 | 911 |
| 12845 | 0 |
| 12846 | 0 |
| 12847 | 0 |
| 12848 | 0 |
| 12849 | 0 |
| 12850 | 0 |
| 12851 | 0 |
| 12852 | 0 |
| 12853 | 0 |
| 12854 | 0 |
| 12855 | 0 |
| 12856 | 0 |
| 12857 | 0 |
| 12858 | 0 |
| 12859 | 0 |
| 12860 | 0 |
| 12861 | 0 |
| 12862 | 0 |
| 12863 | 0 |
| 12864 | 0 |
| 12865 | 0 |
| 12866 | 0 |
| 12867 | 0 |
| 12868 | 0 |
| 12869 | 0 |
| 12870 | 0 |
| 12871 | 0 |
| 12872 | 0 |
| 12873 | 0 |
| 12874 | 0 |
| 12875 | 0 |
| 12876 | 0 |
| 12877 | 0 |
| 12878 | 0 |
| 12879 | 0 |
| 12880 | 0 |
| 12881 | 0 |
| 12882 | 0 |
| 12883 | 0 |
| 12884 | 0 |
| 12885 | 0 |
| 12886 | 0 |
| 12887 | 0 |
| 12888 | 0 |
| 12889 | 0 |
| 12890 | 910 |
| 12891 | 911 |
| 12892 | 910 |
| 12893 | 0 |
| 12894 | 0 |
| 12895 | 0 |
| 12896 | 0 |
| 12897 | 0 |
| 12898 | 0 |
| 12899 | 0 |
| 12900 | 0 |
| 12901 | 0 |
| 12902 | 0 |
| 12903 | 0 |
| 12904 | 0 |
| 12905 | 0 |
| 12906 | 0 |
| 12907 | 0 |
| 12908 | 0 |
| 12909 | 0 |
| 12910 | 0 |
| 12911 | 0 |
| 12912 | 0 |
| 12913 | 0 |
| 12914 | 0 |
| 12915 | 0 |
| 12916 | 0 |
| 12917 | 0 |
| 12918 | 0 |
| 12919 | 0 |
| 12920 | 0 |
| 12921 | 0 |
| 12922 | 0 |
| 12923 | 0 |
| 12924 | 0 |
| 12925 | 0 |
| 12926 | 0 |
| 12927 | 0 |
| 12928 | 0 |
| 12929 | 0 |
| 12930 | 0 |
| 12931 | 0 |
| 12932 | 0 |
| 12933 | 0 |
| 12934 | 0 |
| 12935 | 0 |
| 12936 | 0 |
| 12937 | 0 |
| 12938 | 912 |
| 12939 | 912 |
| 12940 | 911 |
| 12941 | 912 |
| 12942 | 0 |
| 12943 | 0 |
| 12944 | 0 |
| 12945 | 0 |
| 12946 | 0 |
| 12947 | 0 |
| 12948 | 0 |
| 12949 | 0 |
| 12950 | 0 |
| 12951 | 0 |
| 12952 | 0 |
| 12953 | 0 |
| 12954 | 0 |
| 12955 | 0 |
| 12956 | 0 |
| 12957 | 0 |
| 12958 | 0 |
| 12959 | 0 |
| 12960 | 0 |
| 12961 | 0 |
| 12962 | 0 |
| 12963 | 0 |
| 12964 | 0 |
| 12965 | 0 |
| 12966 | 0 |
| 12967 | 0 |
| 12968 | 0 |
| 12969 | 0 |
| 12970 | 0 |
| 12971 | 0 |
| 12972 | 0 |
| 12973 | 0 |
| 12974 | 0 |
| 12975 | 0 |
| 12976 | 0 |
| 12977 | 0 |
| 12978 | 0 |
| 12979 | 0 |
| 12980 | 0 |
| 12981 | 0 |
| 12982 | 0 |
| 12983 | 0 |
| 12984 | 0 |
| 12985 | 0 |
| 12986 | 910 |
| 12987 | 911 |
| 12988 | 910 |
| 12989 | 911 |
| 12990 | 0 |
| 12991 | 0 |
| 12992 | 0 |
| 12993 | 0 |
| 12994 | 0 |
| 12995 | 0 |
| 12996 | 0 |
| 12997 | 0 |
| 12998 | 0 |
| 12999 | 0 |
| 13000 | 0 |
| 13001 | 0 |
| 13002 | 0 |
| 13003 | 0 |
| 13004 | 0 |
| 13005 | 0 |
| 13006 | 0 |
| 13007 | 0 |
| 13008 | 0 |
| 13009 | 0 |
| 13010 | 0 |
| 13011 | 0 |
| 13012 | 0 |
| 13013 | 0 |
| 13014 | 0 |
| 13015 | 0 |
| 13016 | 0 |
| 13017 | 0 |
| 13018 | 0 |
| 13019 | 0 |
| 13020 | 0 |
| 13021 | 0 |
| 13022 | 0 |
| 13023 | 0 |
| 13024 | 0 |
| 13025 | 0 |
| 13026 | 0 |
| 13027 | 0 |
| 13028 | 0 |
| 13029 | 0 |
| 13030 | 0 |
| 13031 | 0 |
| 13032 | 0 |
| 13033 | 0 |
| 13034 | 433 |
| 13035 | 912 |
| 13036 | 910 |
| 13037 | 909 |
| 13038 | 0 |
| 13039 | 0 |
| 13040 | 0 |
| 13041 | 0 |
| 13042 | 0 |
| 13043 | 0 |
| 13044 | 0 |
| 13045 | 0 |
| 13046 | 0 |
| 13047 | 0 |
| 13048 | 0 |
| 13049 | 0 |
| 13050 | 0 |
| 13051 | 0 |
| 13052 | 0 |
| 13053 | 0 |
| 13054 | 0 |
| 13055 | 0 |
| 13056 | 0 |
| 13057 | 0 |
| 13058 | 0 |
| 13059 | 0 |
| 13060 | 0 |
| 13061 | 0 |
| 13062 | 0 |
| 13063 | 0 |
| 13064 | 0 |
| 13065 | 0 |
| 13066 | 0 |
| 13067 | 0 |
| 13068 | 0 |
| 13069 | 0 |
| 13070 | 0 |
| 13071 | 0 |
| 13072 | 0 |
| 13073 | 0 |
| 13074 | 0 |
| 13075 | 0 |
| 13076 | 0 |
| 13077 | 0 |
| 13078 | 0 |
| 13079 | 0 |
| 13080 | 0 |
| 13081 | 0 |
| 13082 | 0 |
| 13083 | 914 |
| 13084 | 912 |
| 13085 | 910 |
| 13086 | 0 |
| 13087 | 0 |
| 13088 | 0 |
| 13089 | 0 |
| 13090 | 0 |
| 13091 | 0 |
| 13092 | 0 |
| 13093 | 0 |
| 13094 | 0 |
| 13095 | 0 |
| 13096 | 0 |
| 13097 | 0 |
| 13098 | 0 |
| 13099 | 0 |
| 13100 | 0 |
| 13101 | 0 |
| 13102 | 0 |
| 13103 | 0 |
| 13104 | 0 |
| 13105 | 0 |
| 13106 | 0 |
| 13107 | 0 |
| 13108 | 0 |
| 13109 | 0 |
| 13110 | 0 |
| 13111 | 0 |
| 13112 | 0 |
| 13113 | 0 |
| 13114 | 0 |
| 13115 | 0 |
| 13116 | 0 |
| 13117 | 0 |
| 13118 | 0 |
| 13119 | 0 |
| 13120 | 0 |
| 13121 | 0 |
| 13122 | 0 |
| 13123 | 0 |
| 13124 | 0 |
| 13125 | 0 |
| 13126 | 0 |
| 13127 | 0 |
| 13128 | 0 |
| 13129 | 0 |
| 13130 | 0 |
| 13131 | 913 |
| 13132 | 912 |
| 13133 | 910 |
| 13134 | 0 |
| 13135 | 0 |
| 13136 | 0 |
| 13137 | 0 |
| 13138 | 0 |
| 13139 | 0 |
| 13140 | 0 |
| 13141 | 0 |
| 13142 | 0 |
| 13143 | 0 |
| 13144 | 0 |
| 13145 | 0 |
| 13146 | 0 |
| 13147 | 0 |
| 13148 | 0 |
| 13149 | 0 |
| 13150 | 0 |
| 13151 | 0 |
| 13152 | 0 |
| 13153 | 0 |
| 13154 | 0 |
| 13155 | 0 |
| 13156 | 0 |
| 13157 | 0 |
| 13158 | 0 |
| 13159 | 0 |
| 13160 | 0 |
| 13161 | 0 |
| 13162 | 0 |
| 13163 | 0 |
| 13164 | 0 |
| 13165 | 0 |
| 13166 | 0 |
| 13167 | 0 |
| 13168 | 0 |
| 13169 | 0 |
| 13170 | 0 |
| 13171 | 0 |
| 13172 | 0 |
| 13173 | 0 |
| 13174 | 0 |
| 13175 | 0 |
| 13176 | 0 |
| 13177 | 0 |
| 13178 | 0 |
| 13179 | 910 |
| 13180 | 911 |
| 13181 | 909 |
| 13182 | 908 |
| 13183 | 0 |
| 13184 | 0 |
| 13185 | 0 |
| 13186 | 0 |
| 13187 | 0 |
| 13188 | 0 |
| 13189 | 0 |
| 13190 | 0 |
| 13191 | 0 |
| 13192 | 0 |
| 13193 | 0 |
| 13194 | 0 |
| 13195 | 0 |
| 13196 | 0 |
| 13197 | 0 |
| 13198 | 0 |
| 13199 | 0 |
| 13200 | 0 |
| 13201 | 0 |
| 13202 | 0 |
| 13203 | 0 |
| 13204 | 0 |
| 13205 | 0 |
| 13206 | 0 |
| 13207 | 0 |
| 13208 | 0 |
| 13209 | 0 |
| 13210 | 0 |
| 13211 | 0 |
| 13212 | 0 |
| 13213 | 0 |
| 13214 | 0 |
| 13215 | 0 |
| 13216 | 0 |
| 13217 | 0 |
| 13218 | 0 |
| 13219 | 0 |
| 13220 | 0 |
| 13221 | 0 |
| 13222 | 0 |
| 13223 | 0 |
| 13224 | 0 |
| 13225 | 0 |
| 13226 | 0 |
| 13227 | 912 |
| 13228 | 914 |
| 13229 | 912 |
| 13230 | 911 |
| 13231 | 0 |
| 13232 | 0 |
| 13233 | 0 |
| 13234 | 0 |
| 13235 | 0 |
| 13236 | 0 |
| 13237 | 0 |
| 13238 | 0 |
| 13239 | 0 |
| 13240 | 0 |
| 13241 | 0 |
| 13242 | 0 |
| 13243 | 0 |
| 13244 | 0 |
| 13245 | 0 |
| 13246 | 0 |
| 13247 | 0 |
| 13248 | 0 |
| 13249 | 0 |
| 13250 | 0 |
| 13251 | 0 |
| 13252 | 0 |
| 13253 | 0 |
| 13254 | 0 |
| 13255 | 0 |
| 13256 | 0 |
| 13257 | 0 |
| 13258 | 0 |
| 13259 | 0 |
| 13260 | 0 |
| 13261 | 0 |
| 13262 | 0 |
| 13263 | 0 |
| 13264 | 0 |
| 13265 | 0 |
| 13266 | 0 |
| 13267 | 0 |
| 13268 | 0 |
| 13269 | 0 |
| 13270 | 0 |
| 13271 | 0 |
| 13272 | 0 |
| 13273 | 0 |
| 13274 | 0 |
| 13275 | 0 |
| 13276 | 913 |
| 13277 | 912 |
| 13278 | 911 |
| 13279 | 0 |
| 13280 | 0 |
| 13281 | 0 |
| 13282 | 0 |
| 13283 | 0 |
| 13284 | 0 |
| 13285 | 0 |
| 13286 | 0 |
| 13287 | 0 |
| 13288 | 0 |
| 13289 | 0 |
| 13290 | 0 |
| 13291 | 0 |
| 13292 | 0 |
| 13293 | 0 |
| 13294 | 0 |
| 13295 | 0 |
| 13296 | 0 |
| 13297 | 0 |
| 13298 | 0 |
| 13299 | 0 |
| 13300 | 0 |
| 13301 | 0 |
| 13302 | 0 |
| 13303 | 0 |
| 13304 | 0 |
| 13305 | 0 |
| 13306 | 0 |
| 13307 | 0 |
| 13308 | 0 |
| 13309 | 0 |
| 13310 | 0 |
| 13311 | 0 |
| 13312 | 0 |
| 13313 | 0 |
| 13314 | 0 |
| 13315 | 0 |
| 13316 | 0 |
| 13317 | 0 |
| 13318 | 0 |
| 13319 | 0 |
| 13320 | 0 |
| 13321 | 0 |
| 13322 | 0 |
| 13323 | 0 |
| 13324 | 913 |
| 13325 | 913 |
| 13326 | 911 |
| 13327 | 910 |
| 13328 | 0 |
| 13329 | 0 |
| 13330 | 0 |
| 13331 | 0 |
| 13332 | 0 |
| 13333 | 0 |
| 13334 | 0 |
| 13335 | 0 |
| 13336 | 0 |
| 13337 | 0 |
| 13338 | 0 |
| 13339 | 0 |
| 13340 | 0 |
| 13341 | 0 |
| 13342 | 0 |
| 13343 | 0 |
| 13344 | 0 |
| 13345 | 0 |
| 13346 | 0 |
| 13347 | 0 |
| 13348 | 0 |
| 13349 | 0 |
| 13350 | 0 |
| 13351 | 0 |
| 13352 | 0 |
| 13353 | 0 |
| 13354 | 0 |
| 13355 | 0 |
| 13356 | 0 |
| 13357 | 0 |
| 13358 | 0 |
| 13359 | 0 |
| 13360 | 0 |
| 13361 | 0 |
| 13362 | 0 |
| 13363 | 0 |
| 13364 | 0 |
| 13365 | 0 |
| 13366 | 0 |
| 13367 | 0 |
| 13368 | 0 |
| 13369 | 0 |
| 13370 | 0 |
| 13371 | 0 |
| 13372 | 866 |
| 13373 | 914 |
| 13374 | 913 |
| 13375 | 913 |
| 13376 | 0 |
| 13377 | 0 |
| 13378 | 0 |
| 13379 | 0 |
| 13380 | 0 |
| 13381 | 0 |
| 13382 | 0 |
| 13383 | 0 |
| 13384 | 0 |
| 13385 | 0 |
| 13386 | 0 |
| 13387 | 0 |
| 13388 | 0 |
| 13389 | 0 |
| 13390 | 0 |
| 13391 | 0 |
| 13392 | 0 |
| 13393 | 0 |
| 13394 | 0 |
| 13395 | 0 |
| 13396 | 0 |
| 13397 | 0 |
| 13398 | 0 |
| 13399 | 0 |
| 13400 | 0 |
| 13401 | 0 |
| 13402 | 0 |
| 13403 | 0 |
| 13404 | 0 |
| 13405 | 0 |
| 13406 | 0 |
| 13407 | 0 |
| 13408 | 0 |
| 13409 | 0 |
| 13410 | 0 |
| 13411 | 0 |
| 13412 | 0 |
| 13413 | 0 |
| 13414 | 0 |
| 13415 | 0 |
| 13416 | 0 |
| 13417 | 0 |
| 13418 | 0 |
| 13419 | 0 |
| 13420 | 787 |
| 13421 | 912 |
| 13422 | 912 |
| 13423 | 912 |
| 13424 | 0 |
| 13425 | 0 |
| 13426 | 0 |
| 13427 | 0 |
| 13428 | 0 |
| 13429 | 0 |
| 13430 | 0 |
| 13431 | 0 |
| 13432 | 0 |
| 13433 | 0 |
| 13434 | 0 |
| 13435 | 0 |
| 13436 | 0 |
| 13437 | 0 |
| 13438 | 0 |
| 13439 | 0 |
| 13440 | 0 |
| 13441 | 0 |
| 13442 | 0 |
| 13443 | 0 |
| 13444 | 0 |
| 13445 | 0 |
| 13446 | 0 |
| 13447 | 0 |
| 13448 | 0 |
| 13449 | 0 |
| 13450 | 0 |
| 13451 | 0 |
| 13452 | 0 |
| 13453 | 0 |
| 13454 | 0 |
| 13455 | 0 |
| 13456 | 0 |
| 13457 | 0 |
| 13458 | 0 |
| 13459 | 0 |
| 13460 | 0 |
| 13461 | 0 |
| 13462 | 0 |
| 13463 | 0 |
| 13464 | 0 |
| 13465 | 0 |
| 13466 | 0 |
| 13467 | 0 |
| 13468 | 0 |
| 13469 | 912 |
| 13470 | 912 |
| 13471 | 911 |
| 13472 | 0 |
| 13473 | 0 |
| 13474 | 0 |
| 13475 | 0 |
| 13476 | 0 |
| 13477 | 0 |
| 13478 | 0 |
| 13479 | 0 |
| 13480 | 0 |
| 13481 | 0 |
| 13482 | 0 |
| 13483 | 0 |
| 13484 | 0 |
| 13485 | 0 |
| 13486 | 0 |
| 13487 | 0 |
| 13488 | 0 |
| 13489 | 0 |
| 13490 | 0 |
| 13491 | 0 |
| 13492 | 0 |
| 13493 | 0 |
| 13494 | 0 |
| 13495 | 0 |
| 13496 | 0 |
| 13497 | 0 |
| 13498 | 0 |
| 13499 | 0 |
| 13500 | 0 |
| 13501 | 0 |
| 13502 | 0 |
| 13503 | 0 |
| 13504 | 0 |
| 13505 | 0 |
| 13506 | 0 |
| 13507 | 0 |
| 13508 | 0 |
| 13509 | 0 |
| 13510 | 0 |
| 13511 | 0 |
| 13512 | 0 |
| 13513 | 0 |
| 13514 | 0 |
| 13515 | 0 |
| 13516 | 0 |
| 13517 | 911 |
| 13518 | 911 |
| 13519 | 909 |
| 13520 | 0 |
| 13521 | 0 |
| 13522 | 0 |
| 13523 | 0 |
| 13524 | 0 |
| 13525 | 0 |
| 13526 | 0 |
| 13527 | 0 |
| 13528 | 0 |
| 13529 | 0 |
| 13530 | 0 |
| 13531 | 0 |
| 13532 | 0 |
| 13533 | 0 |
| 13534 | 0 |
| 13535 | 0 |
| 13536 | 0 |
| 13537 | 0 |
| 13538 | 0 |
| 13539 | 0 |
| 13540 | 0 |
| 13541 | 0 |
| 13542 | 0 |
| 13543 | 0 |
| 13544 | 0 |
| 13545 | 0 |
| 13546 | 0 |
| 13547 | 0 |
| 13548 | 0 |
| 13549 | 0 |
| 13550 | 0 |
| 13551 | 0 |
| 13552 | 0 |
| 13553 | 0 |
| 13554 | 0 |
| 13555 | 0 |
| 13556 | 0 |
| 13557 | 0 |
| 13558 | 0 |
| 13559 | 0 |
| 13560 | 0 |
| 13561 | 0 |
| 13562 | 0 |
| 13563 | 0 |
| 13564 | 0 |
| 13565 | 909 |
| 13566 | 910 |
| 13567 | 912 |
| 13568 | 910 |
| 13569 | 0 |
| 13570 | 0 |
| 13571 | 0 |
| 13572 | 0 |
| 13573 | 0 |
| 13574 | 0 |
| 13575 | 0 |
| 13576 | 0 |
| 13577 | 0 |
| 13578 | 0 |
| 13579 | 0 |
| 13580 | 0 |
| 13581 | 0 |
| 13582 | 0 |
| 13583 | 0 |
| 13584 | 0 |
| 13585 | 0 |
| 13586 | 0 |
| 13587 | 0 |
| 13588 | 0 |
| 13589 | 0 |
| 13590 | 0 |
| 13591 | 0 |
| 13592 | 0 |
| 13593 | 0 |
| 13594 | 0 |
| 13595 | 0 |
| 13596 | 0 |
| 13597 | 0 |
| 13598 | 0 |
| 13599 | 0 |
| 13600 | 0 |
| 13601 | 0 |
| 13602 | 0 |
| 13603 | 0 |
| 13604 | 0 |
| 13605 | 0 |
| 13606 | 0 |
| 13607 | 0 |
| 13608 | 0 |
| 13609 | 0 |
| 13610 | 0 |
| 13611 | 0 |
| 13612 | 0 |
| 13613 | 910 |
| 13614 | 913 |
| 13615 | 912 |
| 13616 | 911 |
| 13617 | 0 |
| 13618 | 0 |
| 13619 | 0 |
| 13620 | 0 |
| 13621 | 0 |
| 13622 | 0 |
| 13623 | 0 |
| 13624 | 0 |
| 13625 | 0 |
| 13626 | 0 |
| 13627 | 0 |
| 13628 | 0 |
| 13629 | 0 |
| 13630 | 0 |
| 13631 | 0 |
| 13632 | 0 |
| 13633 | 0 |
| 13634 | 0 |
| 13635 | 0 |
| 13636 | 0 |
| 13637 | 0 |
| 13638 | 0 |
| 13639 | 0 |
| 13640 | 0 |
| 13641 | 0 |
| 13642 | 0 |
| 13643 | 0 |
| 13644 | 0 |
| 13645 | 0 |
| 13646 | 0 |
| 13647 | 0 |
| 13648 | 0 |
| 13649 | 0 |
| 13650 | 0 |
| 13651 | 0 |
| 13652 | 0 |
| 13653 | 0 |
| 13654 | 0 |
| 13655 | 0 |
| 13656 | 0 |
| 13657 | 0 |
| 13658 | 0 |
| 13659 | 0 |
| 13660 | 0 |
| 13661 | 0 |
| 13662 | 910 |
| 13663 | 911 |
| 13664 | 912 |
| 13665 | 0 |
| 13666 | 0 |
| 13667 | 0 |
| 13668 | 0 |
| 13669 | 0 |
| 13670 | 0 |
| 13671 | 0 |
| 13672 | 0 |
| 13673 | 0 |
| 13674 | 0 |
| 13675 | 0 |
| 13676 | 0 |
| 13677 | 0 |
| 13678 | 0 |
| 13679 | 0 |
| 13680 | 0 |
| 13681 | 0 |
| 13682 | 0 |
| 13683 | 0 |
| 13684 | 0 |
| 13685 | 0 |
| 13686 | 0 |
| 13687 | 0 |
| 13688 | 0 |
| 13689 | 0 |
| 13690 | 0 |
| 13691 | 0 |
| 13692 | 0 |
| 13693 | 0 |
| 13694 | 0 |
| 13695 | 0 |
| 13696 | 0 |
| 13697 | 0 |
| 13698 | 0 |
| 13699 | 0 |
| 13700 | 0 |
| 13701 | 0 |
| 13702 | 0 |
| 13703 | 0 |
| 13704 | 0 |
| 13705 | 0 |
| 13706 | 0 |
| 13707 | 0 |
| 13708 | 0 |
| 13709 | 0 |
| 13710 | 913 |
| 13711 | 914 |
| 13712 | 912 |
| 13713 | 0 |
| 13714 | 0 |
| 13715 | 0 |
| 13716 | 0 |
| 13717 | 0 |
| 13718 | 0 |
| 13719 | 0 |
| 13720 | 0 |
| 13721 | 0 |
| 13722 | 0 |
| 13723 | 0 |
| 13724 | 0 |
| 13725 | 0 |
| 13726 | 0 |
| 13727 | 0 |
| 13728 | 0 |
| 13729 | 0 |
| 13730 | 0 |
| 13731 | 0 |
| 13732 | 0 |
| 13733 | 0 |
| 13734 | 0 |
| 13735 | 0 |
| 13736 | 0 |
| 13737 | 0 |
| 13738 | 0 |
| 13739 | 0 |
| 13740 | 0 |
| 13741 | 0 |
| 13742 | 0 |
| 13743 | 0 |
| 13744 | 0 |
| 13745 | 0 |
| 13746 | 0 |
| 13747 | 0 |
| 13748 | 0 |
| 13749 | 0 |
| 13750 | 0 |
| 13751 | 0 |
| 13752 | 0 |
| 13753 | 0 |
| 13754 | 0 |
| 13755 | 0 |
| 13756 | 0 |
| 13757 | 0 |
| 13758 | 911 |
| 13759 | 910 |
| 13760 | 911 |
| 13761 | 0 |
| 13762 | 0 |
| 13763 | 0 |
| 13764 | 0 |
| 13765 | 0 |
| 13766 | 0 |
| 13767 | 0 |
| 13768 | 0 |
| 13769 | 0 |
| 13770 | 0 |
| 13771 | 0 |
| 13772 | 0 |
| 13773 | 0 |
| 13774 | 0 |
| 13775 | 0 |
| 13776 | 0 |
| 13777 | 0 |
| 13778 | 0 |
| 13779 | 0 |
| 13780 | 0 |
| 13781 | 0 |
| 13782 | 0 |
| 13783 | 0 |
| 13784 | 0 |
| 13785 | 0 |
| 13786 | 0 |
| 13787 | 0 |
| 13788 | 0 |
| 13789 | 0 |
| 13790 | 0 |
| 13791 | 0 |
| 13792 | 0 |
| 13793 | 0 |
| 13794 | 0 |
| 13795 | 0 |
| 13796 | 0 |
| 13797 | 0 |
| 13798 | 0 |
| 13799 | 0 |
| 13800 | 0 |
| 13801 | 0 |
| 13802 | 0 |
| 13803 | 0 |
| 13804 | 0 |
| 13805 | 0 |
| 13806 | 913 |
| 13807 | 913 |
| 13808 | 911 |
| 13809 | 910 |
| 13810 | 0 |
| 13811 | 0 |
| 13812 | 0 |
| 13813 | 0 |
| 13814 | 0 |
| 13815 | 0 |
| 13816 | 0 |
| 13817 | 0 |
| 13818 | 0 |
| 13819 | 0 |
| 13820 | 0 |
| 13821 | 0 |
| 13822 | 0 |
| 13823 | 0 |
| 13824 | 0 |
| 13825 | 0 |
| 13826 | 0 |
| 13827 | 0 |
| 13828 | 0 |
| 13829 | 0 |
| 13830 | 0 |
| 13831 | 0 |
| 13832 | 0 |
| 13833 | 0 |
| 13834 | 0 |
| 13835 | 0 |
| 13836 | 0 |
| 13837 | 0 |
| 13838 | 0 |
| 13839 | 0 |
| 13840 | 0 |
| 13841 | 0 |
| 13842 | 0 |
| 13843 | 0 |
| 13844 | 0 |
| 13845 | 0 |
| 13846 | 0 |
| 13847 | 0 |
| 13848 | 0 |
| 13849 | 0 |
| 13850 | 0 |
| 13851 | 0 |
| 13852 | 0 |
| 13853 | 0 |
| 13854 | 913 |
| 13855 | 911 |
| 13856 | 910 |
| 13857 | 909 |
| 13858 | 0 |
| 13859 | 0 |
| 13860 | 0 |
| 13861 | 0 |
| 13862 | 0 |
| 13863 | 0 |
| 13864 | 0 |
| 13865 | 0 |
| 13866 | 0 |
| 13867 | 0 |
| 13868 | 0 |
| 13869 | 0 |
| 13870 | 0 |
| 13871 | 0 |
| 13872 | 0 |
| 13873 | 0 |
| 13874 | 0 |
| 13875 | 0 |
| 13876 | 0 |
| 13877 | 0 |
| 13878 | 0 |
| 13879 | 0 |
| 13880 | 0 |
| 13881 | 0 |
| 13882 | 0 |
| 13883 | 0 |
| 13884 | 0 |
| 13885 | 0 |
| 13886 | 0 |
| 13887 | 0 |
| 13888 | 0 |
| 13889 | 0 |
| 13890 | 0 |
| 13891 | 0 |
| 13892 | 0 |
| 13893 | 0 |
| 13894 | 0 |
| 13895 | 0 |
| 13896 | 0 |
| 13897 | 0 |
| 13898 | 0 |
| 13899 | 0 |
| 13900 | 0 |
| 13901 | 0 |
| 13902 | 910 |
| 13903 | 910 |
| 13904 | 910 |
| 13905 | 910 |
| 13906 | 0 |
| 13907 | 0 |
| 13908 | 0 |
| 13909 | 0 |
| 13910 | 0 |
| 13911 | 0 |
| 13912 | 0 |
| 13913 | 0 |
| 13914 | 0 |
| 13915 | 0 |
| 13916 | 0 |
| 13917 | 0 |
| 13918 | 0 |
| 13919 | 0 |
| 13920 | 0 |
| 13921 | 0 |
| 13922 | 0 |
| 13923 | 0 |
| 13924 | 0 |
| 13925 | 0 |
| 13926 | 0 |
| 13927 | 0 |
| 13928 | 0 |
| 13929 | 0 |
| 13930 | 0 |
| 13931 | 0 |
| 13932 | 0 |
| 13933 | 0 |
| 13934 | 0 |
| 13935 | 0 |
| 13936 | 0 |
| 13937 | 0 |
| 13938 | 0 |
| 13939 | 0 |
| 13940 | 0 |
| 13941 | 0 |
| 13942 | 0 |
| 13943 | 0 |
| 13944 | 0 |
| 13945 | 0 |
| 13946 | 0 |
| 13947 | 0 |
| 13948 | 0 |
| 13949 | 0 |
| 13950 | 913 |
| 13951 | 912 |
| 13952 | 910 |
| 13953 | 910 |
| 13954 | 0 |
| 13955 | 0 |
| 13956 | 0 |
| 13957 | 0 |
| 13958 | 0 |
| 13959 | 0 |
| 13960 | 0 |
| 13961 | 0 |
| 13962 | 0 |
| 13963 | 0 |
| 13964 | 0 |
| 13965 | 0 |
| 13966 | 0 |
| 13967 | 0 |
| 13968 | 0 |
| 13969 | 0 |
| 13970 | 0 |
| 13971 | 0 |
| 13972 | 0 |
| 13973 | 0 |
| 13974 | 0 |
| 13975 | 0 |
| 13976 | 0 |
| 13977 | 0 |
| 13978 | 0 |
| 13979 | 0 |
| 13980 | 0 |
| 13981 | 0 |
| 13982 | 0 |
| 13983 | 0 |
| 13984 | 0 |
| 13985 | 0 |
| 13986 | 0 |
| 13987 | 0 |
| 13988 | 0 |
| 13989 | 0 |
| 13990 | 0 |
| 13991 | 0 |
| 13992 | 0 |
| 13993 | 0 |
| 13994 | 0 |
| 13995 | 0 |
| 13996 | 0 |
| 13997 | 0 |
| 13998 | 911 |
| 13999 | 912 |
| 14000 | 910 |
| 14001 | 910 |
| 14002 | 0 |
| 14003 | 0 |
| 14004 | 0 |
| 14005 | 0 |
| 14006 | 0 |
| 14007 | 0 |
| 14008 | 0 |
| 14009 | 0 |
| 14010 | 0 |
| 14011 | 0 |
| 14012 | 0 |
| 14013 | 0 |
| 14014 | 0 |
| 14015 | 0 |
| 14016 | 0 |
| 14017 | 0 |
| 14018 | 0 |
| 14019 | 0 |
| 14020 | 0 |
| 14021 | 0 |
| 14022 | 0 |
| 14023 | 0 |
| 14024 | 0 |
| 14025 | 0 |
| 14026 | 0 |
| 14027 | 0 |
| 14028 | 0 |
| 14029 | 0 |
| 14030 | 0 |
| 14031 | 0 |
| 14032 | 0 |
| 14033 | 0 |
| 14034 | 0 |
| 14035 | 0 |
| 14036 | 0 |
| 14037 | 0 |
| 14038 | 0 |
| 14039 | 0 |
| 14040 | 0 |
| 14041 | 0 |
| 14042 | 0 |
| 14043 | 0 |
| 14044 | 0 |
| 14045 | 0 |
| 14046 | 0 |
| 14047 | 911 |
| 14048 | 912 |
| 14049 | 910 |
| 14050 | 0 |
| 14051 | 0 |
| 14052 | 0 |
| 14053 | 0 |
| 14054 | 0 |
| 14055 | 0 |
| 14056 | 0 |
| 14057 | 0 |
| 14058 | 0 |
| 14059 | 0 |
| 14060 | 0 |
| 14061 | 0 |
| 14062 | 0 |
| 14063 | 0 |
| 14064 | 0 |
| 14065 | 0 |
| 14066 | 0 |
| 14067 | 0 |
| 14068 | 0 |
| 14069 | 0 |
| 14070 | 0 |
| 14071 | 0 |
| 14072 | 0 |
| 14073 | 0 |
| 14074 | 0 |
| 14075 | 0 |
| 14076 | 0 |
| 14077 | 0 |
| 14078 | 0 |
| 14079 | 0 |
| 14080 | 0 |
| 14081 | 0 |
| 14082 | 0 |
| 14083 | 0 |
| 14084 | 0 |
| 14085 | 0 |
| 14086 | 0 |
| 14087 | 0 |
| 14088 | 0 |
| 14089 | 0 |
| 14090 | 0 |
| 14091 | 0 |
| 14092 | 0 |
| 14093 | 0 |
| 14094 | 0 |
| 14095 | 913 |
| 14096 | 913 |
| 14097 | 912 |
| 14098 | 0 |
| 14099 | 0 |
| 14100 | 0 |
| 14101 | 0 |
| 14102 | 0 |
| 14103 | 0 |
| 14104 | 0 |
| 14105 | 0 |
| 14106 | 0 |
| 14107 | 0 |
| 14108 | 0 |
| 14109 | 0 |
| 14110 | 0 |
| 14111 | 0 |
| 14112 | 0 |
| 14113 | 0 |
| 14114 | 0 |
| 14115 | 0 |
| 14116 | 0 |
| 14117 | 0 |
| 14118 | 0 |
| 14119 | 0 |
| 14120 | 0 |
| 14121 | 0 |
| 14122 | 0 |
| 14123 | 0 |
| 14124 | 0 |
| 14125 | 0 |
| 14126 | 0 |
| 14127 | 0 |
| 14128 | 0 |
| 14129 | 0 |
| 14130 | 0 |
| 14131 | 0 |
| 14132 | 0 |
| 14133 | 0 |
| 14134 | 0 |
| 14135 | 0 |
| 14136 | 0 |
| 14137 | 0 |
| 14138 | 0 |
| 14139 | 0 |
| 14140 | 0 |
| 14141 | 0 |
| 14142 | 0 |
| 14143 | 913 |
| 14144 | 913 |
| 14145 | 913 |
| 14146 | 913 |
| 14147 | 0 |
| 14148 | 0 |
| 14149 | 0 |
| 14150 | 0 |
| 14151 | 0 |
| 14152 | 0 |
| 14153 | 0 |
| 14154 | 0 |
| 14155 | 0 |
| 14156 | 0 |
| 14157 | 0 |
| 14158 | 0 |
| 14159 | 0 |
| 14160 | 0 |
| 14161 | 0 |
| 14162 | 0 |
| 14163 | 0 |
| 14164 | 0 |
| 14165 | 0 |
| 14166 | 0 |
| 14167 | 0 |
| 14168 | 0 |
| 14169 | 0 |
| 14170 | 0 |
| 14171 | 0 |
| 14172 | 0 |
| 14173 | 0 |
| 14174 | 0 |
| 14175 | 0 |
| 14176 | 0 |
| 14177 | 0 |
| 14178 | 0 |
| 14179 | 0 |
| 14180 | 0 |
| 14181 | 0 |
| 14182 | 0 |
| 14183 | 0 |
| 14184 | 0 |
| 14185 | 0 |
| 14186 | 0 |
| 14187 | 0 |
| 14188 | 0 |
| 14189 | 0 |
| 14190 | 0 |
| 14191 | 0 |
| 14192 | 913 |
| 14193 | 913 |
| 14194 | 913 |
| 14195 | 0 |
| 14196 | 0 |
| 14197 | 0 |
| 14198 | 0 |
| 14199 | 0 |
| 14200 | 0 |
| 14201 | 0 |
| 14202 | 0 |
| 14203 | 0 |
| 14204 | 0 |
| 14205 | 0 |
| 14206 | 0 |
| 14207 | 0 |
| 14208 | 0 |
| 14209 | 0 |
| 14210 | 0 |
| 14211 | 0 |
| 14212 | 0 |
| 14213 | 0 |
| 14214 | 0 |
| 14215 | 0 |
| 14216 | 0 |
| 14217 | 0 |
| 14218 | 0 |
| 14219 | 0 |
| 14220 | 0 |
| 14221 | 0 |
| 14222 | 0 |
| 14223 | 0 |
| 14224 | 0 |
| 14225 | 0 |
| 14226 | 0 |
| 14227 | 0 |
| 14228 | 0 |
| 14229 | 0 |
| 14230 | 0 |
| 14231 | 0 |
| 14232 | 0 |
| 14233 | 0 |
| 14234 | 0 |
| 14235 | 0 |
| 14236 | 0 |
| 14237 | 0 |
| 14238 | 0 |
| 14239 | 0 |
| 14240 | 912 |
| 14241 | 913 |
| 14242 | 912 |
| 14243 | 0 |
| 14244 | 0 |
| 14245 | 0 |
| 14246 | 0 |
| 14247 | 0 |
| 14248 | 0 |
| 14249 | 0 |
| 14250 | 0 |
| 14251 | 0 |
| 14252 | 0 |
| 14253 | 0 |
| 14254 | 0 |
| 14255 | 0 |
| 14256 | 0 |
| 14257 | 0 |
| 14258 | 0 |
| 14259 | 0 |
| 14260 | 0 |
| 14261 | 0 |
| 14262 | 0 |
| 14263 | 0 |
| 14264 | 0 |
| 14265 | 0 |
| 14266 | 0 |
| 14267 | 0 |
| 14268 | 0 |
| 14269 | 0 |
| 14270 | 0 |
| 14271 | 0 |
| 14272 | 0 |
| 14273 | 0 |
| 14274 | 0 |
| 14275 | 0 |
| 14276 | 0 |
| 14277 | 0 |
| 14278 | 0 |
| 14279 | 0 |
| 14280 | 0 |
| 14281 | 0 |
| 14282 | 0 |
| 14283 | 0 |
| 14284 | 0 |
| 14285 | 0 |
| 14286 | 0 |
| 14287 | 0 |
| 14288 | 911 |
| 14289 | 912 |
| 14290 | 911 |
| 14291 | 912 |
| 14292 | 0 |
| 14293 | 0 |
| 14294 | 0 |
| 14295 | 0 |
| 14296 | 0 |
| 14297 | 0 |
| 14298 | 0 |
| 14299 | 0 |
| 14300 | 0 |
| 14301 | 0 |
| 14302 | 0 |
| 14303 | 0 |
| 14304 | 0 |
| 14305 | 0 |
| 14306 | 0 |
| 14307 | 0 |
| 14308 | 0 |
| 14309 | 0 |
| 14310 | 0 |
| 14311 | 0 |
| 14312 | 0 |
| 14313 | 0 |
| 14314 | 0 |
| 14315 | 0 |
| 14316 | 0 |
| 14317 | 0 |
| 14318 | 0 |
| 14319 | 0 |
| 14320 | 0 |
| 14321 | 0 |
| 14322 | 0 |
| 14323 | 0 |
| 14324 | 0 |
| 14325 | 0 |
| 14326 | 0 |
| 14327 | 0 |
| 14328 | 0 |
| 14329 | 0 |
| 14330 | 0 |
| 14331 | 0 |
| 14332 | 0 |
| 14333 | 0 |
| 14334 | 0 |
| 14335 | 0 |
| 14336 | 913 |
| 14337 | 913 |
| 14338 | 912 |
| 14339 | 913 |
| 14340 | 0 |
| 14341 | 0 |
| 14342 | 0 |
| 14343 | 0 |
| 14344 | 0 |
| 14345 | 0 |
| 14346 | 0 |
| 14347 | 0 |
| 14348 | 0 |
| 14349 | 0 |
| 14350 | 0 |
| 14351 | 0 |
| 14352 | 0 |
| 14353 | 0 |
| 14354 | 0 |
| 14355 | 0 |
| 14356 | 0 |
| 14357 | 0 |
| 14358 | 0 |
| 14359 | 0 |
| 14360 | 0 |
| 14361 | 0 |
| 14362 | 0 |
| 14363 | 0 |
| 14364 | 0 |
| 14365 | 0 |
| 14366 | 0 |
| 14367 | 0 |
| 14368 | 0 |
| 14369 | 0 |
| 14370 | 0 |
| 14371 | 0 |
| 14372 | 0 |
| 14373 | 0 |
| 14374 | 0 |
| 14375 | 0 |
| 14376 | 0 |
| 14377 | 0 |
| 14378 | 0 |
| 14379 | 0 |
| 14380 | 0 |
| 14381 | 0 |
| 14382 | 0 |
| 14383 | 0 |
| 14384 | 912 |
| 14385 | 912 |
| 14386 | 910 |
| 14387 | 910 |
| 14388 | 0 |
| 14389 | 0 |
| 14390 | 0 |
| 14391 | 0 |
| 14392 | 0 |
| 14393 | 0 |
| 14394 | 0 |
| 14395 | 0 |
| 14396 | 0 |
| 14397 | 0 |
| 14398 | 0 |
| 14399 | 0 |
| 14400 | 0 |
| 14401 | 0 |
| 14402 | 0 |
| 14403 | 0 |
| 14404 | 0 |
| 14405 | 0 |
| 14406 | 0 |
| 14407 | 0 |
| 14408 | 0 |
| 14409 | 0 |
| 14410 | 0 |
| 14411 | 0 |
| 14412 | 0 |
| 14413 | 0 |
| 14414 | 0 |
| 14415 | 0 |
| 14416 | 0 |
| 14417 | 0 |
| 14418 | 0 |
| 14419 | 0 |
| 14420 | 0 |
| 14421 | 0 |
| 14422 | 0 |
| 14423 | 0 |
| 14424 | 0 |
| 14425 | 0 |
| 14426 | 0 |
| 14427 | 0 |
| 14428 | 0 |
| 14429 | 0 |
| 14430 | 0 |
| 14431 | 0 |
| 14432 | 0 |
| 14433 | 913 |
| 14434 | 913 |
| 14435 | 913 |
| 14436 | 0 |
| 14437 | 0 |
| 14438 | 0 |
| 14439 | 0 |
| 14440 | 0 |
| 14441 | 0 |
| 14442 | 0 |
| 14443 | 0 |
| 14444 | 0 |
| 14445 | 0 |
| 14446 | 0 |
| 14447 | 0 |
| 14448 | 0 |
| 14449 | 0 |
| 14450 | 0 |
| 14451 | 0 |
| 14452 | 0 |
| 14453 | 0 |
| 14454 | 0 |
| 14455 | 0 |
| 14456 | 0 |
| 14457 | 0 |
| 14458 | 0 |
| 14459 | 0 |
| 14460 | 0 |
| 14461 | 0 |
| 14462 | 0 |
| 14463 | 0 |
| 14464 | 0 |
| 14465 | 0 |
| 14466 | 0 |
| 14467 | 0 |
| 14468 | 0 |
| 14469 | 0 |
| 14470 | 0 |
| 14471 | 0 |
| 14472 | 0 |
| 14473 | 0 |
| 14474 | 0 |
| 14475 | 0 |
| 14476 | 0 |
| 14477 | 0 |
| 14478 | 0 |
| 14479 | 0 |
| 14480 | 0 |
| 14481 | 911 |
| 14482 | 912 |
| 14483 | 910 |
| 14484 | 0 |
| 14485 | 0 |
| 14486 | 0 |
| 14487 | 0 |
| 14488 | 0 |
| 14489 | 0 |
| 14490 | 0 |
| 14491 | 0 |
| 14492 | 0 |
| 14493 | 0 |
| 14494 | 0 |
| 14495 | 0 |
| 14496 | 0 |
| 14497 | 0 |
| 14498 | 0 |
| 14499 | 0 |
| 14500 | 0 |
| 14501 | 0 |
| 14502 | 0 |
| 14503 | 0 |
| 14504 | 0 |
| 14505 | 0 |
| 14506 | 0 |
| 14507 | 0 |
| 14508 | 0 |
| 14509 | 0 |
| 14510 | 0 |
| 14511 | 0 |
| 14512 | 0 |
| 14513 | 0 |
| 14514 | 0 |
| 14515 | 0 |
| 14516 | 0 |
| 14517 | 0 |
| 14518 | 0 |
| 14519 | 0 |
| 14520 | 0 |
| 14521 | 0 |
| 14522 | 0 |
| 14523 | 0 |
| 14524 | 0 |
| 14525 | 0 |
| 14526 | 0 |
| 14527 | 0 |
| 14528 | 0 |
| 14529 | 910 |
| 14530 | 910 |
| 14531 | 909 |
| 14532 | 910 |
| 14533 | 0 |
| 14534 | 0 |
| 14535 | 0 |
| 14536 | 0 |
| 14537 | 0 |
| 14538 | 0 |
| 14539 | 0 |
| 14540 | 0 |
| 14541 | 0 |
| 14542 | 0 |
| 14543 | 0 |
| 14544 | 0 |
| 14545 | 0 |
| 14546 | 0 |
| 14547 | 0 |
| 14548 | 0 |
| 14549 | 0 |
| 14550 | 0 |
| 14551 | 0 |
| 14552 | 0 |
| 14553 | 0 |
| 14554 | 0 |
| 14555 | 0 |
| 14556 | 0 |
| 14557 | 0 |
| 14558 | 0 |
| 14559 | 0 |
| 14560 | 0 |
| 14561 | 0 |
| 14562 | 0 |
| 14563 | 0 |
| 14564 | 0 |
| 14565 | 0 |
| 14566 | 0 |
| 14567 | 0 |
| 14568 | 0 |
| 14569 | 0 |
| 14570 | 0 |
| 14571 | 0 |
| 14572 | 0 |
| 14573 | 0 |
| 14574 | 0 |
| 14575 | 0 |
| 14576 | 0 |
| 14577 | 0 |
| 14578 | 913 |
| 14579 | 912 |
| 14580 | 912 |
| 14581 | 0 |
| 14582 | 0 |
| 14583 | 0 |
| 14584 | 0 |
| 14585 | 0 |
| 14586 | 0 |
| 14587 | 0 |
| 14588 | 0 |
| 14589 | 0 |
| 14590 | 0 |
| 14591 | 0 |
| 14592 | 0 |
| 14593 | 0 |
| 14594 | 0 |
| 14595 | 0 |
| 14596 | 0 |
| 14597 | 0 |
| 14598 | 0 |
| 14599 | 0 |
| 14600 | 0 |
| 14601 | 0 |
| 14602 | 0 |
| 14603 | 0 |
| 14604 | 0 |
| 14605 | 0 |
| 14606 | 0 |
| 14607 | 0 |
| 14608 | 0 |
| 14609 | 0 |
| 14610 | 0 |
| 14611 | 0 |
| 14612 | 0 |
| 14613 | 0 |
| 14614 | 0 |
| 14615 | 0 |
| 14616 | 0 |
| 14617 | 0 |
| 14618 | 0 |
| 14619 | 0 |
| 14620 | 0 |
| 14621 | 0 |
| 14622 | 0 |
| 14623 | 0 |
| 14624 | 0 |
| 14625 | 0 |
| 14626 | 913 |
| 14627 | 913 |
| 14628 | 914 |
| 14629 | 0 |
| 14630 | 0 |
| 14631 | 0 |
| 14632 | 0 |
| 14633 | 0 |
| 14634 | 0 |
| 14635 | 0 |
| 14636 | 0 |
| 14637 | 0 |
| 14638 | 0 |
| 14639 | 0 |
| 14640 | 0 |
| 14641 | 0 |
| 14642 | 0 |
| 14643 | 0 |
| 14644 | 0 |
| 14645 | 0 |
| 14646 | 0 |
| 14647 | 0 |
| 14648 | 0 |
| 14649 | 0 |
| 14650 | 0 |
| 14651 | 0 |
| 14652 | 0 |
| 14653 | 0 |
| 14654 | 0 |
| 14655 | 0 |
| 14656 | 0 |
| 14657 | 0 |
| 14658 | 0 |
| 14659 | 0 |
| 14660 | 0 |
| 14661 | 0 |
| 14662 | 0 |
| 14663 | 0 |
| 14664 | 0 |
| 14665 | 0 |
| 14666 | 0 |
| 14667 | 0 |
| 14668 | 0 |
| 14669 | 0 |
| 14670 | 0 |
| 14671 | 0 |
| 14672 | 0 |
| 14673 | 0 |
| 14674 | 910 |
| 14675 | 910 |
| 14676 | 909 |
| 14677 | 0 |
| 14678 | 0 |
| 14679 | 0 |
| 14680 | 0 |
| 14681 | 0 |
| 14682 | 0 |
| 14683 | 0 |
| 14684 | 0 |
| 14685 | 0 |
| 14686 | 0 |
| 14687 | 0 |
| 14688 | 0 |
| 14689 | 0 |
| 14690 | 0 |
| 14691 | 0 |
| 14692 | 0 |
| 14693 | 0 |
| 14694 | 0 |
| 14695 | 0 |
| 14696 | 0 |
| 14697 | 0 |
| 14698 | 0 |
| 14699 | 0 |
| 14700 | 0 |
| 14701 | 0 |
| 14702 | 0 |
| 14703 | 0 |
| 14704 | 0 |
| 14705 | 0 |
| 14706 | 0 |
| 14707 | 0 |
| 14708 | 0 |
| 14709 | 0 |
| 14710 | 0 |
| 14711 | 0 |
| 14712 | 0 |
| 14713 | 0 |
| 14714 | 0 |
| 14715 | 0 |
| 14716 | 0 |
| 14717 | 0 |
| 14718 | 0 |
| 14719 | 0 |
| 14720 | 0 |
| 14721 | 0 |
| 14722 | 910 |
| 14723 | 910 |
| 14724 | 909 |
| 14725 | 910 |
| 14726 | 0 |
| 14727 | 0 |
| 14728 | 0 |
| 14729 | 0 |
| 14730 | 0 |
| 14731 | 0 |
| 14732 | 0 |
| 14733 | 0 |
| 14734 | 0 |
| 14735 | 0 |
| 14736 | 0 |
| 14737 | 0 |
| 14738 | 0 |
| 14739 | 0 |
| 14740 | 0 |
| 14741 | 0 |
| 14742 | 0 |
| 14743 | 0 |
| 14744 | 0 |
| 14745 | 0 |
| 14746 | 0 |
| 14747 | 0 |
| 14748 | 0 |
| 14749 | 0 |
| 14750 | 0 |
| 14751 | 0 |
| 14752 | 0 |
| 14753 | 0 |
| 14754 | 0 |
| 14755 | 0 |
| 14756 | 0 |
| 14757 | 0 |
| 14758 | 0 |
| 14759 | 0 |
| 14760 | 0 |
| 14761 | 0 |
| 14762 | 0 |
| 14763 | 0 |
| 14764 | 0 |
| 14765 | 0 |
| 14766 | 0 |
| 14767 | 0 |
| 14768 | 0 |
| 14769 | 0 |
| 14770 | 911 |
| 14771 | 912 |
| 14772 | 912 |
| 14773 | 912 |
| 14774 | 0 |
| 14775 | 0 |
| 14776 | 0 |
| 14777 | 0 |
| 14778 | 0 |
| 14779 | 0 |
| 14780 | 0 |
| 14781 | 0 |
| 14782 | 0 |
| 14783 | 0 |
| 14784 | 0 |
| 14785 | 0 |
| 14786 | 0 |
| 14787 | 0 |
| 14788 | 0 |
| 14789 | 0 |
| 14790 | 0 |
| 14791 | 0 |
| 14792 | 0 |
| 14793 | 0 |
| 14794 | 0 |
| 14795 | 0 |
| 14796 | 0 |
| 14797 | 0 |
| 14798 | 0 |
| 14799 | 0 |
| 14800 | 0 |
| 14801 | 0 |
| 14802 | 0 |
| 14803 | 0 |
| 14804 | 0 |
| 14805 | 0 |
| 14806 | 0 |
| 14807 | 0 |
| 14808 | 0 |
| 14809 | 0 |
| 14810 | 0 |
| 14811 | 0 |
| 14812 | 0 |
| 14813 | 0 |
| 14814 | 0 |
| 14815 | 0 |
| 14816 | 0 |
| 14817 | 0 |
| 14818 | 0 |
| 14819 | 911 |
| 14820 | 912 |
| 14821 | 912 |
| 14822 | 0 |
| 14823 | 0 |
| 14824 | 0 |
| 14825 | 0 |
| 14826 | 0 |
| 14827 | 0 |
| 14828 | 0 |
| 14829 | 0 |
| 14830 | 0 |
| 14831 | 0 |
| 14832 | 0 |
| 14833 | 0 |
| 14834 | 0 |
| 14835 | 0 |
| 14836 | 0 |
| 14837 | 0 |
| 14838 | 0 |
| 14839 | 0 |
| 14840 | 0 |
| 14841 | 0 |
| 14842 | 0 |
| 14843 | 0 |
| 14844 | 0 |
| 14845 | 0 |
| 14846 | 0 |
| 14847 | 0 |
| 14848 | 0 |
| 14849 | 0 |
| 14850 | 0 |
| 14851 | 0 |
| 14852 | 0 |
| 14853 | 0 |
| 14854 | 0 |
| 14855 | 0 |
| 14856 | 0 |
| 14857 | 0 |
| 14858 | 0 |
| 14859 | 0 |
| 14860 | 0 |
| 14861 | 0 |
| 14862 | 0 |
| 14863 | 0 |
| 14864 | 0 |
| 14865 | 0 |
| 14866 | 0 |
| 14867 | 910 |
| 14868 | 911 |
| 14869 | 909 |
| 14870 | 908 |
| 14871 | 0 |
| 14872 | 0 |
| 14873 | 0 |
| 14874 | 0 |
| 14875 | 0 |
| 14876 | 0 |
| 14877 | 0 |
| 14878 | 0 |
| 14879 | 0 |
| 14880 | 0 |
| 14881 | 0 |
| 14882 | 0 |
| 14883 | 0 |
| 14884 | 0 |
| 14885 | 0 |
| 14886 | 0 |
| 14887 | 0 |
| 14888 | 0 |
| 14889 | 0 |
| 14890 | 0 |
| 14891 | 0 |
| 14892 | 0 |
| 14893 | 0 |
| 14894 | 0 |
| 14895 | 0 |
| 14896 | 0 |
| 14897 | 0 |
| 14898 | 0 |
| 14899 | 0 |
| 14900 | 0 |
| 14901 | 0 |
| 14902 | 0 |
| 14903 | 0 |
| 14904 | 0 |
| 14905 | 0 |
| 14906 | 0 |
| 14907 | 0 |
| 14908 | 0 |
| 14909 | 0 |
| 14910 | 0 |
| 14911 | 0 |
| 14912 | 0 |
| 14913 | 0 |
| 14914 | 0 |
| 14915 | 911 |
| 14916 | 913 |
| 14917 | 911 |
| 14918 | 911 |
| 14919 | 0 |
| 14920 | 0 |
| 14921 | 0 |
| 14922 | 0 |
| 14923 | 0 |
| 14924 | 0 |
| 14925 | 0 |
| 14926 | 0 |
| 14927 | 0 |
| 14928 | 0 |
| 14929 | 0 |
| 14930 | 0 |
| 14931 | 0 |
| 14932 | 0 |
| 14933 | 0 |
| 14934 | 0 |
| 14935 | 0 |
| 14936 | 0 |
| 14937 | 0 |
| 14938 | 0 |
| 14939 | 0 |
| 14940 | 0 |
| 14941 | 0 |
| 14942 | 0 |
| 14943 | 0 |
| 14944 | 0 |
| 14945 | 0 |
| 14946 | 0 |
| 14947 | 0 |
| 14948 | 0 |
| 14949 | 0 |
| 14950 | 0 |
| 14951 | 0 |
| 14952 | 0 |
| 14953 | 0 |
| 14954 | 0 |
| 14955 | 0 |
| 14956 | 0 |
| 14957 | 0 |
| 14958 | 0 |
| 14959 | 0 |
| 14960 | 0 |
| 14961 | 0 |
| 14962 | 0 |
| 14963 | 913 |
| 14964 | 913 |
| 14965 | 911 |
| 14966 | 911 |
| 14967 | 0 |
| 14968 | 0 |
| 14969 | 0 |
| 14970 | 0 |
| 14971 | 0 |
| 14972 | 0 |
| 14973 | 0 |
| 14974 | 0 |
| 14975 | 0 |
| 14976 | 0 |
| 14977 | 0 |
| 14978 | 0 |
| 14979 | 0 |
| 14980 | 0 |
| 14981 | 0 |
| 14982 | 0 |
| 14983 | 0 |
| 14984 | 0 |
| 14985 | 0 |
| 14986 | 0 |
| 14987 | 0 |
| 14988 | 0 |
| 14989 | 0 |
| 14990 | 0 |
| 14991 | 0 |
| 14992 | 0 |
| 14993 | 0 |
| 14994 | 0 |
| 14995 | 0 |
| 14996 | 0 |
| 14997 | 0 |
| 14998 | 0 |
| 14999 | 0 |
| 15000 | 0 |
| 15001 | 0 |
| 15002 | 0 |
| 15003 | 0 |
| 15004 | 0 |
| 15005 | 0 |
| 15006 | 0 |
| 15007 | 0 |
| 15008 | 0 |
| 15009 | 0 |
| 15010 | 0 |
| 15011 | 0 |
| 15012 | 912 |
| 15013 | 913 |
| 15014 | 912 |
| 15015 | 0 |
| 15016 | 0 |
| 15017 | 0 |
| 15018 | 0 |
| 15019 | 0 |
| 15020 | 0 |
| 15021 | 0 |
| 15022 | 0 |
| 15023 | 0 |
| 15024 | 0 |
| 15025 | 0 |
| 15026 | 0 |
| 15027 | 0 |
| 15028 | 0 |
| 15029 | 0 |
| 15030 | 0 |
| 15031 | 0 |
| 15032 | 0 |
| 15033 | 0 |
| 15034 | 0 |
| 15035 | 0 |
| 15036 | 0 |
| 15037 | 0 |
| 15038 | 0 |
| 15039 | 0 |
| 15040 | 0 |
| 15041 | 0 |
| 15042 | 0 |
| 15043 | 0 |
| 15044 | 0 |
| 15045 | 0 |
| 15046 | 0 |
| 15047 | 0 |
| 15048 | 0 |
| 15049 | 0 |
| 15050 | 0 |
| 15051 | 0 |
| 15052 | 0 |
| 15053 | 0 |
| 15054 | 0 |
| 15055 | 0 |
| 15056 | 0 |
| 15057 | 0 |
| 15058 | 0 |
| 15059 | 0 |
| 15060 | 912 |
| 15061 | 912 |
| 15062 | 912 |
| 15063 | 0 |
| 15064 | 0 |
| 15065 | 0 |
| 15066 | 0 |
| 15067 | 0 |
| 15068 | 0 |
| 15069 | 0 |
| 15070 | 0 |
| 15071 | 0 |
| 15072 | 0 |
| 15073 | 0 |
| 15074 | 0 |
| 15075 | 0 |
| 15076 | 0 |
| 15077 | 0 |
| 15078 | 0 |
| 15079 | 0 |
| 15080 | 0 |
| 15081 | 0 |
| 15082 | 0 |
| 15083 | 0 |
| 15084 | 0 |
| 15085 | 0 |
| 15086 | 0 |
| 15087 | 0 |
| 15088 | 0 |
| 15089 | 0 |
| 15090 | 0 |
| 15091 | 0 |
| 15092 | 0 |
| 15093 | 0 |
| 15094 | 0 |
| 15095 | 0 |
| 15096 | 0 |
| 15097 | 0 |
| 15098 | 0 |
| 15099 | 0 |
| 15100 | 0 |
| 15101 | 0 |
| 15102 | 0 |
| 15103 | 0 |
| 15104 | 0 |
| 15105 | 0 |
| 15106 | 0 |
| 15107 | 0 |
| 15108 | 910 |
| 15109 | 910 |
| 15110 | 910 |
| 15111 | 908 |
| 15112 | 0 |
| 15113 | 0 |
| 15114 | 0 |
| 15115 | 0 |
| 15116 | 0 |
| 15117 | 0 |
| 15118 | 0 |
| 15119 | 0 |
| 15120 | 0 |
| 15121 | 0 |
| 15122 | 0 |
| 15123 | 0 |
| 15124 | 0 |
| 15125 | 0 |
| 15126 | 0 |
| 15127 | 0 |
| 15128 | 0 |
| 15129 | 0 |
| 15130 | 0 |
| 15131 | 0 |
| 15132 | 0 |
| 15133 | 0 |
| 15134 | 0 |
| 15135 | 0 |
| 15136 | 0 |
| 15137 | 0 |
| 15138 | 0 |
| 15139 | 0 |
| 15140 | 0 |
| 15141 | 0 |
| 15142 | 0 |
| 15143 | 0 |
| 15144 | 0 |
| 15145 | 0 |
| 15146 | 0 |
| 15147 | 0 |
| 15148 | 0 |
| 15149 | 0 |
| 15150 | 0 |
| 15151 | 0 |
| 15152 | 0 |
| 15153 | 0 |
| 15154 | 0 |
| 15155 | 0 |
| 15156 | 912 |
| 15157 | 913 |
| 15158 | 913 |
| 15159 | 911 |
| 15160 | 0 |
| 15161 | 0 |
| 15162 | 0 |
| 15163 | 0 |
| 15164 | 0 |
| 15165 | 0 |
| 15166 | 0 |
| 15167 | 0 |
| 15168 | 0 |
| 15169 | 0 |
| 15170 | 0 |
| 15171 | 0 |
| 15172 | 0 |
| 15173 | 0 |
| 15174 | 0 |
| 15175 | 0 |
| 15176 | 0 |
| 15177 | 0 |
| 15178 | 0 |
| 15179 | 0 |
| 15180 | 0 |
| 15181 | 0 |
| 15182 | 0 |
| 15183 | 0 |
| 15184 | 0 |
| 15185 | 0 |
| 15186 | 0 |
| 15187 | 0 |
| 15188 | 0 |
| 15189 | 0 |
| 15190 | 0 |
| 15191 | 0 |
| 15192 | 0 |
| 15193 | 0 |
| 15194 | 0 |
| 15195 | 0 |
| 15196 | 0 |
| 15197 | 0 |
| 15198 | 0 |
| 15199 | 0 |
| 15200 | 0 |
| 15201 | 0 |
| 15202 | 0 |
| 15203 | 0 |
| 15204 | 913 |
| 15205 | 913 |
| 15206 | 914 |
| 15207 | 911 |
| 15208 | 0 |
| 15209 | 0 |
| 15210 | 0 |
| 15211 | 0 |
| 15212 | 0 |
| 15213 | 0 |
| 15214 | 0 |
| 15215 | 0 |
| 15216 | 0 |
| 15217 | 0 |
| 15218 | 0 |
| 15219 | 0 |
| 15220 | 0 |
| 15221 | 0 |
| 15222 | 0 |
| 15223 | 0 |
| 15224 | 0 |
| 15225 | 0 |
| 15226 | 0 |
| 15227 | 0 |
| 15228 | 0 |
| 15229 | 0 |
| 15230 | 0 |
| 15231 | 0 |
| 15232 | 0 |
| 15233 | 0 |
| 15234 | 0 |
| 15235 | 0 |
| 15236 | 0 |
| 15237 | 0 |
| 15238 | 0 |
| 15239 | 0 |
| 15240 | 0 |
| 15241 | 0 |
| 15242 | 0 |
| 15243 | 0 |
| 15244 | 0 |
| 15245 | 0 |
| 15246 | 0 |
| 15247 | 0 |
| 15248 | 0 |
| 15249 | 0 |
| 15250 | 0 |
| 15251 | 0 |
| 15252 | 911 |
| 15253 | 910 |
| 15254 | 911 |
| 15255 | 908 |
| 15256 | 0 |
| 15257 | 0 |
| 15258 | 0 |
| 15259 | 0 |
| 15260 | 0 |
| 15261 | 0 |
| 15262 | 0 |
| 15263 | 0 |
| 15264 | 0 |
| 15265 | 0 |
| 15266 | 0 |
| 15267 | 0 |
| 15268 | 0 |
| 15269 | 0 |
| 15270 | 0 |
| 15271 | 0 |
| 15272 | 0 |
| 15273 | 0 |
| 15274 | 0 |
| 15275 | 0 |
| 15276 | 0 |
| 15277 | 0 |
| 15278 | 0 |
| 15279 | 0 |
| 15280 | 0 |
| 15281 | 0 |
| 15282 | 0 |
| 15283 | 0 |
| 15284 | 0 |
| 15285 | 0 |
| 15286 | 0 |
| 15287 | 0 |
| 15288 | 0 |
| 15289 | 0 |
| 15290 | 0 |
| 15291 | 0 |
| 15292 | 0 |
| 15293 | 0 |
| 15294 | 0 |
| 15295 | 0 |
| 15296 | 0 |
| 15297 | 0 |
| 15298 | 0 |
| 15299 | 0 |
| 15300 | 0 |
| 15301 | 913 |
| 15302 | 912 |
| 15303 | 911 |
| 15304 | 0 |
| 15305 | 0 |
| 15306 | 0 |
| 15307 | 0 |
| 15308 | 0 |
| 15309 | 0 |
| 15310 | 0 |
| 15311 | 0 |
| 15312 | 0 |
| 15313 | 0 |
| 15314 | 0 |
| 15315 | 0 |
| 15316 | 0 |
| 15317 | 0 |
| 15318 | 0 |
| 15319 | 0 |
| 15320 | 0 |
| 15321 | 0 |
| 15322 | 0 |
| 15323 | 0 |
| 15324 | 0 |
| 15325 | 0 |
| 15326 | 0 |
| 15327 | 0 |
| 15328 | 0 |
| 15329 | 0 |
| 15330 | 0 |
| 15331 | 0 |
| 15332 | 0 |
| 15333 | 0 |
| 15334 | 0 |
| 15335 | 0 |
| 15336 | 0 |
| 15337 | 0 |
| 15338 | 0 |
| 15339 | 0 |
| 15340 | 0 |
| 15341 | 0 |
| 15342 | 0 |
| 15343 | 0 |
| 15344 | 0 |
| 15345 | 0 |
| 15346 | 0 |
| 15347 | 0 |
| 15348 | 0 |
| 15349 | 914 |
| 15350 | 913 |
| 15351 | 913 |
| 15352 | 0 |
| 15353 | 0 |
| 15354 | 0 |
| 15355 | 0 |
| 15356 | 0 |
| 15357 | 0 |
| 15358 | 0 |
| 15359 | 0 |
| 15360 | 0 |
| 15361 | 0 |
| 15362 | 0 |
| 15363 | 0 |
| 15364 | 0 |
| 15365 | 0 |
| 15366 | 0 |
| 15367 | 0 |
| 15368 | 0 |
| 15369 | 0 |
| 15370 | 0 |
| 15371 | 0 |
| 15372 | 0 |
| 15373 | 0 |
| 15374 | 0 |
| 15375 | 0 |
| 15376 | 0 |
| 15377 | 0 |
| 15378 | 0 |
| 15379 | 0 |
| 15380 | 0 |
| 15381 | 0 |
| 15382 | 0 |
| 15383 | 0 |
| 15384 | 0 |
| 15385 | 0 |
| 15386 | 0 |
| 15387 | 0 |
| 15388 | 0 |
| 15389 | 0 |
| 15390 | 0 |
| 15391 | 0 |
| 15392 | 0 |
| 15393 | 0 |
| 15394 | 0 |
| 15395 | 0 |
| 15396 | 0 |
| 15397 | 914 |
| 15398 | 913 |
| 15399 | 913 |
| 15400 | 914 |
| 15401 | 0 |
| 15402 | 0 |
| 15403 | 0 |
| 15404 | 0 |
| 15405 | 0 |
| 15406 | 0 |
| 15407 | 0 |
| 15408 | 0 |
| 15409 | 0 |
| 15410 | 0 |
| 15411 | 0 |
| 15412 | 0 |
| 15413 | 0 |
| 15414 | 0 |
| 15415 | 0 |
| 15416 | 0 |
| 15417 | 0 |
| 15418 | 0 |
| 15419 | 0 |
| 15420 | 0 |
| 15421 | 0 |
| 15422 | 0 |
| 15423 | 0 |
| 15424 | 0 |
| 15425 | 0 |
| 15426 | 0 |
| 15427 | 0 |
| 15428 | 0 |
| 15429 | 0 |
| 15430 | 0 |
| 15431 | 0 |
| 15432 | 0 |
| 15433 | 0 |
| 15434 | 0 |
| 15435 | 0 |
| 15436 | 0 |
| 15437 | 0 |
| 15438 | 0 |
| 15439 | 0 |
| 15440 | 0 |
| 15441 | 0 |
| 15442 | 0 |
| 15443 | 0 |
| 15444 | 0 |
| 15445 | 910 |
| 15446 | 910 |
| 15447 | 910 |
| 15448 | 910 |
| 15449 | 0 |
| 15450 | 0 |
| 15451 | 0 |
| 15452 | 0 |
| 15453 | 0 |
| 15454 | 0 |
| 15455 | 0 |
| 15456 | 0 |
| 15457 | 0 |
| 15458 | 0 |
| 15459 | 0 |
| 15460 | 0 |
| 15461 | 0 |
| 15462 | 0 |
| 15463 | 0 |
| 15464 | 0 |
| 15465 | 0 |
| 15466 | 0 |
| 15467 | 0 |
| 15468 | 0 |
| 15469 | 0 |
| 15470 | 0 |
| 15471 | 0 |
| 15472 | 0 |
| 15473 | 0 |
| 15474 | 0 |
| 15475 | 0 |
| 15476 | 0 |
| 15477 | 0 |
| 15478 | 0 |
| 15479 | 0 |
| 15480 | 0 |
| 15481 | 0 |
| 15482 | 0 |
| 15483 | 0 |
| 15484 | 0 |
| 15485 | 0 |
| 15486 | 0 |
| 15487 | 0 |
| 15488 | 0 |
| 15489 | 0 |
| 15490 | 0 |
| 15491 | 0 |
| 15492 | 0 |
| 15493 | 910 |
| 15494 | 910 |
| 15495 | 910 |
| 15496 | 910 |
| 15497 | 0 |
| 15498 | 0 |
| 15499 | 0 |
| 15500 | 0 |
| 15501 | 0 |
| 15502 | 0 |
| 15503 | 0 |
| 15504 | 0 |
| 15505 | 0 |
| 15506 | 0 |
| 15507 | 0 |
| 15508 | 0 |
| 15509 | 0 |
| 15510 | 0 |
| 15511 | 0 |
| 15512 | 0 |
| 15513 | 0 |
| 15514 | 0 |
| 15515 | 0 |
| 15516 | 0 |
| 15517 | 0 |
| 15518 | 0 |
| 15519 | 0 |
| 15520 | 0 |
| 15521 | 0 |
| 15522 | 0 |
| 15523 | 0 |
| 15524 | 0 |
| 15525 | 0 |
| 15526 | 0 |
| 15527 | 0 |
| 15528 | 0 |
| 15529 | 0 |
| 15530 | 0 |
| 15531 | 0 |
| 15532 | 0 |
| 15533 | 0 |
| 15534 | 0 |
| 15535 | 0 |
| 15536 | 0 |
| 15537 | 0 |
| 15538 | 0 |
| 15539 | 0 |
| 15540 | 0 |
| 15541 | 911 |
| 15542 | 911 |
| 15543 | 911 |
| 15544 | 911 |
| 15545 | 0 |
| 15546 | 0 |
| 15547 | 0 |
| 15548 | 0 |
| 15549 | 0 |
| 15550 | 0 |
| 15551 | 0 |
| 15552 | 0 |
| 15553 | 0 |
| 15554 | 0 |
| 15555 | 0 |
| 15556 | 0 |
| 15557 | 0 |
| 15558 | 0 |
| 15559 | 0 |
| 15560 | 0 |
| 15561 | 0 |
| 15562 | 0 |
| 15563 | 0 |
| 15564 | 0 |
| 15565 | 0 |
| 15566 | 0 |
| 15567 | 0 |
| 15568 | 0 |
| 15569 | 0 |
| 15570 | 0 |
| 15571 | 0 |
| 15572 | 0 |
| 15573 | 0 |
| 15574 | 0 |
| 15575 | 0 |
| 15576 | 0 |
| 15577 | 0 |
| 15578 | 0 |
| 15579 | 0 |
| 15580 | 0 |
| 15581 | 0 |
| 15582 | 0 |
| 15583 | 0 |
| 15584 | 0 |
| 15585 | 0 |
| 15586 | 0 |
| 15587 | 0 |
| 15588 | 0 |
| 15589 | 0 |
| 15590 | 910 |
| 15591 | 910 |
| 15592 | 909 |
| 15593 | 0 |
| 15594 | 0 |
| 15595 | 0 |
| 15596 | 0 |
| 15597 | 0 |
| 15598 | 0 |
| 15599 | 0 |
| 15600 | 0 |
| 15601 | 0 |
| 15602 | 0 |
| 15603 | 0 |
| 15604 | 0 |
| 15605 | 0 |
| 15606 | 0 |
| 15607 | 0 |
| 15608 | 0 |
| 15609 | 0 |
| 15610 | 0 |
| 15611 | 0 |
| 15612 | 0 |
| 15613 | 0 |
| 15614 | 0 |
| 15615 | 0 |
| 15616 | 0 |
| 15617 | 0 |
| 15618 | 0 |
| 15619 | 0 |
| 15620 | 0 |
| 15621 | 0 |
| 15622 | 0 |
| 15623 | 0 |
| 15624 | 0 |
| 15625 | 0 |
| 15626 | 0 |
| 15627 | 0 |
| 15628 | 0 |
| 15629 | 0 |
| 15630 | 0 |
| 15631 | 0 |
| 15632 | 0 |
| 15633 | 0 |
| 15634 | 0 |
| 15635 | 0 |
| 15636 | 0 |
| 15637 | 0 |
| 15638 | 911 |
| 15639 | 911 |
| 15640 | 909 |
| 15641 | 0 |
| 15642 | 0 |
| 15643 | 0 |
| 15644 | 0 |
| 15645 | 0 |
| 15646 | 0 |
| 15647 | 0 |
| 15648 | 0 |
| 15649 | 0 |
| 15650 | 0 |
| 15651 | 0 |
| 15652 | 0 |
| 15653 | 0 |
| 15654 | 0 |
| 15655 | 0 |
| 15656 | 0 |
| 15657 | 0 |
| 15658 | 0 |
| 15659 | 0 |
| 15660 | 0 |
| 15661 | 0 |
| 15662 | 0 |
| 15663 | 0 |
| 15664 | 0 |
| 15665 | 0 |
| 15666 | 0 |
| 15667 | 0 |
| 15668 | 0 |
| 15669 | 0 |
| 15670 | 0 |
| 15671 | 0 |
| 15672 | 0 |
| 15673 | 0 |
| 15674 | 0 |
| 15675 | 0 |
| 15676 | 0 |
| 15677 | 0 |
| 15678 | 0 |
| 15679 | 0 |
| 15680 | 0 |
| 15681 | 0 |
| 15682 | 0 |
| 15683 | 0 |
| 15684 | 0 |
| 15685 | 0 |
| 15686 | 868 |
| 15687 | 910 |
| 15688 | 909 |
| 15689 | 910 |
| 15690 | 0 |
| 15691 | 0 |
| 15692 | 0 |
| 15693 | 0 |
| 15694 | 0 |
| 15695 | 0 |
| 15696 | 0 |
| 15697 | 0 |
| 15698 | 0 |
| 15699 | 0 |
| 15700 | 0 |
| 15701 | 0 |
| 15702 | 0 |
| 15703 | 0 |
| 15704 | 0 |
| 15705 | 0 |
| 15706 | 0 |
| 15707 | 0 |
| 15708 | 0 |
| 15709 | 0 |
| 15710 | 0 |
| 15711 | 0 |
| 15712 | 0 |
| 15713 | 0 |
| 15714 | 0 |
| 15715 | 0 |
| 15716 | 0 |
| 15717 | 0 |
| 15718 | 0 |
| 15719 | 0 |
| 15720 | 0 |
| 15721 | 0 |
| 15722 | 0 |
| 15723 | 0 |
| 15724 | 0 |
| 15725 | 0 |
| 15726 | 0 |
| 15727 | 0 |
| 15728 | 0 |
| 15729 | 0 |
| 15730 | 0 |
| 15731 | 0 |
| 15732 | 0 |
| 15733 | 0 |
| 15734 | 0 |
| 15735 | 911 |
| 15736 | 910 |
| 15737 | 909 |
| 15738 | 0 |
| 15739 | 0 |
| 15740 | 0 |
| 15741 | 0 |
| 15742 | 0 |
| 15743 | 0 |
| 15744 | 0 |
| 15745 | 0 |
| 15746 | 0 |
| 15747 | 0 |
| 15748 | 0 |
| 15749 | 0 |
| 15750 | 0 |
| 15751 | 0 |
| 15752 | 0 |
| 15753 | 0 |
| 15754 | 0 |
| 15755 | 0 |
| 15756 | 0 |
| 15757 | 0 |
| 15758 | 0 |
| 15759 | 0 |
| 15760 | 0 |
| 15761 | 0 |
| 15762 | 0 |
| 15763 | 0 |
| 15764 | 0 |
| 15765 | 0 |
| 15766 | 0 |
| 15767 | 0 |
| 15768 | 0 |
| 15769 | 0 |
| 15770 | 0 |
| 15771 | 0 |
| 15772 | 0 |
| 15773 | 0 |
| 15774 | 0 |
| 15775 | 0 |
| 15776 | 0 |
| 15777 | 0 |
| 15778 | 0 |
| 15779 | 0 |
| 15780 | 0 |
| 15781 | 0 |
| 15782 | 0 |
| 15783 | 912 |
| 15784 | 912 |
| 15785 | 911 |
| 15786 | 0 |
| 15787 | 0 |
| 15788 | 0 |
| 15789 | 0 |
| 15790 | 0 |
| 15791 | 0 |
| 15792 | 0 |
| 15793 | 0 |
| 15794 | 0 |
| 15795 | 0 |
| 15796 | 0 |
| 15797 | 0 |
| 15798 | 0 |
| 15799 | 0 |
| 15800 | 0 |
| 15801 | 0 |
| 15802 | 0 |
| 15803 | 0 |
| 15804 | 0 |
| 15805 | 0 |
| 15806 | 0 |
| 15807 | 0 |
| 15808 | 0 |
| 15809 | 0 |
| 15810 | 0 |
| 15811 | 0 |
| 15812 | 0 |
| 15813 | 0 |
| 15814 | 0 |
| 15815 | 0 |
| 15816 | 0 |
| 15817 | 0 |
| 15818 | 0 |
| 15819 | 0 |
| 15820 | 0 |
| 15821 | 0 |
| 15822 | 0 |
| 15823 | 0 |
| 15824 | 0 |
| 15825 | 0 |
| 15826 | 0 |
| 15827 | 0 |
| 15828 | 0 |
| 15829 | 0 |
| 15830 | 0 |
| 15831 | 912 |
| 15832 | 913 |
| 15833 | 913 |
| 15834 | 913 |
| 15835 | 0 |
| 15836 | 0 |
| 15837 | 0 |
| 15838 | 0 |
| 15839 | 0 |
| 15840 | 0 |
| 15841 | 0 |
| 15842 | 0 |
| 15843 | 0 |
| 15844 | 0 |
| 15845 | 0 |
| 15846 | 0 |
| 15847 | 0 |
| 15848 | 0 |
| 15849 | 0 |
| 15850 | 0 |
| 15851 | 0 |
| 15852 | 0 |
| 15853 | 0 |
| 15854 | 0 |
| 15855 | 0 |
| 15856 | 0 |
| 15857 | 0 |
| 15858 | 0 |
| 15859 | 0 |
| 15860 | 0 |
| 15861 | 0 |
| 15862 | 0 |
| 15863 | 0 |
| 15864 | 0 |
| 15865 | 0 |
| 15866 | 0 |
| 15867 | 0 |
| 15868 | 0 |
| 15869 | 0 |
| 15870 | 0 |
| 15871 | 0 |
| 15872 | 0 |
| 15873 | 0 |
| 15874 | 0 |
| 15875 | 0 |
| 15876 | 0 |
| 15877 | 0 |
| 15878 | 0 |
| 15879 | 911 |
| 15880 | 910 |
| 15881 | 910 |
| 15882 | 911 |
| 15883 | 0 |
| 15884 | 0 |
| 15885 | 0 |
| 15886 | 0 |
| 15887 | 0 |
| 15888 | 0 |
| 15889 | 0 |
| 15890 | 0 |
| 15891 | 0 |
| 15892 | 0 |
| 15893 | 0 |
| 15894 | 0 |
| 15895 | 0 |
| 15896 | 0 |
| 15897 | 0 |
| 15898 | 0 |
| 15899 | 0 |
| 15900 | 0 |
| 15901 | 0 |
| 15902 | 0 |
| 15903 | 0 |
| 15904 | 0 |
| 15905 | 0 |
| 15906 | 0 |
| 15907 | 0 |
| 15908 | 0 |
| 15909 | 0 |
| 15910 | 0 |
| 15911 | 0 |
| 15912 | 0 |
| 15913 | 0 |
| 15914 | 0 |
| 15915 | 0 |
| 15916 | 0 |
| 15917 | 0 |
| 15918 | 0 |
| 15919 | 0 |
| 15920 | 0 |
| 15921 | 0 |
| 15922 | 0 |
| 15923 | 0 |
| 15924 | 0 |
| 15925 | 0 |
| 15926 | 0 |
| 15927 | 0 |
| 15928 | 914 |
| 15929 | 913 |
| 15930 | 913 |
| 15931 | 0 |
| 15932 | 0 |
| 15933 | 0 |
| 15934 | 0 |
| 15935 | 0 |
| 15936 | 0 |
| 15937 | 0 |
| 15938 | 0 |
| 15939 | 0 |
| 15940 | 0 |
| 15941 | 0 |
| 15942 | 0 |
| 15943 | 0 |
| 15944 | 0 |
| 15945 | 0 |
| 15946 | 0 |
| 15947 | 0 |
| 15948 | 0 |
| 15949 | 0 |
| 15950 | 0 |
| 15951 | 0 |
| 15952 | 0 |
| 15953 | 0 |
| 15954 | 0 |
| 15955 | 0 |
| 15956 | 0 |
| 15957 | 0 |
| 15958 | 0 |
| 15959 | 0 |
| 15960 | 0 |
| 15961 | 0 |
| 15962 | 0 |
| 15963 | 0 |
| 15964 | 0 |
| 15965 | 0 |
| 15966 | 0 |
| 15967 | 0 |
| 15968 | 0 |
| 15969 | 0 |
| 15970 | 0 |
| 15971 | 0 |
| 15972 | 0 |
| 15973 | 0 |
| 15974 | 0 |
| 15975 | 0 |
| 15976 | 914 |
| 15977 | 913 |
| 15978 | 912 |
| 15979 | 0 |
| 15980 | 0 |
| 15981 | 0 |
| 15982 | 0 |
| 15983 | 0 |
| 15984 | 0 |
| 15985 | 0 |
| 15986 | 0 |
| 15987 | 0 |
| 15988 | 0 |
| 15989 | 0 |
| 15990 | 0 |
| 15991 | 0 |
| 15992 | 0 |
| 15993 | 0 |
| 15994 | 0 |
| 15995 | 0 |
| 15996 | 0 |
| 15997 | 0 |
| 15998 | 0 |
| 15999 | 0 |
| 16000 | 0 |
| 16001 | 0 |
| 16002 | 0 |
| 16003 | 0 |
| 16004 | 0 |
| 16005 | 0 |
| 16006 | 0 |
| 16007 | 0 |
| 16008 | 0 |
| 16009 | 0 |
| 16010 | 0 |
| 16011 | 0 |
| 16012 | 0 |
| 16013 | 0 |
| 16014 | 0 |
| 16015 | 0 |
| 16016 | 0 |
| 16017 | 0 |
| 16018 | 0 |
| 16019 | 0 |
| 16020 | 0 |
| 16021 | 0 |
| 16022 | 0 |
| 16023 | 0 |
| 16024 | 913 |
| 16025 | 911 |
| 16026 | 909 |
| 16027 | 911 |
| 16028 | 0 |
| 16029 | 0 |
| 16030 | 0 |
| 16031 | 0 |
| 16032 | 0 |
| 16033 | 0 |
| 16034 | 0 |
| 16035 | 0 |
| 16036 | 0 |
| 16037 | 0 |
| 16038 | 0 |
| 16039 | 0 |
| 16040 | 0 |
| 16041 | 0 |
| 16042 | 0 |
| 16043 | 0 |
| 16044 | 0 |
| 16045 | 0 |
| 16046 | 0 |
| 16047 | 0 |
| 16048 | 0 |
| 16049 | 0 |
| 16050 | 0 |
| 16051 | 0 |
| 16052 | 0 |
| 16053 | 0 |
| 16054 | 0 |
| 16055 | 0 |
| 16056 | 0 |
| 16057 | 0 |
| 16058 | 0 |
| 16059 | 0 |
| 16060 | 0 |
| 16061 | 0 |
| 16062 | 0 |
| 16063 | 0 |
| 16064 | 0 |
| 16065 | 0 |
| 16066 | 0 |
| 16067 | 0 |
| 16068 | 0 |
| 16069 | 0 |
| 16070 | 0 |
| 16071 | 0 |
| 16072 | 914 |
| 16073 | 912 |
| 16074 | 910 |
| 16075 | 909 |
| 16076 | 0 |
| 16077 | 0 |
| 16078 | 0 |
| 16079 | 0 |
| 16080 | 0 |
| 16081 | 0 |
| 16082 | 0 |
| 16083 | 0 |
| 16084 | 0 |
| 16085 | 0 |
| 16086 | 0 |
| 16087 | 0 |
| 16088 | 0 |
| 16089 | 0 |
| 16090 | 0 |
| 16091 | 0 |
| 16092 | 0 |
| 16093 | 0 |
| 16094 | 0 |
| 16095 | 0 |
| 16096 | 0 |
| 16097 | 0 |
| 16098 | 0 |
| 16099 | 0 |
| 16100 | 0 |
| 16101 | 0 |
| 16102 | 0 |
| 16103 | 0 |
| 16104 | 0 |
| 16105 | 0 |
| 16106 | 0 |
| 16107 | 0 |
| 16108 | 0 |
| 16109 | 0 |
| 16110 | 0 |
| 16111 | 0 |
| 16112 | 0 |
| 16113 | 0 |
| 16114 | 0 |
| 16115 | 0 |
| 16116 | 0 |
| 16117 | 0 |
| 16118 | 0 |
| 16119 | 0 |
| 16120 | 837 |
| 16121 | 910 |
| 16122 | 909 |
| 16123 | 910 |
| 16124 | 0 |
| 16125 | 0 |
| 16126 | 0 |
| 16127 | 0 |
| 16128 | 0 |
| 16129 | 0 |
| 16130 | 0 |
| 16131 | 0 |
| 16132 | 0 |
| 16133 | 0 |
| 16134 | 0 |
| 16135 | 0 |
| 16136 | 0 |
| 16137 | 0 |
| 16138 | 0 |
| 16139 | 0 |
| 16140 | 0 |
| 16141 | 0 |
| 16142 | 0 |
| 16143 | 0 |
| 16144 | 0 |
| 16145 | 0 |
| 16146 | 0 |
| 16147 | 0 |
| 16148 | 0 |
| 16149 | 0 |
| 16150 | 0 |
| 16151 | 0 |
| 16152 | 0 |
| 16153 | 0 |
| 16154 | 0 |
| 16155 | 0 |
| 16156 | 0 |
| 16157 | 0 |
| 16158 | 0 |
| 16159 | 0 |
| 16160 | 0 |
| 16161 | 0 |
| 16162 | 0 |
| 16163 | 0 |
| 16164 | 0 |
| 16165 | 0 |
| 16166 | 0 |
| 16167 | 0 |
| 16168 | 0 |
| 16169 | 913 |
| 16170 | 913 |
| 16171 | 913 |
| 16172 | 0 |
| 16173 | 0 |
| 16174 | 0 |
| 16175 | 0 |
| 16176 | 0 |
| 16177 | 0 |
| 16178 | 0 |
| 16179 | 0 |
| 16180 | 0 |
| 16181 | 0 |
| 16182 | 0 |
| 16183 | 0 |
| 16184 | 0 |
| 16185 | 0 |
| 16186 | 0 |
| 16187 | 0 |
| 16188 | 0 |
| 16189 | 0 |
| 16190 | 0 |
| 16191 | 0 |
| 16192 | 0 |
| 16193 | 0 |
| 16194 | 0 |
| 16195 | 0 |
| 16196 | 0 |
| 16197 | 0 |
| 16198 | 0 |
| 16199 | 0 |
| 16200 | 0 |
| 16201 | 0 |
| 16202 | 0 |
| 16203 | 0 |
| 16204 | 0 |
| 16205 | 0 |
| 16206 | 0 |
| 16207 | 0 |
| 16208 | 0 |
| 16209 | 0 |
| 16210 | 0 |
| 16211 | 0 |
| 16212 | 0 |
| 16213 | 0 |
| 16214 | 0 |
| 16215 | 0 |
| 16216 | 0 |
| 16217 | 910 |
| 16218 | 911 |
| 16219 | 908 |
| 16220 | 0 |
| 16221 | 0 |
| 16222 | 0 |
| 16223 | 0 |
| 16224 | 0 |
| 16225 | 0 |
| 16226 | 0 |
| 16227 | 0 |
| 16228 | 0 |
| 16229 | 0 |
| 16230 | 0 |
| 16231 | 0 |
| 16232 | 0 |
| 16233 | 0 |
| 16234 | 0 |
| 16235 | 0 |
| 16236 | 0 |
| 16237 | 0 |
| 16238 | 0 |
| 16239 | 0 |
| 16240 | 0 |
| 16241 | 0 |
| 16242 | 0 |
| 16243 | 0 |
| 16244 | 0 |
| 16245 | 0 |
| 16246 | 0 |
| 16247 | 0 |
| 16248 | 0 |
| 16249 | 0 |
| 16250 | 0 |
| 16251 | 0 |
| 16252 | 0 |
| 16253 | 0 |
| 16254 | 0 |
| 16255 | 0 |
| 16256 | 0 |
| 16257 | 0 |
| 16258 | 0 |
| 16259 | 0 |
| 16260 | 0 |
| 16261 | 0 |
| 16262 | 0 |
| 16263 | 0 |
| 16264 | 0 |
| 16265 | 913 |
| 16266 | 913 |
| 16267 | 912 |
| 16268 | 912 |
| 16269 | 0 |
| 16270 | 0 |
| 16271 | 0 |
| 16272 | 0 |
| 16273 | 0 |
| 16274 | 0 |
| 16275 | 0 |
| 16276 | 0 |
| 16277 | 0 |
| 16278 | 0 |
| 16279 | 0 |
| 16280 | 0 |
| 16281 | 0 |
| 16282 | 0 |
| 16283 | 0 |
| 16284 | 0 |
| 16285 | 0 |
| 16286 | 0 |
| 16287 | 0 |
| 16288 | 0 |
| 16289 | 0 |
| 16290 | 0 |
| 16291 | 0 |
| 16292 | 0 |
| 16293 | 0 |
| 16294 | 0 |
| 16295 | 0 |
| 16296 | 0 |
| 16297 | 0 |
| 16298 | 0 |
| 16299 | 0 |
| 16300 | 0 |
| 16301 | 0 |
| 16302 | 0 |
| 16303 | 0 |
| 16304 | 0 |
| 16305 | 0 |
| 16306 | 0 |
| 16307 | 0 |
| 16308 | 0 |
| 16309 | 0 |
| 16310 | 0 |
| 16311 | 0 |
| 16312 | 0 |
| 16313 | 0 |
| 16314 | 910 |
| 16315 | 911 |
| 16316 | 911 |
| 16317 | 0 |
| 16318 | 0 |
| 16319 | 0 |
| 16320 | 0 |
| 16321 | 0 |
| 16322 | 0 |
| 16323 | 0 |
| 16324 | 0 |
| 16325 | 0 |
| 16326 | 0 |
| 16327 | 0 |
| 16328 | 0 |
| 16329 | 0 |
| 16330 | 0 |
| 16331 | 0 |
| 16332 | 0 |
| 16333 | 0 |
| 16334 | 0 |
| 16335 | 0 |
| 16336 | 0 |
| 16337 | 0 |
| 16338 | 0 |
| 16339 | 0 |
| 16340 | 0 |
| 16341 | 0 |
| 16342 | 0 |
| 16343 | 0 |
| 16344 | 0 |
| 16345 | 0 |
| 16346 | 0 |
| 16347 | 0 |
| 16348 | 0 |
| 16349 | 0 |
| 16350 | 0 |
| 16351 | 0 |
| 16352 | 0 |
| 16353 | 0 |
| 16354 | 0 |
| 16355 | 0 |
| 16356 | 0 |
| 16357 | 0 |
| 16358 | 0 |
| 16359 | 0 |
| 16360 | 0 |
| 16361 | 0 |
| 16362 | 913 |
| 16363 | 914 |
| 16364 | 914 |
| 16365 | 0 |
| 16366 | 0 |
| 16367 | 0 |
| 16368 | 0 |
| 16369 | 0 |
| 16370 | 0 |
| 16371 | 0 |
| 16372 | 0 |
| 16373 | 0 |
| 16374 | 0 |
| 16375 | 0 |
| 16376 | 0 |
| 16377 | 0 |
| 16378 | 0 |
| 16379 | 0 |
| 16380 | 0 |
| 16381 | 0 |
| 16382 | 0 |
| 16383 | 0 |
| 16384 | 0 |
| 16385 | 0 |
| 16386 | 0 |
| 16387 | 0 |
| 16388 | 0 |
| 16389 | 0 |
| 16390 | 0 |
| 16391 | 0 |
| 16392 | 0 |
| 16393 | 0 |
| 16394 | 0 |
| 16395 | 0 |
| 16396 | 0 |
| 16397 | 0 |
| 16398 | 0 |
| 16399 | 0 |
| 16400 | 0 |
| 16401 | 0 |
| 16402 | 0 |
| 16403 | 0 |
| 16404 | 0 |
| 16405 | 0 |
| 16406 | 0 |
| 16407 | 0 |
| 16408 | 0 |
| 16409 | 0 |
| 16410 | 912 |
| 16411 | 911 |
| 16412 | 909 |
| 16413 | 909 |
| 16414 | 0 |
| 16415 | 0 |
| 16416 | 0 |
| 16417 | 0 |
| 16418 | 0 |
| 16419 | 0 |
| 16420 | 0 |
| 16421 | 0 |
| 16422 | 0 |
| 16423 | 0 |
| 16424 | 0 |
| 16425 | 0 |
| 16426 | 0 |
| 16427 | 0 |
| 16428 | 0 |
| 16429 | 0 |
| 16430 | 0 |
| 16431 | 0 |
| 16432 | 0 |
| 16433 | 0 |
| 16434 | 0 |
| 16435 | 0 |
| 16436 | 0 |
| 16437 | 0 |
| 16438 | 0 |
| 16439 | 0 |
| 16440 | 0 |
| 16441 | 0 |
| 16442 | 0 |
| 16443 | 0 |
| 16444 | 0 |
| 16445 | 0 |
| 16446 | 0 |
| 16447 | 0 |
| 16448 | 0 |
| 16449 | 0 |
| 16450 | 0 |
| 16451 | 0 |
| 16452 | 0 |
| 16453 | 0 |
| 16454 | 0 |
| 16455 | 0 |
| 16456 | 0 |
| 16457 | 0 |
| 16458 | 911 |
| 16459 | 911 |
| 16460 | 909 |
| 16461 | 909 |
| 16462 | 0 |
| 16463 | 0 |
| 16464 | 0 |
| 16465 | 0 |
| 16466 | 0 |
| 16467 | 0 |
| 16468 | 0 |
| 16469 | 0 |
| 16470 | 0 |
| 16471 | 0 |
| 16472 | 0 |
| 16473 | 0 |
| 16474 | 0 |
| 16475 | 0 |
| 16476 | 0 |
| 16477 | 0 |
| 16478 | 0 |
| 16479 | 0 |
| 16480 | 0 |
| 16481 | 0 |
| 16482 | 0 |
| 16483 | 0 |
| 16484 | 0 |
| 16485 | 0 |
| 16486 | 0 |
| 16487 | 0 |
| 16488 | 0 |
| 16489 | 0 |
| 16490 | 0 |
| 16491 | 0 |
| 16492 | 0 |
| 16493 | 0 |
| 16494 | 0 |
| 16495 | 0 |
| 16496 | 0 |
| 16497 | 0 |
| 16498 | 0 |
| 16499 | 0 |
| 16500 | 0 |
| 16501 | 0 |
| 16502 | 0 |
| 16503 | 0 |
| 16504 | 0 |
| 16505 | 0 |
| 16506 | 912 |
| 16507 | 912 |
| 16508 | 910 |
| 16509 | 909 |
| 16510 | 0 |
| 16511 | 0 |
| 16512 | 0 |
| 16513 | 0 |
| 16514 | 0 |
| 16515 | 0 |
| 16516 | 0 |
| 16517 | 0 |
| 16518 | 0 |
| 16519 | 0 |
| 16520 | 0 |
| 16521 | 0 |
| 16522 | 0 |
| 16523 | 0 |
| 16524 | 0 |
| 16525 | 0 |
| 16526 | 0 |
| 16527 | 0 |
| 16528 | 0 |
| 16529 | 0 |
| 16530 | 0 |
| 16531 | 0 |
| 16532 | 0 |
| 16533 | 0 |
| 16534 | 0 |
| 16535 | 0 |
| 16536 | 0 |
| 16537 | 0 |
| 16538 | 0 |
| 16539 | 0 |
| 16540 | 0 |
| 16541 | 0 |
| 16542 | 0 |
| 16543 | 0 |
| 16544 | 0 |
| 16545 | 0 |
| 16546 | 0 |
| 16547 | 0 |
| 16548 | 0 |
| 16549 | 0 |
| 16550 | 0 |
| 16551 | 0 |
| 16552 | 0 |
| 16553 | 0 |
| 16554 | 0 |
| 16555 | 911 |
| 16556 | 912 |
| 16557 | 912 |
| 16558 | 0 |
| 16559 | 0 |
| 16560 | 0 |
| 16561 | 0 |
| 16562 | 0 |
| 16563 | 0 |
| 16564 | 0 |
| 16565 | 0 |
| 16566 | 0 |
| 16567 | 0 |
| 16568 | 0 |
| 16569 | 0 |
| 16570 | 0 |
| 16571 | 0 |
| 16572 | 0 |
| 16573 | 0 |
| 16574 | 0 |
| 16575 | 0 |
| 16576 | 0 |
| 16577 | 0 |
| 16578 | 0 |
| 16579 | 0 |
| 16580 | 0 |
| 16581 | 0 |
| 16582 | 0 |
| 16583 | 0 |
| 16584 | 0 |
| 16585 | 0 |
| 16586 | 0 |
| 16587 | 0 |
| 16588 | 0 |
| 16589 | 0 |
| 16590 | 0 |
| 16591 | 0 |
| 16592 | 0 |
| 16593 | 0 |
| 16594 | 0 |
| 16595 | 0 |
| 16596 | 0 |
| 16597 | 0 |
| 16598 | 0 |
| 16599 | 0 |
| 16600 | 0 |
| 16601 | 0 |
| 16602 | 0 |
| 16603 | 915 |
| 16604 | 913 |
| 16605 | 912 |
| 16606 | 0 |
| 16607 | 0 |
| 16608 | 0 |
| 16609 | 0 |
| 16610 | 0 |
| 16611 | 0 |
| 16612 | 0 |
| 16613 | 0 |
| 16614 | 0 |
| 16615 | 0 |
| 16616 | 0 |
| 16617 | 0 |
| 16618 | 0 |
| 16619 | 0 |
| 16620 | 0 |
| 16621 | 0 |
| 16622 | 0 |
| 16623 | 0 |
| 16624 | 0 |
| 16625 | 0 |
| 16626 | 0 |
| 16627 | 0 |
| 16628 | 0 |
| 16629 | 0 |
| 16630 | 0 |
| 16631 | 0 |
| 16632 | 0 |
| 16633 | 0 |
| 16634 | 0 |
| 16635 | 0 |
| 16636 | 0 |
| 16637 | 0 |
| 16638 | 0 |
| 16639 | 0 |
| 16640 | 0 |
| 16641 | 0 |
| 16642 | 0 |
| 16643 | 0 |
| 16644 | 0 |
| 16645 | 0 |
| 16646 | 0 |
| 16647 | 0 |
| 16648 | 0 |
| 16649 | 0 |
| 16650 | 0 |
| 16651 | 900 |
| 16652 | 910 |
| 16653 | 909 |
| 16654 | 910 |
| 16655 | 0 |
| 16656 | 0 |
| 16657 | 0 |
| 16658 | 0 |
| 16659 | 0 |
| 16660 | 0 |
| 16661 | 0 |
| 16662 | 0 |
| 16663 | 0 |
| 16664 | 0 |
| 16665 | 0 |
| 16666 | 0 |
| 16667 | 0 |
| 16668 | 0 |
| 16669 | 0 |
| 16670 | 0 |
| 16671 | 0 |
| 16672 | 0 |
| 16673 | 0 |
| 16674 | 0 |
| 16675 | 0 |
| 16676 | 0 |
| 16677 | 0 |
| 16678 | 0 |
| 16679 | 0 |
| 16680 | 0 |
| 16681 | 0 |
| 16682 | 0 |
| 16683 | 0 |
| 16684 | 0 |
| 16685 | 0 |
| 16686 | 0 |
| 16687 | 0 |
| 16688 | 0 |
| 16689 | 0 |
| 16690 | 0 |
| 16691 | 0 |
| 16692 | 0 |
| 16693 | 0 |
| 16694 | 0 |
| 16695 | 0 |
| 16696 | 0 |
| 16697 | 0 |
| 16698 | 0 |
| 16699 | 911 |
| 16700 | 911 |
| 16701 | 910 |
| 16702 | 910 |
| 16703 | 0 |
| 16704 | 0 |
| 16705 | 0 |
| 16706 | 0 |
| 16707 | 0 |
| 16708 | 0 |
| 16709 | 0 |
| 16710 | 0 |
| 16711 | 0 |
| 16712 | 0 |
| 16713 | 0 |
| 16714 | 0 |
| 16715 | 0 |
| 16716 | 0 |
| 16717 | 0 |
| 16718 | 0 |
| 16719 | 0 |
| 16720 | 0 |
| 16721 | 0 |
| 16722 | 0 |
| 16723 | 0 |
| 16724 | 0 |
| 16725 | 0 |
| 16726 | 0 |
| 16727 | 0 |
| 16728 | 0 |
| 16729 | 0 |
| 16730 | 0 |
| 16731 | 0 |
| 16732 | 0 |
| 16733 | 0 |
| 16734 | 0 |
| 16735 | 0 |
| 16736 | 0 |
| 16737 | 0 |
| 16738 | 0 |
| 16739 | 0 |
| 16740 | 0 |
| 16741 | 0 |
| 16742 | 0 |
| 16743 | 0 |
| 16744 | 0 |
| 16745 | 0 |
| 16746 | 0 |
| 16747 | 913 |
| 16748 | 913 |
| 16749 | 912 |
| 16750 | 912 |
| 16751 | 0 |
| 16752 | 0 |
| 16753 | 0 |
| 16754 | 0 |
| 16755 | 0 |
| 16756 | 0 |
| 16757 | 0 |
| 16758 | 0 |
| 16759 | 0 |
| 16760 | 0 |
| 16761 | 0 |
| 16762 | 0 |
| 16763 | 0 |
| 16764 | 0 |
| 16765 | 0 |
| 16766 | 0 |
| 16767 | 0 |
| 16768 | 0 |
| 16769 | 0 |
| 16770 | 0 |
| 16771 | 0 |
| 16772 | 0 |
| 16773 | 0 |
| 16774 | 0 |
| 16775 | 0 |
| 16776 | 0 |
| 16777 | 0 |
| 16778 | 0 |
| 16779 | 0 |
| 16780 | 0 |
| 16781 | 0 |
| 16782 | 0 |
| 16783 | 0 |
| 16784 | 0 |
| 16785 | 0 |
| 16786 | 0 |
| 16787 | 0 |
| 16788 | 0 |
| 16789 | 0 |
| 16790 | 0 |
| 16791 | 0 |
| 16792 | 0 |
| 16793 | 0 |
| 16794 | 0 |
| 16795 | 641 |
| 16796 | 914 |
| 16797 | 912 |
| 16798 | 912 |
| 16799 | 0 |
| 16800 | 0 |
| 16801 | 0 |
| 16802 | 0 |
| 16803 | 0 |
| 16804 | 0 |
| 16805 | 0 |
| 16806 | 0 |
| 16807 | 0 |
| 16808 | 0 |
| 16809 | 0 |
| 16810 | 0 |
| 16811 | 0 |
| 16812 | 0 |
| 16813 | 0 |
| 16814 | 0 |
| 16815 | 0 |
| 16816 | 0 |
| 16817 | 0 |
| 16818 | 0 |
| 16819 | 0 |
| 16820 | 0 |
| 16821 | 0 |
| 16822 | 0 |
| 16823 | 0 |
| 16824 | 0 |
| 16825 | 0 |
| 16826 | 0 |
| 16827 | 0 |
| 16828 | 0 |
| 16829 | 0 |
| 16830 | 0 |
| 16831 | 0 |
| 16832 | 0 |
| 16833 | 0 |
| 16834 | 0 |
| 16835 | 0 |
| 16836 | 0 |
| 16837 | 0 |
| 16838 | 0 |
| 16839 | 0 |
| 16840 | 0 |
| 16841 | 0 |
| 16842 | 0 |
| 16843 | 913 |
| 16844 | 913 |
| 16845 | 912 |
| 16846 | 912 |
| 16847 | 0 |
| 16848 | 0 |
| 16849 | 0 |
| 16850 | 0 |
| 16851 | 0 |
| 16852 | 0 |
| 16853 | 0 |
| 16854 | 0 |
| 16855 | 0 |
| 16856 | 0 |
| 16857 | 0 |
| 16858 | 0 |
| 16859 | 0 |
| 16860 | 0 |
| 16861 | 0 |
| 16862 | 0 |
| 16863 | 0 |
| 16864 | 0 |
| 16865 | 0 |
| 16866 | 0 |
| 16867 | 0 |
| 16868 | 0 |
| 16869 | 0 |
| 16870 | 0 |
| 16871 | 0 |
| 16872 | 0 |
| 16873 | 0 |
| 16874 | 0 |
| 16875 | 0 |
| 16876 | 0 |
| 16877 | 0 |
| 16878 | 0 |
| 16879 | 0 |
| 16880 | 0 |
| 16881 | 0 |
| 16882 | 0 |
| 16883 | 0 |
| 16884 | 0 |
| 16885 | 0 |
| 16886 | 0 |
| 16887 | 0 |
| 16888 | 0 |
| 16889 | 0 |
| 16890 | 0 |
| 16891 | 911 |
| 16892 | 912 |
| 16893 | 910 |
| 16894 | 911 |
| 16895 | 0 |
| 16896 | 0 |
| 16897 | 0 |
| 16898 | 0 |
| 16899 | 0 |
| 16900 | 0 |
| 16901 | 0 |
| 16902 | 0 |
| 16903 | 0 |
| 16904 | 0 |
| 16905 | 0 |
| 16906 | 0 |
| 16907 | 0 |
| 16908 | 0 |
| 16909 | 0 |
| 16910 | 0 |
| 16911 | 0 |
| 16912 | 0 |
| 16913 | 0 |
| 16914 | 0 |
| 16915 | 0 |
| 16916 | 0 |
| 16917 | 0 |
| 16918 | 0 |
| 16919 | 0 |
| 16920 | 0 |
| 16921 | 0 |
| 16922 | 0 |
| 16923 | 0 |
| 16924 | 0 |
| 16925 | 0 |
| 16926 | 0 |
| 16927 | 0 |
| 16928 | 0 |
| 16929 | 0 |
| 16930 | 0 |
| 16931 | 0 |
| 16932 | 0 |
| 16933 | 0 |
| 16934 | 0 |
| 16935 | 0 |
| 16936 | 0 |
| 16937 | 0 |
| 16938 | 0 |
| 16939 | 674 |
| 16940 | 912 |
| 16941 | 910 |
| 16942 | 911 |
| 16943 | 0 |
| 16944 | 0 |
| 16945 | 0 |
| 16946 | 0 |
| 16947 | 0 |
| 16948 | 0 |
| 16949 | 0 |
| 16950 | 0 |
| 16951 | 0 |
| 16952 | 0 |
| 16953 | 0 |
| 16954 | 0 |
| 16955 | 0 |
| 16956 | 0 |
| 16957 | 0 |
| 16958 | 0 |
| 16959 | 0 |
| 16960 | 0 |
| 16961 | 0 |
| 16962 | 0 |
| 16963 | 0 |
| 16964 | 0 |
| 16965 | 0 |
| 16966 | 0 |
| 16967 | 0 |
| 16968 | 0 |
| 16969 | 0 |
| 16970 | 0 |
| 16971 | 0 |
| 16972 | 0 |
| 16973 | 0 |
| 16974 | 0 |
| 16975 | 0 |
| 16976 | 0 |
| 16977 | 0 |
| 16978 | 0 |
| 16979 | 0 |
| 16980 | 0 |
| 16981 | 0 |
| 16982 | 0 |
| 16983 | 0 |
| 16984 | 0 |
| 16985 | 0 |
| 16986 | 0 |
| 16987 | 0 |
| 16988 | 912 |
| 16989 | 911 |
| 16990 | 909 |
| 16991 | 0 |
| 16992 | 0 |
| 16993 | 0 |
| 16994 | 0 |
| 16995 | 0 |
| 16996 | 0 |
| 16997 | 0 |
| 16998 | 0 |
| 16999 | 0 |
| 17000 | 0 |
| 17001 | 0 |
| 17002 | 0 |
| 17003 | 0 |
| 17004 | 0 |
| 17005 | 0 |
| 17006 | 0 |
| 17007 | 0 |
| 17008 | 0 |
| 17009 | 0 |
| 17010 | 0 |
| 17011 | 0 |
| 17012 | 0 |
| 17013 | 0 |
| 17014 | 0 |
| 17015 | 0 |
| 17016 | 0 |
| 17017 | 0 |
| 17018 | 0 |
| 17019 | 0 |
| 17020 | 0 |
| 17021 | 0 |
| 17022 | 0 |
| 17023 | 0 |
| 17024 | 0 |
| 17025 | 0 |
| 17026 | 0 |
| 17027 | 0 |
| 17028 | 0 |
| 17029 | 0 |
| 17030 | 0 |
| 17031 | 0 |
| 17032 | 0 |
| 17033 | 0 |
| 17034 | 0 |
| 17035 | 0 |
| 17036 | 912 |
| 17037 | 910 |
| 17038 | 910 |
| 17039 | 0 |
| 17040 | 0 |
| 17041 | 0 |
| 17042 | 0 |
| 17043 | 0 |
| 17044 | 0 |
| 17045 | 0 |
| 17046 | 0 |
| 17047 | 0 |
| 17048 | 0 |
| 17049 | 0 |
| 17050 | 0 |
| 17051 | 0 |
| 17052 | 0 |
| 17053 | 0 |
| 17054 | 0 |
| 17055 | 0 |
| 17056 | 0 |
| 17057 | 0 |
| 17058 | 0 |
| 17059 | 0 |
| 17060 | 0 |
| 17061 | 0 |
| 17062 | 0 |
| 17063 | 0 |
| 17064 | 0 |
| 17065 | 0 |
| 17066 | 0 |
| 17067 | 0 |
| 17068 | 0 |
| 17069 | 0 |
| 17070 | 0 |
| 17071 | 0 |
| 17072 | 0 |
| 17073 | 0 |
| 17074 | 0 |
| 17075 | 0 |
| 17076 | 0 |
| 17077 | 0 |
| 17078 | 0 |
| 17079 | 0 |
| 17080 | 0 |
| 17081 | 0 |
| 17082 | 0 |
| 17083 | 0 |
| 17084 | 910 |
| 17085 | 911 |
| 17086 | 908 |
| 17087 | 908 |
| 17088 | 0 |
| 17089 | 0 |
| 17090 | 0 |
| 17091 | 0 |
| 17092 | 0 |
| 17093 | 0 |
| 17094 | 0 |
| 17095 | 0 |
| 17096 | 0 |
| 17097 | 0 |
| 17098 | 0 |
| 17099 | 0 |
| 17100 | 0 |
| 17101 | 0 |
| 17102 | 0 |
| 17103 | 0 |
| 17104 | 0 |
| 17105 | 0 |
| 17106 | 0 |
| 17107 | 0 |
| 17108 | 0 |
| 17109 | 0 |
| 17110 | 0 |
| 17111 | 0 |
| 17112 | 0 |
| 17113 | 0 |
| 17114 | 0 |
| 17115 | 0 |
| 17116 | 0 |
| 17117 | 0 |
| 17118 | 0 |
| 17119 | 0 |
| 17120 | 0 |
| 17121 | 0 |
| 17122 | 0 |
| 17123 | 0 |
| 17124 | 0 |
| 17125 | 0 |
| 17126 | 0 |
| 17127 | 0 |
| 17128 | 0 |
| 17129 | 0 |
| 17130 | 0 |
| 17131 | 0 |
| 17132 | 912 |
| 17133 | 913 |
| 17134 | 913 |
| 17135 | 911 |
| 17136 | 0 |
| 17137 | 0 |
| 17138 | 0 |
| 17139 | 0 |
| 17140 | 0 |
| 17141 | 0 |
| 17142 | 0 |
| 17143 | 0 |
| 17144 | 0 |
| 17145 | 0 |
| 17146 | 0 |
| 17147 | 0 |
| 17148 | 0 |
| 17149 | 0 |
| 17150 | 0 |
| 17151 | 0 |
| 17152 | 0 |
| 17153 | 0 |
| 17154 | 0 |
| 17155 | 0 |
| 17156 | 0 |
| 17157 | 0 |
| 17158 | 0 |
| 17159 | 0 |
| 17160 | 0 |
| 17161 | 0 |
| 17162 | 0 |
| 17163 | 0 |
| 17164 | 0 |
| 17165 | 0 |
| 17166 | 0 |
| 17167 | 0 |
| 17168 | 0 |
| 17169 | 0 |
| 17170 | 0 |
| 17171 | 0 |
| 17172 | 0 |
| 17173 | 0 |
| 17174 | 0 |
| 17175 | 0 |
| 17176 | 0 |
| 17177 | 0 |
| 17178 | 0 |
| 17179 | 0 |
| 17180 | 0 |
| 17181 | 913 |
| 17182 | 912 |
| 17183 | 910 |
| 17184 | 0 |
| 17185 | 0 |
| 17186 | 0 |
| 17187 | 0 |
| 17188 | 0 |
| 17189 | 0 |
| 17190 | 0 |
| 17191 | 0 |
| 17192 | 0 |
| 17193 | 0 |
| 17194 | 0 |
| 17195 | 0 |
| 17196 | 0 |
| 17197 | 0 |
| 17198 | 0 |
| 17199 | 0 |
| 17200 | 0 |
| 17201 | 0 |
| 17202 | 0 |
| 17203 | 0 |
| 17204 | 0 |
| 17205 | 0 |
| 17206 | 0 |
| 17207 | 0 |
| 17208 | 0 |
| 17209 | 0 |
| 17210 | 0 |
| 17211 | 0 |
| 17212 | 0 |
| 17213 | 0 |
| 17214 | 0 |
| 17215 | 0 |
| 17216 | 0 |
| 17217 | 0 |
| 17218 | 0 |
| 17219 | 0 |
| 17220 | 0 |
| 17221 | 0 |
| 17222 | 0 |
| 17223 | 0 |
| 17224 | 0 |
| 17225 | 0 |
| 17226 | 0 |
| 17227 | 0 |
| 17228 | 0 |
| 17229 | 913 |
| 17230 | 913 |
| 17231 | 913 |
| 17232 | 0 |
| 17233 | 0 |
| 17234 | 0 |
| 17235 | 0 |
| 17236 | 0 |
| 17237 | 0 |
| 17238 | 0 |
| 17239 | 0 |
| 17240 | 0 |
| 17241 | 0 |
| 17242 | 0 |
| 17243 | 0 |
| 17244 | 0 |
| 17245 | 0 |
| 17246 | 0 |
| 17247 | 0 |
| 17248 | 0 |
| 17249 | 0 |
| 17250 | 0 |
| 17251 | 0 |
| 17252 | 0 |
| 17253 | 0 |
| 17254 | 0 |
| 17255 | 0 |
| 17256 | 0 |
| 17257 | 0 |
| 17258 | 0 |
| 17259 | 0 |
| 17260 | 0 |
| 17261 | 0 |
| 17262 | 0 |
| 17263 | 0 |
| 17264 | 0 |
| 17265 | 0 |
| 17266 | 0 |
| 17267 | 0 |
| 17268 | 0 |
| 17269 | 0 |
| 17270 | 0 |
| 17271 | 0 |
| 17272 | 0 |
| 17273 | 0 |
| 17274 | 0 |
| 17275 | 0 |
| 17276 | 0 |
| 17277 | 914 |
| 17278 | 913 |
| 17279 | 913 |
| 17280 | 912 |
| 17281 | 0 |
| 17282 | 0 |
| 17283 | 0 |
| 17284 | 0 |
| 17285 | 0 |
| 17286 | 0 |
| 17287 | 0 |
| 17288 | 0 |
| 17289 | 0 |
| 17290 | 0 |
| 17291 | 0 |
| 17292 | 0 |
| 17293 | 0 |
| 17294 | 0 |
| 17295 | 0 |
| 17296 | 0 |
| 17297 | 0 |
| 17298 | 0 |
| 17299 | 0 |
| 17300 | 0 |
| 17301 | 0 |
| 17302 | 0 |
| 17303 | 0 |
| 17304 | 0 |
| 17305 | 0 |
| 17306 | 0 |
| 17307 | 0 |
| 17308 | 0 |
| 17309 | 0 |
| 17310 | 0 |
| 17311 | 0 |
| 17312 | 0 |
| 17313 | 0 |
| 17314 | 0 |
| 17315 | 0 |
| 17316 | 0 |
| 17317 | 0 |
| 17318 | 0 |
| 17319 | 0 |
| 17320 | 0 |
| 17321 | 0 |
| 17322 | 0 |
| 17323 | 0 |
| 17324 | 0 |
| 17325 | 910 |
| 17326 | 911 |
| 17327 | 910 |
| 17328 | 910 |
| 17329 | 0 |
| 17330 | 0 |
| 17331 | 0 |
| 17332 | 0 |
| 17333 | 0 |
| 17334 | 0 |
| 17335 | 0 |
| 17336 | 0 |
| 17337 | 0 |
| 17338 | 0 |
| 17339 | 0 |
| 17340 | 0 |
| 17341 | 0 |
| 17342 | 0 |
| 17343 | 0 |
| 17344 | 0 |
| 17345 | 0 |
| 17346 | 0 |
| 17347 | 0 |
| 17348 | 0 |
| 17349 | 0 |
| 17350 | 0 |
| 17351 | 0 |
| 17352 | 0 |
| 17353 | 0 |
| 17354 | 0 |
| 17355 | 0 |
| 17356 | 0 |
| 17357 | 0 |
| 17358 | 0 |
| 17359 | 0 |
| 17360 | 0 |
| 17361 | 0 |
| 17362 | 0 |
| 17363 | 0 |
| 17364 | 0 |
| 17365 | 0 |
| 17366 | 0 |
| 17367 | 0 |
| 17368 | 0 |
| 17369 | 0 |
| 17370 | 0 |
| 17371 | 0 |
| 17372 | 0 |
| 17373 | 913 |
| 17374 | 913 |
| 17375 | 913 |
| 17376 | 913 |
| 17377 | 0 |
| 17378 | 0 |
| 17379 | 0 |
| 17380 | 0 |
| 17381 | 0 |
| 17382 | 0 |
| 17383 | 0 |
| 17384 | 0 |
| 17385 | 0 |
| 17386 | 0 |
| 17387 | 0 |
| 17388 | 0 |
| 17389 | 0 |
| 17390 | 0 |
| 17391 | 0 |
| 17392 | 0 |
| 17393 | 0 |
| 17394 | 0 |
| 17395 | 0 |
| 17396 | 0 |
| 17397 | 0 |
| 17398 | 0 |
| 17399 | 0 |
| 17400 | 0 |
| 17401 | 0 |
| 17402 | 0 |
| 17403 | 0 |
| 17404 | 0 |
| 17405 | 0 |
| 17406 | 0 |
| 17407 | 0 |
| 17408 | 0 |
| 17409 | 0 |
| 17410 | 0 |
| 17411 | 0 |
| 17412 | 0 |
| 17413 | 0 |
| 17414 | 0 |
| 17415 | 0 |
| 17416 | 0 |
| 17417 | 0 |
| 17418 | 0 |
| 17419 | 0 |
| 17420 | 0 |
| 17421 | 0 |
| 17422 | 913 |
| 17423 | 913 |
| 17424 | 911 |
| 17425 | 0 |
| 17426 | 0 |
| 17427 | 0 |
| 17428 | 0 |
| 17429 | 0 |
| 17430 | 0 |
| 17431 | 0 |
| 17432 | 0 |
| 17433 | 0 |
| 17434 | 0 |
| 17435 | 0 |
| 17436 | 0 |
| 17437 | 0 |
| 17438 | 0 |
| 17439 | 0 |
| 17440 | 0 |
| 17441 | 0 |
| 17442 | 0 |
| 17443 | 0 |
| 17444 | 0 |
| 17445 | 0 |
| 17446 | 0 |
| 17447 | 0 |
| 17448 | 0 |
| 17449 | 0 |
| 17450 | 0 |
| 17451 | 0 |
| 17452 | 0 |
| 17453 | 0 |
| 17454 | 0 |
| 17455 | 0 |
| 17456 | 0 |
| 17457 | 0 |
| 17458 | 0 |
| 17459 | 0 |
| 17460 | 0 |
| 17461 | 0 |
| 17462 | 0 |
| 17463 | 0 |
| 17464 | 0 |
| 17465 | 0 |
| 17466 | 0 |
| 17467 | 0 |
| 17468 | 0 |
| 17469 | 0 |
| 17470 | 911 |
| 17471 | 910 |
| 17472 | 910 |
| 17473 | 0 |
| 17474 | 0 |
| 17475 | 0 |
| 17476 | 0 |
| 17477 | 0 |
| 17478 | 0 |
| 17479 | 0 |
| 17480 | 0 |
| 17481 | 0 |
| 17482 | 0 |
| 17483 | 0 |
| 17484 | 0 |
| 17485 | 0 |
| 17486 | 0 |
| 17487 | 0 |
| 17488 | 0 |
| 17489 | 0 |
| 17490 | 0 |
| 17491 | 0 |
| 17492 | 0 |
| 17493 | 0 |
| 17494 | 0 |
| 17495 | 0 |
| 17496 | 0 |
| 17497 | 0 |
| 17498 | 0 |
| 17499 | 0 |
| 17500 | 0 |
| 17501 | 0 |
| 17502 | 0 |
| 17503 | 0 |
| 17504 | 0 |
| 17505 | 0 |
| 17506 | 0 |
| 17507 | 0 |
| 17508 | 0 |
| 17509 | 0 |
| 17510 | 0 |
| 17511 | 0 |
| 17512 | 0 |
| 17513 | 0 |
| 17514 | 0 |
| 17515 | 0 |
| 17516 | 0 |
| 17517 | 0 |
| 17518 | 913 |
| 17519 | 912 |
| 17520 | 910 |
| 17521 | 0 |
| 17522 | 0 |
| 17523 | 0 |
| 17524 | 0 |
| 17525 | 0 |
| 17526 | 0 |
| 17527 | 0 |
| 17528 | 0 |
| 17529 | 0 |
| 17530 | 0 |
| 17531 | 0 |
| 17532 | 0 |
| 17533 | 0 |
| 17534 | 0 |
| 17535 | 0 |
| 17536 | 0 |
| 17537 | 0 |
| 17538 | 0 |
| 17539 | 0 |
| 17540 | 0 |
| 17541 | 0 |
| 17542 | 0 |
| 17543 | 0 |
| 17544 | 0 |
| 17545 | 0 |
| 17546 | 0 |
| 17547 | 0 |
| 17548 | 0 |
| 17549 | 0 |
| 17550 | 0 |
| 17551 | 0 |
| 17552 | 0 |
| 17553 | 0 |
| 17554 | 0 |
| 17555 | 0 |
| 17556 | 0 |
| 17557 | 0 |
| 17558 | 0 |
| 17559 | 0 |
| 17560 | 0 |
| 17561 | 0 |
| 17562 | 0 |
| 17563 | 0 |
| 17564 | 0 |
| 17565 | 0 |
| 17566 | 913 |
| 17567 | 914 |
| 17568 | 914 |
| 17569 | 912 |
| 17570 | 0 |
| 17571 | 0 |
| 17572 | 0 |
| 17573 | 0 |
| 17574 | 0 |
| 17575 | 0 |
| 17576 | 0 |
| 17577 | 0 |
| 17578 | 0 |
| 17579 | 0 |
| 17580 | 0 |
| 17581 | 0 |
| 17582 | 0 |
| 17583 | 0 |
| 17584 | 0 |
| 17585 | 0 |
| 17586 | 0 |
| 17587 | 0 |
| 17588 | 0 |
| 17589 | 0 |
| 17590 | 0 |
| 17591 | 0 |
| 17592 | 0 |
| 17593 | 0 |
| 17594 | 0 |
| 17595 | 0 |
| 17596 | 0 |
| 17597 | 0 |
| 17598 | 0 |
| 17599 | 0 |
| 17600 | 0 |
| 17601 | 0 |
| 17602 | 0 |
| 17603 | 0 |
| 17604 | 0 |
| 17605 | 0 |
| 17606 | 0 |
| 17607 | 0 |
| 17608 | 0 |
| 17609 | 0 |
| 17610 | 0 |
| 17611 | 0 |
| 17612 | 0 |
| 17613 | 0 |
| 17614 | 912 |
| 17615 | 913 |
| 17616 | 914 |
| 17617 | 911 |
| 17618 | 0 |
| 17619 | 0 |
| 17620 | 0 |
| 17621 | 0 |
| 17622 | 0 |
| 17623 | 0 |
| 17624 | 0 |
| 17625 | 0 |
| 17626 | 0 |
| 17627 | 0 |
| 17628 | 0 |
| 17629 | 0 |
| 17630 | 0 |
| 17631 | 0 |
| 17632 | 0 |
| 17633 | 0 |
| 17634 | 0 |
| 17635 | 0 |
| 17636 | 0 |
| 17637 | 0 |
| 17638 | 0 |
| 17639 | 0 |
| 17640 | 0 |
| 17641 | 0 |
| 17642 | 0 |
| 17643 | 0 |
| 17644 | 0 |
| 17645 | 0 |
| 17646 | 0 |
| 17647 | 0 |
| 17648 | 0 |
| 17649 | 0 |
| 17650 | 0 |
| 17651 | 0 |
| 17652 | 0 |
| 17653 | 0 |
| 17654 | 0 |
| 17655 | 0 |
| 17656 | 0 |
| 17657 | 0 |
| 17658 | 0 |
| 17659 | 0 |
| 17660 | 0 |
| 17661 | 0 |
| 17662 | 0 |
| 17663 | 914 |
| 17664 | 912 |
| 17665 | 912 |
| 17666 | 0 |
| 17667 | 0 |
| 17668 | 0 |
| 17669 | 0 |
| 17670 | 0 |
| 17671 | 0 |
| 17672 | 0 |
| 17673 | 0 |
| 17674 | 0 |
| 17675 | 0 |
| 17676 | 0 |
| 17677 | 0 |
| 17678 | 0 |
| 17679 | 0 |
| 17680 | 0 |
| 17681 | 0 |
| 17682 | 0 |
| 17683 | 0 |
| 17684 | 0 |
| 17685 | 0 |
| 17686 | 0 |
| 17687 | 0 |
| 17688 | 0 |
| 17689 | 0 |
| 17690 | 0 |
| 17691 | 0 |
| 17692 | 0 |
| 17693 | 0 |
| 17694 | 0 |
| 17695 | 0 |
| 17696 | 0 |
| 17697 | 0 |
| 17698 | 0 |
| 17699 | 0 |
| 17700 | 0 |
| 17701 | 0 |
| 17702 | 0 |
| 17703 | 0 |
| 17704 | 0 |
| 17705 | 0 |
| 17706 | 0 |
| 17707 | 0 |
| 17708 | 0 |
| 17709 | 0 |
| 17710 | 0 |
| 17711 | 910 |
| 17712 | 910 |
| 17713 | 909 |
| 17714 | 0 |
| 17715 | 0 |
| 17716 | 0 |
| 17717 | 0 |
| 17718 | 0 |
| 17719 | 0 |
| 17720 | 0 |
| 17721 | 0 |
| 17722 | 0 |
| 17723 | 0 |
| 17724 | 0 |
| 17725 | 0 |
| 17726 | 0 |
| 17727 | 0 |
| 17728 | 0 |
| 17729 | 0 |
| 17730 | 0 |
| 17731 | 0 |
| 17732 | 0 |
| 17733 | 0 |
| 17734 | 0 |
| 17735 | 0 |
| 17736 | 0 |
| 17737 | 0 |
| 17738 | 0 |
| 17739 | 0 |
| 17740 | 0 |
| 17741 | 0 |
| 17742 | 0 |
| 17743 | 0 |
| 17744 | 0 |
| 17745 | 0 |
| 17746 | 0 |
| 17747 | 0 |
| 17748 | 0 |
| 17749 | 0 |
| 17750 | 0 |
| 17751 | 0 |
| 17752 | 0 |
| 17753 | 0 |
| 17754 | 0 |
| 17755 | 0 |
| 17756 | 0 |
| 17757 | 0 |
| 17758 | 0 |
| 17759 | 913 |
| 17760 | 913 |
| 17761 | 913 |
| 17762 | 912 |
| 17763 | 0 |
| 17764 | 0 |
| 17765 | 0 |
| 17766 | 0 |
| 17767 | 0 |
| 17768 | 0 |
| 17769 | 0 |
| 17770 | 0 |
| 17771 | 0 |
| 17772 | 0 |
| 17773 | 0 |
| 17774 | 0 |
| 17775 | 0 |
| 17776 | 0 |
| 17777 | 0 |
| 17778 | 0 |
| 17779 | 0 |
| 17780 | 0 |
| 17781 | 0 |
| 17782 | 0 |
| 17783 | 0 |
| 17784 | 0 |
| 17785 | 0 |
| 17786 | 0 |
| 17787 | 0 |
| 17788 | 0 |
| 17789 | 0 |
| 17790 | 0 |
| 17791 | 0 |
| 17792 | 0 |
| 17793 | 0 |
| 17794 | 0 |
| 17795 | 0 |
| 17796 | 0 |
| 17797 | 0 |
| 17798 | 0 |
| 17799 | 0 |
| 17800 | 0 |
| 17801 | 0 |
| 17802 | 0 |
| 17803 | 0 |
| 17804 | 0 |
| 17805 | 0 |
| 17806 | 0 |
| 17807 | 216 |
| 17808 | 913 |
| 17809 | 912 |
| 17810 | 912 |
| 17811 | 0 |
| 17812 | 0 |
| 17813 | 0 |
| 17814 | 0 |
| 17815 | 0 |
| 17816 | 0 |
| 17817 | 0 |
| 17818 | 0 |
| 17819 | 0 |
| 17820 | 0 |
| 17821 | 0 |
| 17822 | 0 |
| 17823 | 0 |
| 17824 | 0 |
| 17825 | 0 |
| 17826 | 0 |
| 17827 | 0 |
| 17828 | 0 |
| 17829 | 0 |
| 17830 | 0 |
| 17831 | 0 |
| 17832 | 0 |
| 17833 | 0 |
| 17834 | 0 |
| 17835 | 0 |
| 17836 | 0 |
| 17837 | 0 |
| 17838 | 0 |
| 17839 | 0 |
| 17840 | 0 |
| 17841 | 0 |
| 17842 | 0 |
| 17843 | 0 |
| 17844 | 0 |
| 17845 | 0 |
| 17846 | 0 |
| 17847 | 0 |
| 17848 | 0 |
| 17849 | 0 |
| 17850 | 0 |
| 17851 | 0 |
| 17852 | 0 |
| 17853 | 0 |
| 17854 | 0 |
| 17855 | 0 |
| 17856 | 912 |
| 17857 | 912 |
| 17858 | 911 |
| 17859 | 0 |
| 17860 | 0 |
| 17861 | 0 |
| 17862 | 0 |
| 17863 | 0 |
| 17864 | 0 |
| 17865 | 0 |
| 17866 | 0 |
| 17867 | 0 |
| 17868 | 0 |
| 17869 | 0 |
| 17870 | 0 |
| 17871 | 0 |
| 17872 | 0 |
| 17873 | 0 |
| 17874 | 0 |
| 17875 | 0 |
| 17876 | 0 |
| 17877 | 0 |
| 17878 | 0 |
| 17879 | 0 |
| 17880 | 0 |
| 17881 | 0 |
| 17882 | 0 |
| 17883 | 0 |
| 17884 | 0 |
| 17885 | 0 |
| 17886 | 0 |
| 17887 | 0 |
| 17888 | 0 |
| 17889 | 0 |
| 17890 | 0 |
| 17891 | 0 |
| 17892 | 0 |
| 17893 | 0 |
| 17894 | 0 |
| 17895 | 0 |
| 17896 | 0 |
| 17897 | 0 |
| 17898 | 0 |
| 17899 | 0 |
| 17900 | 0 |
| 17901 | 0 |
| 17902 | 0 |
| 17903 | 0 |
| 17904 | 910 |
| 17905 | 910 |
| 17906 | 910 |
| 17907 | 0 |
| 17908 | 0 |
| 17909 | 0 |
| 17910 | 0 |
| 17911 | 0 |
| 17912 | 0 |
| 17913 | 0 |
| 17914 | 0 |
| 17915 | 0 |
| 17916 | 0 |
| 17917 | 0 |
| 17918 | 0 |
| 17919 | 0 |
| 17920 | 0 |
| 17921 | 0 |
| 17922 | 0 |
| 17923 | 0 |
| 17924 | 0 |
| 17925 | 0 |
| 17926 | 0 |
| 17927 | 0 |
| 17928 | 0 |
| 17929 | 0 |
| 17930 | 0 |
| 17931 | 0 |
| 17932 | 0 |
| 17933 | 0 |
| 17934 | 0 |
| 17935 | 0 |
| 17936 | 0 |
| 17937 | 0 |
| 17938 | 0 |
| 17939 | 0 |
| 17940 | 0 |
| 17941 | 0 |
| 17942 | 0 |
| 17943 | 0 |
| 17944 | 0 |
| 17945 | 0 |
| 17946 | 0 |
| 17947 | 0 |
| 17948 | 0 |
| 17949 | 0 |
| 17950 | 0 |
| 17951 | 0 |
| 17952 | 913 |
| 17953 | 913 |
| 17954 | 913 |
| 17955 | 913 |
| 17956 | 0 |
| 17957 | 0 |
| 17958 | 0 |
| 17959 | 0 |
| 17960 | 0 |
| 17961 | 0 |
| 17962 | 0 |
| 17963 | 0 |
| 17964 | 0 |
| 17965 | 0 |
| 17966 | 0 |
| 17967 | 0 |
| 17968 | 0 |
| 17969 | 0 |
| 17970 | 0 |
| 17971 | 0 |
| 17972 | 0 |
| 17973 | 0 |
| 17974 | 0 |
| 17975 | 0 |
| 17976 | 0 |
| 17977 | 0 |
| 17978 | 0 |
| 17979 | 0 |
| 17980 | 0 |
| 17981 | 0 |
| 17982 | 0 |
| 17983 | 0 |
| 17984 | 0 |
| 17985 | 0 |
| 17986 | 0 |
| 17987 | 0 |
| 17988 | 0 |
| 17989 | 0 |
| 17990 | 0 |
| 17991 | 0 |
| 17992 | 0 |
| 17993 | 0 |
| 17994 | 0 |
| 17995 | 0 |
| 17996 | 0 |
| 17997 | 0 |
| 17998 | 0 |
| 17999 | 0 |
| 18000 | 913 |
| 18001 | 914 |
| 18002 | 913 |
| 18003 | 913 |
| 18004 | 0 |
| 18005 | 0 |
| 18006 | 0 |
| 18007 | 0 |
| 18008 | 0 |
| 18009 | 0 |
| 18010 | 0 |
| 18011 | 0 |
| 18012 | 0 |
| 18013 | 0 |
| 18014 | 0 |
| 18015 | 0 |
| 18016 | 0 |
| 18017 | 0 |
| 18018 | 0 |
| 18019 | 0 |
| 18020 | 0 |
| 18021 | 0 |
| 18022 | 0 |
| 18023 | 0 |
| 18024 | 0 |
| 18025 | 0 |
| 18026 | 0 |
| 18027 | 0 |
| 18028 | 0 |
| 18029 | 0 |
| 18030 | 0 |
| 18031 | 0 |
| 18032 | 0 |
| 18033 | 0 |
| 18034 | 0 |
| 18035 | 0 |
| 18036 | 0 |
| 18037 | 0 |
| 18038 | 0 |
| 18039 | 0 |
| 18040 | 0 |
| 18041 | 0 |
| 18042 | 0 |
| 18043 | 0 |
| 18044 | 0 |
| 18045 | 0 |
| 18046 | 0 |
| 18047 | 0 |
| 18048 | 913 |
| 18049 | 914 |
| 18050 | 913 |
| 18051 | 912 |
| 18052 | 0 |
| 18053 | 0 |
| 18054 | 0 |
| 18055 | 0 |
| 18056 | 0 |
| 18057 | 0 |
| 18058 | 0 |
| 18059 | 0 |
| 18060 | 0 |
| 18061 | 0 |
| 18062 | 0 |
| 18063 | 0 |
| 18064 | 0 |
| 18065 | 0 |
| 18066 | 0 |
| 18067 | 0 |
| 18068 | 0 |
| 18069 | 0 |
| 18070 | 0 |
| 18071 | 0 |
| 18072 | 0 |
| 18073 | 0 |
| 18074 | 0 |
| 18075 | 0 |
| 18076 | 0 |
| 18077 | 0 |
| 18078 | 0 |
| 18079 | 0 |
| 18080 | 0 |
| 18081 | 0 |
| 18082 | 0 |
| 18083 | 0 |
| 18084 | 0 |
| 18085 | 0 |
| 18086 | 0 |
| 18087 | 0 |
| 18088 | 0 |
| 18089 | 0 |
| 18090 | 0 |
| 18091 | 0 |
| 18092 | 0 |
| 18093 | 0 |
| 18094 | 0 |
| 18095 | 0 |
| 18096 | 834 |
| 18097 | 913 |
| 18098 | 912 |
| 18099 | 912 |
| 18100 | 0 |
| 18101 | 0 |
| 18102 | 0 |
| 18103 | 0 |
| 18104 | 0 |
| 18105 | 0 |
| 18106 | 0 |
| 18107 | 0 |
| 18108 | 0 |
| 18109 | 0 |
| 18110 | 0 |
| 18111 | 0 |
| 18112 | 0 |
| 18113 | 0 |
| 18114 | 0 |
| 18115 | 0 |
| 18116 | 0 |
| 18117 | 0 |
| 18118 | 0 |
| 18119 | 0 |
| 18120 | 0 |
| 18121 | 0 |
| 18122 | 0 |
| 18123 | 0 |
| 18124 | 0 |
| 18125 | 0 |
| 18126 | 0 |
| 18127 | 0 |
| 18128 | 0 |
| 18129 | 0 |
| 18130 | 0 |
| 18131 | 0 |
| 18132 | 0 |
| 18133 | 0 |
| 18134 | 0 |
| 18135 | 0 |
| 18136 | 0 |
| 18137 | 0 |
| 18138 | 0 |
| 18139 | 0 |
| 18140 | 0 |
| 18141 | 0 |
| 18142 | 0 |
| 18143 | 0 |
| 18144 | 0 |
| 18145 | 910 |
| 18146 | 911 |
| 18147 | 909 |
| 18148 | 0 |
| 18149 | 0 |
| 18150 | 0 |
| 18151 | 0 |
| 18152 | 0 |
| 18153 | 0 |
| 18154 | 0 |
| 18155 | 0 |
| 18156 | 0 |
| 18157 | 0 |
| 18158 | 0 |
| 18159 | 0 |
| 18160 | 0 |
| 18161 | 0 |
| 18162 | 0 |
| 18163 | 0 |
| 18164 | 0 |
| 18165 | 0 |
| 18166 | 0 |
| 18167 | 0 |
| 18168 | 0 |
| 18169 | 0 |
| 18170 | 0 |
| 18171 | 0 |
| 18172 | 0 |
| 18173 | 0 |
| 18174 | 0 |
| 18175 | 0 |
| 18176 | 0 |
| 18177 | 0 |
| 18178 | 0 |
| 18179 | 0 |
| 18180 | 0 |
| 18181 | 0 |
| 18182 | 0 |
| 18183 | 0 |
| 18184 | 0 |
| 18185 | 0 |
| 18186 | 0 |
| 18187 | 0 |
| 18188 | 0 |
| 18189 | 0 |
| 18190 | 0 |
| 18191 | 0 |
| 18192 | 0 |
| 18193 | 915 |
| 18194 | 913 |
| 18195 | 910 |
| 18196 | 0 |
| 18197 | 0 |
| 18198 | 0 |
| 18199 | 0 |
| 18200 | 0 |
| 18201 | 0 |
| 18202 | 0 |
| 18203 | 0 |
| 18204 | 0 |
| 18205 | 0 |
| 18206 | 0 |
| 18207 | 0 |
| 18208 | 0 |
| 18209 | 0 |
| 18210 | 0 |
| 18211 | 0 |
| 18212 | 0 |
| 18213 | 0 |
| 18214 | 0 |
| 18215 | 0 |
| 18216 | 0 |
| 18217 | 0 |
| 18218 | 0 |
| 18219 | 0 |
| 18220 | 0 |
| 18221 | 0 |
| 18222 | 0 |
| 18223 | 0 |
| 18224 | 0 |
| 18225 | 0 |
| 18226 | 0 |
| 18227 | 0 |
| 18228 | 0 |
| 18229 | 0 |
| 18230 | 0 |
| 18231 | 0 |
| 18232 | 0 |
| 18233 | 0 |
| 18234 | 0 |
| 18235 | 0 |
| 18236 | 0 |
| 18237 | 0 |
| 18238 | 0 |
| 18239 | 0 |
| 18240 | 0 |
| 18241 | 911 |
| 18242 | 911 |
| 18243 | 911 |
| 18244 | 911 |
| 18245 | 0 |
| 18246 | 0 |
| 18247 | 0 |
| 18248 | 0 |
| 18249 | 0 |
| 18250 | 0 |
| 18251 | 0 |
| 18252 | 0 |
| 18253 | 0 |
| 18254 | 0 |
| 18255 | 0 |
| 18256 | 0 |
| 18257 | 0 |
| 18258 | 0 |
| 18259 | 0 |
| 18260 | 0 |
| 18261 | 0 |
| 18262 | 0 |
| 18263 | 0 |
| 18264 | 0 |
| 18265 | 0 |
| 18266 | 0 |
| 18267 | 0 |
| 18268 | 0 |
| 18269 | 0 |
| 18270 | 0 |
| 18271 | 0 |
| 18272 | 0 |
| 18273 | 0 |
| 18274 | 0 |
| 18275 | 0 |
| 18276 | 0 |
| 18277 | 0 |
| 18278 | 0 |
| 18279 | 0 |
| 18280 | 0 |
| 18281 | 0 |
| 18282 | 0 |
| 18283 | 0 |
| 18284 | 0 |
| 18285 | 0 |
| 18286 | 0 |
| 18287 | 0 |
| 18288 | 0 |
| 18289 | 910 |
| 18290 | 910 |
| 18291 | 910 |
| 18292 | 910 |
| 18293 | 0 |
| 18294 | 0 |
| 18295 | 0 |
| 18296 | 0 |
| 18297 | 0 |
| 18298 | 0 |
| 18299 | 0 |
| 18300 | 0 |
| 18301 | 0 |
| 18302 | 0 |
| 18303 | 0 |
| 18304 | 0 |
| 18305 | 0 |
| 18306 | 0 |
| 18307 | 0 |
| 18308 | 0 |
| 18309 | 0 |
| 18310 | 0 |
| 18311 | 0 |
| 18312 | 0 |
| 18313 | 0 |
| 18314 | 0 |
| 18315 | 0 |
| 18316 | 0 |
| 18317 | 0 |
| 18318 | 0 |
| 18319 | 0 |
| 18320 | 0 |
| 18321 | 0 |
| 18322 | 0 |
| 18323 | 0 |
| 18324 | 0 |
| 18325 | 0 |
| 18326 | 0 |
| 18327 | 0 |
| 18328 | 0 |
| 18329 | 0 |
| 18330 | 0 |
| 18331 | 0 |
| 18332 | 0 |
| 18333 | 0 |
| 18334 | 0 |
| 18335 | 0 |
| 18336 | 0 |
| 18337 | 0 |
| 18338 | 912 |
| 18339 | 913 |
| 18340 | 913 |
| 18341 | 0 |
| 18342 | 0 |
| 18343 | 0 |
| 18344 | 0 |
| 18345 | 0 |
| 18346 | 0 |
| 18347 | 0 |
| 18348 | 0 |
| 18349 | 0 |
| 18350 | 0 |
| 18351 | 0 |
| 18352 | 0 |
| 18353 | 0 |
| 18354 | 0 |
| 18355 | 0 |
| 18356 | 0 |
| 18357 | 0 |
| 18358 | 0 |
| 18359 | 0 |
| 18360 | 0 |
| 18361 | 0 |
| 18362 | 0 |
| 18363 | 0 |
| 18364 | 0 |
| 18365 | 0 |
| 18366 | 0 |
| 18367 | 0 |
| 18368 | 0 |
| 18369 | 0 |
| 18370 | 0 |
| 18371 | 0 |
| 18372 | 0 |
| 18373 | 0 |
| 18374 | 0 |
| 18375 | 0 |
| 18376 | 0 |
| 18377 | 0 |
| 18378 | 0 |
| 18379 | 0 |
| 18380 | 0 |
| 18381 | 0 |
| 18382 | 0 |
| 18383 | 0 |
| 18384 | 0 |
| 18385 | 0 |
| 18386 | 913 |
| 18387 | 913 |
| 18388 | 912 |
| 18389 | 0 |
| 18390 | 0 |
| 18391 | 0 |
| 18392 | 0 |
| 18393 | 0 |
| 18394 | 0 |
| 18395 | 0 |
| 18396 | 0 |
| 18397 | 0 |
| 18398 | 0 |
| 18399 | 0 |
| 18400 | 0 |
| 18401 | 0 |
| 18402 | 0 |
| 18403 | 0 |
| 18404 | 0 |
| 18405 | 0 |
| 18406 | 0 |
| 18407 | 0 |
| 18408 | 0 |
| 18409 | 0 |
| 18410 | 0 |
| 18411 | 0 |
| 18412 | 0 |
| 18413 | 0 |
| 18414 | 0 |
| 18415 | 0 |
| 18416 | 0 |
| 18417 | 0 |
| 18418 | 0 |
| 18419 | 0 |
| 18420 | 0 |
| 18421 | 0 |
| 18422 | 0 |
| 18423 | 0 |
| 18424 | 0 |
| 18425 | 0 |
| 18426 | 0 |
| 18427 | 0 |
| 18428 | 0 |
| 18429 | 0 |
| 18430 | 0 |
| 18431 | 0 |
| 18432 | 0 |
| 18433 | 0 |
| 18434 | 911 |
| 18435 | 914 |
| 18436 | 913 |
| 18437 | 913 |
| 18438 | 0 |
| 18439 | 0 |
| 18440 | 0 |
| 18441 | 0 |
| 18442 | 0 |
| 18443 | 0 |
| 18444 | 0 |
| 18445 | 0 |
| 18446 | 0 |
| 18447 | 0 |
| 18448 | 0 |
| 18449 | 0 |
| 18450 | 0 |
| 18451 | 0 |
| 18452 | 0 |
| 18453 | 0 |
| 18454 | 0 |
| 18455 | 0 |
| 18456 | 0 |
| 18457 | 0 |
| 18458 | 0 |
| 18459 | 0 |
| 18460 | 0 |
| 18461 | 0 |
| 18462 | 0 |
| 18463 | 0 |
| 18464 | 0 |
| 18465 | 0 |
| 18466 | 0 |
| 18467 | 0 |
| 18468 | 0 |
| 18469 | 0 |
| 18470 | 0 |
| 18471 | 0 |
| 18472 | 0 |
| 18473 | 0 |
| 18474 | 0 |
| 18475 | 0 |
| 18476 | 0 |
| 18477 | 0 |
| 18478 | 0 |
| 18479 | 0 |
| 18480 | 0 |
| 18481 | 0 |
| 18482 | 911 |
| 18483 | 911 |
| 18484 | 911 |
| 18485 | 911 |
| 18486 | 0 |
| 18487 | 0 |
| 18488 | 0 |
| 18489 | 0 |
| 18490 | 0 |
| 18491 | 0 |
| 18492 | 0 |
| 18493 | 0 |
| 18494 | 0 |
| 18495 | 0 |
| 18496 | 0 |
| 18497 | 0 |
| 18498 | 0 |
| 18499 | 0 |
| 18500 | 0 |
| 18501 | 0 |
| 18502 | 0 |
| 18503 | 0 |
| 18504 | 0 |
| 18505 | 0 |
| 18506 | 0 |
| 18507 | 0 |
| 18508 | 0 |
| 18509 | 0 |
| 18510 | 0 |
| 18511 | 0 |
| 18512 | 0 |
| 18513 | 0 |
| 18514 | 0 |
| 18515 | 0 |
| 18516 | 0 |
| 18517 | 0 |
| 18518 | 0 |
| 18519 | 0 |
| 18520 | 0 |
| 18521 | 0 |
| 18522 | 0 |
| 18523 | 0 |
| 18524 | 0 |
| 18525 | 0 |
| 18526 | 0 |
| 18527 | 0 |
| 18528 | 0 |
| 18529 | 0 |
| 18530 | 913 |
| 18531 | 912 |
| 18532 | 910 |
| 18533 | 0 |
| 18534 | 0 |
| 18535 | 0 |
| 18536 | 0 |
| 18537 | 0 |
| 18538 | 0 |
| 18539 | 0 |
| 18540 | 0 |
| 18541 | 0 |
| 18542 | 0 |
| 18543 | 0 |
| 18544 | 0 |
| 18545 | 0 |
| 18546 | 0 |
| 18547 | 0 |
| 18548 | 0 |
| 18549 | 0 |
| 18550 | 0 |
| 18551 | 0 |
| 18552 | 0 |
| 18553 | 0 |
| 18554 | 0 |
| 18555 | 0 |
| 18556 | 0 |
| 18557 | 0 |
| 18558 | 0 |
| 18559 | 0 |
| 18560 | 0 |
| 18561 | 0 |
| 18562 | 0 |
| 18563 | 0 |
| 18564 | 0 |
| 18565 | 0 |
| 18566 | 0 |
| 18567 | 0 |
| 18568 | 0 |
| 18569 | 0 |
| 18570 | 0 |
| 18571 | 0 |
| 18572 | 0 |
| 18573 | 0 |
| 18574 | 0 |
| 18575 | 0 |
| 18576 | 0 |
| 18577 | 0 |
| 18578 | 912 |
| 18579 | 911 |
| 18580 | 910 |
| 18581 | 909 |
| 18582 | 0 |
| 18583 | 0 |
| 18584 | 0 |
| 18585 | 0 |
| 18586 | 0 |
| 18587 | 0 |
| 18588 | 0 |
| 18589 | 0 |
| 18590 | 0 |
| 18591 | 0 |
| 18592 | 0 |
| 18593 | 0 |
| 18594 | 0 |
| 18595 | 0 |
| 18596 | 0 |
| 18597 | 0 |
| 18598 | 0 |
| 18599 | 0 |
| 18600 | 0 |
| 18601 | 0 |
| 18602 | 0 |
| 18603 | 0 |
| 18604 | 0 |
| 18605 | 0 |
| 18606 | 0 |
| 18607 | 0 |
| 18608 | 0 |
| 18609 | 0 |
| 18610 | 0 |
| 18611 | 0 |
| 18612 | 0 |
| 18613 | 0 |
| 18614 | 0 |
| 18615 | 0 |
| 18616 | 0 |
| 18617 | 0 |
| 18618 | 0 |
| 18619 | 0 |
| 18620 | 0 |
| 18621 | 0 |
| 18622 | 0 |
| 18623 | 0 |
| 18624 | 0 |
| 18625 | 0 |
| 18626 | 914 |
| 18627 | 913 |
| 18628 | 913 |
| 18629 | 913 |
| 18630 | 0 |
| 18631 | 0 |
| 18632 | 0 |
| 18633 | 0 |
| 18634 | 0 |
| 18635 | 0 |
| 18636 | 0 |
| 18637 | 0 |
| 18638 | 0 |
| 18639 | 0 |
| 18640 | 0 |
| 18641 | 0 |
| 18642 | 0 |
| 18643 | 0 |
| 18644 | 0 |
| 18645 | 0 |
| 18646 | 0 |
| 18647 | 0 |
| 18648 | 0 |
| 18649 | 0 |
| 18650 | 0 |
| 18651 | 0 |
| 18652 | 0 |
| 18653 | 0 |
| 18654 | 0 |
| 18655 | 0 |
| 18656 | 0 |
| 18657 | 0 |
| 18658 | 0 |
| 18659 | 0 |
| 18660 | 0 |
| 18661 | 0 |
| 18662 | 0 |
| 18663 | 0 |
| 18664 | 0 |
| 18665 | 0 |
| 18666 | 0 |
| 18667 | 0 |
| 18668 | 0 |
| 18669 | 0 |
| 18670 | 0 |
| 18671 | 0 |
| 18672 | 0 |
| 18673 | 0 |
| 18674 | 0 |
| 18675 | 914 |
| 18676 | 914 |
| 18677 | 912 |
| 18678 | 0 |
| 18679 | 0 |
| 18680 | 0 |
| 18681 | 0 |
| 18682 | 0 |
| 18683 | 0 |
| 18684 | 0 |
| 18685 | 0 |
| 18686 | 0 |
| 18687 | 0 |
| 18688 | 0 |
| 18689 | 0 |
| 18690 | 0 |
| 18691 | 0 |
| 18692 | 0 |
| 18693 | 0 |
| 18694 | 0 |
| 18695 | 0 |
| 18696 | 0 |
| 18697 | 0 |
| 18698 | 0 |
| 18699 | 0 |
| 18700 | 0 |
| 18701 | 0 |
| 18702 | 0 |
| 18703 | 0 |
| 18704 | 0 |
| 18705 | 0 |
| 18706 | 0 |
| 18707 | 0 |
| 18708 | 0 |
| 18709 | 0 |
| 18710 | 0 |
| 18711 | 0 |
| 18712 | 0 |
| 18713 | 0 |
| 18714 | 0 |
| 18715 | 0 |
| 18716 | 0 |
| 18717 | 0 |
| 18718 | 0 |
| 18719 | 0 |
| 18720 | 0 |
| 18721 | 0 |
| 18722 | 0 |
| 18723 | 913 |
| 18724 | 913 |
| 18725 | 913 |
| 18726 | 0 |
| 18727 | 0 |
| 18728 | 0 |
| 18729 | 0 |
| 18730 | 0 |
| 18731 | 0 |
| 18732 | 0 |
| 18733 | 0 |
| 18734 | 0 |
| 18735 | 0 |
| 18736 | 0 |
| 18737 | 0 |
| 18738 | 0 |
| 18739 | 0 |
| 18740 | 0 |
| 18741 | 0 |
| 18742 | 0 |
| 18743 | 0 |
| 18744 | 0 |
| 18745 | 0 |
| 18746 | 0 |
| 18747 | 0 |
| 18748 | 0 |
| 18749 | 0 |
| 18750 | 0 |
| 18751 | 0 |
| 18752 | 0 |
| 18753 | 0 |
| 18754 | 0 |
| 18755 | 0 |
| 18756 | 0 |
| 18757 | 0 |
| 18758 | 0 |
| 18759 | 0 |
| 18760 | 0 |
| 18761 | 0 |
| 18762 | 0 |
| 18763 | 0 |
| 18764 | 0 |
| 18765 | 0 |
| 18766 | 0 |
| 18767 | 0 |
| 18768 | 0 |
| 18769 | 0 |
| 18770 | 0 |
| 18771 | 911 |
| 18772 | 910 |
| 18773 | 910 |
| 18774 | 910 |
| 18775 | 0 |
| 18776 | 0 |
| 18777 | 0 |
| 18778 | 0 |
| 18779 | 0 |
| 18780 | 0 |
| 18781 | 0 |
| 18782 | 0 |
| 18783 | 0 |
| 18784 | 0 |
| 18785 | 0 |
| 18786 | 0 |
| 18787 | 0 |
| 18788 | 0 |
| 18789 | 0 |
| 18790 | 0 |
| 18791 | 0 |
| 18792 | 0 |
| 18793 | 0 |
| 18794 | 0 |
| 18795 | 0 |
| 18796 | 0 |
| 18797 | 0 |
| 18798 | 0 |
| 18799 | 0 |
| 18800 | 0 |
| 18801 | 0 |
| 18802 | 0 |
| 18803 | 0 |
| 18804 | 0 |
| 18805 | 0 |
| 18806 | 0 |
| 18807 | 0 |
| 18808 | 0 |
| 18809 | 0 |
| 18810 | 0 |
| 18811 | 0 |
| 18812 | 0 |
| 18813 | 0 |
| 18814 | 0 |
| 18815 | 0 |
| 18816 | 0 |
| 18817 | 0 |
| 18818 | 0 |
| 18819 | 489 |
| 18820 | 910 |
| 18821 | 909 |
| 18822 | 909 |
| 18823 | 0 |
| 18824 | 0 |
| 18825 | 0 |
| 18826 | 0 |
| 18827 | 0 |
| 18828 | 0 |
| 18829 | 0 |
| 18830 | 0 |
| 18831 | 0 |
| 18832 | 0 |
| 18833 | 0 |
| 18834 | 0 |
| 18835 | 0 |
| 18836 | 0 |
| 18837 | 0 |
| 18838 | 0 |
| 18839 | 0 |
| 18840 | 0 |
| 18841 | 0 |
| 18842 | 0 |
| 18843 | 0 |
| 18844 | 0 |
| 18845 | 0 |
| 18846 | 0 |
| 18847 | 0 |
| 18848 | 0 |
| 18849 | 0 |
| 18850 | 0 |
| 18851 | 0 |
| 18852 | 0 |
| 18853 | 0 |
| 18854 | 0 |
| 18855 | 0 |
| 18856 | 0 |
| 18857 | 0 |
| 18858 | 0 |
| 18859 | 0 |
| 18860 | 0 |
| 18861 | 0 |
| 18862 | 0 |
| 18863 | 0 |
| 18864 | 0 |
| 18865 | 0 |
| 18866 | 0 |
| 18867 | 0 |
| 18868 | 910 |
| 18869 | 911 |
| 18870 | 911 |
| 18871 | 0 |
| 18872 | 0 |
| 18873 | 0 |
| 18874 | 0 |
| 18875 | 0 |
| 18876 | 0 |
| 18877 | 0 |
| 18878 | 0 |
| 18879 | 0 |
| 18880 | 0 |
| 18881 | 0 |
| 18882 | 0 |
| 18883 | 0 |
| 18884 | 0 |
| 18885 | 0 |
| 18886 | 0 |
| 18887 | 0 |
| 18888 | 0 |
| 18889 | 0 |
| 18890 | 0 |
| 18891 | 0 |
| 18892 | 0 |
| 18893 | 0 |
| 18894 | 0 |
| 18895 | 0 |
| 18896 | 0 |
| 18897 | 0 |
| 18898 | 0 |
| 18899 | 0 |
| 18900 | 0 |
| 18901 | 0 |
| 18902 | 0 |
| 18903 | 0 |
| 18904 | 0 |
| 18905 | 0 |
| 18906 | 0 |
| 18907 | 0 |
| 18908 | 0 |
| 18909 | 0 |
| 18910 | 0 |
| 18911 | 0 |
| 18912 | 0 |
| 18913 | 0 |
| 18914 | 0 |
| 18915 | 0 |
| 18916 | 912 |
| 18917 | 912 |
| 18918 | 911 |
| 18919 | 0 |
| 18920 | 0 |
| 18921 | 0 |
| 18922 | 0 |
| 18923 | 0 |
| 18924 | 0 |
| 18925 | 0 |
| 18926 | 0 |
| 18927 | 0 |
| 18928 | 0 |
| 18929 | 0 |
| 18930 | 0 |
| 18931 | 0 |
| 18932 | 0 |
| 18933 | 0 |
| 18934 | 0 |
| 18935 | 0 |
| 18936 | 0 |
| 18937 | 0 |
| 18938 | 0 |
| 18939 | 0 |
| 18940 | 0 |
| 18941 | 0 |
| 18942 | 0 |
| 18943 | 0 |
| 18944 | 0 |
| 18945 | 0 |
| 18946 | 0 |
| 18947 | 0 |
| 18948 | 0 |
| 18949 | 0 |
| 18950 | 0 |
| 18951 | 0 |
| 18952 | 0 |
| 18953 | 0 |
| 18954 | 0 |
| 18955 | 0 |
| 18956 | 0 |
| 18957 | 0 |
| 18958 | 0 |
| 18959 | 0 |
| 18960 | 0 |
| 18961 | 0 |
| 18962 | 0 |
| 18963 | 0 |
| 18964 | 910 |
| 18965 | 913 |
| 18966 | 912 |
| 18967 | 912 |
| 18968 | 0 |
| 18969 | 0 |
| 18970 | 0 |
| 18971 | 0 |
| 18972 | 0 |
| 18973 | 0 |
| 18974 | 0 |
| 18975 | 0 |
| 18976 | 0 |
| 18977 | 0 |
| 18978 | 0 |
| 18979 | 0 |
| 18980 | 0 |
| 18981 | 0 |
| 18982 | 0 |
| 18983 | 0 |
| 18984 | 0 |
| 18985 | 0 |
| 18986 | 0 |
| 18987 | 0 |
| 18988 | 0 |
| 18989 | 0 |
| 18990 | 0 |
| 18991 | 0 |
| 18992 | 0 |
| 18993 | 0 |
| 18994 | 0 |
| 18995 | 0 |
| 18996 | 0 |
| 18997 | 0 |
| 18998 | 0 |
| 18999 | 0 |
| 19000 | 0 |
| 19001 | 0 |
| 19002 | 0 |
| 19003 | 0 |
| 19004 | 0 |
| 19005 | 0 |
| 19006 | 0 |
| 19007 | 0 |
| 19008 | 0 |
| 19009 | 0 |
| 19010 | 0 |
| 19011 | 0 |
| 19012 | 911 |
| 19013 | 911 |
| 19014 | 909 |
| 19015 | 909 |
| 19016 | 0 |
| 19017 | 0 |
| 19018 | 0 |
| 19019 | 0 |
| 19020 | 0 |
| 19021 | 0 |
| 19022 | 0 |
| 19023 | 0 |
| 19024 | 0 |
| 19025 | 0 |
| 19026 | 0 |
| 19027 | 0 |
| 19028 | 0 |
| 19029 | 0 |
| 19030 | 0 |
| 19031 | 0 |
| 19032 | 0 |
| 19033 | 0 |
| 19034 | 0 |
| 19035 | 0 |
| 19036 | 0 |
| 19037 | 0 |
| 19038 | 0 |
| 19039 | 0 |
| 19040 | 0 |
| 19041 | 0 |
| 19042 | 0 |
| 19043 | 0 |
| 19044 | 0 |
| 19045 | 0 |
| 19046 | 0 |
| 19047 | 0 |
| 19048 | 0 |
| 19049 | 0 |
| 19050 | 0 |
| 19051 | 0 |
| 19052 | 0 |
| 19053 | 0 |
| 19054 | 0 |
| 19055 | 0 |
| 19056 | 0 |
| 19057 | 0 |
| 19058 | 0 |
| 19059 | 0 |
| 19060 | 913 |
| 19061 | 913 |
| 19062 | 913 |
| 19063 | 913 |
| 19064 | 0 |
| 19065 | 0 |
| 19066 | 0 |
| 19067 | 0 |
| 19068 | 0 |
| 19069 | 0 |
| 19070 | 0 |
| 19071 | 0 |
| 19072 | 0 |
| 19073 | 0 |
| 19074 | 0 |
| 19075 | 0 |
| 19076 | 0 |
| 19077 | 0 |
| 19078 | 0 |
| 19079 | 0 |
| 19080 | 0 |
| 19081 | 0 |
| 19082 | 0 |
| 19083 | 0 |
| 19084 | 0 |
| 19085 | 0 |
| 19086 | 0 |
| 19087 | 0 |
| 19088 | 0 |
| 19089 | 0 |
| 19090 | 0 |
| 19091 | 0 |
| 19092 | 0 |
| 19093 | 0 |
| 19094 | 0 |
| 19095 | 0 |
| 19096 | 0 |
| 19097 | 0 |
| 19098 | 0 |
| 19099 | 0 |
| 19100 | 0 |
| 19101 | 0 |
| 19102 | 0 |
| 19103 | 0 |
| 19104 | 0 |
| 19105 | 0 |
| 19106 | 0 |
| 19107 | 0 |
| 19108 | 0 |
| 19109 | 913 |
| 19110 | 913 |
| 19111 | 912 |
| 19112 | 0 |
| 19113 | 0 |
| 19114 | 0 |
| 19115 | 0 |
| 19116 | 0 |
| 19117 | 0 |
| 19118 | 0 |
| 19119 | 0 |
| 19120 | 0 |
| 19121 | 0 |
| 19122 | 0 |
| 19123 | 0 |
| 19124 | 0 |
| 19125 | 0 |
| 19126 | 0 |
| 19127 | 0 |
| 19128 | 0 |
| 19129 | 0 |
| 19130 | 0 |
| 19131 | 0 |
| 19132 | 0 |
| 19133 | 0 |
| 19134 | 0 |
| 19135 | 0 |
| 19136 | 0 |
| 19137 | 0 |
| 19138 | 0 |
| 19139 | 0 |
| 19140 | 0 |
| 19141 | 0 |
| 19142 | 0 |
| 19143 | 0 |
| 19144 | 0 |
| 19145 | 0 |
| 19146 | 0 |
| 19147 | 0 |
| 19148 | 0 |
| 19149 | 0 |
| 19150 | 0 |
| 19151 | 0 |
| 19152 | 0 |
| 19153 | 0 |
| 19154 | 0 |
| 19155 | 0 |
| 19156 | 0 |
| 19157 | 914 |
| 19158 | 914 |
| 19159 | 912 |
| 19160 | 912 |
| 19161 | 0 |
| 19162 | 0 |
| 19163 | 0 |
| 19164 | 0 |
| 19165 | 0 |
| 19166 | 0 |
| 19167 | 0 |
| 19168 | 0 |
| 19169 | 0 |
| 19170 | 0 |
| 19171 | 0 |
| 19172 | 0 |
| 19173 | 0 |
| 19174 | 0 |
| 19175 | 0 |
| 19176 | 0 |
| 19177 | 0 |
| 19178 | 0 |
| 19179 | 0 |
| 19180 | 0 |
| 19181 | 0 |
| 19182 | 0 |
| 19183 | 0 |
| 19184 | 0 |
| 19185 | 0 |
| 19186 | 0 |
| 19187 | 0 |
| 19188 | 0 |
| 19189 | 0 |
| 19190 | 0 |
| 19191 | 0 |
| 19192 | 0 |
| 19193 | 0 |
| 19194 | 0 |
| 19195 | 0 |
| 19196 | 0 |
| 19197 | 0 |
| 19198 | 0 |
| 19199 | 0 |
| 19200 | 0 |
| 19201 | 0 |
| 19202 | 0 |
| 19203 | 0 |
| 19204 | 0 |
| 19205 | 911 |
| 19206 | 910 |
| 19207 | 908 |
| 19208 | 909 |
| 19209 | 0 |
| 19210 | 0 |
| 19211 | 0 |
| 19212 | 0 |
| 19213 | 0 |
| 19214 | 0 |
| 19215 | 0 |
| 19216 | 0 |
| 19217 | 0 |
| 19218 | 0 |
| 19219 | 0 |
| 19220 | 0 |
| 19221 | 0 |
| 19222 | 0 |
| 19223 | 0 |
| 19224 | 0 |
| 19225 | 0 |
| 19226 | 0 |
| 19227 | 0 |
| 19228 | 0 |
| 19229 | 0 |
| 19230 | 0 |
| 19231 | 0 |
| 19232 | 0 |
| 19233 | 0 |
| 19234 | 0 |
| 19235 | 0 |
| 19236 | 0 |
| 19237 | 0 |
| 19238 | 0 |
| 19239 | 0 |
| 19240 | 0 |
| 19241 | 0 |
| 19242 | 0 |
| 19243 | 0 |
| 19244 | 0 |
| 19245 | 0 |
| 19246 | 0 |
| 19247 | 0 |
| 19248 | 0 |
| 19249 | 0 |
| 19250 | 0 |
| 19251 | 0 |
| 19252 | 0 |
| 19253 | 913 |
| 19254 | 913 |
| 19255 | 912 |
| 19256 | 912 |
| 19257 | 0 |
| 19258 | 0 |
| 19259 | 0 |
| 19260 | 0 |
| 19261 | 0 |
| 19262 | 0 |
| 19263 | 0 |
| 19264 | 0 |
| 19265 | 0 |
| 19266 | 0 |
| 19267 | 0 |
| 19268 | 0 |
| 19269 | 0 |
| 19270 | 0 |
| 19271 | 0 |
| 19272 | 0 |
| 19273 | 0 |
| 19274 | 0 |
| 19275 | 0 |
| 19276 | 0 |
| 19277 | 0 |
| 19278 | 0 |
| 19279 | 0 |
| 19280 | 0 |
| 19281 | 0 |
| 19282 | 0 |
| 19283 | 0 |
| 19284 | 0 |
| 19285 | 0 |
| 19286 | 0 |
| 19287 | 0 |
| 19288 | 0 |
| 19289 | 0 |
| 19290 | 0 |
| 19291 | 0 |
| 19292 | 0 |
| 19293 | 0 |
| 19294 | 0 |
| 19295 | 0 |
| 19296 | 0 |
| 19297 | 0 |
| 19298 | 0 |
| 19299 | 0 |
| 19300 | 0 |
| 19301 | 912 |
| 19302 | 912 |
| 19303 | 910 |
| 19304 | 910 |
| 19305 | 0 |
| 19306 | 0 |
| 19307 | 0 |
| 19308 | 0 |
| 19309 | 0 |
| 19310 | 0 |
| 19311 | 0 |
| 19312 | 0 |
| 19313 | 0 |
| 19314 | 0 |
| 19315 | 0 |
| 19316 | 0 |
| 19317 | 0 |
| 19318 | 0 |
| 19319 | 0 |
| 19320 | 0 |
| 19321 | 0 |
| 19322 | 0 |
| 19323 | 0 |
| 19324 | 0 |
| 19325 | 0 |
| 19326 | 0 |
| 19327 | 0 |
| 19328 | 0 |
| 19329 | 0 |
| 19330 | 0 |
| 19331 | 0 |
| 19332 | 0 |
| 19333 | 0 |
| 19334 | 0 |
| 19335 | 0 |
| 19336 | 0 |
| 19337 | 0 |
| 19338 | 0 |
| 19339 | 0 |
| 19340 | 0 |
| 19341 | 0 |
| 19342 | 0 |
| 19343 | 0 |
| 19344 | 0 |